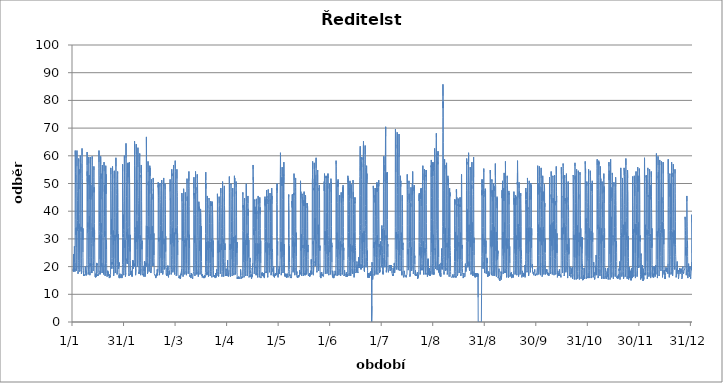
| Category | Series 0 |
|---|---|
| 2012-01-01 01:00:00 | 18.46 |
| 2012-01-01 02:00:00 | 18.72 |
| 2012-01-01 03:00:00 | 18.72 |
| 2012-01-01 04:00:00 | 18.72 |
| 2012-01-01 05:00:00 | 19.24 |
| 2012-01-01 06:00:00 | 18.2 |
| 2012-01-01 07:00:00 | 18.46 |
| 2012-01-01 08:00:00 | 24.44 |
| 2012-01-01 09:00:00 | 24.44 |
| 2012-01-01 10:00:00 | 23.66 |
| 2012-01-01 11:00:00 | 22.88 |
| 2012-01-01 12:00:00 | 22.1 |
| 2012-01-01 13:00:00 | 21.84 |
| 2012-01-01 14:00:00 | 21.58 |
| 2012-01-01 15:00:00 | 22.36 |
| 2012-01-01 16:00:00 | 21.84 |
| 2012-01-01 17:00:00 | 23.14 |
| 2012-01-01 18:00:00 | 23.66 |
| 2012-01-01 19:00:00 | 24.96 |
| 2012-01-01 20:00:00 | 26.52 |
| 2012-01-01 21:00:00 | 27.3 |
| 2012-01-01 22:00:00 | 27.04 |
| 2012-01-01 23:00:00 | 26 |
| 2012-01-02 | 25.74 |
| 2012-01-02 01:00:00 | 22.88 |
| 2012-01-02 02:00:00 | 18.72 |
| 2012-01-02 03:00:00 | 19.24 |
| 2012-01-02 04:00:00 | 18.2 |
| 2012-01-02 05:00:00 | 17.94 |
| 2012-01-02 06:00:00 | 21.32 |
| 2012-01-02 07:00:00 | 34.06 |
| 2012-01-02 08:00:00 | 60.32 |
| 2012-01-02 09:00:00 | 61.88 |
| 2012-01-02 10:00:00 | 60.32 |
| 2012-01-02 11:00:00 | 59.28 |
| 2012-01-02 12:00:00 | 54.08 |
| 2012-01-02 13:00:00 | 51.22 |
| 2012-01-02 14:00:00 | 53.04 |
| 2012-01-02 15:00:00 | 50.44 |
| 2012-01-02 16:00:00 | 44.72 |
| 2012-01-02 17:00:00 | 37.96 |
| 2012-01-02 18:00:00 | 36.92 |
| 2012-01-02 19:00:00 | 36.92 |
| 2012-01-02 20:00:00 | 31.46 |
| 2012-01-02 21:00:00 | 34.06 |
| 2012-01-02 22:00:00 | 27.04 |
| 2012-01-02 23:00:00 | 20.02 |
| 2012-01-03 | 18.46 |
| 2012-01-03 01:00:00 | 18.46 |
| 2012-01-03 02:00:00 | 18.46 |
| 2012-01-03 03:00:00 | 18.46 |
| 2012-01-03 04:00:00 | 18.46 |
| 2012-01-03 05:00:00 | 19.76 |
| 2012-01-03 06:00:00 | 22.62 |
| 2012-01-03 07:00:00 | 33.28 |
| 2012-01-03 08:00:00 | 58.5 |
| 2012-01-03 09:00:00 | 61.88 |
| 2012-01-03 10:00:00 | 56.16 |
| 2012-01-03 11:00:00 | 52 |
| 2012-01-03 12:00:00 | 49.92 |
| 2012-01-03 13:00:00 | 49.66 |
| 2012-01-03 14:00:00 | 47.06 |
| 2012-01-03 15:00:00 | 45.5 |
| 2012-01-03 16:00:00 | 43.94 |
| 2012-01-03 17:00:00 | 36.66 |
| 2012-01-03 18:00:00 | 33.02 |
| 2012-01-03 19:00:00 | 35.36 |
| 2012-01-03 20:00:00 | 35.36 |
| 2012-01-03 21:00:00 | 34.06 |
| 2012-01-03 22:00:00 | 24.96 |
| 2012-01-03 23:00:00 | 19.5 |
| 2012-01-04 | 17.42 |
| 2012-01-04 01:00:00 | 17.42 |
| 2012-01-04 02:00:00 | 17.68 |
| 2012-01-04 03:00:00 | 18.2 |
| 2012-01-04 04:00:00 | 18.98 |
| 2012-01-04 05:00:00 | 21.58 |
| 2012-01-04 06:00:00 | 22.1 |
| 2012-01-04 07:00:00 | 33.28 |
| 2012-01-04 08:00:00 | 55.12 |
| 2012-01-04 09:00:00 | 59.02 |
| 2012-01-04 10:00:00 | 59.02 |
| 2012-01-04 11:00:00 | 58.76 |
| 2012-01-04 12:00:00 | 57.98 |
| 2012-01-04 13:00:00 | 56.94 |
| 2012-01-04 14:00:00 | 53.3 |
| 2012-01-04 15:00:00 | 55.12 |
| 2012-01-04 16:00:00 | 47.84 |
| 2012-01-04 17:00:00 | 38.74 |
| 2012-01-04 18:00:00 | 35.88 |
| 2012-01-04 19:00:00 | 34.84 |
| 2012-01-04 20:00:00 | 34.06 |
| 2012-01-04 21:00:00 | 35.36 |
| 2012-01-04 22:00:00 | 24.96 |
| 2012-01-04 23:00:00 | 19.5 |
| 2012-01-05 | 18.2 |
| 2012-01-05 01:00:00 | 17.94 |
| 2012-01-05 02:00:00 | 18.2 |
| 2012-01-05 03:00:00 | 18.2 |
| 2012-01-05 04:00:00 | 18.2 |
| 2012-01-05 05:00:00 | 18.72 |
| 2012-01-05 06:00:00 | 21.06 |
| 2012-01-05 07:00:00 | 32.24 |
| 2012-01-05 08:00:00 | 55.9 |
| 2012-01-05 09:00:00 | 60.06 |
| 2012-01-05 10:00:00 | 57.72 |
| 2012-01-05 11:00:00 | 56.94 |
| 2012-01-05 12:00:00 | 53.82 |
| 2012-01-05 13:00:00 | 55.12 |
| 2012-01-05 14:00:00 | 57.2 |
| 2012-01-05 15:00:00 | 55.38 |
| 2012-01-05 16:00:00 | 42.64 |
| 2012-01-05 17:00:00 | 33.28 |
| 2012-01-05 18:00:00 | 34.32 |
| 2012-01-05 19:00:00 | 33.02 |
| 2012-01-05 20:00:00 | 34.06 |
| 2012-01-05 21:00:00 | 32.5 |
| 2012-01-05 22:00:00 | 22.88 |
| 2012-01-05 23:00:00 | 18.98 |
| 2012-01-06 | 17.42 |
| 2012-01-06 01:00:00 | 17.16 |
| 2012-01-06 02:00:00 | 17.42 |
| 2012-01-06 03:00:00 | 17.42 |
| 2012-01-06 04:00:00 | 17.16 |
| 2012-01-06 05:00:00 | 18.2 |
| 2012-01-06 06:00:00 | 19.5 |
| 2012-01-06 07:00:00 | 32.24 |
| 2012-01-06 08:00:00 | 55.38 |
| 2012-01-06 09:00:00 | 62.66 |
| 2012-01-06 10:00:00 | 60.32 |
| 2012-01-06 11:00:00 | 57.2 |
| 2012-01-06 12:00:00 | 53.82 |
| 2012-01-06 13:00:00 | 51.74 |
| 2012-01-06 14:00:00 | 52 |
| 2012-01-06 15:00:00 | 49.92 |
| 2012-01-06 16:00:00 | 40.82 |
| 2012-01-06 17:00:00 | 33.54 |
| 2012-01-06 18:00:00 | 31.98 |
| 2012-01-06 19:00:00 | 31.2 |
| 2012-01-06 20:00:00 | 29.64 |
| 2012-01-06 21:00:00 | 33.8 |
| 2012-01-06 22:00:00 | 25.22 |
| 2012-01-06 23:00:00 | 23.4 |
| 2012-01-07 | 20.54 |
| 2012-01-07 01:00:00 | 20.8 |
| 2012-01-07 02:00:00 | 20.54 |
| 2012-01-07 03:00:00 | 20.54 |
| 2012-01-07 04:00:00 | 20.28 |
| 2012-01-07 05:00:00 | 18.46 |
| 2012-01-07 06:00:00 | 16.64 |
| 2012-01-07 07:00:00 | 16.64 |
| 2012-01-07 08:00:00 | 16.9 |
| 2012-01-07 09:00:00 | 16.9 |
| 2012-01-07 10:00:00 | 16.64 |
| 2012-01-07 11:00:00 | 16.9 |
| 2012-01-07 12:00:00 | 16.9 |
| 2012-01-07 13:00:00 | 16.64 |
| 2012-01-07 14:00:00 | 16.9 |
| 2012-01-07 15:00:00 | 16.64 |
| 2012-01-07 16:00:00 | 17.16 |
| 2012-01-07 17:00:00 | 17.42 |
| 2012-01-07 18:00:00 | 17.16 |
| 2012-01-07 19:00:00 | 17.42 |
| 2012-01-07 20:00:00 | 17.42 |
| 2012-01-07 21:00:00 | 17.16 |
| 2012-01-07 22:00:00 | 17.16 |
| 2012-01-07 23:00:00 | 16.64 |
| 2012-01-08 | 16.9 |
| 2012-01-08 01:00:00 | 16.9 |
| 2012-01-08 02:00:00 | 16.9 |
| 2012-01-08 03:00:00 | 16.64 |
| 2012-01-08 04:00:00 | 16.9 |
| 2012-01-08 05:00:00 | 16.64 |
| 2012-01-08 06:00:00 | 17.16 |
| 2012-01-08 07:00:00 | 17.42 |
| 2012-01-08 08:00:00 | 20.02 |
| 2012-01-08 09:00:00 | 17.94 |
| 2012-01-08 10:00:00 | 18.2 |
| 2012-01-08 11:00:00 | 18.72 |
| 2012-01-08 12:00:00 | 17.68 |
| 2012-01-08 13:00:00 | 17.42 |
| 2012-01-08 14:00:00 | 17.94 |
| 2012-01-08 15:00:00 | 17.94 |
| 2012-01-08 16:00:00 | 17.94 |
| 2012-01-08 17:00:00 | 17.94 |
| 2012-01-08 18:00:00 | 18.46 |
| 2012-01-08 19:00:00 | 18.2 |
| 2012-01-08 20:00:00 | 16.9 |
| 2012-01-08 21:00:00 | 17.42 |
| 2012-01-08 22:00:00 | 17.42 |
| 2012-01-08 23:00:00 | 17.16 |
| 2012-01-09 | 16.9 |
| 2012-01-09 01:00:00 | 17.42 |
| 2012-01-09 02:00:00 | 17.16 |
| 2012-01-09 03:00:00 | 17.16 |
| 2012-01-09 04:00:00 | 17.42 |
| 2012-01-09 05:00:00 | 20.8 |
| 2012-01-09 06:00:00 | 20.54 |
| 2012-01-09 07:00:00 | 33.8 |
| 2012-01-09 08:00:00 | 56.42 |
| 2012-01-09 09:00:00 | 61.36 |
| 2012-01-09 10:00:00 | 56.68 |
| 2012-01-09 11:00:00 | 52.78 |
| 2012-01-09 12:00:00 | 54.34 |
| 2012-01-09 13:00:00 | 50.7 |
| 2012-01-09 14:00:00 | 52 |
| 2012-01-09 15:00:00 | 52.26 |
| 2012-01-09 16:00:00 | 43.42 |
| 2012-01-09 17:00:00 | 34.32 |
| 2012-01-09 18:00:00 | 35.88 |
| 2012-01-09 19:00:00 | 31.98 |
| 2012-01-09 20:00:00 | 30.16 |
| 2012-01-09 21:00:00 | 30.42 |
| 2012-01-09 22:00:00 | 22.62 |
| 2012-01-09 23:00:00 | 18.98 |
| 2012-01-10 | 17.16 |
| 2012-01-10 01:00:00 | 17.16 |
| 2012-01-10 02:00:00 | 16.9 |
| 2012-01-10 03:00:00 | 17.16 |
| 2012-01-10 04:00:00 | 16.9 |
| 2012-01-10 05:00:00 | 18.2 |
| 2012-01-10 06:00:00 | 20.8 |
| 2012-01-10 07:00:00 | 32.24 |
| 2012-01-10 08:00:00 | 54.86 |
| 2012-01-10 09:00:00 | 59.54 |
| 2012-01-10 10:00:00 | 57.2 |
| 2012-01-10 11:00:00 | 53.04 |
| 2012-01-10 12:00:00 | 50.7 |
| 2012-01-10 13:00:00 | 52.78 |
| 2012-01-10 14:00:00 | 49.66 |
| 2012-01-10 15:00:00 | 53.04 |
| 2012-01-10 16:00:00 | 44.2 |
| 2012-01-10 17:00:00 | 33.54 |
| 2012-01-10 18:00:00 | 38.22 |
| 2012-01-10 19:00:00 | 35.88 |
| 2012-01-10 20:00:00 | 34.58 |
| 2012-01-10 21:00:00 | 34.84 |
| 2012-01-10 22:00:00 | 23.4 |
| 2012-01-10 23:00:00 | 18.98 |
| 2012-01-11 | 16.9 |
| 2012-01-11 01:00:00 | 17.16 |
| 2012-01-11 02:00:00 | 16.9 |
| 2012-01-11 03:00:00 | 18.2 |
| 2012-01-11 04:00:00 | 21.06 |
| 2012-01-11 05:00:00 | 20.28 |
| 2012-01-11 06:00:00 | 21.32 |
| 2012-01-11 07:00:00 | 32.5 |
| 2012-01-11 08:00:00 | 55.64 |
| 2012-01-11 09:00:00 | 59.54 |
| 2012-01-11 10:00:00 | 58.24 |
| 2012-01-11 11:00:00 | 54.86 |
| 2012-01-11 12:00:00 | 48.88 |
| 2012-01-11 13:00:00 | 44.2 |
| 2012-01-11 14:00:00 | 44.98 |
| 2012-01-11 15:00:00 | 49.4 |
| 2012-01-11 16:00:00 | 44.98 |
| 2012-01-11 17:00:00 | 37.96 |
| 2012-01-11 18:00:00 | 36.4 |
| 2012-01-11 19:00:00 | 35.88 |
| 2012-01-11 20:00:00 | 33.02 |
| 2012-01-11 21:00:00 | 28.34 |
| 2012-01-11 22:00:00 | 23.4 |
| 2012-01-11 23:00:00 | 21.32 |
| 2012-01-12 | 17.94 |
| 2012-01-12 01:00:00 | 18.46 |
| 2012-01-12 02:00:00 | 18.2 |
| 2012-01-12 03:00:00 | 18.46 |
| 2012-01-12 04:00:00 | 17.68 |
| 2012-01-12 05:00:00 | 19.76 |
| 2012-01-12 06:00:00 | 21.06 |
| 2012-01-12 07:00:00 | 34.32 |
| 2012-01-12 08:00:00 | 56.42 |
| 2012-01-12 09:00:00 | 59.8 |
| 2012-01-12 10:00:00 | 58.76 |
| 2012-01-12 11:00:00 | 56.42 |
| 2012-01-12 12:00:00 | 46.54 |
| 2012-01-12 13:00:00 | 45.5 |
| 2012-01-12 14:00:00 | 47.58 |
| 2012-01-12 15:00:00 | 46.8 |
| 2012-01-12 16:00:00 | 39.52 |
| 2012-01-12 17:00:00 | 32.76 |
| 2012-01-12 18:00:00 | 30.68 |
| 2012-01-12 19:00:00 | 34.06 |
| 2012-01-12 20:00:00 | 33.8 |
| 2012-01-12 21:00:00 | 27.3 |
| 2012-01-12 22:00:00 | 22.1 |
| 2012-01-12 23:00:00 | 18.46 |
| 2012-01-13 | 18.98 |
| 2012-01-13 01:00:00 | 21.06 |
| 2012-01-13 02:00:00 | 20.54 |
| 2012-01-13 03:00:00 | 20.54 |
| 2012-01-13 04:00:00 | 20.54 |
| 2012-01-13 05:00:00 | 21.84 |
| 2012-01-13 06:00:00 | 22.62 |
| 2012-01-13 07:00:00 | 30.68 |
| 2012-01-13 08:00:00 | 52.26 |
| 2012-01-13 09:00:00 | 56.16 |
| 2012-01-13 10:00:00 | 54.86 |
| 2012-01-13 11:00:00 | 49.66 |
| 2012-01-13 12:00:00 | 46.8 |
| 2012-01-13 13:00:00 | 48.62 |
| 2012-01-13 14:00:00 | 46.8 |
| 2012-01-13 15:00:00 | 41.86 |
| 2012-01-13 16:00:00 | 35.62 |
| 2012-01-13 17:00:00 | 29.12 |
| 2012-01-13 18:00:00 | 33.28 |
| 2012-01-13 19:00:00 | 31.72 |
| 2012-01-13 20:00:00 | 29.64 |
| 2012-01-13 21:00:00 | 24.18 |
| 2012-01-13 22:00:00 | 21.32 |
| 2012-01-13 23:00:00 | 17.68 |
| 2012-01-14 | 16.9 |
| 2012-01-14 01:00:00 | 16.64 |
| 2012-01-14 02:00:00 | 16.38 |
| 2012-01-14 03:00:00 | 16.64 |
| 2012-01-14 04:00:00 | 16.38 |
| 2012-01-14 05:00:00 | 16.64 |
| 2012-01-14 06:00:00 | 16.9 |
| 2012-01-14 07:00:00 | 17.42 |
| 2012-01-14 08:00:00 | 17.16 |
| 2012-01-14 09:00:00 | 16.12 |
| 2012-01-14 10:00:00 | 16.38 |
| 2012-01-14 11:00:00 | 16.9 |
| 2012-01-14 12:00:00 | 17.16 |
| 2012-01-14 13:00:00 | 17.16 |
| 2012-01-14 14:00:00 | 17.16 |
| 2012-01-14 15:00:00 | 16.9 |
| 2012-01-14 16:00:00 | 16.64 |
| 2012-01-14 17:00:00 | 16.64 |
| 2012-01-14 18:00:00 | 16.9 |
| 2012-01-14 19:00:00 | 16.38 |
| 2012-01-14 20:00:00 | 16.64 |
| 2012-01-14 21:00:00 | 18.2 |
| 2012-01-14 22:00:00 | 21.06 |
| 2012-01-14 23:00:00 | 20.02 |
| 2012-01-15 | 21.32 |
| 2012-01-15 01:00:00 | 20.54 |
| 2012-01-15 02:00:00 | 21.06 |
| 2012-01-15 03:00:00 | 20.54 |
| 2012-01-15 04:00:00 | 21.06 |
| 2012-01-15 05:00:00 | 17.68 |
| 2012-01-15 06:00:00 | 16.64 |
| 2012-01-15 07:00:00 | 16.64 |
| 2012-01-15 08:00:00 | 16.9 |
| 2012-01-15 09:00:00 | 16.9 |
| 2012-01-15 10:00:00 | 16.9 |
| 2012-01-15 11:00:00 | 16.38 |
| 2012-01-15 12:00:00 | 16.64 |
| 2012-01-15 13:00:00 | 16.64 |
| 2012-01-15 14:00:00 | 16.38 |
| 2012-01-15 15:00:00 | 16.64 |
| 2012-01-15 16:00:00 | 16.64 |
| 2012-01-15 17:00:00 | 17.16 |
| 2012-01-15 18:00:00 | 16.9 |
| 2012-01-15 19:00:00 | 16.64 |
| 2012-01-15 20:00:00 | 16.9 |
| 2012-01-15 21:00:00 | 16.64 |
| 2012-01-15 22:00:00 | 16.64 |
| 2012-01-15 23:00:00 | 16.38 |
| 2012-01-16 | 16.38 |
| 2012-01-16 01:00:00 | 16.38 |
| 2012-01-16 02:00:00 | 16.38 |
| 2012-01-16 03:00:00 | 16.64 |
| 2012-01-16 04:00:00 | 17.16 |
| 2012-01-16 05:00:00 | 17.94 |
| 2012-01-16 06:00:00 | 20.02 |
| 2012-01-16 07:00:00 | 31.46 |
| 2012-01-16 08:00:00 | 55.38 |
| 2012-01-16 09:00:00 | 61.88 |
| 2012-01-16 10:00:00 | 57.72 |
| 2012-01-16 11:00:00 | 55.64 |
| 2012-01-16 12:00:00 | 52.78 |
| 2012-01-16 13:00:00 | 52 |
| 2012-01-16 14:00:00 | 49.4 |
| 2012-01-16 15:00:00 | 47.32 |
| 2012-01-16 16:00:00 | 40.3 |
| 2012-01-16 17:00:00 | 35.88 |
| 2012-01-16 18:00:00 | 34.32 |
| 2012-01-16 19:00:00 | 32.76 |
| 2012-01-16 20:00:00 | 30.16 |
| 2012-01-16 21:00:00 | 31.46 |
| 2012-01-16 22:00:00 | 22.62 |
| 2012-01-16 23:00:00 | 18.98 |
| 2012-01-17 | 17.16 |
| 2012-01-17 01:00:00 | 17.68 |
| 2012-01-17 02:00:00 | 17.42 |
| 2012-01-17 03:00:00 | 18.46 |
| 2012-01-17 04:00:00 | 17.42 |
| 2012-01-17 05:00:00 | 17.94 |
| 2012-01-17 06:00:00 | 19.5 |
| 2012-01-17 07:00:00 | 31.2 |
| 2012-01-17 08:00:00 | 53.82 |
| 2012-01-17 09:00:00 | 59.8 |
| 2012-01-17 10:00:00 | 56.94 |
| 2012-01-17 11:00:00 | 56.16 |
| 2012-01-17 12:00:00 | 53.82 |
| 2012-01-17 13:00:00 | 52.26 |
| 2012-01-17 14:00:00 | 51.74 |
| 2012-01-17 15:00:00 | 53.56 |
| 2012-01-17 16:00:00 | 44.2 |
| 2012-01-17 17:00:00 | 34.32 |
| 2012-01-17 18:00:00 | 35.62 |
| 2012-01-17 19:00:00 | 32.5 |
| 2012-01-17 20:00:00 | 29.9 |
| 2012-01-17 21:00:00 | 31.46 |
| 2012-01-17 22:00:00 | 22.1 |
| 2012-01-17 23:00:00 | 20.02 |
| 2012-01-18 | 21.32 |
| 2012-01-18 01:00:00 | 20.54 |
| 2012-01-18 02:00:00 | 20.28 |
| 2012-01-18 03:00:00 | 20.02 |
| 2012-01-18 04:00:00 | 19.76 |
| 2012-01-18 05:00:00 | 17.68 |
| 2012-01-18 06:00:00 | 20.54 |
| 2012-01-18 07:00:00 | 31.98 |
| 2012-01-18 08:00:00 | 54.6 |
| 2012-01-18 09:00:00 | 56.68 |
| 2012-01-18 10:00:00 | 53.82 |
| 2012-01-18 11:00:00 | 54.86 |
| 2012-01-18 12:00:00 | 53.04 |
| 2012-01-18 13:00:00 | 50.96 |
| 2012-01-18 14:00:00 | 45.24 |
| 2012-01-18 15:00:00 | 40.82 |
| 2012-01-18 16:00:00 | 38.74 |
| 2012-01-18 17:00:00 | 34.32 |
| 2012-01-18 18:00:00 | 33.54 |
| 2012-01-18 19:00:00 | 29.9 |
| 2012-01-18 20:00:00 | 29.12 |
| 2012-01-18 21:00:00 | 29.38 |
| 2012-01-18 22:00:00 | 23.14 |
| 2012-01-18 23:00:00 | 18.72 |
| 2012-01-19 | 17.68 |
| 2012-01-19 01:00:00 | 17.42 |
| 2012-01-19 02:00:00 | 17.42 |
| 2012-01-19 03:00:00 | 17.68 |
| 2012-01-19 04:00:00 | 17.16 |
| 2012-01-19 05:00:00 | 18.98 |
| 2012-01-19 06:00:00 | 20.28 |
| 2012-01-19 07:00:00 | 31.2 |
| 2012-01-19 08:00:00 | 54.86 |
| 2012-01-19 09:00:00 | 57.72 |
| 2012-01-19 10:00:00 | 54.34 |
| 2012-01-19 11:00:00 | 49.4 |
| 2012-01-19 12:00:00 | 48.62 |
| 2012-01-19 13:00:00 | 47.06 |
| 2012-01-19 14:00:00 | 48.1 |
| 2012-01-19 15:00:00 | 49.4 |
| 2012-01-19 16:00:00 | 38.22 |
| 2012-01-19 17:00:00 | 30.68 |
| 2012-01-19 18:00:00 | 30.42 |
| 2012-01-19 19:00:00 | 32.76 |
| 2012-01-19 20:00:00 | 30.94 |
| 2012-01-19 21:00:00 | 30.16 |
| 2012-01-19 22:00:00 | 22.62 |
| 2012-01-19 23:00:00 | 18.72 |
| 2012-01-20 | 16.64 |
| 2012-01-20 01:00:00 | 16.64 |
| 2012-01-20 02:00:00 | 20.28 |
| 2012-01-20 03:00:00 | 20.8 |
| 2012-01-20 04:00:00 | 20.02 |
| 2012-01-20 05:00:00 | 20.54 |
| 2012-01-20 06:00:00 | 22.36 |
| 2012-01-20 07:00:00 | 30.94 |
| 2012-01-20 08:00:00 | 53.3 |
| 2012-01-20 09:00:00 | 56.42 |
| 2012-01-20 10:00:00 | 51.48 |
| 2012-01-20 11:00:00 | 47.58 |
| 2012-01-20 12:00:00 | 46.28 |
| 2012-01-20 13:00:00 | 53.3 |
| 2012-01-20 14:00:00 | 48.88 |
| 2012-01-20 15:00:00 | 41.08 |
| 2012-01-20 16:00:00 | 28.34 |
| 2012-01-20 17:00:00 | 26.26 |
| 2012-01-20 18:00:00 | 27.04 |
| 2012-01-20 19:00:00 | 29.64 |
| 2012-01-20 20:00:00 | 29.12 |
| 2012-01-20 21:00:00 | 26.26 |
| 2012-01-20 22:00:00 | 21.06 |
| 2012-01-20 23:00:00 | 17.42 |
| 2012-01-21 | 16.9 |
| 2012-01-21 01:00:00 | 16.64 |
| 2012-01-21 02:00:00 | 16.64 |
| 2012-01-21 03:00:00 | 16.64 |
| 2012-01-21 04:00:00 | 16.38 |
| 2012-01-21 05:00:00 | 16.38 |
| 2012-01-21 06:00:00 | 16.9 |
| 2012-01-21 07:00:00 | 16.9 |
| 2012-01-21 08:00:00 | 17.42 |
| 2012-01-21 09:00:00 | 18.46 |
| 2012-01-21 10:00:00 | 18.72 |
| 2012-01-21 11:00:00 | 18.2 |
| 2012-01-21 12:00:00 | 18.46 |
| 2012-01-21 13:00:00 | 17.94 |
| 2012-01-21 14:00:00 | 18.46 |
| 2012-01-21 15:00:00 | 18.46 |
| 2012-01-21 16:00:00 | 18.46 |
| 2012-01-21 17:00:00 | 18.46 |
| 2012-01-21 18:00:00 | 16.9 |
| 2012-01-21 19:00:00 | 17.94 |
| 2012-01-21 20:00:00 | 17.68 |
| 2012-01-21 21:00:00 | 17.68 |
| 2012-01-21 22:00:00 | 16.64 |
| 2012-01-21 23:00:00 | 16.9 |
| 2012-01-22 | 16.64 |
| 2012-01-22 01:00:00 | 16.9 |
| 2012-01-22 02:00:00 | 16.9 |
| 2012-01-22 03:00:00 | 16.9 |
| 2012-01-22 04:00:00 | 16.9 |
| 2012-01-22 05:00:00 | 17.16 |
| 2012-01-22 06:00:00 | 16.9 |
| 2012-01-22 07:00:00 | 16.9 |
| 2012-01-22 08:00:00 | 16.9 |
| 2012-01-22 09:00:00 | 16.38 |
| 2012-01-22 10:00:00 | 16.12 |
| 2012-01-22 11:00:00 | 15.86 |
| 2012-01-22 12:00:00 | 16.12 |
| 2012-01-22 13:00:00 | 16.12 |
| 2012-01-22 14:00:00 | 16.12 |
| 2012-01-22 15:00:00 | 16.12 |
| 2012-01-22 16:00:00 | 16.64 |
| 2012-01-22 17:00:00 | 17.16 |
| 2012-01-22 18:00:00 | 17.16 |
| 2012-01-22 19:00:00 | 17.16 |
| 2012-01-22 20:00:00 | 16.9 |
| 2012-01-22 21:00:00 | 16.9 |
| 2012-01-22 22:00:00 | 17.16 |
| 2012-01-22 23:00:00 | 16.12 |
| 2012-01-23 | 16.38 |
| 2012-01-23 01:00:00 | 16.38 |
| 2012-01-23 02:00:00 | 16.64 |
| 2012-01-23 03:00:00 | 16.38 |
| 2012-01-23 04:00:00 | 16.64 |
| 2012-01-23 05:00:00 | 17.16 |
| 2012-01-23 06:00:00 | 20.54 |
| 2012-01-23 07:00:00 | 31.2 |
| 2012-01-23 08:00:00 | 54.08 |
| 2012-01-23 09:00:00 | 55.64 |
| 2012-01-23 10:00:00 | 53.3 |
| 2012-01-23 11:00:00 | 51.74 |
| 2012-01-23 12:00:00 | 47.58 |
| 2012-01-23 13:00:00 | 44.72 |
| 2012-01-23 14:00:00 | 44.98 |
| 2012-01-23 15:00:00 | 44.98 |
| 2012-01-23 16:00:00 | 36.92 |
| 2012-01-23 17:00:00 | 31.72 |
| 2012-01-23 18:00:00 | 37.18 |
| 2012-01-23 19:00:00 | 37.18 |
| 2012-01-23 20:00:00 | 34.06 |
| 2012-01-23 21:00:00 | 30.68 |
| 2012-01-23 22:00:00 | 22.88 |
| 2012-01-23 23:00:00 | 19.24 |
| 2012-01-24 | 20.28 |
| 2012-01-24 01:00:00 | 21.32 |
| 2012-01-24 02:00:00 | 20.8 |
| 2012-01-24 03:00:00 | 21.58 |
| 2012-01-24 04:00:00 | 21.06 |
| 2012-01-24 05:00:00 | 21.58 |
| 2012-01-24 06:00:00 | 22.88 |
| 2012-01-24 07:00:00 | 32.5 |
| 2012-01-24 08:00:00 | 53.56 |
| 2012-01-24 09:00:00 | 56.16 |
| 2012-01-24 10:00:00 | 54.86 |
| 2012-01-24 11:00:00 | 53.82 |
| 2012-01-24 12:00:00 | 53.3 |
| 2012-01-24 13:00:00 | 50.18 |
| 2012-01-24 14:00:00 | 49.14 |
| 2012-01-24 15:00:00 | 49.14 |
| 2012-01-24 16:00:00 | 41.6 |
| 2012-01-24 17:00:00 | 30.68 |
| 2012-01-24 18:00:00 | 31.46 |
| 2012-01-24 19:00:00 | 31.2 |
| 2012-01-24 20:00:00 | 33.02 |
| 2012-01-24 21:00:00 | 27.82 |
| 2012-01-24 22:00:00 | 23.14 |
| 2012-01-24 23:00:00 | 18.98 |
| 2012-01-25 | 17.16 |
| 2012-01-25 01:00:00 | 16.64 |
| 2012-01-25 02:00:00 | 16.64 |
| 2012-01-25 03:00:00 | 16.38 |
| 2012-01-25 04:00:00 | 16.9 |
| 2012-01-25 05:00:00 | 17.94 |
| 2012-01-25 06:00:00 | 21.06 |
| 2012-01-25 07:00:00 | 31.72 |
| 2012-01-25 08:00:00 | 53.3 |
| 2012-01-25 09:00:00 | 53.82 |
| 2012-01-25 10:00:00 | 54.6 |
| 2012-01-25 11:00:00 | 51.74 |
| 2012-01-25 12:00:00 | 49.92 |
| 2012-01-25 13:00:00 | 50.7 |
| 2012-01-25 14:00:00 | 49.4 |
| 2012-01-25 15:00:00 | 48.88 |
| 2012-01-25 16:00:00 | 37.7 |
| 2012-01-25 17:00:00 | 33.02 |
| 2012-01-25 18:00:00 | 31.72 |
| 2012-01-25 19:00:00 | 31.46 |
| 2012-01-25 20:00:00 | 29.38 |
| 2012-01-25 21:00:00 | 31.46 |
| 2012-01-25 22:00:00 | 22.88 |
| 2012-01-25 23:00:00 | 19.24 |
| 2012-01-26 | 17.68 |
| 2012-01-26 01:00:00 | 20.02 |
| 2012-01-26 02:00:00 | 21.32 |
| 2012-01-26 03:00:00 | 20.02 |
| 2012-01-26 04:00:00 | 19.76 |
| 2012-01-26 05:00:00 | 20.02 |
| 2012-01-26 06:00:00 | 22.62 |
| 2012-01-26 07:00:00 | 31.72 |
| 2012-01-26 08:00:00 | 54.34 |
| 2012-01-26 09:00:00 | 59.28 |
| 2012-01-26 10:00:00 | 56.16 |
| 2012-01-26 11:00:00 | 53.04 |
| 2012-01-26 12:00:00 | 51.22 |
| 2012-01-26 13:00:00 | 50.7 |
| 2012-01-26 14:00:00 | 48.1 |
| 2012-01-26 15:00:00 | 46.02 |
| 2012-01-26 16:00:00 | 39.52 |
| 2012-01-26 17:00:00 | 30.68 |
| 2012-01-26 18:00:00 | 32.76 |
| 2012-01-26 19:00:00 | 32.5 |
| 2012-01-26 20:00:00 | 33.28 |
| 2012-01-26 21:00:00 | 30.42 |
| 2012-01-26 22:00:00 | 22.1 |
| 2012-01-26 23:00:00 | 19.76 |
| 2012-01-27 | 17.68 |
| 2012-01-27 01:00:00 | 17.42 |
| 2012-01-27 02:00:00 | 17.16 |
| 2012-01-27 03:00:00 | 17.42 |
| 2012-01-27 04:00:00 | 17.42 |
| 2012-01-27 05:00:00 | 18.72 |
| 2012-01-27 06:00:00 | 20.8 |
| 2012-01-27 07:00:00 | 30.94 |
| 2012-01-27 08:00:00 | 51.48 |
| 2012-01-27 09:00:00 | 54.34 |
| 2012-01-27 10:00:00 | 53.56 |
| 2012-01-27 11:00:00 | 51.74 |
| 2012-01-27 12:00:00 | 48.62 |
| 2012-01-27 13:00:00 | 46.8 |
| 2012-01-27 14:00:00 | 41.34 |
| 2012-01-27 15:00:00 | 33.02 |
| 2012-01-27 16:00:00 | 29.38 |
| 2012-01-27 17:00:00 | 28.08 |
| 2012-01-27 18:00:00 | 31.72 |
| 2012-01-27 19:00:00 | 30.16 |
| 2012-01-27 20:00:00 | 29.64 |
| 2012-01-27 21:00:00 | 30.68 |
| 2012-01-27 22:00:00 | 21.58 |
| 2012-01-27 23:00:00 | 19.24 |
| 2012-01-28 | 19.24 |
| 2012-01-28 01:00:00 | 21.32 |
| 2012-01-28 02:00:00 | 20.28 |
| 2012-01-28 03:00:00 | 21.58 |
| 2012-01-28 04:00:00 | 20.28 |
| 2012-01-28 05:00:00 | 17.94 |
| 2012-01-28 06:00:00 | 16.12 |
| 2012-01-28 07:00:00 | 16.38 |
| 2012-01-28 08:00:00 | 16.9 |
| 2012-01-28 09:00:00 | 15.86 |
| 2012-01-28 10:00:00 | 16.12 |
| 2012-01-28 11:00:00 | 15.86 |
| 2012-01-28 12:00:00 | 15.86 |
| 2012-01-28 13:00:00 | 16.64 |
| 2012-01-28 14:00:00 | 15.86 |
| 2012-01-28 15:00:00 | 15.86 |
| 2012-01-28 16:00:00 | 16.12 |
| 2012-01-28 17:00:00 | 16.12 |
| 2012-01-28 18:00:00 | 16.38 |
| 2012-01-28 19:00:00 | 17.42 |
| 2012-01-28 20:00:00 | 16.64 |
| 2012-01-28 21:00:00 | 16.64 |
| 2012-01-28 22:00:00 | 16.64 |
| 2012-01-28 23:00:00 | 16.64 |
| 2012-01-29 | 16.64 |
| 2012-01-29 01:00:00 | 16.9 |
| 2012-01-29 02:00:00 | 16.38 |
| 2012-01-29 03:00:00 | 16.64 |
| 2012-01-29 04:00:00 | 16.9 |
| 2012-01-29 05:00:00 | 16.64 |
| 2012-01-29 06:00:00 | 16.64 |
| 2012-01-29 07:00:00 | 16.9 |
| 2012-01-29 08:00:00 | 16.64 |
| 2012-01-29 09:00:00 | 15.86 |
| 2012-01-29 10:00:00 | 15.86 |
| 2012-01-29 11:00:00 | 15.6 |
| 2012-01-29 12:00:00 | 15.6 |
| 2012-01-29 13:00:00 | 15.86 |
| 2012-01-29 14:00:00 | 15.86 |
| 2012-01-29 15:00:00 | 15.86 |
| 2012-01-29 16:00:00 | 15.86 |
| 2012-01-29 17:00:00 | 17.16 |
| 2012-01-29 18:00:00 | 16.9 |
| 2012-01-29 19:00:00 | 17.16 |
| 2012-01-29 20:00:00 | 16.64 |
| 2012-01-29 21:00:00 | 16.64 |
| 2012-01-29 22:00:00 | 16.64 |
| 2012-01-29 23:00:00 | 15.86 |
| 2012-01-30 | 15.6 |
| 2012-01-30 01:00:00 | 15.86 |
| 2012-01-30 02:00:00 | 16.12 |
| 2012-01-30 03:00:00 | 15.6 |
| 2012-01-30 04:00:00 | 16.9 |
| 2012-01-30 05:00:00 | 19.76 |
| 2012-01-30 06:00:00 | 20.8 |
| 2012-01-30 07:00:00 | 30.42 |
| 2012-01-30 08:00:00 | 56.94 |
| 2012-01-30 09:00:00 | 54.34 |
| 2012-01-30 10:00:00 | 51.48 |
| 2012-01-30 11:00:00 | 48.62 |
| 2012-01-30 12:00:00 | 47.32 |
| 2012-01-30 13:00:00 | 45.5 |
| 2012-01-30 14:00:00 | 43.42 |
| 2012-01-30 15:00:00 | 42.64 |
| 2012-01-30 16:00:00 | 37.18 |
| 2012-01-30 17:00:00 | 34.06 |
| 2012-01-30 18:00:00 | 38.74 |
| 2012-01-30 19:00:00 | 33.54 |
| 2012-01-30 20:00:00 | 31.98 |
| 2012-01-30 21:00:00 | 30.42 |
| 2012-01-30 22:00:00 | 21.58 |
| 2012-01-30 23:00:00 | 18.72 |
| 2012-01-31 | 16.9 |
| 2012-01-31 01:00:00 | 17.42 |
| 2012-01-31 02:00:00 | 17.16 |
| 2012-01-31 03:00:00 | 17.16 |
| 2012-01-31 04:00:00 | 17.16 |
| 2012-01-31 05:00:00 | 18.72 |
| 2012-01-31 06:00:00 | 19.24 |
| 2012-01-31 07:00:00 | 33.02 |
| 2012-01-31 08:00:00 | 56.68 |
| 2012-01-31 09:00:00 | 60.06 |
| 2012-01-31 10:00:00 | 57.2 |
| 2012-01-31 11:00:00 | 52.78 |
| 2012-01-31 12:00:00 | 49.92 |
| 2012-01-31 13:00:00 | 46.54 |
| 2012-01-31 14:00:00 | 43.94 |
| 2012-01-31 15:00:00 | 40.04 |
| 2012-01-31 16:00:00 | 33.28 |
| 2012-01-31 17:00:00 | 26.78 |
| 2012-01-31 18:00:00 | 29.12 |
| 2012-01-31 19:00:00 | 29.12 |
| 2012-01-31 20:00:00 | 29.64 |
| 2012-01-31 21:00:00 | 29.9 |
| 2012-01-31 22:00:00 | 22.36 |
| 2012-01-31 23:00:00 | 18.98 |
| 2012-02-01 | 16.38 |
| 2012-02-01 01:00:00 | 16.64 |
| 2012-02-01 02:00:00 | 16.64 |
| 2012-02-01 03:00:00 | 16.38 |
| 2012-02-01 04:00:00 | 16.64 |
| 2012-02-01 05:00:00 | 17.68 |
| 2012-02-01 06:00:00 | 24.96 |
| 2012-02-01 07:00:00 | 35.88 |
| 2012-02-01 08:00:00 | 64.48 |
| 2012-02-01 09:00:00 | 59.28 |
| 2012-02-01 10:00:00 | 57.46 |
| 2012-02-01 11:00:00 | 54.86 |
| 2012-02-01 12:00:00 | 54.08 |
| 2012-02-01 13:00:00 | 50.7 |
| 2012-02-01 14:00:00 | 49.14 |
| 2012-02-01 15:00:00 | 45.24 |
| 2012-02-01 16:00:00 | 36.4 |
| 2012-02-01 17:00:00 | 31.2 |
| 2012-02-01 18:00:00 | 32.5 |
| 2012-02-01 19:00:00 | 30.16 |
| 2012-02-01 20:00:00 | 29.9 |
| 2012-02-01 21:00:00 | 29.38 |
| 2012-02-01 22:00:00 | 22.1 |
| 2012-02-01 23:00:00 | 22.88 |
| 2012-02-02 | 22.1 |
| 2012-02-02 01:00:00 | 21.06 |
| 2012-02-02 02:00:00 | 22.36 |
| 2012-02-02 03:00:00 | 21.06 |
| 2012-02-02 04:00:00 | 22.1 |
| 2012-02-02 05:00:00 | 21.58 |
| 2012-02-02 06:00:00 | 21.06 |
| 2012-02-02 07:00:00 | 33.8 |
| 2012-02-02 08:00:00 | 57.2 |
| 2012-02-02 09:00:00 | 55.38 |
| 2012-02-02 10:00:00 | 54.08 |
| 2012-02-02 11:00:00 | 52.26 |
| 2012-02-02 12:00:00 | 57.46 |
| 2012-02-02 13:00:00 | 50.18 |
| 2012-02-02 14:00:00 | 44.72 |
| 2012-02-02 15:00:00 | 40.82 |
| 2012-02-02 16:00:00 | 34.06 |
| 2012-02-02 17:00:00 | 28.86 |
| 2012-02-02 18:00:00 | 31.46 |
| 2012-02-02 19:00:00 | 29.38 |
| 2012-02-02 20:00:00 | 29.64 |
| 2012-02-02 21:00:00 | 26.78 |
| 2012-02-02 22:00:00 | 22.1 |
| 2012-02-02 23:00:00 | 17.94 |
| 2012-02-03 | 17.16 |
| 2012-02-03 01:00:00 | 17.16 |
| 2012-02-03 02:00:00 | 16.64 |
| 2012-02-03 03:00:00 | 16.9 |
| 2012-02-03 04:00:00 | 17.42 |
| 2012-02-03 05:00:00 | 21.58 |
| 2012-02-03 06:00:00 | 25.74 |
| 2012-02-03 07:00:00 | 34.58 |
| 2012-02-03 08:00:00 | 57.72 |
| 2012-02-03 09:00:00 | 55.38 |
| 2012-02-03 10:00:00 | 53.04 |
| 2012-02-03 11:00:00 | 50.96 |
| 2012-02-03 12:00:00 | 48.62 |
| 2012-02-03 13:00:00 | 44.72 |
| 2012-02-03 14:00:00 | 40.56 |
| 2012-02-03 15:00:00 | 36.4 |
| 2012-02-03 16:00:00 | 30.42 |
| 2012-02-03 17:00:00 | 25.48 |
| 2012-02-03 18:00:00 | 30.94 |
| 2012-02-03 19:00:00 | 31.46 |
| 2012-02-03 20:00:00 | 29.12 |
| 2012-02-03 21:00:00 | 28.08 |
| 2012-02-03 22:00:00 | 22.1 |
| 2012-02-03 23:00:00 | 18.72 |
| 2012-02-04 | 17.16 |
| 2012-02-04 01:00:00 | 17.68 |
| 2012-02-04 02:00:00 | 17.16 |
| 2012-02-04 03:00:00 | 17.16 |
| 2012-02-04 04:00:00 | 17.16 |
| 2012-02-04 05:00:00 | 17.42 |
| 2012-02-04 06:00:00 | 17.42 |
| 2012-02-04 07:00:00 | 17.16 |
| 2012-02-04 08:00:00 | 17.16 |
| 2012-02-04 09:00:00 | 17.42 |
| 2012-02-04 10:00:00 | 17.42 |
| 2012-02-04 11:00:00 | 17.94 |
| 2012-02-04 12:00:00 | 18.46 |
| 2012-02-04 13:00:00 | 18.72 |
| 2012-02-04 14:00:00 | 17.68 |
| 2012-02-04 15:00:00 | 17.42 |
| 2012-02-04 16:00:00 | 17.42 |
| 2012-02-04 17:00:00 | 16.9 |
| 2012-02-04 18:00:00 | 16.9 |
| 2012-02-04 19:00:00 | 17.42 |
| 2012-02-04 20:00:00 | 16.64 |
| 2012-02-04 21:00:00 | 17.16 |
| 2012-02-04 22:00:00 | 16.38 |
| 2012-02-04 23:00:00 | 16.64 |
| 2012-02-05 | 16.64 |
| 2012-02-05 01:00:00 | 16.64 |
| 2012-02-05 02:00:00 | 16.64 |
| 2012-02-05 03:00:00 | 16.64 |
| 2012-02-05 04:00:00 | 16.64 |
| 2012-02-05 05:00:00 | 16.64 |
| 2012-02-05 06:00:00 | 21.84 |
| 2012-02-05 07:00:00 | 21.58 |
| 2012-02-05 08:00:00 | 22.36 |
| 2012-02-05 09:00:00 | 21.32 |
| 2012-02-05 10:00:00 | 20.54 |
| 2012-02-05 11:00:00 | 20.28 |
| 2012-02-05 12:00:00 | 20.28 |
| 2012-02-05 13:00:00 | 20.54 |
| 2012-02-05 14:00:00 | 20.02 |
| 2012-02-05 15:00:00 | 19.24 |
| 2012-02-05 16:00:00 | 20.02 |
| 2012-02-05 17:00:00 | 19.76 |
| 2012-02-05 18:00:00 | 22.1 |
| 2012-02-05 19:00:00 | 21.06 |
| 2012-02-05 20:00:00 | 21.58 |
| 2012-02-05 21:00:00 | 20.28 |
| 2012-02-05 22:00:00 | 21.06 |
| 2012-02-05 23:00:00 | 20.02 |
| 2012-02-06 | 20.02 |
| 2012-02-06 01:00:00 | 21.06 |
| 2012-02-06 02:00:00 | 20.02 |
| 2012-02-06 03:00:00 | 20.28 |
| 2012-02-06 04:00:00 | 20.54 |
| 2012-02-06 05:00:00 | 20.28 |
| 2012-02-06 06:00:00 | 21.58 |
| 2012-02-06 07:00:00 | 32.24 |
| 2012-02-06 08:00:00 | 56.42 |
| 2012-02-06 09:00:00 | 65.26 |
| 2012-02-06 10:00:00 | 62.66 |
| 2012-02-06 11:00:00 | 58.76 |
| 2012-02-06 12:00:00 | 56.68 |
| 2012-02-06 13:00:00 | 56.16 |
| 2012-02-06 14:00:00 | 55.64 |
| 2012-02-06 15:00:00 | 51.74 |
| 2012-02-06 16:00:00 | 42.64 |
| 2012-02-06 17:00:00 | 33.54 |
| 2012-02-06 18:00:00 | 34.06 |
| 2012-02-06 19:00:00 | 30.42 |
| 2012-02-06 20:00:00 | 28.6 |
| 2012-02-06 21:00:00 | 30.94 |
| 2012-02-06 22:00:00 | 23.14 |
| 2012-02-06 23:00:00 | 18.46 |
| 2012-02-07 | 16.9 |
| 2012-02-07 01:00:00 | 16.64 |
| 2012-02-07 02:00:00 | 16.9 |
| 2012-02-07 03:00:00 | 16.64 |
| 2012-02-07 04:00:00 | 17.16 |
| 2012-02-07 05:00:00 | 18.98 |
| 2012-02-07 06:00:00 | 25.74 |
| 2012-02-07 07:00:00 | 33.02 |
| 2012-02-07 08:00:00 | 60.06 |
| 2012-02-07 09:00:00 | 64.22 |
| 2012-02-07 10:00:00 | 60.58 |
| 2012-02-07 11:00:00 | 56.42 |
| 2012-02-07 12:00:00 | 47.58 |
| 2012-02-07 13:00:00 | 48.88 |
| 2012-02-07 14:00:00 | 47.58 |
| 2012-02-07 15:00:00 | 51.22 |
| 2012-02-07 16:00:00 | 38.74 |
| 2012-02-07 17:00:00 | 28.86 |
| 2012-02-07 18:00:00 | 36.4 |
| 2012-02-07 19:00:00 | 35.62 |
| 2012-02-07 20:00:00 | 33.28 |
| 2012-02-07 21:00:00 | 34.84 |
| 2012-02-07 22:00:00 | 26.26 |
| 2012-02-07 23:00:00 | 21.84 |
| 2012-02-08 | 20.54 |
| 2012-02-08 01:00:00 | 20.54 |
| 2012-02-08 02:00:00 | 20.02 |
| 2012-02-08 03:00:00 | 20.28 |
| 2012-02-08 04:00:00 | 20.02 |
| 2012-02-08 05:00:00 | 22.36 |
| 2012-02-08 06:00:00 | 22.1 |
| 2012-02-08 07:00:00 | 35.36 |
| 2012-02-08 08:00:00 | 56.94 |
| 2012-02-08 09:00:00 | 62.92 |
| 2012-02-08 10:00:00 | 55.9 |
| 2012-02-08 11:00:00 | 50.7 |
| 2012-02-08 12:00:00 | 45.76 |
| 2012-02-08 13:00:00 | 44.98 |
| 2012-02-08 14:00:00 | 43.94 |
| 2012-02-08 15:00:00 | 42.64 |
| 2012-02-08 16:00:00 | 37.96 |
| 2012-02-08 17:00:00 | 30.16 |
| 2012-02-08 18:00:00 | 31.72 |
| 2012-02-08 19:00:00 | 31.2 |
| 2012-02-08 20:00:00 | 28.86 |
| 2012-02-08 21:00:00 | 29.12 |
| 2012-02-08 22:00:00 | 22.1 |
| 2012-02-08 23:00:00 | 19.24 |
| 2012-02-09 | 17.42 |
| 2012-02-09 01:00:00 | 17.94 |
| 2012-02-09 02:00:00 | 17.42 |
| 2012-02-09 03:00:00 | 17.42 |
| 2012-02-09 04:00:00 | 17.42 |
| 2012-02-09 05:00:00 | 18.72 |
| 2012-02-09 06:00:00 | 20.54 |
| 2012-02-09 07:00:00 | 31.46 |
| 2012-02-09 08:00:00 | 54.08 |
| 2012-02-09 09:00:00 | 57.98 |
| 2012-02-09 10:00:00 | 60.84 |
| 2012-02-09 11:00:00 | 60.06 |
| 2012-02-09 12:00:00 | 52.52 |
| 2012-02-09 13:00:00 | 53.04 |
| 2012-02-09 14:00:00 | 52 |
| 2012-02-09 15:00:00 | 47.58 |
| 2012-02-09 16:00:00 | 36.66 |
| 2012-02-09 17:00:00 | 29.38 |
| 2012-02-09 18:00:00 | 31.2 |
| 2012-02-09 19:00:00 | 29.9 |
| 2012-02-09 20:00:00 | 27.56 |
| 2012-02-09 21:00:00 | 28.08 |
| 2012-02-09 22:00:00 | 21.58 |
| 2012-02-09 23:00:00 | 17.94 |
| 2012-02-10 | 16.9 |
| 2012-02-10 01:00:00 | 16.64 |
| 2012-02-10 02:00:00 | 16.64 |
| 2012-02-10 03:00:00 | 16.9 |
| 2012-02-10 04:00:00 | 17.16 |
| 2012-02-10 05:00:00 | 19.24 |
| 2012-02-10 06:00:00 | 26.26 |
| 2012-02-10 07:00:00 | 34.84 |
| 2012-02-10 08:00:00 | 56.68 |
| 2012-02-10 09:00:00 | 53.82 |
| 2012-02-10 10:00:00 | 54.08 |
| 2012-02-10 11:00:00 | 55.9 |
| 2012-02-10 12:00:00 | 51.74 |
| 2012-02-10 13:00:00 | 43.42 |
| 2012-02-10 14:00:00 | 40.3 |
| 2012-02-10 15:00:00 | 35.36 |
| 2012-02-10 16:00:00 | 29.38 |
| 2012-02-10 17:00:00 | 26.26 |
| 2012-02-10 18:00:00 | 28.6 |
| 2012-02-10 19:00:00 | 28.86 |
| 2012-02-10 20:00:00 | 29.38 |
| 2012-02-10 21:00:00 | 28.08 |
| 2012-02-10 22:00:00 | 22.36 |
| 2012-02-10 23:00:00 | 20.28 |
| 2012-02-11 | 17.42 |
| 2012-02-11 01:00:00 | 17.16 |
| 2012-02-11 02:00:00 | 17.42 |
| 2012-02-11 03:00:00 | 17.16 |
| 2012-02-11 04:00:00 | 17.68 |
| 2012-02-11 05:00:00 | 17.16 |
| 2012-02-11 06:00:00 | 17.42 |
| 2012-02-11 07:00:00 | 17.42 |
| 2012-02-11 08:00:00 | 16.9 |
| 2012-02-11 09:00:00 | 17.42 |
| 2012-02-11 10:00:00 | 17.16 |
| 2012-02-11 11:00:00 | 17.16 |
| 2012-02-11 12:00:00 | 16.9 |
| 2012-02-11 13:00:00 | 17.16 |
| 2012-02-11 14:00:00 | 16.9 |
| 2012-02-11 15:00:00 | 16.64 |
| 2012-02-11 16:00:00 | 17.16 |
| 2012-02-11 17:00:00 | 17.16 |
| 2012-02-11 18:00:00 | 17.16 |
| 2012-02-11 19:00:00 | 16.9 |
| 2012-02-11 20:00:00 | 17.16 |
| 2012-02-11 21:00:00 | 16.64 |
| 2012-02-11 22:00:00 | 16.38 |
| 2012-02-11 23:00:00 | 19.24 |
| 2012-02-12 | 20.28 |
| 2012-02-12 01:00:00 | 20.02 |
| 2012-02-12 02:00:00 | 18.46 |
| 2012-02-12 03:00:00 | 20.02 |
| 2012-02-12 04:00:00 | 20.54 |
| 2012-02-12 05:00:00 | 21.84 |
| 2012-02-12 06:00:00 | 20.8 |
| 2012-02-12 07:00:00 | 20.8 |
| 2012-02-12 08:00:00 | 20.54 |
| 2012-02-12 09:00:00 | 21.84 |
| 2012-02-12 10:00:00 | 20.8 |
| 2012-02-12 11:00:00 | 21.32 |
| 2012-02-12 12:00:00 | 20.02 |
| 2012-02-12 13:00:00 | 19.24 |
| 2012-02-12 14:00:00 | 17.94 |
| 2012-02-12 15:00:00 | 16.38 |
| 2012-02-12 16:00:00 | 16.38 |
| 2012-02-12 17:00:00 | 19.5 |
| 2012-02-12 18:00:00 | 20.54 |
| 2012-02-12 19:00:00 | 20.54 |
| 2012-02-12 20:00:00 | 19.5 |
| 2012-02-12 21:00:00 | 20.02 |
| 2012-02-12 22:00:00 | 20.28 |
| 2012-02-12 23:00:00 | 20.28 |
| 2012-02-13 | 20.02 |
| 2012-02-13 01:00:00 | 20.02 |
| 2012-02-13 02:00:00 | 21.32 |
| 2012-02-13 03:00:00 | 20.02 |
| 2012-02-13 04:00:00 | 21.32 |
| 2012-02-13 05:00:00 | 20.8 |
| 2012-02-13 06:00:00 | 21.06 |
| 2012-02-13 07:00:00 | 34.84 |
| 2012-02-13 08:00:00 | 64.74 |
| 2012-02-13 09:00:00 | 66.82 |
| 2012-02-13 10:00:00 | 62.92 |
| 2012-02-13 11:00:00 | 57.72 |
| 2012-02-13 12:00:00 | 54.6 |
| 2012-02-13 13:00:00 | 54.86 |
| 2012-02-13 14:00:00 | 47.58 |
| 2012-02-13 15:00:00 | 45.76 |
| 2012-02-13 16:00:00 | 41.6 |
| 2012-02-13 17:00:00 | 31.72 |
| 2012-02-13 18:00:00 | 34.58 |
| 2012-02-13 19:00:00 | 34.06 |
| 2012-02-13 20:00:00 | 30.68 |
| 2012-02-13 21:00:00 | 31.46 |
| 2012-02-13 22:00:00 | 23.4 |
| 2012-02-13 23:00:00 | 19.5 |
| 2012-02-14 | 17.42 |
| 2012-02-14 01:00:00 | 17.16 |
| 2012-02-14 02:00:00 | 17.42 |
| 2012-02-14 03:00:00 | 17.68 |
| 2012-02-14 04:00:00 | 17.42 |
| 2012-02-14 05:00:00 | 17.94 |
| 2012-02-14 06:00:00 | 20.8 |
| 2012-02-14 07:00:00 | 32.24 |
| 2012-02-14 08:00:00 | 57.98 |
| 2012-02-14 09:00:00 | 58.24 |
| 2012-02-14 10:00:00 | 54.08 |
| 2012-02-14 11:00:00 | 49.4 |
| 2012-02-14 12:00:00 | 49.92 |
| 2012-02-14 13:00:00 | 50.7 |
| 2012-02-14 14:00:00 | 47.58 |
| 2012-02-14 15:00:00 | 49.4 |
| 2012-02-14 16:00:00 | 38.22 |
| 2012-02-14 17:00:00 | 29.9 |
| 2012-02-14 18:00:00 | 34.32 |
| 2012-02-14 19:00:00 | 31.46 |
| 2012-02-14 20:00:00 | 30.16 |
| 2012-02-14 21:00:00 | 27.56 |
| 2012-02-14 22:00:00 | 22.88 |
| 2012-02-14 23:00:00 | 18.2 |
| 2012-02-15 | 19.76 |
| 2012-02-15 01:00:00 | 21.06 |
| 2012-02-15 02:00:00 | 19.76 |
| 2012-02-15 03:00:00 | 20.02 |
| 2012-02-15 04:00:00 | 19.76 |
| 2012-02-15 05:00:00 | 21.58 |
| 2012-02-15 06:00:00 | 21.06 |
| 2012-02-15 07:00:00 | 30.68 |
| 2012-02-15 08:00:00 | 53.82 |
| 2012-02-15 09:00:00 | 56.42 |
| 2012-02-15 10:00:00 | 52.78 |
| 2012-02-15 11:00:00 | 55.64 |
| 2012-02-15 12:00:00 | 46.28 |
| 2012-02-15 13:00:00 | 45.24 |
| 2012-02-15 14:00:00 | 45.5 |
| 2012-02-15 15:00:00 | 42.64 |
| 2012-02-15 16:00:00 | 37.18 |
| 2012-02-15 17:00:00 | 29.64 |
| 2012-02-15 18:00:00 | 30.68 |
| 2012-02-15 19:00:00 | 31.2 |
| 2012-02-15 20:00:00 | 31.72 |
| 2012-02-15 21:00:00 | 29.38 |
| 2012-02-15 22:00:00 | 22.62 |
| 2012-02-15 23:00:00 | 18.72 |
| 2012-02-16 | 17.68 |
| 2012-02-16 01:00:00 | 17.68 |
| 2012-02-16 02:00:00 | 17.42 |
| 2012-02-16 03:00:00 | 17.68 |
| 2012-02-16 04:00:00 | 17.68 |
| 2012-02-16 05:00:00 | 17.68 |
| 2012-02-16 06:00:00 | 19.76 |
| 2012-02-16 07:00:00 | 29.9 |
| 2012-02-16 08:00:00 | 50.18 |
| 2012-02-16 09:00:00 | 51.48 |
| 2012-02-16 10:00:00 | 49.14 |
| 2012-02-16 11:00:00 | 47.32 |
| 2012-02-16 12:00:00 | 44.2 |
| 2012-02-16 13:00:00 | 45.24 |
| 2012-02-16 14:00:00 | 46.28 |
| 2012-02-16 15:00:00 | 44.2 |
| 2012-02-16 16:00:00 | 35.1 |
| 2012-02-16 17:00:00 | 29.64 |
| 2012-02-16 18:00:00 | 33.8 |
| 2012-02-16 19:00:00 | 34.58 |
| 2012-02-16 20:00:00 | 32.5 |
| 2012-02-16 21:00:00 | 29.64 |
| 2012-02-16 22:00:00 | 21.84 |
| 2012-02-16 23:00:00 | 22.62 |
| 2012-02-17 | 21.32 |
| 2012-02-17 01:00:00 | 20.28 |
| 2012-02-17 02:00:00 | 20.8 |
| 2012-02-17 03:00:00 | 20.54 |
| 2012-02-17 04:00:00 | 20.8 |
| 2012-02-17 05:00:00 | 21.32 |
| 2012-02-17 06:00:00 | 20.28 |
| 2012-02-17 07:00:00 | 28.86 |
| 2012-02-17 08:00:00 | 50.7 |
| 2012-02-17 09:00:00 | 52 |
| 2012-02-17 10:00:00 | 50.44 |
| 2012-02-17 11:00:00 | 48.1 |
| 2012-02-17 12:00:00 | 47.32 |
| 2012-02-17 13:00:00 | 48.1 |
| 2012-02-17 14:00:00 | 44.46 |
| 2012-02-17 15:00:00 | 39.52 |
| 2012-02-17 16:00:00 | 30.68 |
| 2012-02-17 17:00:00 | 24.18 |
| 2012-02-17 18:00:00 | 31.46 |
| 2012-02-17 19:00:00 | 31.98 |
| 2012-02-17 20:00:00 | 31.2 |
| 2012-02-17 21:00:00 | 25.74 |
| 2012-02-17 22:00:00 | 22.88 |
| 2012-02-17 23:00:00 | 19.76 |
| 2012-02-18 | 17.42 |
| 2012-02-18 01:00:00 | 17.68 |
| 2012-02-18 02:00:00 | 17.16 |
| 2012-02-18 03:00:00 | 17.16 |
| 2012-02-18 04:00:00 | 17.42 |
| 2012-02-18 05:00:00 | 17.16 |
| 2012-02-18 06:00:00 | 17.68 |
| 2012-02-18 07:00:00 | 17.16 |
| 2012-02-18 08:00:00 | 16.9 |
| 2012-02-18 09:00:00 | 16.64 |
| 2012-02-18 10:00:00 | 16.64 |
| 2012-02-18 11:00:00 | 16.9 |
| 2012-02-18 12:00:00 | 16.64 |
| 2012-02-18 13:00:00 | 16.64 |
| 2012-02-18 14:00:00 | 16.64 |
| 2012-02-18 15:00:00 | 16.64 |
| 2012-02-18 16:00:00 | 16.9 |
| 2012-02-18 17:00:00 | 16.64 |
| 2012-02-18 18:00:00 | 16.38 |
| 2012-02-18 19:00:00 | 16.64 |
| 2012-02-18 20:00:00 | 16.64 |
| 2012-02-18 21:00:00 | 16.38 |
| 2012-02-18 22:00:00 | 16.64 |
| 2012-02-18 23:00:00 | 15.86 |
| 2012-02-19 | 16.38 |
| 2012-02-19 01:00:00 | 16.9 |
| 2012-02-19 02:00:00 | 16.38 |
| 2012-02-19 03:00:00 | 16.38 |
| 2012-02-19 04:00:00 | 16.64 |
| 2012-02-19 05:00:00 | 17.16 |
| 2012-02-19 06:00:00 | 16.64 |
| 2012-02-19 07:00:00 | 16.64 |
| 2012-02-19 08:00:00 | 17.16 |
| 2012-02-19 09:00:00 | 17.16 |
| 2012-02-19 10:00:00 | 16.9 |
| 2012-02-19 11:00:00 | 17.16 |
| 2012-02-19 12:00:00 | 17.42 |
| 2012-02-19 13:00:00 | 16.64 |
| 2012-02-19 14:00:00 | 17.42 |
| 2012-02-19 15:00:00 | 16.9 |
| 2012-02-19 16:00:00 | 16.9 |
| 2012-02-19 17:00:00 | 17.68 |
| 2012-02-19 18:00:00 | 18.98 |
| 2012-02-19 19:00:00 | 18.2 |
| 2012-02-19 20:00:00 | 17.42 |
| 2012-02-19 21:00:00 | 17.94 |
| 2012-02-19 22:00:00 | 17.42 |
| 2012-02-19 23:00:00 | 17.68 |
| 2012-02-20 | 17.16 |
| 2012-02-20 01:00:00 | 17.16 |
| 2012-02-20 02:00:00 | 17.42 |
| 2012-02-20 03:00:00 | 17.42 |
| 2012-02-20 04:00:00 | 17.16 |
| 2012-02-20 05:00:00 | 19.24 |
| 2012-02-20 06:00:00 | 19.5 |
| 2012-02-20 07:00:00 | 29.38 |
| 2012-02-20 08:00:00 | 50.44 |
| 2012-02-20 09:00:00 | 48.62 |
| 2012-02-20 10:00:00 | 49.4 |
| 2012-02-20 11:00:00 | 49.14 |
| 2012-02-20 12:00:00 | 45.76 |
| 2012-02-20 13:00:00 | 44.98 |
| 2012-02-20 14:00:00 | 45.24 |
| 2012-02-20 15:00:00 | 42.64 |
| 2012-02-20 16:00:00 | 33.54 |
| 2012-02-20 17:00:00 | 29.12 |
| 2012-02-20 18:00:00 | 29.9 |
| 2012-02-20 19:00:00 | 30.42 |
| 2012-02-20 20:00:00 | 29.9 |
| 2012-02-20 21:00:00 | 30.16 |
| 2012-02-20 22:00:00 | 22.62 |
| 2012-02-20 23:00:00 | 18.46 |
| 2012-02-21 | 16.9 |
| 2012-02-21 01:00:00 | 16.9 |
| 2012-02-21 02:00:00 | 16.9 |
| 2012-02-21 03:00:00 | 17.16 |
| 2012-02-21 04:00:00 | 17.68 |
| 2012-02-21 05:00:00 | 18.98 |
| 2012-02-21 06:00:00 | 23.66 |
| 2012-02-21 07:00:00 | 32.5 |
| 2012-02-21 08:00:00 | 50.18 |
| 2012-02-21 09:00:00 | 48.88 |
| 2012-02-21 10:00:00 | 47.58 |
| 2012-02-21 11:00:00 | 45.76 |
| 2012-02-21 12:00:00 | 44.2 |
| 2012-02-21 13:00:00 | 43.16 |
| 2012-02-21 14:00:00 | 43.42 |
| 2012-02-21 15:00:00 | 40.82 |
| 2012-02-21 16:00:00 | 34.84 |
| 2012-02-21 17:00:00 | 29.64 |
| 2012-02-21 18:00:00 | 30.68 |
| 2012-02-21 19:00:00 | 30.94 |
| 2012-02-21 20:00:00 | 29.9 |
| 2012-02-21 21:00:00 | 32.24 |
| 2012-02-21 22:00:00 | 23.14 |
| 2012-02-21 23:00:00 | 20.54 |
| 2012-02-22 | 18.2 |
| 2012-02-22 01:00:00 | 17.94 |
| 2012-02-22 02:00:00 | 17.68 |
| 2012-02-22 03:00:00 | 17.68 |
| 2012-02-22 04:00:00 | 17.94 |
| 2012-02-22 05:00:00 | 20.02 |
| 2012-02-22 06:00:00 | 20.02 |
| 2012-02-22 07:00:00 | 31.2 |
| 2012-02-22 08:00:00 | 51.22 |
| 2012-02-22 09:00:00 | 50.96 |
| 2012-02-22 10:00:00 | 49.92 |
| 2012-02-22 11:00:00 | 49.4 |
| 2012-02-22 12:00:00 | 47.32 |
| 2012-02-22 13:00:00 | 46.54 |
| 2012-02-22 14:00:00 | 43.68 |
| 2012-02-22 15:00:00 | 41.6 |
| 2012-02-22 16:00:00 | 35.88 |
| 2012-02-22 17:00:00 | 30.42 |
| 2012-02-22 18:00:00 | 32.76 |
| 2012-02-22 19:00:00 | 28.6 |
| 2012-02-22 20:00:00 | 30.94 |
| 2012-02-22 21:00:00 | 28.6 |
| 2012-02-22 22:00:00 | 22.1 |
| 2012-02-22 23:00:00 | 18.72 |
| 2012-02-23 | 17.16 |
| 2012-02-23 01:00:00 | 17.42 |
| 2012-02-23 02:00:00 | 17.16 |
| 2012-02-23 03:00:00 | 17.16 |
| 2012-02-23 04:00:00 | 17.42 |
| 2012-02-23 05:00:00 | 18.46 |
| 2012-02-23 06:00:00 | 21.32 |
| 2012-02-23 07:00:00 | 31.72 |
| 2012-02-23 08:00:00 | 50.44 |
| 2012-02-23 09:00:00 | 51.22 |
| 2012-02-23 10:00:00 | 50.96 |
| 2012-02-23 11:00:00 | 51.22 |
| 2012-02-23 12:00:00 | 49.14 |
| 2012-02-23 13:00:00 | 50.44 |
| 2012-02-23 14:00:00 | 52 |
| 2012-02-23 15:00:00 | 49.14 |
| 2012-02-23 16:00:00 | 37.7 |
| 2012-02-23 17:00:00 | 28.08 |
| 2012-02-23 18:00:00 | 28.34 |
| 2012-02-23 19:00:00 | 29.64 |
| 2012-02-23 20:00:00 | 29.12 |
| 2012-02-23 21:00:00 | 29.9 |
| 2012-02-23 22:00:00 | 22.88 |
| 2012-02-23 23:00:00 | 18.98 |
| 2012-02-24 | 20.54 |
| 2012-02-24 01:00:00 | 20.02 |
| 2012-02-24 02:00:00 | 20.02 |
| 2012-02-24 03:00:00 | 19.76 |
| 2012-02-24 04:00:00 | 19.76 |
| 2012-02-24 05:00:00 | 19.24 |
| 2012-02-24 06:00:00 | 20.02 |
| 2012-02-24 07:00:00 | 29.9 |
| 2012-02-24 08:00:00 | 49.4 |
| 2012-02-24 09:00:00 | 49.92 |
| 2012-02-24 10:00:00 | 49.92 |
| 2012-02-24 11:00:00 | 47.84 |
| 2012-02-24 12:00:00 | 45.76 |
| 2012-02-24 13:00:00 | 44.2 |
| 2012-02-24 14:00:00 | 41.86 |
| 2012-02-24 15:00:00 | 38.74 |
| 2012-02-24 16:00:00 | 29.12 |
| 2012-02-24 17:00:00 | 25.48 |
| 2012-02-24 18:00:00 | 30.94 |
| 2012-02-24 19:00:00 | 29.64 |
| 2012-02-24 20:00:00 | 28.08 |
| 2012-02-24 21:00:00 | 24.7 |
| 2012-02-24 22:00:00 | 21.84 |
| 2012-02-24 23:00:00 | 19.24 |
| 2012-02-25 | 17.16 |
| 2012-02-25 01:00:00 | 17.42 |
| 2012-02-25 02:00:00 | 17.42 |
| 2012-02-25 03:00:00 | 17.16 |
| 2012-02-25 04:00:00 | 17.16 |
| 2012-02-25 05:00:00 | 17.42 |
| 2012-02-25 06:00:00 | 17.42 |
| 2012-02-25 07:00:00 | 17.42 |
| 2012-02-25 08:00:00 | 17.16 |
| 2012-02-25 09:00:00 | 17.16 |
| 2012-02-25 10:00:00 | 16.64 |
| 2012-02-25 11:00:00 | 16.9 |
| 2012-02-25 12:00:00 | 17.42 |
| 2012-02-25 13:00:00 | 16.9 |
| 2012-02-25 14:00:00 | 17.68 |
| 2012-02-25 15:00:00 | 19.5 |
| 2012-02-25 16:00:00 | 17.94 |
| 2012-02-25 17:00:00 | 18.2 |
| 2012-02-25 18:00:00 | 18.2 |
| 2012-02-25 19:00:00 | 16.9 |
| 2012-02-25 20:00:00 | 20.28 |
| 2012-02-25 21:00:00 | 20.54 |
| 2012-02-25 22:00:00 | 19.76 |
| 2012-02-25 23:00:00 | 19.76 |
| 2012-02-26 | 20.02 |
| 2012-02-26 01:00:00 | 19.76 |
| 2012-02-26 02:00:00 | 19.76 |
| 2012-02-26 03:00:00 | 19.76 |
| 2012-02-26 04:00:00 | 20.28 |
| 2012-02-26 05:00:00 | 18.72 |
| 2012-02-26 06:00:00 | 16.64 |
| 2012-02-26 07:00:00 | 16.9 |
| 2012-02-26 08:00:00 | 16.9 |
| 2012-02-26 09:00:00 | 16.9 |
| 2012-02-26 10:00:00 | 16.12 |
| 2012-02-26 11:00:00 | 16.9 |
| 2012-02-26 12:00:00 | 16.64 |
| 2012-02-26 13:00:00 | 16.9 |
| 2012-02-26 14:00:00 | 16.9 |
| 2012-02-26 15:00:00 | 16.64 |
| 2012-02-26 16:00:00 | 16.64 |
| 2012-02-26 17:00:00 | 16.9 |
| 2012-02-26 18:00:00 | 17.94 |
| 2012-02-26 19:00:00 | 18.46 |
| 2012-02-26 20:00:00 | 18.72 |
| 2012-02-26 21:00:00 | 17.68 |
| 2012-02-26 22:00:00 | 17.42 |
| 2012-02-26 23:00:00 | 17.16 |
| 2012-02-27 | 17.42 |
| 2012-02-27 01:00:00 | 17.42 |
| 2012-02-27 02:00:00 | 17.68 |
| 2012-02-27 03:00:00 | 17.42 |
| 2012-02-27 04:00:00 | 17.42 |
| 2012-02-27 05:00:00 | 18.98 |
| 2012-02-27 06:00:00 | 19.76 |
| 2012-02-27 07:00:00 | 32.24 |
| 2012-02-27 08:00:00 | 48.36 |
| 2012-02-27 09:00:00 | 51.48 |
| 2012-02-27 10:00:00 | 47.06 |
| 2012-02-27 11:00:00 | 46.8 |
| 2012-02-27 12:00:00 | 44.72 |
| 2012-02-27 13:00:00 | 43.94 |
| 2012-02-27 14:00:00 | 44.72 |
| 2012-02-27 15:00:00 | 42.64 |
| 2012-02-27 16:00:00 | 34.84 |
| 2012-02-27 17:00:00 | 28.08 |
| 2012-02-27 18:00:00 | 31.72 |
| 2012-02-27 19:00:00 | 31.2 |
| 2012-02-27 20:00:00 | 30.42 |
| 2012-02-27 21:00:00 | 29.12 |
| 2012-02-27 22:00:00 | 22.36 |
| 2012-02-27 23:00:00 | 17.68 |
| 2012-02-28 | 17.16 |
| 2012-02-28 01:00:00 | 17.42 |
| 2012-02-28 02:00:00 | 17.16 |
| 2012-02-28 03:00:00 | 17.16 |
| 2012-02-28 04:00:00 | 17.94 |
| 2012-02-28 05:00:00 | 18.98 |
| 2012-02-28 06:00:00 | 23.92 |
| 2012-02-28 07:00:00 | 36.14 |
| 2012-02-28 08:00:00 | 55.12 |
| 2012-02-28 09:00:00 | 52.78 |
| 2012-02-28 10:00:00 | 53.56 |
| 2012-02-28 11:00:00 | 52.52 |
| 2012-02-28 12:00:00 | 52.52 |
| 2012-02-28 13:00:00 | 52.26 |
| 2012-02-28 14:00:00 | 50.96 |
| 2012-02-28 15:00:00 | 46.54 |
| 2012-02-28 16:00:00 | 36.66 |
| 2012-02-28 17:00:00 | 31.72 |
| 2012-02-28 18:00:00 | 33.8 |
| 2012-02-28 19:00:00 | 30.42 |
| 2012-02-28 20:00:00 | 32.5 |
| 2012-02-28 21:00:00 | 28.34 |
| 2012-02-28 22:00:00 | 22.62 |
| 2012-02-28 23:00:00 | 20.8 |
| 2012-02-29 | 17.94 |
| 2012-02-29 01:00:00 | 17.94 |
| 2012-02-29 02:00:00 | 17.94 |
| 2012-02-29 03:00:00 | 17.94 |
| 2012-02-29 04:00:00 | 17.94 |
| 2012-02-29 05:00:00 | 19.76 |
| 2012-02-29 06:00:00 | 20.02 |
| 2012-02-29 07:00:00 | 31.46 |
| 2012-02-29 08:00:00 | 54.34 |
| 2012-02-29 09:00:00 | 56.68 |
| 2012-02-29 10:00:00 | 55.64 |
| 2012-02-29 11:00:00 | 53.82 |
| 2012-02-29 12:00:00 | 50.18 |
| 2012-02-29 13:00:00 | 48.88 |
| 2012-02-29 14:00:00 | 46.02 |
| 2012-02-29 15:00:00 | 41.6 |
| 2012-02-29 16:00:00 | 31.98 |
| 2012-02-29 17:00:00 | 27.3 |
| 2012-02-29 18:00:00 | 30.42 |
| 2012-02-29 19:00:00 | 29.12 |
| 2012-02-29 20:00:00 | 32.24 |
| 2012-02-29 21:00:00 | 29.12 |
| 2012-02-29 22:00:00 | 20.8 |
| 2012-02-29 23:00:00 | 17.68 |
| 2012-03-01 | 17.16 |
| 2012-03-01 01:00:00 | 16.9 |
| 2012-03-01 02:00:00 | 16.9 |
| 2012-03-01 03:00:00 | 17.16 |
| 2012-03-01 04:00:00 | 17.68 |
| 2012-03-01 05:00:00 | 18.46 |
| 2012-03-01 06:00:00 | 21.32 |
| 2012-03-01 07:00:00 | 34.06 |
| 2012-03-01 08:00:00 | 53.82 |
| 2012-03-01 09:00:00 | 58.24 |
| 2012-03-01 10:00:00 | 55.64 |
| 2012-03-01 11:00:00 | 54.34 |
| 2012-03-01 12:00:00 | 51.22 |
| 2012-03-01 13:00:00 | 51.22 |
| 2012-03-01 14:00:00 | 51.48 |
| 2012-03-01 15:00:00 | 49.92 |
| 2012-03-01 16:00:00 | 40.3 |
| 2012-03-01 17:00:00 | 31.72 |
| 2012-03-01 18:00:00 | 33.8 |
| 2012-03-01 19:00:00 | 31.72 |
| 2012-03-01 20:00:00 | 31.72 |
| 2012-03-01 21:00:00 | 30.42 |
| 2012-03-01 22:00:00 | 22.1 |
| 2012-03-01 23:00:00 | 18.46 |
| 2012-03-02 | 16.64 |
| 2012-03-02 01:00:00 | 16.9 |
| 2012-03-02 02:00:00 | 16.64 |
| 2012-03-02 03:00:00 | 16.9 |
| 2012-03-02 04:00:00 | 16.9 |
| 2012-03-02 05:00:00 | 18.72 |
| 2012-03-02 06:00:00 | 21.58 |
| 2012-03-02 07:00:00 | 33.8 |
| 2012-03-02 08:00:00 | 49.66 |
| 2012-03-02 09:00:00 | 55.12 |
| 2012-03-02 10:00:00 | 51.74 |
| 2012-03-02 11:00:00 | 50.7 |
| 2012-03-02 12:00:00 | 47.58 |
| 2012-03-02 13:00:00 | 47.32 |
| 2012-03-02 14:00:00 | 46.8 |
| 2012-03-02 15:00:00 | 45.24 |
| 2012-03-02 16:00:00 | 34.84 |
| 2012-03-02 17:00:00 | 28.34 |
| 2012-03-02 18:00:00 | 31.98 |
| 2012-03-02 19:00:00 | 28.86 |
| 2012-03-02 20:00:00 | 29.38 |
| 2012-03-02 21:00:00 | 24.18 |
| 2012-03-02 22:00:00 | 20.28 |
| 2012-03-02 23:00:00 | 17.68 |
| 2012-03-03 | 16.9 |
| 2012-03-03 01:00:00 | 16.9 |
| 2012-03-03 02:00:00 | 16.9 |
| 2012-03-03 03:00:00 | 16.64 |
| 2012-03-03 04:00:00 | 16.9 |
| 2012-03-03 05:00:00 | 16.64 |
| 2012-03-03 06:00:00 | 17.16 |
| 2012-03-03 07:00:00 | 16.9 |
| 2012-03-03 08:00:00 | 16.9 |
| 2012-03-03 09:00:00 | 16.9 |
| 2012-03-03 10:00:00 | 17.16 |
| 2012-03-03 11:00:00 | 16.64 |
| 2012-03-03 12:00:00 | 16.38 |
| 2012-03-03 13:00:00 | 16.12 |
| 2012-03-03 14:00:00 | 15.86 |
| 2012-03-03 15:00:00 | 16.12 |
| 2012-03-03 16:00:00 | 16.12 |
| 2012-03-03 17:00:00 | 16.12 |
| 2012-03-03 18:00:00 | 16.12 |
| 2012-03-03 19:00:00 | 16.38 |
| 2012-03-03 20:00:00 | 16.64 |
| 2012-03-03 21:00:00 | 16.38 |
| 2012-03-03 22:00:00 | 16.38 |
| 2012-03-03 23:00:00 | 15.86 |
| 2012-03-04 | 16.38 |
| 2012-03-04 01:00:00 | 16.38 |
| 2012-03-04 02:00:00 | 16.12 |
| 2012-03-04 03:00:00 | 16.64 |
| 2012-03-04 04:00:00 | 16.38 |
| 2012-03-04 05:00:00 | 16.64 |
| 2012-03-04 06:00:00 | 16.64 |
| 2012-03-04 07:00:00 | 15.86 |
| 2012-03-04 08:00:00 | 16.9 |
| 2012-03-04 09:00:00 | 15.6 |
| 2012-03-04 10:00:00 | 15.86 |
| 2012-03-04 11:00:00 | 15.6 |
| 2012-03-04 12:00:00 | 15.86 |
| 2012-03-04 13:00:00 | 15.86 |
| 2012-03-04 14:00:00 | 16.12 |
| 2012-03-04 15:00:00 | 16.38 |
| 2012-03-04 16:00:00 | 15.86 |
| 2012-03-04 17:00:00 | 16.38 |
| 2012-03-04 18:00:00 | 16.38 |
| 2012-03-04 19:00:00 | 17.42 |
| 2012-03-04 20:00:00 | 16.9 |
| 2012-03-04 21:00:00 | 17.16 |
| 2012-03-04 22:00:00 | 16.64 |
| 2012-03-04 23:00:00 | 17.16 |
| 2012-03-05 | 17.16 |
| 2012-03-05 01:00:00 | 16.9 |
| 2012-03-05 02:00:00 | 16.9 |
| 2012-03-05 03:00:00 | 16.9 |
| 2012-03-05 04:00:00 | 16.64 |
| 2012-03-05 05:00:00 | 19.24 |
| 2012-03-05 06:00:00 | 18.98 |
| 2012-03-05 07:00:00 | 30.68 |
| 2012-03-05 08:00:00 | 46.54 |
| 2012-03-05 09:00:00 | 46.8 |
| 2012-03-05 10:00:00 | 46.28 |
| 2012-03-05 11:00:00 | 43.68 |
| 2012-03-05 12:00:00 | 43.68 |
| 2012-03-05 13:00:00 | 43.16 |
| 2012-03-05 14:00:00 | 41.08 |
| 2012-03-05 15:00:00 | 40.04 |
| 2012-03-05 16:00:00 | 33.02 |
| 2012-03-05 17:00:00 | 29.38 |
| 2012-03-05 18:00:00 | 32.24 |
| 2012-03-05 19:00:00 | 29.9 |
| 2012-03-05 20:00:00 | 33.02 |
| 2012-03-05 21:00:00 | 30.16 |
| 2012-03-05 22:00:00 | 22.36 |
| 2012-03-05 23:00:00 | 18.72 |
| 2012-03-06 | 16.38 |
| 2012-03-06 01:00:00 | 16.38 |
| 2012-03-06 02:00:00 | 16.38 |
| 2012-03-06 03:00:00 | 16.38 |
| 2012-03-06 04:00:00 | 16.38 |
| 2012-03-06 05:00:00 | 19.24 |
| 2012-03-06 06:00:00 | 21.32 |
| 2012-03-06 07:00:00 | 30.68 |
| 2012-03-06 08:00:00 | 48.1 |
| 2012-03-06 09:00:00 | 46.8 |
| 2012-03-06 10:00:00 | 47.06 |
| 2012-03-06 11:00:00 | 43.42 |
| 2012-03-06 12:00:00 | 43.16 |
| 2012-03-06 13:00:00 | 42.64 |
| 2012-03-06 14:00:00 | 39.52 |
| 2012-03-06 15:00:00 | 36.4 |
| 2012-03-06 16:00:00 | 31.2 |
| 2012-03-06 17:00:00 | 29.12 |
| 2012-03-06 18:00:00 | 29.64 |
| 2012-03-06 19:00:00 | 29.64 |
| 2012-03-06 20:00:00 | 28.34 |
| 2012-03-06 21:00:00 | 27.82 |
| 2012-03-06 22:00:00 | 22.36 |
| 2012-03-06 23:00:00 | 20.02 |
| 2012-03-07 | 18.2 |
| 2012-03-07 01:00:00 | 17.16 |
| 2012-03-07 02:00:00 | 17.16 |
| 2012-03-07 03:00:00 | 17.16 |
| 2012-03-07 04:00:00 | 17.16 |
| 2012-03-07 05:00:00 | 18.46 |
| 2012-03-07 06:00:00 | 19.24 |
| 2012-03-07 07:00:00 | 31.46 |
| 2012-03-07 08:00:00 | 46.8 |
| 2012-03-07 09:00:00 | 44.2 |
| 2012-03-07 10:00:00 | 42.12 |
| 2012-03-07 11:00:00 | 42.9 |
| 2012-03-07 12:00:00 | 42.12 |
| 2012-03-07 13:00:00 | 41.6 |
| 2012-03-07 14:00:00 | 40.04 |
| 2012-03-07 15:00:00 | 37.44 |
| 2012-03-07 16:00:00 | 31.98 |
| 2012-03-07 17:00:00 | 27.3 |
| 2012-03-07 18:00:00 | 30.16 |
| 2012-03-07 19:00:00 | 28.6 |
| 2012-03-07 20:00:00 | 29.12 |
| 2012-03-07 21:00:00 | 28.86 |
| 2012-03-07 22:00:00 | 21.06 |
| 2012-03-07 23:00:00 | 17.42 |
| 2012-03-08 | 16.9 |
| 2012-03-08 01:00:00 | 16.64 |
| 2012-03-08 02:00:00 | 16.9 |
| 2012-03-08 03:00:00 | 16.64 |
| 2012-03-08 04:00:00 | 17.16 |
| 2012-03-08 05:00:00 | 18.2 |
| 2012-03-08 06:00:00 | 20.28 |
| 2012-03-08 07:00:00 | 29.38 |
| 2012-03-08 08:00:00 | 51.74 |
| 2012-03-08 09:00:00 | 50.18 |
| 2012-03-08 10:00:00 | 44.2 |
| 2012-03-08 11:00:00 | 44.2 |
| 2012-03-08 12:00:00 | 43.68 |
| 2012-03-08 13:00:00 | 45.24 |
| 2012-03-08 14:00:00 | 43.68 |
| 2012-03-08 15:00:00 | 44.46 |
| 2012-03-08 16:00:00 | 38.74 |
| 2012-03-08 17:00:00 | 30.68 |
| 2012-03-08 18:00:00 | 31.98 |
| 2012-03-08 19:00:00 | 31.72 |
| 2012-03-08 20:00:00 | 33.02 |
| 2012-03-08 21:00:00 | 29.38 |
| 2012-03-08 22:00:00 | 22.62 |
| 2012-03-08 23:00:00 | 20.28 |
| 2012-03-09 | 18.72 |
| 2012-03-09 01:00:00 | 18.46 |
| 2012-03-09 02:00:00 | 17.42 |
| 2012-03-09 03:00:00 | 17.94 |
| 2012-03-09 04:00:00 | 17.68 |
| 2012-03-09 05:00:00 | 18.72 |
| 2012-03-09 06:00:00 | 20.02 |
| 2012-03-09 07:00:00 | 30.16 |
| 2012-03-09 08:00:00 | 48.1 |
| 2012-03-09 09:00:00 | 53.56 |
| 2012-03-09 10:00:00 | 53.82 |
| 2012-03-09 11:00:00 | 54.34 |
| 2012-03-09 12:00:00 | 50.96 |
| 2012-03-09 13:00:00 | 49.92 |
| 2012-03-09 14:00:00 | 48.88 |
| 2012-03-09 15:00:00 | 41.6 |
| 2012-03-09 16:00:00 | 29.9 |
| 2012-03-09 17:00:00 | 26.78 |
| 2012-03-09 18:00:00 | 31.46 |
| 2012-03-09 19:00:00 | 29.64 |
| 2012-03-09 20:00:00 | 29.12 |
| 2012-03-09 21:00:00 | 27.3 |
| 2012-03-09 22:00:00 | 20.28 |
| 2012-03-09 23:00:00 | 18.46 |
| 2012-03-10 | 16.38 |
| 2012-03-10 01:00:00 | 16.38 |
| 2012-03-10 02:00:00 | 16.12 |
| 2012-03-10 03:00:00 | 16.38 |
| 2012-03-10 04:00:00 | 16.12 |
| 2012-03-10 05:00:00 | 16.9 |
| 2012-03-10 06:00:00 | 16.64 |
| 2012-03-10 07:00:00 | 16.64 |
| 2012-03-10 08:00:00 | 16.38 |
| 2012-03-10 09:00:00 | 16.64 |
| 2012-03-10 10:00:00 | 16.64 |
| 2012-03-10 11:00:00 | 16.64 |
| 2012-03-10 12:00:00 | 16.64 |
| 2012-03-10 13:00:00 | 16.64 |
| 2012-03-10 14:00:00 | 16.64 |
| 2012-03-10 15:00:00 | 16.38 |
| 2012-03-10 16:00:00 | 16.64 |
| 2012-03-10 17:00:00 | 15.86 |
| 2012-03-10 18:00:00 | 16.64 |
| 2012-03-10 19:00:00 | 16.9 |
| 2012-03-10 20:00:00 | 17.16 |
| 2012-03-10 21:00:00 | 17.68 |
| 2012-03-10 22:00:00 | 16.64 |
| 2012-03-10 23:00:00 | 16.38 |
| 2012-03-11 | 16.64 |
| 2012-03-11 01:00:00 | 16.9 |
| 2012-03-11 02:00:00 | 16.64 |
| 2012-03-11 03:00:00 | 16.64 |
| 2012-03-11 04:00:00 | 16.64 |
| 2012-03-11 05:00:00 | 17.16 |
| 2012-03-11 06:00:00 | 16.64 |
| 2012-03-11 07:00:00 | 16.9 |
| 2012-03-11 08:00:00 | 16.38 |
| 2012-03-11 09:00:00 | 16.38 |
| 2012-03-11 10:00:00 | 16.12 |
| 2012-03-11 11:00:00 | 16.38 |
| 2012-03-11 12:00:00 | 16.38 |
| 2012-03-11 13:00:00 | 16.12 |
| 2012-03-11 14:00:00 | 15.86 |
| 2012-03-11 15:00:00 | 16.12 |
| 2012-03-11 16:00:00 | 15.6 |
| 2012-03-11 17:00:00 | 16.12 |
| 2012-03-11 18:00:00 | 15.86 |
| 2012-03-11 19:00:00 | 16.38 |
| 2012-03-11 20:00:00 | 16.38 |
| 2012-03-11 21:00:00 | 16.12 |
| 2012-03-11 22:00:00 | 16.12 |
| 2012-03-11 23:00:00 | 15.86 |
| 2012-03-12 | 16.12 |
| 2012-03-12 01:00:00 | 16.12 |
| 2012-03-12 02:00:00 | 16.12 |
| 2012-03-12 03:00:00 | 16.12 |
| 2012-03-12 04:00:00 | 16.12 |
| 2012-03-12 05:00:00 | 18.2 |
| 2012-03-12 06:00:00 | 20.54 |
| 2012-03-12 07:00:00 | 28.86 |
| 2012-03-12 08:00:00 | 48.1 |
| 2012-03-12 09:00:00 | 50.18 |
| 2012-03-12 10:00:00 | 52.26 |
| 2012-03-12 11:00:00 | 48.1 |
| 2012-03-12 12:00:00 | 45.76 |
| 2012-03-12 13:00:00 | 46.54 |
| 2012-03-12 14:00:00 | 46.54 |
| 2012-03-12 15:00:00 | 44.46 |
| 2012-03-12 16:00:00 | 38.74 |
| 2012-03-12 17:00:00 | 31.2 |
| 2012-03-12 18:00:00 | 30.16 |
| 2012-03-12 19:00:00 | 28.6 |
| 2012-03-12 20:00:00 | 31.2 |
| 2012-03-12 21:00:00 | 29.64 |
| 2012-03-12 22:00:00 | 21.58 |
| 2012-03-12 23:00:00 | 17.68 |
| 2012-03-13 | 16.64 |
| 2012-03-13 01:00:00 | 16.9 |
| 2012-03-13 02:00:00 | 16.9 |
| 2012-03-13 03:00:00 | 16.9 |
| 2012-03-13 04:00:00 | 16.9 |
| 2012-03-13 05:00:00 | 17.94 |
| 2012-03-13 06:00:00 | 20.8 |
| 2012-03-13 07:00:00 | 30.68 |
| 2012-03-13 08:00:00 | 50.7 |
| 2012-03-13 09:00:00 | 54.34 |
| 2012-03-13 10:00:00 | 49.4 |
| 2012-03-13 11:00:00 | 48.88 |
| 2012-03-13 12:00:00 | 47.58 |
| 2012-03-13 13:00:00 | 48.62 |
| 2012-03-13 14:00:00 | 48.62 |
| 2012-03-13 15:00:00 | 46.28 |
| 2012-03-13 16:00:00 | 38.74 |
| 2012-03-13 17:00:00 | 30.16 |
| 2012-03-13 18:00:00 | 29.64 |
| 2012-03-13 19:00:00 | 29.9 |
| 2012-03-13 20:00:00 | 29.64 |
| 2012-03-13 21:00:00 | 27.04 |
| 2012-03-13 22:00:00 | 22.1 |
| 2012-03-13 23:00:00 | 20.02 |
| 2012-03-14 | 17.42 |
| 2012-03-14 01:00:00 | 17.42 |
| 2012-03-14 02:00:00 | 17.68 |
| 2012-03-14 03:00:00 | 17.94 |
| 2012-03-14 04:00:00 | 17.16 |
| 2012-03-14 05:00:00 | 18.98 |
| 2012-03-14 06:00:00 | 20.02 |
| 2012-03-14 07:00:00 | 30.42 |
| 2012-03-14 08:00:00 | 51.22 |
| 2012-03-14 09:00:00 | 53.3 |
| 2012-03-14 10:00:00 | 52 |
| 2012-03-14 11:00:00 | 51.22 |
| 2012-03-14 12:00:00 | 50.96 |
| 2012-03-14 13:00:00 | 50.18 |
| 2012-03-14 14:00:00 | 49.66 |
| 2012-03-14 15:00:00 | 46.28 |
| 2012-03-14 16:00:00 | 37.7 |
| 2012-03-14 17:00:00 | 31.2 |
| 2012-03-14 18:00:00 | 31.46 |
| 2012-03-14 19:00:00 | 30.16 |
| 2012-03-14 20:00:00 | 28.08 |
| 2012-03-14 21:00:00 | 27.82 |
| 2012-03-14 22:00:00 | 21.32 |
| 2012-03-14 23:00:00 | 18.46 |
| 2012-03-15 | 16.38 |
| 2012-03-15 01:00:00 | 16.38 |
| 2012-03-15 02:00:00 | 16.64 |
| 2012-03-15 03:00:00 | 16.38 |
| 2012-03-15 04:00:00 | 16.12 |
| 2012-03-15 05:00:00 | 18.46 |
| 2012-03-15 06:00:00 | 21.06 |
| 2012-03-15 07:00:00 | 29.64 |
| 2012-03-15 08:00:00 | 43.42 |
| 2012-03-15 09:00:00 | 43.42 |
| 2012-03-15 10:00:00 | 40.82 |
| 2012-03-15 11:00:00 | 40.04 |
| 2012-03-15 12:00:00 | 40.04 |
| 2012-03-15 13:00:00 | 41.6 |
| 2012-03-15 14:00:00 | 40.3 |
| 2012-03-15 15:00:00 | 35.1 |
| 2012-03-15 16:00:00 | 29.9 |
| 2012-03-15 17:00:00 | 25.74 |
| 2012-03-15 18:00:00 | 27.82 |
| 2012-03-15 19:00:00 | 29.12 |
| 2012-03-15 20:00:00 | 28.6 |
| 2012-03-15 21:00:00 | 27.82 |
| 2012-03-15 22:00:00 | 21.58 |
| 2012-03-15 23:00:00 | 19.24 |
| 2012-03-16 | 17.16 |
| 2012-03-16 01:00:00 | 17.42 |
| 2012-03-16 02:00:00 | 17.16 |
| 2012-03-16 03:00:00 | 17.42 |
| 2012-03-16 04:00:00 | 17.94 |
| 2012-03-16 05:00:00 | 19.5 |
| 2012-03-16 06:00:00 | 19.76 |
| 2012-03-16 07:00:00 | 29.9 |
| 2012-03-16 08:00:00 | 40.82 |
| 2012-03-16 09:00:00 | 39.78 |
| 2012-03-16 10:00:00 | 39.52 |
| 2012-03-16 11:00:00 | 39.52 |
| 2012-03-16 12:00:00 | 39.26 |
| 2012-03-16 13:00:00 | 37.7 |
| 2012-03-16 14:00:00 | 35.88 |
| 2012-03-16 15:00:00 | 31.72 |
| 2012-03-16 16:00:00 | 26.26 |
| 2012-03-16 17:00:00 | 23.92 |
| 2012-03-16 18:00:00 | 28.08 |
| 2012-03-16 19:00:00 | 29.38 |
| 2012-03-16 20:00:00 | 34.58 |
| 2012-03-16 21:00:00 | 27.04 |
| 2012-03-16 22:00:00 | 21.84 |
| 2012-03-16 23:00:00 | 18.72 |
| 2012-03-17 | 16.64 |
| 2012-03-17 01:00:00 | 16.9 |
| 2012-03-17 02:00:00 | 16.64 |
| 2012-03-17 03:00:00 | 16.38 |
| 2012-03-17 04:00:00 | 16.64 |
| 2012-03-17 05:00:00 | 16.64 |
| 2012-03-17 06:00:00 | 16.38 |
| 2012-03-17 07:00:00 | 16.38 |
| 2012-03-17 08:00:00 | 17.16 |
| 2012-03-17 09:00:00 | 16.12 |
| 2012-03-17 10:00:00 | 16.38 |
| 2012-03-17 11:00:00 | 16.38 |
| 2012-03-17 12:00:00 | 16.38 |
| 2012-03-17 13:00:00 | 16.12 |
| 2012-03-17 14:00:00 | 16.38 |
| 2012-03-17 15:00:00 | 16.38 |
| 2012-03-17 16:00:00 | 15.86 |
| 2012-03-17 17:00:00 | 16.12 |
| 2012-03-17 18:00:00 | 16.12 |
| 2012-03-17 19:00:00 | 16.38 |
| 2012-03-17 20:00:00 | 16.64 |
| 2012-03-17 21:00:00 | 16.9 |
| 2012-03-17 22:00:00 | 16.9 |
| 2012-03-17 23:00:00 | 16.38 |
| 2012-03-18 | 16.64 |
| 2012-03-18 01:00:00 | 16.9 |
| 2012-03-18 02:00:00 | 16.9 |
| 2012-03-18 03:00:00 | 16.64 |
| 2012-03-18 04:00:00 | 16.9 |
| 2012-03-18 05:00:00 | 16.9 |
| 2012-03-18 06:00:00 | 16.9 |
| 2012-03-18 07:00:00 | 16.38 |
| 2012-03-18 08:00:00 | 15.86 |
| 2012-03-18 09:00:00 | 16.38 |
| 2012-03-18 10:00:00 | 15.86 |
| 2012-03-18 11:00:00 | 16.12 |
| 2012-03-18 12:00:00 | 15.86 |
| 2012-03-18 13:00:00 | 15.6 |
| 2012-03-18 14:00:00 | 16.12 |
| 2012-03-18 15:00:00 | 16.38 |
| 2012-03-18 16:00:00 | 16.64 |
| 2012-03-18 17:00:00 | 16.64 |
| 2012-03-18 18:00:00 | 16.12 |
| 2012-03-18 19:00:00 | 16.64 |
| 2012-03-18 20:00:00 | 16.9 |
| 2012-03-18 21:00:00 | 16.64 |
| 2012-03-18 22:00:00 | 16.64 |
| 2012-03-18 23:00:00 | 16.12 |
| 2012-03-19 | 16.12 |
| 2012-03-19 01:00:00 | 16.38 |
| 2012-03-19 02:00:00 | 16.64 |
| 2012-03-19 03:00:00 | 16.64 |
| 2012-03-19 04:00:00 | 16.38 |
| 2012-03-19 05:00:00 | 17.94 |
| 2012-03-19 06:00:00 | 20.28 |
| 2012-03-19 07:00:00 | 31.98 |
| 2012-03-19 08:00:00 | 52.52 |
| 2012-03-19 09:00:00 | 53.56 |
| 2012-03-19 10:00:00 | 54.08 |
| 2012-03-19 11:00:00 | 51.22 |
| 2012-03-19 12:00:00 | 49.66 |
| 2012-03-19 13:00:00 | 50.18 |
| 2012-03-19 14:00:00 | 48.1 |
| 2012-03-19 15:00:00 | 43.16 |
| 2012-03-19 16:00:00 | 37.18 |
| 2012-03-19 17:00:00 | 28.86 |
| 2012-03-19 18:00:00 | 28.34 |
| 2012-03-19 19:00:00 | 28.6 |
| 2012-03-19 20:00:00 | 28.86 |
| 2012-03-19 21:00:00 | 29.12 |
| 2012-03-19 22:00:00 | 21.84 |
| 2012-03-19 23:00:00 | 19.24 |
| 2012-03-20 | 16.9 |
| 2012-03-20 01:00:00 | 17.94 |
| 2012-03-20 02:00:00 | 17.16 |
| 2012-03-20 03:00:00 | 17.94 |
| 2012-03-20 04:00:00 | 17.16 |
| 2012-03-20 05:00:00 | 20.02 |
| 2012-03-20 06:00:00 | 21.06 |
| 2012-03-20 07:00:00 | 31.2 |
| 2012-03-20 08:00:00 | 45.5 |
| 2012-03-20 09:00:00 | 45.5 |
| 2012-03-20 10:00:00 | 45.5 |
| 2012-03-20 11:00:00 | 41.34 |
| 2012-03-20 12:00:00 | 42.12 |
| 2012-03-20 13:00:00 | 41.08 |
| 2012-03-20 14:00:00 | 37.96 |
| 2012-03-20 15:00:00 | 37.44 |
| 2012-03-20 16:00:00 | 31.72 |
| 2012-03-20 17:00:00 | 26 |
| 2012-03-20 18:00:00 | 27.82 |
| 2012-03-20 19:00:00 | 29.12 |
| 2012-03-20 20:00:00 | 29.38 |
| 2012-03-20 21:00:00 | 29.38 |
| 2012-03-20 22:00:00 | 22.1 |
| 2012-03-20 23:00:00 | 18.98 |
| 2012-03-21 | 16.38 |
| 2012-03-21 01:00:00 | 16.38 |
| 2012-03-21 02:00:00 | 16.64 |
| 2012-03-21 03:00:00 | 16.38 |
| 2012-03-21 04:00:00 | 16.38 |
| 2012-03-21 05:00:00 | 18.46 |
| 2012-03-21 06:00:00 | 22.1 |
| 2012-03-21 07:00:00 | 30.42 |
| 2012-03-21 08:00:00 | 44.72 |
| 2012-03-21 09:00:00 | 44.2 |
| 2012-03-21 10:00:00 | 41.6 |
| 2012-03-21 11:00:00 | 41.34 |
| 2012-03-21 12:00:00 | 40.56 |
| 2012-03-21 13:00:00 | 40.04 |
| 2012-03-21 14:00:00 | 39.26 |
| 2012-03-21 15:00:00 | 35.62 |
| 2012-03-21 16:00:00 | 30.68 |
| 2012-03-21 17:00:00 | 26.78 |
| 2012-03-21 18:00:00 | 27.56 |
| 2012-03-21 19:00:00 | 28.34 |
| 2012-03-21 20:00:00 | 28.86 |
| 2012-03-21 21:00:00 | 29.12 |
| 2012-03-21 22:00:00 | 21.32 |
| 2012-03-21 23:00:00 | 17.68 |
| 2012-03-22 | 16.64 |
| 2012-03-22 01:00:00 | 16.64 |
| 2012-03-22 02:00:00 | 16.64 |
| 2012-03-22 03:00:00 | 16.9 |
| 2012-03-22 04:00:00 | 17.42 |
| 2012-03-22 05:00:00 | 18.2 |
| 2012-03-22 06:00:00 | 21.06 |
| 2012-03-22 07:00:00 | 29.12 |
| 2012-03-22 08:00:00 | 42.38 |
| 2012-03-22 09:00:00 | 42.64 |
| 2012-03-22 10:00:00 | 43.68 |
| 2012-03-22 11:00:00 | 41.86 |
| 2012-03-22 12:00:00 | 43.16 |
| 2012-03-22 13:00:00 | 41.86 |
| 2012-03-22 14:00:00 | 38.74 |
| 2012-03-22 15:00:00 | 35.62 |
| 2012-03-22 16:00:00 | 28.6 |
| 2012-03-22 17:00:00 | 25.48 |
| 2012-03-22 18:00:00 | 26.78 |
| 2012-03-22 19:00:00 | 28.34 |
| 2012-03-22 20:00:00 | 29.9 |
| 2012-03-22 21:00:00 | 28.34 |
| 2012-03-22 22:00:00 | 21.32 |
| 2012-03-22 23:00:00 | 18.2 |
| 2012-03-23 | 16.12 |
| 2012-03-23 01:00:00 | 16.64 |
| 2012-03-23 02:00:00 | 16.64 |
| 2012-03-23 03:00:00 | 16.38 |
| 2012-03-23 04:00:00 | 16.64 |
| 2012-03-23 05:00:00 | 20.54 |
| 2012-03-23 06:00:00 | 22.36 |
| 2012-03-23 07:00:00 | 29.9 |
| 2012-03-23 08:00:00 | 42.12 |
| 2012-03-23 09:00:00 | 43.42 |
| 2012-03-23 10:00:00 | 40.82 |
| 2012-03-23 11:00:00 | 40.56 |
| 2012-03-23 12:00:00 | 39.26 |
| 2012-03-23 13:00:00 | 37.18 |
| 2012-03-23 14:00:00 | 35.62 |
| 2012-03-23 15:00:00 | 31.46 |
| 2012-03-23 16:00:00 | 25.74 |
| 2012-03-23 17:00:00 | 23.4 |
| 2012-03-23 18:00:00 | 26.52 |
| 2012-03-23 19:00:00 | 29.38 |
| 2012-03-23 20:00:00 | 27.82 |
| 2012-03-23 21:00:00 | 23.92 |
| 2012-03-23 22:00:00 | 21.32 |
| 2012-03-23 23:00:00 | 18.46 |
| 2012-03-24 | 16.9 |
| 2012-03-24 01:00:00 | 17.16 |
| 2012-03-24 02:00:00 | 16.9 |
| 2012-03-24 03:00:00 | 17.16 |
| 2012-03-24 04:00:00 | 17.16 |
| 2012-03-24 05:00:00 | 17.16 |
| 2012-03-24 06:00:00 | 16.64 |
| 2012-03-24 07:00:00 | 16.38 |
| 2012-03-24 08:00:00 | 16.9 |
| 2012-03-24 09:00:00 | 16.38 |
| 2012-03-24 10:00:00 | 16.9 |
| 2012-03-24 11:00:00 | 16.64 |
| 2012-03-24 12:00:00 | 16.38 |
| 2012-03-24 13:00:00 | 16.64 |
| 2012-03-24 14:00:00 | 16.64 |
| 2012-03-24 15:00:00 | 16.64 |
| 2012-03-24 16:00:00 | 16.64 |
| 2012-03-24 17:00:00 | 16.38 |
| 2012-03-24 18:00:00 | 16.64 |
| 2012-03-24 19:00:00 | 16.64 |
| 2012-03-24 20:00:00 | 16.12 |
| 2012-03-24 21:00:00 | 16.38 |
| 2012-03-24 22:00:00 | 16.12 |
| 2012-03-24 23:00:00 | 15.86 |
| 2012-03-25 | 16.12 |
| 2012-03-25 01:00:00 | 16.64 |
| 2012-03-25 03:00:00 | 16.38 |
| 2012-03-25 04:00:00 | 16.12 |
| 2012-03-25 05:00:00 | 16.64 |
| 2012-03-25 06:00:00 | 17.68 |
| 2012-03-25 07:00:00 | 17.68 |
| 2012-03-25 08:00:00 | 17.16 |
| 2012-03-25 09:00:00 | 16.9 |
| 2012-03-25 10:00:00 | 16.64 |
| 2012-03-25 11:00:00 | 16.38 |
| 2012-03-25 12:00:00 | 16.38 |
| 2012-03-25 13:00:00 | 16.38 |
| 2012-03-25 14:00:00 | 16.64 |
| 2012-03-25 15:00:00 | 16.12 |
| 2012-03-25 16:00:00 | 16.64 |
| 2012-03-25 17:00:00 | 16.38 |
| 2012-03-25 18:00:00 | 16.38 |
| 2012-03-25 19:00:00 | 16.64 |
| 2012-03-25 20:00:00 | 18.2 |
| 2012-03-25 21:00:00 | 18.98 |
| 2012-03-25 22:00:00 | 18.46 |
| 2012-03-25 23:00:00 | 17.68 |
| 2012-03-26 | 16.64 |
| 2012-03-26 01:00:00 | 16.64 |
| 2012-03-26 02:00:00 | 16.9 |
| 2012-03-26 03:00:00 | 16.9 |
| 2012-03-26 04:00:00 | 16.9 |
| 2012-03-26 05:00:00 | 18.2 |
| 2012-03-26 06:00:00 | 19.5 |
| 2012-03-26 07:00:00 | 29.38 |
| 2012-03-26 08:00:00 | 46.28 |
| 2012-03-26 09:00:00 | 44.2 |
| 2012-03-26 10:00:00 | 41.6 |
| 2012-03-26 11:00:00 | 39.78 |
| 2012-03-26 12:00:00 | 38.74 |
| 2012-03-26 13:00:00 | 37.44 |
| 2012-03-26 14:00:00 | 36.66 |
| 2012-03-26 15:00:00 | 35.36 |
| 2012-03-26 16:00:00 | 29.12 |
| 2012-03-26 17:00:00 | 26 |
| 2012-03-26 18:00:00 | 24.96 |
| 2012-03-26 19:00:00 | 26.78 |
| 2012-03-26 20:00:00 | 29.38 |
| 2012-03-26 21:00:00 | 27.82 |
| 2012-03-26 22:00:00 | 22.1 |
| 2012-03-26 23:00:00 | 18.2 |
| 2012-03-27 | 16.38 |
| 2012-03-27 01:00:00 | 16.64 |
| 2012-03-27 02:00:00 | 16.64 |
| 2012-03-27 03:00:00 | 16.9 |
| 2012-03-27 04:00:00 | 17.42 |
| 2012-03-27 05:00:00 | 18.46 |
| 2012-03-27 06:00:00 | 20.02 |
| 2012-03-27 07:00:00 | 30.68 |
| 2012-03-27 08:00:00 | 45.24 |
| 2012-03-27 09:00:00 | 45.24 |
| 2012-03-27 10:00:00 | 42.9 |
| 2012-03-27 11:00:00 | 42.12 |
| 2012-03-27 12:00:00 | 40.04 |
| 2012-03-27 13:00:00 | 41.6 |
| 2012-03-27 14:00:00 | 39.26 |
| 2012-03-27 15:00:00 | 36.4 |
| 2012-03-27 16:00:00 | 29.9 |
| 2012-03-27 17:00:00 | 25.74 |
| 2012-03-27 18:00:00 | 25.22 |
| 2012-03-27 19:00:00 | 27.56 |
| 2012-03-27 20:00:00 | 28.08 |
| 2012-03-27 21:00:00 | 27.56 |
| 2012-03-27 22:00:00 | 22.36 |
| 2012-03-27 23:00:00 | 20.54 |
| 2012-03-28 | 17.42 |
| 2012-03-28 01:00:00 | 17.42 |
| 2012-03-28 02:00:00 | 17.42 |
| 2012-03-28 03:00:00 | 17.68 |
| 2012-03-28 04:00:00 | 17.94 |
| 2012-03-28 05:00:00 | 19.5 |
| 2012-03-28 06:00:00 | 19.76 |
| 2012-03-28 07:00:00 | 28.86 |
| 2012-03-28 08:00:00 | 48.36 |
| 2012-03-28 09:00:00 | 46.54 |
| 2012-03-28 10:00:00 | 45.76 |
| 2012-03-28 11:00:00 | 43.68 |
| 2012-03-28 12:00:00 | 42.38 |
| 2012-03-28 13:00:00 | 41.34 |
| 2012-03-28 14:00:00 | 39.26 |
| 2012-03-28 15:00:00 | 39 |
| 2012-03-28 16:00:00 | 33.8 |
| 2012-03-28 17:00:00 | 27.3 |
| 2012-03-28 18:00:00 | 26 |
| 2012-03-28 19:00:00 | 26.52 |
| 2012-03-28 20:00:00 | 28.34 |
| 2012-03-28 21:00:00 | 27.3 |
| 2012-03-28 22:00:00 | 21.58 |
| 2012-03-28 23:00:00 | 18.2 |
| 2012-03-29 | 16.38 |
| 2012-03-29 01:00:00 | 16.9 |
| 2012-03-29 02:00:00 | 16.9 |
| 2012-03-29 03:00:00 | 16.9 |
| 2012-03-29 04:00:00 | 17.68 |
| 2012-03-29 05:00:00 | 18.2 |
| 2012-03-29 06:00:00 | 20.8 |
| 2012-03-29 07:00:00 | 31.2 |
| 2012-03-29 08:00:00 | 48.62 |
| 2012-03-29 09:00:00 | 50.7 |
| 2012-03-29 10:00:00 | 46.02 |
| 2012-03-29 11:00:00 | 46.02 |
| 2012-03-29 12:00:00 | 44.98 |
| 2012-03-29 13:00:00 | 44.46 |
| 2012-03-29 14:00:00 | 42.64 |
| 2012-03-29 15:00:00 | 40.82 |
| 2012-03-29 16:00:00 | 35.1 |
| 2012-03-29 17:00:00 | 29.12 |
| 2012-03-29 18:00:00 | 29.9 |
| 2012-03-29 19:00:00 | 28.86 |
| 2012-03-29 20:00:00 | 29.38 |
| 2012-03-29 21:00:00 | 28.08 |
| 2012-03-29 22:00:00 | 22.88 |
| 2012-03-29 23:00:00 | 18.72 |
| 2012-03-30 | 16.38 |
| 2012-03-30 01:00:00 | 16.64 |
| 2012-03-30 02:00:00 | 16.38 |
| 2012-03-30 03:00:00 | 16.38 |
| 2012-03-30 04:00:00 | 16.38 |
| 2012-03-30 05:00:00 | 16.64 |
| 2012-03-30 06:00:00 | 21.32 |
| 2012-03-30 07:00:00 | 29.12 |
| 2012-03-30 08:00:00 | 45.76 |
| 2012-03-30 09:00:00 | 48.1 |
| 2012-03-30 10:00:00 | 49.14 |
| 2012-03-30 11:00:00 | 43.42 |
| 2012-03-30 12:00:00 | 42.12 |
| 2012-03-30 13:00:00 | 42.12 |
| 2012-03-30 14:00:00 | 40.3 |
| 2012-03-30 15:00:00 | 34.58 |
| 2012-03-30 16:00:00 | 28.86 |
| 2012-03-30 17:00:00 | 26 |
| 2012-03-30 18:00:00 | 27.3 |
| 2012-03-30 19:00:00 | 28.34 |
| 2012-03-30 20:00:00 | 28.6 |
| 2012-03-30 21:00:00 | 26 |
| 2012-03-30 22:00:00 | 21.84 |
| 2012-03-30 23:00:00 | 18.46 |
| 2012-03-31 | 16.64 |
| 2012-03-31 01:00:00 | 16.64 |
| 2012-03-31 02:00:00 | 16.64 |
| 2012-03-31 03:00:00 | 16.9 |
| 2012-03-31 04:00:00 | 16.9 |
| 2012-03-31 05:00:00 | 16.9 |
| 2012-03-31 06:00:00 | 17.16 |
| 2012-03-31 07:00:00 | 17.94 |
| 2012-03-31 08:00:00 | 18.72 |
| 2012-03-31 09:00:00 | 18.98 |
| 2012-03-31 10:00:00 | 18.98 |
| 2012-03-31 11:00:00 | 19.24 |
| 2012-03-31 12:00:00 | 18.46 |
| 2012-03-31 13:00:00 | 18.2 |
| 2012-03-31 14:00:00 | 18.46 |
| 2012-03-31 15:00:00 | 18.2 |
| 2012-03-31 16:00:00 | 17.16 |
| 2012-03-31 17:00:00 | 16.9 |
| 2012-03-31 18:00:00 | 16.64 |
| 2012-03-31 19:00:00 | 16.9 |
| 2012-03-31 20:00:00 | 17.16 |
| 2012-03-31 21:00:00 | 16.9 |
| 2012-03-31 22:00:00 | 16.9 |
| 2012-03-31 23:00:00 | 16.9 |
| 2012-04-01 | 16.64 |
| 2012-04-01 01:00:00 | 16.64 |
| 2012-04-01 02:00:00 | 16.38 |
| 2012-04-01 03:00:00 | 16.38 |
| 2012-04-01 04:00:00 | 16.38 |
| 2012-04-01 05:00:00 | 16.38 |
| 2012-04-01 06:00:00 | 16.9 |
| 2012-04-01 07:00:00 | 20.54 |
| 2012-04-01 08:00:00 | 22.36 |
| 2012-04-01 09:00:00 | 20.54 |
| 2012-04-01 10:00:00 | 19.5 |
| 2012-04-01 11:00:00 | 19.24 |
| 2012-04-01 12:00:00 | 18.98 |
| 2012-04-01 13:00:00 | 18.72 |
| 2012-04-01 14:00:00 | 18.98 |
| 2012-04-01 15:00:00 | 18.2 |
| 2012-04-01 16:00:00 | 18.46 |
| 2012-04-01 17:00:00 | 17.42 |
| 2012-04-01 18:00:00 | 17.16 |
| 2012-04-01 19:00:00 | 16.38 |
| 2012-04-01 20:00:00 | 17.42 |
| 2012-04-01 21:00:00 | 16.9 |
| 2012-04-01 22:00:00 | 17.68 |
| 2012-04-01 23:00:00 | 16.64 |
| 2012-04-02 | 16.64 |
| 2012-04-02 01:00:00 | 16.64 |
| 2012-04-02 02:00:00 | 16.64 |
| 2012-04-02 03:00:00 | 16.9 |
| 2012-04-02 04:00:00 | 16.64 |
| 2012-04-02 05:00:00 | 18.72 |
| 2012-04-02 06:00:00 | 19.24 |
| 2012-04-02 07:00:00 | 32.24 |
| 2012-04-02 08:00:00 | 50.7 |
| 2012-04-02 09:00:00 | 52.52 |
| 2012-04-02 10:00:00 | 50.18 |
| 2012-04-02 11:00:00 | 46.8 |
| 2012-04-02 12:00:00 | 44.72 |
| 2012-04-02 13:00:00 | 43.68 |
| 2012-04-02 14:00:00 | 41.6 |
| 2012-04-02 15:00:00 | 40.04 |
| 2012-04-02 16:00:00 | 36.92 |
| 2012-04-02 17:00:00 | 30.42 |
| 2012-04-02 18:00:00 | 27.3 |
| 2012-04-02 19:00:00 | 26 |
| 2012-04-02 20:00:00 | 28.08 |
| 2012-04-02 21:00:00 | 27.3 |
| 2012-04-02 22:00:00 | 23.4 |
| 2012-04-02 23:00:00 | 18.98 |
| 2012-04-03 | 16.38 |
| 2012-04-03 01:00:00 | 16.38 |
| 2012-04-03 02:00:00 | 16.38 |
| 2012-04-03 03:00:00 | 16.38 |
| 2012-04-03 04:00:00 | 17.68 |
| 2012-04-03 05:00:00 | 17.94 |
| 2012-04-03 06:00:00 | 20.28 |
| 2012-04-03 07:00:00 | 31.98 |
| 2012-04-03 08:00:00 | 49.92 |
| 2012-04-03 09:00:00 | 49.4 |
| 2012-04-03 10:00:00 | 47.06 |
| 2012-04-03 11:00:00 | 44.2 |
| 2012-04-03 12:00:00 | 41.86 |
| 2012-04-03 13:00:00 | 40.56 |
| 2012-04-03 14:00:00 | 40.3 |
| 2012-04-03 15:00:00 | 36.4 |
| 2012-04-03 16:00:00 | 32.24 |
| 2012-04-03 17:00:00 | 28.08 |
| 2012-04-03 18:00:00 | 27.56 |
| 2012-04-03 19:00:00 | 26.52 |
| 2012-04-03 20:00:00 | 28.08 |
| 2012-04-03 21:00:00 | 30.16 |
| 2012-04-03 22:00:00 | 22.62 |
| 2012-04-03 23:00:00 | 19.5 |
| 2012-04-04 | 17.16 |
| 2012-04-04 01:00:00 | 16.64 |
| 2012-04-04 02:00:00 | 17.16 |
| 2012-04-04 03:00:00 | 17.42 |
| 2012-04-04 04:00:00 | 17.16 |
| 2012-04-04 05:00:00 | 17.68 |
| 2012-04-04 06:00:00 | 19.76 |
| 2012-04-04 07:00:00 | 31.72 |
| 2012-04-04 08:00:00 | 46.8 |
| 2012-04-04 09:00:00 | 48.36 |
| 2012-04-04 10:00:00 | 45.24 |
| 2012-04-04 11:00:00 | 42.9 |
| 2012-04-04 12:00:00 | 42.64 |
| 2012-04-04 13:00:00 | 36.66 |
| 2012-04-04 14:00:00 | 29.9 |
| 2012-04-04 15:00:00 | 29.38 |
| 2012-04-04 16:00:00 | 28.08 |
| 2012-04-04 17:00:00 | 26.78 |
| 2012-04-04 18:00:00 | 28.08 |
| 2012-04-04 19:00:00 | 27.3 |
| 2012-04-04 20:00:00 | 30.68 |
| 2012-04-04 21:00:00 | 25.48 |
| 2012-04-04 22:00:00 | 21.58 |
| 2012-04-04 23:00:00 | 18.46 |
| 2012-04-05 | 16.9 |
| 2012-04-05 01:00:00 | 16.64 |
| 2012-04-05 02:00:00 | 16.64 |
| 2012-04-05 03:00:00 | 16.64 |
| 2012-04-05 04:00:00 | 16.9 |
| 2012-04-05 05:00:00 | 17.68 |
| 2012-04-05 06:00:00 | 21.58 |
| 2012-04-05 07:00:00 | 31.2 |
| 2012-04-05 08:00:00 | 52 |
| 2012-04-05 09:00:00 | 52.78 |
| 2012-04-05 10:00:00 | 51.22 |
| 2012-04-05 11:00:00 | 50.7 |
| 2012-04-05 12:00:00 | 50.18 |
| 2012-04-05 13:00:00 | 52 |
| 2012-04-05 14:00:00 | 49.4 |
| 2012-04-05 15:00:00 | 44.98 |
| 2012-04-05 16:00:00 | 37.7 |
| 2012-04-05 17:00:00 | 30.16 |
| 2012-04-05 18:00:00 | 28.6 |
| 2012-04-05 19:00:00 | 30.42 |
| 2012-04-05 20:00:00 | 30.42 |
| 2012-04-05 21:00:00 | 31.2 |
| 2012-04-05 22:00:00 | 23.4 |
| 2012-04-05 23:00:00 | 18.46 |
| 2012-04-06 | 17.16 |
| 2012-04-06 01:00:00 | 17.16 |
| 2012-04-06 02:00:00 | 17.16 |
| 2012-04-06 03:00:00 | 17.16 |
| 2012-04-06 04:00:00 | 17.94 |
| 2012-04-06 05:00:00 | 18.98 |
| 2012-04-06 06:00:00 | 19.24 |
| 2012-04-06 07:00:00 | 27.3 |
| 2012-04-06 08:00:00 | 48.1 |
| 2012-04-06 09:00:00 | 50.7 |
| 2012-04-06 10:00:00 | 48.62 |
| 2012-04-06 11:00:00 | 48.36 |
| 2012-04-06 12:00:00 | 46.28 |
| 2012-04-06 13:00:00 | 47.06 |
| 2012-04-06 14:00:00 | 45.24 |
| 2012-04-06 15:00:00 | 37.96 |
| 2012-04-06 16:00:00 | 30.68 |
| 2012-04-06 17:00:00 | 24.96 |
| 2012-04-06 18:00:00 | 28.86 |
| 2012-04-06 19:00:00 | 26.78 |
| 2012-04-06 20:00:00 | 28.34 |
| 2012-04-06 21:00:00 | 28.86 |
| 2012-04-06 22:00:00 | 20.54 |
| 2012-04-06 23:00:00 | 17.94 |
| 2012-04-07 | 15.6 |
| 2012-04-07 01:00:00 | 15.86 |
| 2012-04-07 02:00:00 | 16.12 |
| 2012-04-07 03:00:00 | 15.86 |
| 2012-04-07 04:00:00 | 16.12 |
| 2012-04-07 05:00:00 | 16.38 |
| 2012-04-07 06:00:00 | 16.12 |
| 2012-04-07 07:00:00 | 15.86 |
| 2012-04-07 08:00:00 | 16.12 |
| 2012-04-07 09:00:00 | 15.86 |
| 2012-04-07 10:00:00 | 15.86 |
| 2012-04-07 11:00:00 | 15.6 |
| 2012-04-07 12:00:00 | 16.12 |
| 2012-04-07 13:00:00 | 16.12 |
| 2012-04-07 14:00:00 | 15.6 |
| 2012-04-07 15:00:00 | 15.86 |
| 2012-04-07 16:00:00 | 15.6 |
| 2012-04-07 17:00:00 | 15.86 |
| 2012-04-07 18:00:00 | 16.38 |
| 2012-04-07 19:00:00 | 16.64 |
| 2012-04-07 20:00:00 | 16.64 |
| 2012-04-07 21:00:00 | 16.64 |
| 2012-04-07 22:00:00 | 16.64 |
| 2012-04-07 23:00:00 | 16.38 |
| 2012-04-08 | 16.38 |
| 2012-04-08 01:00:00 | 16.38 |
| 2012-04-08 02:00:00 | 16.38 |
| 2012-04-08 03:00:00 | 16.12 |
| 2012-04-08 04:00:00 | 16.12 |
| 2012-04-08 05:00:00 | 16.38 |
| 2012-04-08 06:00:00 | 16.64 |
| 2012-04-08 07:00:00 | 16.64 |
| 2012-04-08 08:00:00 | 16.12 |
| 2012-04-08 09:00:00 | 16.12 |
| 2012-04-08 10:00:00 | 16.12 |
| 2012-04-08 11:00:00 | 15.6 |
| 2012-04-08 12:00:00 | 15.34 |
| 2012-04-08 13:00:00 | 15.6 |
| 2012-04-08 14:00:00 | 15.34 |
| 2012-04-08 15:00:00 | 15.6 |
| 2012-04-08 16:00:00 | 16.12 |
| 2012-04-08 17:00:00 | 15.86 |
| 2012-04-08 18:00:00 | 16.12 |
| 2012-04-08 19:00:00 | 16.12 |
| 2012-04-08 20:00:00 | 16.38 |
| 2012-04-08 21:00:00 | 15.86 |
| 2012-04-08 22:00:00 | 15.86 |
| 2012-04-08 23:00:00 | 16.9 |
| 2012-04-09 | 18.98 |
| 2012-04-09 01:00:00 | 19.24 |
| 2012-04-09 02:00:00 | 18.72 |
| 2012-04-09 03:00:00 | 19.24 |
| 2012-04-09 04:00:00 | 18.72 |
| 2012-04-09 05:00:00 | 16.9 |
| 2012-04-09 06:00:00 | 16.12 |
| 2012-04-09 07:00:00 | 15.6 |
| 2012-04-09 08:00:00 | 15.6 |
| 2012-04-09 09:00:00 | 15.6 |
| 2012-04-09 10:00:00 | 15.6 |
| 2012-04-09 11:00:00 | 15.6 |
| 2012-04-09 12:00:00 | 15.34 |
| 2012-04-09 13:00:00 | 15.34 |
| 2012-04-09 14:00:00 | 15.34 |
| 2012-04-09 15:00:00 | 15.6 |
| 2012-04-09 16:00:00 | 15.6 |
| 2012-04-09 17:00:00 | 15.86 |
| 2012-04-09 18:00:00 | 15.6 |
| 2012-04-09 19:00:00 | 15.86 |
| 2012-04-09 20:00:00 | 16.38 |
| 2012-04-09 21:00:00 | 16.64 |
| 2012-04-09 22:00:00 | 16.38 |
| 2012-04-09 23:00:00 | 16.12 |
| 2012-04-10 | 15.86 |
| 2012-04-10 01:00:00 | 15.86 |
| 2012-04-10 02:00:00 | 16.38 |
| 2012-04-10 03:00:00 | 16.12 |
| 2012-04-10 04:00:00 | 16.12 |
| 2012-04-10 05:00:00 | 16.9 |
| 2012-04-10 06:00:00 | 20.54 |
| 2012-04-10 07:00:00 | 33.02 |
| 2012-04-10 08:00:00 | 46.8 |
| 2012-04-10 09:00:00 | 46.02 |
| 2012-04-10 10:00:00 | 43.68 |
| 2012-04-10 11:00:00 | 43.16 |
| 2012-04-10 12:00:00 | 41.34 |
| 2012-04-10 13:00:00 | 42.12 |
| 2012-04-10 14:00:00 | 40.3 |
| 2012-04-10 15:00:00 | 37.96 |
| 2012-04-10 16:00:00 | 32.76 |
| 2012-04-10 17:00:00 | 26.78 |
| 2012-04-10 18:00:00 | 24.44 |
| 2012-04-10 19:00:00 | 24.7 |
| 2012-04-10 20:00:00 | 28.86 |
| 2012-04-10 21:00:00 | 29.12 |
| 2012-04-10 22:00:00 | 21.58 |
| 2012-04-10 23:00:00 | 18.2 |
| 2012-04-11 | 16.12 |
| 2012-04-11 01:00:00 | 16.38 |
| 2012-04-11 02:00:00 | 16.38 |
| 2012-04-11 03:00:00 | 16.64 |
| 2012-04-11 04:00:00 | 16.64 |
| 2012-04-11 05:00:00 | 19.24 |
| 2012-04-11 06:00:00 | 22.1 |
| 2012-04-11 07:00:00 | 30.68 |
| 2012-04-11 08:00:00 | 44.72 |
| 2012-04-11 09:00:00 | 44.2 |
| 2012-04-11 10:00:00 | 42.9 |
| 2012-04-11 11:00:00 | 43.16 |
| 2012-04-11 12:00:00 | 42.64 |
| 2012-04-11 13:00:00 | 41.6 |
| 2012-04-11 14:00:00 | 40.56 |
| 2012-04-11 15:00:00 | 38.48 |
| 2012-04-11 16:00:00 | 31.98 |
| 2012-04-11 17:00:00 | 27.56 |
| 2012-04-11 18:00:00 | 25.48 |
| 2012-04-11 19:00:00 | 25.22 |
| 2012-04-11 20:00:00 | 29.12 |
| 2012-04-11 21:00:00 | 29.64 |
| 2012-04-11 22:00:00 | 21.84 |
| 2012-04-11 23:00:00 | 18.46 |
| 2012-04-12 | 16.64 |
| 2012-04-12 01:00:00 | 16.64 |
| 2012-04-12 02:00:00 | 16.9 |
| 2012-04-12 03:00:00 | 17.16 |
| 2012-04-12 04:00:00 | 17.68 |
| 2012-04-12 05:00:00 | 18.46 |
| 2012-04-12 06:00:00 | 21.32 |
| 2012-04-12 07:00:00 | 32.5 |
| 2012-04-12 08:00:00 | 48.62 |
| 2012-04-12 09:00:00 | 49.92 |
| 2012-04-12 10:00:00 | 43.68 |
| 2012-04-12 11:00:00 | 43.42 |
| 2012-04-12 12:00:00 | 42.12 |
| 2012-04-12 13:00:00 | 41.6 |
| 2012-04-12 14:00:00 | 41.6 |
| 2012-04-12 15:00:00 | 42.64 |
| 2012-04-12 16:00:00 | 35.1 |
| 2012-04-12 17:00:00 | 27.82 |
| 2012-04-12 18:00:00 | 28.34 |
| 2012-04-12 19:00:00 | 27.82 |
| 2012-04-12 20:00:00 | 31.2 |
| 2012-04-12 21:00:00 | 31.98 |
| 2012-04-12 22:00:00 | 21.84 |
| 2012-04-12 23:00:00 | 19.24 |
| 2012-04-13 | 16.64 |
| 2012-04-13 01:00:00 | 17.16 |
| 2012-04-13 02:00:00 | 17.16 |
| 2012-04-13 03:00:00 | 17.16 |
| 2012-04-13 04:00:00 | 17.16 |
| 2012-04-13 05:00:00 | 18.98 |
| 2012-04-13 06:00:00 | 21.84 |
| 2012-04-13 07:00:00 | 31.98 |
| 2012-04-13 08:00:00 | 45.5 |
| 2012-04-13 09:00:00 | 42.9 |
| 2012-04-13 10:00:00 | 41.6 |
| 2012-04-13 11:00:00 | 38.48 |
| 2012-04-13 12:00:00 | 38.48 |
| 2012-04-13 13:00:00 | 40.82 |
| 2012-04-13 14:00:00 | 38.22 |
| 2012-04-13 15:00:00 | 31.2 |
| 2012-04-13 16:00:00 | 26 |
| 2012-04-13 17:00:00 | 23.66 |
| 2012-04-13 18:00:00 | 24.18 |
| 2012-04-13 19:00:00 | 24.7 |
| 2012-04-13 20:00:00 | 27.04 |
| 2012-04-13 21:00:00 | 29.64 |
| 2012-04-13 22:00:00 | 22.88 |
| 2012-04-13 23:00:00 | 18.46 |
| 2012-04-14 | 16.12 |
| 2012-04-14 01:00:00 | 16.12 |
| 2012-04-14 02:00:00 | 16.38 |
| 2012-04-14 03:00:00 | 16.12 |
| 2012-04-14 04:00:00 | 16.38 |
| 2012-04-14 05:00:00 | 16.38 |
| 2012-04-14 06:00:00 | 16.64 |
| 2012-04-14 07:00:00 | 17.16 |
| 2012-04-14 08:00:00 | 18.46 |
| 2012-04-14 09:00:00 | 21.58 |
| 2012-04-14 10:00:00 | 21.84 |
| 2012-04-14 11:00:00 | 21.84 |
| 2012-04-14 12:00:00 | 22.1 |
| 2012-04-14 13:00:00 | 22.62 |
| 2012-04-14 14:00:00 | 23.14 |
| 2012-04-14 15:00:00 | 21.58 |
| 2012-04-14 16:00:00 | 21.32 |
| 2012-04-14 17:00:00 | 21.06 |
| 2012-04-14 18:00:00 | 18.98 |
| 2012-04-14 19:00:00 | 17.94 |
| 2012-04-14 20:00:00 | 18.46 |
| 2012-04-14 21:00:00 | 18.46 |
| 2012-04-14 22:00:00 | 18.2 |
| 2012-04-14 23:00:00 | 18.2 |
| 2012-04-15 | 17.68 |
| 2012-04-15 01:00:00 | 16.38 |
| 2012-04-15 02:00:00 | 16.64 |
| 2012-04-15 03:00:00 | 16.38 |
| 2012-04-15 04:00:00 | 16.9 |
| 2012-04-15 05:00:00 | 16.38 |
| 2012-04-15 06:00:00 | 17.16 |
| 2012-04-15 07:00:00 | 17.16 |
| 2012-04-15 08:00:00 | 16.12 |
| 2012-04-15 09:00:00 | 15.86 |
| 2012-04-15 10:00:00 | 16.12 |
| 2012-04-15 11:00:00 | 15.6 |
| 2012-04-15 12:00:00 | 15.34 |
| 2012-04-15 13:00:00 | 15.86 |
| 2012-04-15 14:00:00 | 15.34 |
| 2012-04-15 15:00:00 | 15.6 |
| 2012-04-15 16:00:00 | 15.6 |
| 2012-04-15 17:00:00 | 15.86 |
| 2012-04-15 18:00:00 | 15.6 |
| 2012-04-15 19:00:00 | 16.9 |
| 2012-04-15 20:00:00 | 16.38 |
| 2012-04-15 21:00:00 | 16.12 |
| 2012-04-15 22:00:00 | 19.5 |
| 2012-04-15 23:00:00 | 18.98 |
| 2012-04-16 | 18.72 |
| 2012-04-16 01:00:00 | 18.72 |
| 2012-04-16 02:00:00 | 18.72 |
| 2012-04-16 03:00:00 | 18.98 |
| 2012-04-16 04:00:00 | 18.72 |
| 2012-04-16 05:00:00 | 18.98 |
| 2012-04-16 06:00:00 | 21.32 |
| 2012-04-16 07:00:00 | 31.72 |
| 2012-04-16 08:00:00 | 51.22 |
| 2012-04-16 09:00:00 | 56.68 |
| 2012-04-16 10:00:00 | 55.12 |
| 2012-04-16 11:00:00 | 52.26 |
| 2012-04-16 12:00:00 | 52 |
| 2012-04-16 13:00:00 | 51.22 |
| 2012-04-16 14:00:00 | 52.26 |
| 2012-04-16 15:00:00 | 50.44 |
| 2012-04-16 16:00:00 | 43.68 |
| 2012-04-16 17:00:00 | 34.06 |
| 2012-04-16 18:00:00 | 31.46 |
| 2012-04-16 19:00:00 | 33.28 |
| 2012-04-16 20:00:00 | 33.54 |
| 2012-04-16 21:00:00 | 31.2 |
| 2012-04-16 22:00:00 | 28.34 |
| 2012-04-16 23:00:00 | 21.06 |
| 2012-04-17 | 17.94 |
| 2012-04-17 01:00:00 | 17.42 |
| 2012-04-17 02:00:00 | 17.42 |
| 2012-04-17 03:00:00 | 17.68 |
| 2012-04-17 04:00:00 | 17.94 |
| 2012-04-17 05:00:00 | 18.46 |
| 2012-04-17 06:00:00 | 19.5 |
| 2012-04-17 07:00:00 | 29.9 |
| 2012-04-17 08:00:00 | 44.2 |
| 2012-04-17 09:00:00 | 43.68 |
| 2012-04-17 10:00:00 | 41.6 |
| 2012-04-17 11:00:00 | 40.04 |
| 2012-04-17 12:00:00 | 41.6 |
| 2012-04-17 13:00:00 | 39 |
| 2012-04-17 14:00:00 | 38.74 |
| 2012-04-17 15:00:00 | 40.3 |
| 2012-04-17 16:00:00 | 32.76 |
| 2012-04-17 17:00:00 | 26.26 |
| 2012-04-17 18:00:00 | 27.3 |
| 2012-04-17 19:00:00 | 27.82 |
| 2012-04-17 20:00:00 | 28.34 |
| 2012-04-17 21:00:00 | 28.6 |
| 2012-04-17 22:00:00 | 22.1 |
| 2012-04-17 23:00:00 | 20.8 |
| 2012-04-18 | 19.5 |
| 2012-04-18 01:00:00 | 19.24 |
| 2012-04-18 02:00:00 | 20.02 |
| 2012-04-18 03:00:00 | 20.02 |
| 2012-04-18 04:00:00 | 16.9 |
| 2012-04-18 05:00:00 | 17.94 |
| 2012-04-18 06:00:00 | 21.06 |
| 2012-04-18 07:00:00 | 31.72 |
| 2012-04-18 08:00:00 | 44.46 |
| 2012-04-18 09:00:00 | 43.68 |
| 2012-04-18 10:00:00 | 41.08 |
| 2012-04-18 11:00:00 | 40.3 |
| 2012-04-18 12:00:00 | 40.3 |
| 2012-04-18 13:00:00 | 39 |
| 2012-04-18 14:00:00 | 40.04 |
| 2012-04-18 15:00:00 | 37.18 |
| 2012-04-18 16:00:00 | 32.5 |
| 2012-04-18 17:00:00 | 26.52 |
| 2012-04-18 18:00:00 | 23.92 |
| 2012-04-18 19:00:00 | 24.44 |
| 2012-04-18 20:00:00 | 27.3 |
| 2012-04-18 21:00:00 | 28.34 |
| 2012-04-18 22:00:00 | 22.62 |
| 2012-04-18 23:00:00 | 17.94 |
| 2012-04-19 | 16.12 |
| 2012-04-19 01:00:00 | 16.38 |
| 2012-04-19 02:00:00 | 16.38 |
| 2012-04-19 03:00:00 | 16.38 |
| 2012-04-19 04:00:00 | 17.42 |
| 2012-04-19 05:00:00 | 17.68 |
| 2012-04-19 06:00:00 | 21.06 |
| 2012-04-19 07:00:00 | 28.34 |
| 2012-04-19 08:00:00 | 43.94 |
| 2012-04-19 09:00:00 | 45.5 |
| 2012-04-19 10:00:00 | 42.38 |
| 2012-04-19 11:00:00 | 41.08 |
| 2012-04-19 12:00:00 | 41.08 |
| 2012-04-19 13:00:00 | 40.04 |
| 2012-04-19 14:00:00 | 41.6 |
| 2012-04-19 15:00:00 | 39.78 |
| 2012-04-19 16:00:00 | 33.02 |
| 2012-04-19 17:00:00 | 28.34 |
| 2012-04-19 18:00:00 | 25.74 |
| 2012-04-19 19:00:00 | 24.7 |
| 2012-04-19 20:00:00 | 26.52 |
| 2012-04-19 21:00:00 | 28.34 |
| 2012-04-19 22:00:00 | 21.84 |
| 2012-04-19 23:00:00 | 18.2 |
| 2012-04-20 | 16.12 |
| 2012-04-20 01:00:00 | 16.38 |
| 2012-04-20 02:00:00 | 16.38 |
| 2012-04-20 03:00:00 | 16.64 |
| 2012-04-20 04:00:00 | 16.38 |
| 2012-04-20 05:00:00 | 18.98 |
| 2012-04-20 06:00:00 | 22.36 |
| 2012-04-20 07:00:00 | 31.2 |
| 2012-04-20 08:00:00 | 44.98 |
| 2012-04-20 09:00:00 | 42.9 |
| 2012-04-20 10:00:00 | 41.6 |
| 2012-04-20 11:00:00 | 40.82 |
| 2012-04-20 12:00:00 | 39.52 |
| 2012-04-20 13:00:00 | 41.34 |
| 2012-04-20 14:00:00 | 38.74 |
| 2012-04-20 15:00:00 | 33.8 |
| 2012-04-20 16:00:00 | 26.52 |
| 2012-04-20 17:00:00 | 23.92 |
| 2012-04-20 18:00:00 | 23.66 |
| 2012-04-20 19:00:00 | 23.66 |
| 2012-04-20 20:00:00 | 25.22 |
| 2012-04-20 21:00:00 | 29.38 |
| 2012-04-20 22:00:00 | 21.32 |
| 2012-04-20 23:00:00 | 16.9 |
| 2012-04-21 | 15.86 |
| 2012-04-21 01:00:00 | 16.12 |
| 2012-04-21 02:00:00 | 16.38 |
| 2012-04-21 03:00:00 | 16.12 |
| 2012-04-21 04:00:00 | 16.12 |
| 2012-04-21 05:00:00 | 16.38 |
| 2012-04-21 06:00:00 | 16.38 |
| 2012-04-21 07:00:00 | 16.64 |
| 2012-04-21 08:00:00 | 16.9 |
| 2012-04-21 09:00:00 | 16.64 |
| 2012-04-21 10:00:00 | 17.68 |
| 2012-04-21 11:00:00 | 17.42 |
| 2012-04-21 12:00:00 | 17.68 |
| 2012-04-21 13:00:00 | 16.9 |
| 2012-04-21 14:00:00 | 17.16 |
| 2012-04-21 15:00:00 | 17.42 |
| 2012-04-21 16:00:00 | 17.42 |
| 2012-04-21 17:00:00 | 17.16 |
| 2012-04-21 18:00:00 | 17.94 |
| 2012-04-21 19:00:00 | 17.68 |
| 2012-04-21 20:00:00 | 16.9 |
| 2012-04-21 21:00:00 | 17.16 |
| 2012-04-21 22:00:00 | 17.42 |
| 2012-04-21 23:00:00 | 16.64 |
| 2012-04-22 | 16.38 |
| 2012-04-22 01:00:00 | 16.38 |
| 2012-04-22 02:00:00 | 16.64 |
| 2012-04-22 03:00:00 | 16.64 |
| 2012-04-22 04:00:00 | 16.38 |
| 2012-04-22 05:00:00 | 16.38 |
| 2012-04-22 06:00:00 | 16.9 |
| 2012-04-22 07:00:00 | 16.64 |
| 2012-04-22 08:00:00 | 16.38 |
| 2012-04-22 09:00:00 | 16.64 |
| 2012-04-22 10:00:00 | 16.38 |
| 2012-04-22 11:00:00 | 16.64 |
| 2012-04-22 12:00:00 | 16.38 |
| 2012-04-22 13:00:00 | 16.38 |
| 2012-04-22 14:00:00 | 16.64 |
| 2012-04-22 15:00:00 | 17.16 |
| 2012-04-22 16:00:00 | 17.68 |
| 2012-04-22 17:00:00 | 17.42 |
| 2012-04-22 18:00:00 | 16.38 |
| 2012-04-22 19:00:00 | 16.64 |
| 2012-04-22 20:00:00 | 16.64 |
| 2012-04-22 21:00:00 | 16.64 |
| 2012-04-22 22:00:00 | 17.68 |
| 2012-04-22 23:00:00 | 16.38 |
| 2012-04-23 | 15.86 |
| 2012-04-23 01:00:00 | 16.12 |
| 2012-04-23 02:00:00 | 16.64 |
| 2012-04-23 03:00:00 | 16.12 |
| 2012-04-23 04:00:00 | 17.16 |
| 2012-04-23 05:00:00 | 17.42 |
| 2012-04-23 06:00:00 | 20.02 |
| 2012-04-23 07:00:00 | 28.6 |
| 2012-04-23 08:00:00 | 44.46 |
| 2012-04-23 09:00:00 | 44.46 |
| 2012-04-23 10:00:00 | 45.24 |
| 2012-04-23 11:00:00 | 43.94 |
| 2012-04-23 12:00:00 | 42.12 |
| 2012-04-23 13:00:00 | 44.2 |
| 2012-04-23 14:00:00 | 41.6 |
| 2012-04-23 15:00:00 | 39.78 |
| 2012-04-23 16:00:00 | 33.8 |
| 2012-04-23 17:00:00 | 29.12 |
| 2012-04-23 18:00:00 | 25.48 |
| 2012-04-23 19:00:00 | 26 |
| 2012-04-23 20:00:00 | 25.74 |
| 2012-04-23 21:00:00 | 28.86 |
| 2012-04-23 22:00:00 | 24.96 |
| 2012-04-23 23:00:00 | 20.02 |
| 2012-04-24 | 17.68 |
| 2012-04-24 01:00:00 | 17.68 |
| 2012-04-24 02:00:00 | 17.68 |
| 2012-04-24 03:00:00 | 18.2 |
| 2012-04-24 04:00:00 | 17.68 |
| 2012-04-24 05:00:00 | 18.2 |
| 2012-04-24 06:00:00 | 20.54 |
| 2012-04-24 07:00:00 | 30.68 |
| 2012-04-24 08:00:00 | 46.28 |
| 2012-04-24 09:00:00 | 47.58 |
| 2012-04-24 10:00:00 | 44.72 |
| 2012-04-24 11:00:00 | 45.5 |
| 2012-04-24 12:00:00 | 42.64 |
| 2012-04-24 13:00:00 | 44.46 |
| 2012-04-24 14:00:00 | 43.94 |
| 2012-04-24 15:00:00 | 39.78 |
| 2012-04-24 16:00:00 | 32.5 |
| 2012-04-24 17:00:00 | 25.74 |
| 2012-04-24 18:00:00 | 24.7 |
| 2012-04-24 19:00:00 | 26.26 |
| 2012-04-24 20:00:00 | 27.56 |
| 2012-04-24 21:00:00 | 28.6 |
| 2012-04-24 22:00:00 | 21.84 |
| 2012-04-24 23:00:00 | 17.68 |
| 2012-04-25 | 16.12 |
| 2012-04-25 01:00:00 | 16.12 |
| 2012-04-25 02:00:00 | 16.64 |
| 2012-04-25 03:00:00 | 16.64 |
| 2012-04-25 04:00:00 | 17.16 |
| 2012-04-25 05:00:00 | 17.94 |
| 2012-04-25 06:00:00 | 20.28 |
| 2012-04-25 07:00:00 | 29.9 |
| 2012-04-25 08:00:00 | 47.84 |
| 2012-04-25 09:00:00 | 47.06 |
| 2012-04-25 10:00:00 | 44.2 |
| 2012-04-25 11:00:00 | 43.94 |
| 2012-04-25 12:00:00 | 43.16 |
| 2012-04-25 13:00:00 | 42.38 |
| 2012-04-25 14:00:00 | 42.64 |
| 2012-04-25 15:00:00 | 40.04 |
| 2012-04-25 16:00:00 | 35.62 |
| 2012-04-25 17:00:00 | 29.9 |
| 2012-04-25 18:00:00 | 26.78 |
| 2012-04-25 19:00:00 | 27.04 |
| 2012-04-25 20:00:00 | 27.04 |
| 2012-04-25 21:00:00 | 28.34 |
| 2012-04-25 22:00:00 | 24.18 |
| 2012-04-25 23:00:00 | 20.54 |
| 2012-04-26 | 17.94 |
| 2012-04-26 01:00:00 | 17.68 |
| 2012-04-26 02:00:00 | 17.94 |
| 2012-04-26 03:00:00 | 17.68 |
| 2012-04-26 04:00:00 | 17.94 |
| 2012-04-26 05:00:00 | 18.46 |
| 2012-04-26 06:00:00 | 22.1 |
| 2012-04-26 07:00:00 | 32.5 |
| 2012-04-26 08:00:00 | 43.94 |
| 2012-04-26 09:00:00 | 46.54 |
| 2012-04-26 10:00:00 | 43.68 |
| 2012-04-26 11:00:00 | 42.12 |
| 2012-04-26 12:00:00 | 40.3 |
| 2012-04-26 13:00:00 | 44.2 |
| 2012-04-26 14:00:00 | 44.2 |
| 2012-04-26 15:00:00 | 42.64 |
| 2012-04-26 16:00:00 | 36.4 |
| 2012-04-26 17:00:00 | 29.9 |
| 2012-04-26 18:00:00 | 27.04 |
| 2012-04-26 19:00:00 | 25.74 |
| 2012-04-26 20:00:00 | 28.6 |
| 2012-04-26 21:00:00 | 31.46 |
| 2012-04-26 22:00:00 | 22.62 |
| 2012-04-26 23:00:00 | 20.02 |
| 2012-04-27 | 16.9 |
| 2012-04-27 01:00:00 | 16.9 |
| 2012-04-27 02:00:00 | 16.9 |
| 2012-04-27 03:00:00 | 17.16 |
| 2012-04-27 04:00:00 | 16.9 |
| 2012-04-27 05:00:00 | 18.46 |
| 2012-04-27 06:00:00 | 23.14 |
| 2012-04-27 07:00:00 | 30.68 |
| 2012-04-27 08:00:00 | 44.46 |
| 2012-04-27 09:00:00 | 48.36 |
| 2012-04-27 10:00:00 | 45.5 |
| 2012-04-27 11:00:00 | 44.2 |
| 2012-04-27 12:00:00 | 43.94 |
| 2012-04-27 13:00:00 | 45.5 |
| 2012-04-27 14:00:00 | 42.64 |
| 2012-04-27 15:00:00 | 39 |
| 2012-04-27 16:00:00 | 31.2 |
| 2012-04-27 17:00:00 | 26 |
| 2012-04-27 18:00:00 | 25.48 |
| 2012-04-27 19:00:00 | 26.26 |
| 2012-04-27 20:00:00 | 26.52 |
| 2012-04-27 21:00:00 | 25.22 |
| 2012-04-27 22:00:00 | 22.36 |
| 2012-04-27 23:00:00 | 19.76 |
| 2012-04-28 | 18.2 |
| 2012-04-28 01:00:00 | 17.94 |
| 2012-04-28 02:00:00 | 18.46 |
| 2012-04-28 03:00:00 | 18.72 |
| 2012-04-28 04:00:00 | 19.24 |
| 2012-04-28 05:00:00 | 18.72 |
| 2012-04-28 06:00:00 | 18.46 |
| 2012-04-28 07:00:00 | 17.68 |
| 2012-04-28 08:00:00 | 16.64 |
| 2012-04-28 09:00:00 | 17.94 |
| 2012-04-28 10:00:00 | 18.46 |
| 2012-04-28 11:00:00 | 19.5 |
| 2012-04-28 12:00:00 | 20.02 |
| 2012-04-28 13:00:00 | 19.76 |
| 2012-04-28 14:00:00 | 19.24 |
| 2012-04-28 15:00:00 | 19.5 |
| 2012-04-28 16:00:00 | 19.24 |
| 2012-04-28 17:00:00 | 18.2 |
| 2012-04-28 18:00:00 | 16.38 |
| 2012-04-28 19:00:00 | 16.38 |
| 2012-04-28 20:00:00 | 16.64 |
| 2012-04-28 21:00:00 | 16.9 |
| 2012-04-28 22:00:00 | 16.64 |
| 2012-04-28 23:00:00 | 16.64 |
| 2012-04-29 | 16.12 |
| 2012-04-29 01:00:00 | 16.38 |
| 2012-04-29 02:00:00 | 16.64 |
| 2012-04-29 03:00:00 | 16.38 |
| 2012-04-29 04:00:00 | 16.64 |
| 2012-04-29 05:00:00 | 16.9 |
| 2012-04-29 06:00:00 | 16.64 |
| 2012-04-29 07:00:00 | 16.38 |
| 2012-04-29 08:00:00 | 16.38 |
| 2012-04-29 09:00:00 | 17.42 |
| 2012-04-29 10:00:00 | 16.64 |
| 2012-04-29 11:00:00 | 16.64 |
| 2012-04-29 12:00:00 | 16.38 |
| 2012-04-29 13:00:00 | 16.64 |
| 2012-04-29 14:00:00 | 16.9 |
| 2012-04-29 15:00:00 | 16.9 |
| 2012-04-29 16:00:00 | 17.16 |
| 2012-04-29 17:00:00 | 16.9 |
| 2012-04-29 18:00:00 | 16.9 |
| 2012-04-29 19:00:00 | 16.9 |
| 2012-04-29 20:00:00 | 17.68 |
| 2012-04-29 21:00:00 | 17.42 |
| 2012-04-29 22:00:00 | 16.9 |
| 2012-04-29 23:00:00 | 16.9 |
| 2012-04-30 | 16.9 |
| 2012-04-30 01:00:00 | 16.9 |
| 2012-04-30 02:00:00 | 16.64 |
| 2012-04-30 03:00:00 | 16.64 |
| 2012-04-30 04:00:00 | 17.68 |
| 2012-04-30 05:00:00 | 17.94 |
| 2012-04-30 06:00:00 | 20.54 |
| 2012-04-30 07:00:00 | 27.82 |
| 2012-04-30 08:00:00 | 43.16 |
| 2012-04-30 09:00:00 | 47.06 |
| 2012-04-30 10:00:00 | 47.58 |
| 2012-04-30 11:00:00 | 48.36 |
| 2012-04-30 12:00:00 | 47.58 |
| 2012-04-30 13:00:00 | 49.92 |
| 2012-04-30 14:00:00 | 46.54 |
| 2012-04-30 15:00:00 | 42.38 |
| 2012-04-30 16:00:00 | 40.3 |
| 2012-04-30 17:00:00 | 30.94 |
| 2012-04-30 18:00:00 | 26.52 |
| 2012-04-30 19:00:00 | 26.26 |
| 2012-04-30 20:00:00 | 26.78 |
| 2012-04-30 21:00:00 | 29.12 |
| 2012-04-30 22:00:00 | 23.92 |
| 2012-04-30 23:00:00 | 18.46 |
| 2012-05-01 | 16.64 |
| 2012-05-01 01:00:00 | 16.38 |
| 2012-05-01 02:00:00 | 16.64 |
| 2012-05-01 03:00:00 | 16.12 |
| 2012-05-01 04:00:00 | 16.38 |
| 2012-05-01 05:00:00 | 16.38 |
| 2012-05-01 06:00:00 | 17.68 |
| 2012-05-01 07:00:00 | 17.94 |
| 2012-05-01 08:00:00 | 17.42 |
| 2012-05-01 09:00:00 | 17.16 |
| 2012-05-01 10:00:00 | 18.46 |
| 2012-05-01 11:00:00 | 18.2 |
| 2012-05-01 12:00:00 | 18.46 |
| 2012-05-01 13:00:00 | 18.72 |
| 2012-05-01 14:00:00 | 18.46 |
| 2012-05-01 15:00:00 | 18.98 |
| 2012-05-01 16:00:00 | 18.98 |
| 2012-05-01 17:00:00 | 19.24 |
| 2012-05-01 18:00:00 | 18.46 |
| 2012-05-01 19:00:00 | 19.24 |
| 2012-05-01 20:00:00 | 20.02 |
| 2012-05-01 21:00:00 | 18.98 |
| 2012-05-01 22:00:00 | 18.2 |
| 2012-05-01 23:00:00 | 18.2 |
| 2012-05-02 | 17.42 |
| 2012-05-02 01:00:00 | 17.94 |
| 2012-05-02 02:00:00 | 18.2 |
| 2012-05-02 03:00:00 | 17.94 |
| 2012-05-02 04:00:00 | 18.2 |
| 2012-05-02 05:00:00 | 20.54 |
| 2012-05-02 06:00:00 | 22.1 |
| 2012-05-02 07:00:00 | 31.98 |
| 2012-05-02 08:00:00 | 45.5 |
| 2012-05-02 09:00:00 | 49.14 |
| 2012-05-02 10:00:00 | 52 |
| 2012-05-02 11:00:00 | 54.34 |
| 2012-05-02 12:00:00 | 56.94 |
| 2012-05-02 13:00:00 | 61.1 |
| 2012-05-02 14:00:00 | 59.54 |
| 2012-05-02 15:00:00 | 53.3 |
| 2012-05-02 16:00:00 | 40.56 |
| 2012-05-02 17:00:00 | 33.8 |
| 2012-05-02 18:00:00 | 26.78 |
| 2012-05-02 19:00:00 | 25.48 |
| 2012-05-02 20:00:00 | 27.04 |
| 2012-05-02 21:00:00 | 28.86 |
| 2012-05-02 22:00:00 | 22.88 |
| 2012-05-02 23:00:00 | 18.2 |
| 2012-05-03 | 16.9 |
| 2012-05-03 01:00:00 | 16.64 |
| 2012-05-03 02:00:00 | 17.16 |
| 2012-05-03 03:00:00 | 16.64 |
| 2012-05-03 04:00:00 | 17.16 |
| 2012-05-03 05:00:00 | 18.2 |
| 2012-05-03 06:00:00 | 19.76 |
| 2012-05-03 07:00:00 | 30.42 |
| 2012-05-03 08:00:00 | 44.72 |
| 2012-05-03 09:00:00 | 49.92 |
| 2012-05-03 10:00:00 | 52.26 |
| 2012-05-03 11:00:00 | 49.14 |
| 2012-05-03 12:00:00 | 51.48 |
| 2012-05-03 13:00:00 | 55.9 |
| 2012-05-03 14:00:00 | 52.52 |
| 2012-05-03 15:00:00 | 49.92 |
| 2012-05-03 16:00:00 | 44.2 |
| 2012-05-03 17:00:00 | 30.68 |
| 2012-05-03 18:00:00 | 28.08 |
| 2012-05-03 19:00:00 | 25.74 |
| 2012-05-03 20:00:00 | 26.78 |
| 2012-05-03 21:00:00 | 28.34 |
| 2012-05-03 22:00:00 | 23.4 |
| 2012-05-03 23:00:00 | 20.02 |
| 2012-05-04 | 18.2 |
| 2012-05-04 01:00:00 | 17.68 |
| 2012-05-04 02:00:00 | 17.68 |
| 2012-05-04 03:00:00 | 17.94 |
| 2012-05-04 04:00:00 | 17.68 |
| 2012-05-04 05:00:00 | 20.54 |
| 2012-05-04 06:00:00 | 21.58 |
| 2012-05-04 07:00:00 | 32.5 |
| 2012-05-04 08:00:00 | 51.48 |
| 2012-05-04 09:00:00 | 53.3 |
| 2012-05-04 10:00:00 | 51.22 |
| 2012-05-04 11:00:00 | 50.18 |
| 2012-05-04 12:00:00 | 52.26 |
| 2012-05-04 13:00:00 | 57.72 |
| 2012-05-04 14:00:00 | 52.52 |
| 2012-05-04 15:00:00 | 47.06 |
| 2012-05-04 16:00:00 | 31.72 |
| 2012-05-04 17:00:00 | 24.18 |
| 2012-05-04 18:00:00 | 26.26 |
| 2012-05-04 19:00:00 | 28.08 |
| 2012-05-04 20:00:00 | 27.04 |
| 2012-05-04 21:00:00 | 24.96 |
| 2012-05-04 22:00:00 | 21.32 |
| 2012-05-04 23:00:00 | 17.16 |
| 2012-05-05 | 16.64 |
| 2012-05-05 01:00:00 | 16.9 |
| 2012-05-05 02:00:00 | 16.64 |
| 2012-05-05 03:00:00 | 16.38 |
| 2012-05-05 04:00:00 | 16.38 |
| 2012-05-05 05:00:00 | 16.9 |
| 2012-05-05 06:00:00 | 17.42 |
| 2012-05-05 07:00:00 | 16.38 |
| 2012-05-05 08:00:00 | 16.64 |
| 2012-05-05 09:00:00 | 16.38 |
| 2012-05-05 10:00:00 | 16.38 |
| 2012-05-05 11:00:00 | 16.64 |
| 2012-05-05 12:00:00 | 16.64 |
| 2012-05-05 13:00:00 | 16.64 |
| 2012-05-05 14:00:00 | 16.64 |
| 2012-05-05 15:00:00 | 16.64 |
| 2012-05-05 16:00:00 | 16.9 |
| 2012-05-05 17:00:00 | 16.9 |
| 2012-05-05 18:00:00 | 16.64 |
| 2012-05-05 19:00:00 | 16.9 |
| 2012-05-05 20:00:00 | 16.64 |
| 2012-05-05 21:00:00 | 17.42 |
| 2012-05-05 22:00:00 | 16.64 |
| 2012-05-05 23:00:00 | 16.38 |
| 2012-05-06 | 16.38 |
| 2012-05-06 01:00:00 | 16.12 |
| 2012-05-06 02:00:00 | 16.38 |
| 2012-05-06 03:00:00 | 16.9 |
| 2012-05-06 04:00:00 | 16.12 |
| 2012-05-06 05:00:00 | 17.16 |
| 2012-05-06 06:00:00 | 16.64 |
| 2012-05-06 07:00:00 | 16.12 |
| 2012-05-06 08:00:00 | 16.12 |
| 2012-05-06 09:00:00 | 16.38 |
| 2012-05-06 10:00:00 | 16.38 |
| 2012-05-06 11:00:00 | 16.38 |
| 2012-05-06 12:00:00 | 16.12 |
| 2012-05-06 13:00:00 | 16.64 |
| 2012-05-06 14:00:00 | 16.64 |
| 2012-05-06 15:00:00 | 16.38 |
| 2012-05-06 16:00:00 | 16.9 |
| 2012-05-06 17:00:00 | 16.9 |
| 2012-05-06 18:00:00 | 17.42 |
| 2012-05-06 19:00:00 | 16.64 |
| 2012-05-06 20:00:00 | 16.38 |
| 2012-05-06 21:00:00 | 16.9 |
| 2012-05-06 22:00:00 | 16.38 |
| 2012-05-06 23:00:00 | 16.38 |
| 2012-05-07 | 16.12 |
| 2012-05-07 01:00:00 | 16.64 |
| 2012-05-07 02:00:00 | 16.9 |
| 2012-05-07 03:00:00 | 16.9 |
| 2012-05-07 04:00:00 | 17.42 |
| 2012-05-07 05:00:00 | 18.2 |
| 2012-05-07 06:00:00 | 20.54 |
| 2012-05-07 07:00:00 | 30.42 |
| 2012-05-07 08:00:00 | 44.2 |
| 2012-05-07 09:00:00 | 44.72 |
| 2012-05-07 10:00:00 | 46.02 |
| 2012-05-07 11:00:00 | 45.24 |
| 2012-05-07 12:00:00 | 43.16 |
| 2012-05-07 13:00:00 | 42.12 |
| 2012-05-07 14:00:00 | 41.86 |
| 2012-05-07 15:00:00 | 39 |
| 2012-05-07 16:00:00 | 33.28 |
| 2012-05-07 17:00:00 | 28.34 |
| 2012-05-07 18:00:00 | 25.48 |
| 2012-05-07 19:00:00 | 25.22 |
| 2012-05-07 20:00:00 | 27.3 |
| 2012-05-07 21:00:00 | 27.04 |
| 2012-05-07 22:00:00 | 21.58 |
| 2012-05-07 23:00:00 | 18.98 |
| 2012-05-08 | 17.16 |
| 2012-05-08 01:00:00 | 16.64 |
| 2012-05-08 02:00:00 | 17.16 |
| 2012-05-08 03:00:00 | 16.9 |
| 2012-05-08 04:00:00 | 17.16 |
| 2012-05-08 05:00:00 | 17.16 |
| 2012-05-08 06:00:00 | 16.9 |
| 2012-05-08 07:00:00 | 16.38 |
| 2012-05-08 08:00:00 | 15.86 |
| 2012-05-08 09:00:00 | 15.86 |
| 2012-05-08 10:00:00 | 15.86 |
| 2012-05-08 11:00:00 | 15.86 |
| 2012-05-08 12:00:00 | 15.86 |
| 2012-05-08 13:00:00 | 15.86 |
| 2012-05-08 14:00:00 | 15.6 |
| 2012-05-08 15:00:00 | 16.12 |
| 2012-05-08 16:00:00 | 15.86 |
| 2012-05-08 17:00:00 | 16.12 |
| 2012-05-08 18:00:00 | 16.12 |
| 2012-05-08 19:00:00 | 16.38 |
| 2012-05-08 20:00:00 | 16.12 |
| 2012-05-08 21:00:00 | 16.12 |
| 2012-05-08 22:00:00 | 16.38 |
| 2012-05-08 23:00:00 | 16.38 |
| 2012-05-09 | 16.12 |
| 2012-05-09 01:00:00 | 15.86 |
| 2012-05-09 02:00:00 | 16.38 |
| 2012-05-09 03:00:00 | 16.38 |
| 2012-05-09 04:00:00 | 16.64 |
| 2012-05-09 05:00:00 | 18.46 |
| 2012-05-09 06:00:00 | 20.8 |
| 2012-05-09 07:00:00 | 30.94 |
| 2012-05-09 08:00:00 | 43.68 |
| 2012-05-09 09:00:00 | 42.38 |
| 2012-05-09 10:00:00 | 42.38 |
| 2012-05-09 11:00:00 | 41.34 |
| 2012-05-09 12:00:00 | 43.16 |
| 2012-05-09 13:00:00 | 46.02 |
| 2012-05-09 14:00:00 | 42.9 |
| 2012-05-09 15:00:00 | 46.02 |
| 2012-05-09 16:00:00 | 40.56 |
| 2012-05-09 17:00:00 | 31.2 |
| 2012-05-09 18:00:00 | 28.6 |
| 2012-05-09 19:00:00 | 27.3 |
| 2012-05-09 20:00:00 | 27.56 |
| 2012-05-09 21:00:00 | 29.38 |
| 2012-05-09 22:00:00 | 23.14 |
| 2012-05-09 23:00:00 | 20.28 |
| 2012-05-10 | 17.94 |
| 2012-05-10 01:00:00 | 18.72 |
| 2012-05-10 02:00:00 | 19.24 |
| 2012-05-10 03:00:00 | 19.76 |
| 2012-05-10 04:00:00 | 18.46 |
| 2012-05-10 05:00:00 | 18.98 |
| 2012-05-10 06:00:00 | 21.58 |
| 2012-05-10 07:00:00 | 30.94 |
| 2012-05-10 08:00:00 | 45.76 |
| 2012-05-10 09:00:00 | 46.54 |
| 2012-05-10 10:00:00 | 45.76 |
| 2012-05-10 11:00:00 | 46.54 |
| 2012-05-10 12:00:00 | 47.06 |
| 2012-05-10 13:00:00 | 53.56 |
| 2012-05-10 14:00:00 | 53.3 |
| 2012-05-10 15:00:00 | 51.22 |
| 2012-05-10 16:00:00 | 44.72 |
| 2012-05-10 17:00:00 | 34.32 |
| 2012-05-10 18:00:00 | 30.42 |
| 2012-05-10 19:00:00 | 27.56 |
| 2012-05-10 20:00:00 | 28.08 |
| 2012-05-10 21:00:00 | 28.6 |
| 2012-05-10 22:00:00 | 24.7 |
| 2012-05-10 23:00:00 | 18.72 |
| 2012-05-11 | 16.9 |
| 2012-05-11 01:00:00 | 16.9 |
| 2012-05-11 02:00:00 | 17.16 |
| 2012-05-11 03:00:00 | 16.64 |
| 2012-05-11 04:00:00 | 16.9 |
| 2012-05-11 05:00:00 | 19.5 |
| 2012-05-11 06:00:00 | 22.62 |
| 2012-05-11 07:00:00 | 30.42 |
| 2012-05-11 08:00:00 | 47.06 |
| 2012-05-11 09:00:00 | 47.58 |
| 2012-05-11 10:00:00 | 48.62 |
| 2012-05-11 11:00:00 | 52 |
| 2012-05-11 12:00:00 | 51.74 |
| 2012-05-11 13:00:00 | 51.48 |
| 2012-05-11 14:00:00 | 48.62 |
| 2012-05-11 15:00:00 | 44.2 |
| 2012-05-11 16:00:00 | 33.8 |
| 2012-05-11 17:00:00 | 30.16 |
| 2012-05-11 18:00:00 | 27.3 |
| 2012-05-11 19:00:00 | 28.86 |
| 2012-05-11 20:00:00 | 28.6 |
| 2012-05-11 21:00:00 | 32.24 |
| 2012-05-11 22:00:00 | 23.66 |
| 2012-05-11 23:00:00 | 19.5 |
| 2012-05-12 | 16.9 |
| 2012-05-12 01:00:00 | 17.68 |
| 2012-05-12 02:00:00 | 17.16 |
| 2012-05-12 03:00:00 | 17.16 |
| 2012-05-12 04:00:00 | 17.16 |
| 2012-05-12 05:00:00 | 18.2 |
| 2012-05-12 06:00:00 | 17.68 |
| 2012-05-12 07:00:00 | 16.9 |
| 2012-05-12 08:00:00 | 16.64 |
| 2012-05-12 09:00:00 | 16.9 |
| 2012-05-12 10:00:00 | 16.64 |
| 2012-05-12 11:00:00 | 16.12 |
| 2012-05-12 12:00:00 | 16.64 |
| 2012-05-12 13:00:00 | 16.38 |
| 2012-05-12 14:00:00 | 16.38 |
| 2012-05-12 15:00:00 | 16.12 |
| 2012-05-12 16:00:00 | 16.38 |
| 2012-05-12 17:00:00 | 16.12 |
| 2012-05-12 18:00:00 | 16.64 |
| 2012-05-12 19:00:00 | 16.12 |
| 2012-05-12 20:00:00 | 16.64 |
| 2012-05-12 21:00:00 | 16.64 |
| 2012-05-12 22:00:00 | 16.38 |
| 2012-05-12 23:00:00 | 16.38 |
| 2012-05-13 | 16.38 |
| 2012-05-13 01:00:00 | 16.38 |
| 2012-05-13 02:00:00 | 16.64 |
| 2012-05-13 03:00:00 | 16.38 |
| 2012-05-13 04:00:00 | 16.38 |
| 2012-05-13 05:00:00 | 16.9 |
| 2012-05-13 06:00:00 | 16.9 |
| 2012-05-13 07:00:00 | 16.12 |
| 2012-05-13 08:00:00 | 16.9 |
| 2012-05-13 09:00:00 | 16.38 |
| 2012-05-13 10:00:00 | 16.12 |
| 2012-05-13 11:00:00 | 16.64 |
| 2012-05-13 12:00:00 | 16.12 |
| 2012-05-13 13:00:00 | 16.12 |
| 2012-05-13 14:00:00 | 16.12 |
| 2012-05-13 15:00:00 | 16.38 |
| 2012-05-13 16:00:00 | 16.12 |
| 2012-05-13 17:00:00 | 16.38 |
| 2012-05-13 18:00:00 | 16.38 |
| 2012-05-13 19:00:00 | 17.16 |
| 2012-05-13 20:00:00 | 17.94 |
| 2012-05-13 21:00:00 | 18.72 |
| 2012-05-13 22:00:00 | 18.2 |
| 2012-05-13 23:00:00 | 18.2 |
| 2012-05-14 | 17.42 |
| 2012-05-14 01:00:00 | 17.94 |
| 2012-05-14 02:00:00 | 17.16 |
| 2012-05-14 03:00:00 | 17.42 |
| 2012-05-14 04:00:00 | 17.16 |
| 2012-05-14 05:00:00 | 17.94 |
| 2012-05-14 06:00:00 | 20.54 |
| 2012-05-14 07:00:00 | 30.68 |
| 2012-05-14 08:00:00 | 47.58 |
| 2012-05-14 09:00:00 | 50.96 |
| 2012-05-14 10:00:00 | 49.92 |
| 2012-05-14 11:00:00 | 45.5 |
| 2012-05-14 12:00:00 | 44.98 |
| 2012-05-14 13:00:00 | 47.06 |
| 2012-05-14 14:00:00 | 47.32 |
| 2012-05-14 15:00:00 | 44.46 |
| 2012-05-14 16:00:00 | 37.18 |
| 2012-05-14 17:00:00 | 29.9 |
| 2012-05-14 18:00:00 | 25.74 |
| 2012-05-14 19:00:00 | 26.78 |
| 2012-05-14 20:00:00 | 27.56 |
| 2012-05-14 21:00:00 | 31.72 |
| 2012-05-14 22:00:00 | 25.74 |
| 2012-05-14 23:00:00 | 18.46 |
| 2012-05-15 | 16.64 |
| 2012-05-15 01:00:00 | 16.38 |
| 2012-05-15 02:00:00 | 16.64 |
| 2012-05-15 03:00:00 | 16.38 |
| 2012-05-15 04:00:00 | 17.68 |
| 2012-05-15 05:00:00 | 17.94 |
| 2012-05-15 06:00:00 | 19.24 |
| 2012-05-15 07:00:00 | 30.42 |
| 2012-05-15 08:00:00 | 46.28 |
| 2012-05-15 09:00:00 | 45.76 |
| 2012-05-15 10:00:00 | 43.94 |
| 2012-05-15 11:00:00 | 43.94 |
| 2012-05-15 12:00:00 | 42.9 |
| 2012-05-15 13:00:00 | 44.98 |
| 2012-05-15 14:00:00 | 43.16 |
| 2012-05-15 15:00:00 | 41.86 |
| 2012-05-15 16:00:00 | 33.8 |
| 2012-05-15 17:00:00 | 28.08 |
| 2012-05-15 18:00:00 | 26.78 |
| 2012-05-15 19:00:00 | 27.3 |
| 2012-05-15 20:00:00 | 27.82 |
| 2012-05-15 21:00:00 | 27.3 |
| 2012-05-15 22:00:00 | 22.36 |
| 2012-05-15 23:00:00 | 18.98 |
| 2012-05-16 | 16.64 |
| 2012-05-16 01:00:00 | 16.64 |
| 2012-05-16 02:00:00 | 16.9 |
| 2012-05-16 03:00:00 | 17.16 |
| 2012-05-16 04:00:00 | 17.16 |
| 2012-05-16 05:00:00 | 20.02 |
| 2012-05-16 06:00:00 | 22.88 |
| 2012-05-16 07:00:00 | 31.2 |
| 2012-05-16 08:00:00 | 43.94 |
| 2012-05-16 09:00:00 | 44.2 |
| 2012-05-16 10:00:00 | 41.86 |
| 2012-05-16 11:00:00 | 46.54 |
| 2012-05-16 12:00:00 | 47.06 |
| 2012-05-16 13:00:00 | 46.02 |
| 2012-05-16 14:00:00 | 45.24 |
| 2012-05-16 15:00:00 | 44.98 |
| 2012-05-16 16:00:00 | 37.18 |
| 2012-05-16 17:00:00 | 30.68 |
| 2012-05-16 18:00:00 | 26.26 |
| 2012-05-16 19:00:00 | 26.52 |
| 2012-05-16 20:00:00 | 26.52 |
| 2012-05-16 21:00:00 | 26.52 |
| 2012-05-16 22:00:00 | 23.4 |
| 2012-05-16 23:00:00 | 18.46 |
| 2012-05-17 | 16.9 |
| 2012-05-17 01:00:00 | 17.16 |
| 2012-05-17 02:00:00 | 17.68 |
| 2012-05-17 03:00:00 | 16.9 |
| 2012-05-17 04:00:00 | 18.72 |
| 2012-05-17 05:00:00 | 18.98 |
| 2012-05-17 06:00:00 | 21.32 |
| 2012-05-17 07:00:00 | 30.68 |
| 2012-05-17 08:00:00 | 45.76 |
| 2012-05-17 09:00:00 | 44.46 |
| 2012-05-17 10:00:00 | 42.38 |
| 2012-05-17 11:00:00 | 42.12 |
| 2012-05-17 12:00:00 | 42.12 |
| 2012-05-17 13:00:00 | 42.9 |
| 2012-05-17 14:00:00 | 42.64 |
| 2012-05-17 15:00:00 | 41.08 |
| 2012-05-17 16:00:00 | 33.8 |
| 2012-05-17 17:00:00 | 27.82 |
| 2012-05-17 18:00:00 | 25.74 |
| 2012-05-17 19:00:00 | 26.26 |
| 2012-05-17 20:00:00 | 27.56 |
| 2012-05-17 21:00:00 | 29.64 |
| 2012-05-17 22:00:00 | 23.66 |
| 2012-05-17 23:00:00 | 20.02 |
| 2012-05-18 | 17.16 |
| 2012-05-18 01:00:00 | 16.9 |
| 2012-05-18 02:00:00 | 17.16 |
| 2012-05-18 03:00:00 | 16.9 |
| 2012-05-18 04:00:00 | 16.9 |
| 2012-05-18 05:00:00 | 19.24 |
| 2012-05-18 06:00:00 | 22.62 |
| 2012-05-18 07:00:00 | 29.38 |
| 2012-05-18 08:00:00 | 40.04 |
| 2012-05-18 09:00:00 | 42.9 |
| 2012-05-18 10:00:00 | 41.34 |
| 2012-05-18 11:00:00 | 41.6 |
| 2012-05-18 12:00:00 | 41.6 |
| 2012-05-18 13:00:00 | 41.86 |
| 2012-05-18 14:00:00 | 39.78 |
| 2012-05-18 15:00:00 | 36.4 |
| 2012-05-18 16:00:00 | 29.9 |
| 2012-05-18 17:00:00 | 25.22 |
| 2012-05-18 18:00:00 | 26.26 |
| 2012-05-18 19:00:00 | 26 |
| 2012-05-18 20:00:00 | 27.82 |
| 2012-05-18 21:00:00 | 27.3 |
| 2012-05-18 22:00:00 | 22.62 |
| 2012-05-18 23:00:00 | 17.68 |
| 2012-05-19 | 16.64 |
| 2012-05-19 01:00:00 | 16.38 |
| 2012-05-19 02:00:00 | 16.64 |
| 2012-05-19 03:00:00 | 16.64 |
| 2012-05-19 04:00:00 | 16.64 |
| 2012-05-19 05:00:00 | 16.9 |
| 2012-05-19 06:00:00 | 16.64 |
| 2012-05-19 07:00:00 | 16.9 |
| 2012-05-19 08:00:00 | 16.9 |
| 2012-05-19 09:00:00 | 17.16 |
| 2012-05-19 10:00:00 | 16.9 |
| 2012-05-19 11:00:00 | 17.16 |
| 2012-05-19 12:00:00 | 17.16 |
| 2012-05-19 13:00:00 | 17.16 |
| 2012-05-19 14:00:00 | 17.16 |
| 2012-05-19 15:00:00 | 17.42 |
| 2012-05-19 16:00:00 | 16.9 |
| 2012-05-19 17:00:00 | 17.42 |
| 2012-05-19 18:00:00 | 17.68 |
| 2012-05-19 19:00:00 | 16.38 |
| 2012-05-19 20:00:00 | 16.38 |
| 2012-05-19 21:00:00 | 16.64 |
| 2012-05-19 22:00:00 | 16.64 |
| 2012-05-19 23:00:00 | 16.38 |
| 2012-05-20 | 16.38 |
| 2012-05-20 01:00:00 | 16.12 |
| 2012-05-20 02:00:00 | 16.12 |
| 2012-05-20 03:00:00 | 16.38 |
| 2012-05-20 04:00:00 | 16.12 |
| 2012-05-20 05:00:00 | 16.64 |
| 2012-05-20 06:00:00 | 16.9 |
| 2012-05-20 07:00:00 | 16.9 |
| 2012-05-20 08:00:00 | 18.46 |
| 2012-05-20 09:00:00 | 18.2 |
| 2012-05-20 10:00:00 | 17.94 |
| 2012-05-20 11:00:00 | 17.94 |
| 2012-05-20 12:00:00 | 18.46 |
| 2012-05-20 13:00:00 | 18.72 |
| 2012-05-20 14:00:00 | 18.46 |
| 2012-05-20 15:00:00 | 18.98 |
| 2012-05-20 16:00:00 | 19.24 |
| 2012-05-20 17:00:00 | 22.62 |
| 2012-05-20 18:00:00 | 20.8 |
| 2012-05-20 19:00:00 | 19.5 |
| 2012-05-20 20:00:00 | 18.98 |
| 2012-05-20 21:00:00 | 18.2 |
| 2012-05-20 22:00:00 | 17.68 |
| 2012-05-20 23:00:00 | 18.2 |
| 2012-05-21 | 17.16 |
| 2012-05-21 01:00:00 | 17.16 |
| 2012-05-21 02:00:00 | 17.16 |
| 2012-05-21 03:00:00 | 17.16 |
| 2012-05-21 04:00:00 | 17.68 |
| 2012-05-21 05:00:00 | 20.8 |
| 2012-05-21 06:00:00 | 21.58 |
| 2012-05-21 07:00:00 | 30.68 |
| 2012-05-21 08:00:00 | 49.92 |
| 2012-05-21 09:00:00 | 51.48 |
| 2012-05-21 10:00:00 | 51.48 |
| 2012-05-21 11:00:00 | 52 |
| 2012-05-21 12:00:00 | 53.3 |
| 2012-05-21 13:00:00 | 57.98 |
| 2012-05-21 14:00:00 | 55.12 |
| 2012-05-21 15:00:00 | 48.36 |
| 2012-05-21 16:00:00 | 39.52 |
| 2012-05-21 17:00:00 | 34.32 |
| 2012-05-21 18:00:00 | 31.46 |
| 2012-05-21 19:00:00 | 28.08 |
| 2012-05-21 20:00:00 | 28.08 |
| 2012-05-21 21:00:00 | 29.12 |
| 2012-05-21 22:00:00 | 23.92 |
| 2012-05-21 23:00:00 | 19.5 |
| 2012-05-22 | 16.9 |
| 2012-05-22 01:00:00 | 16.9 |
| 2012-05-22 02:00:00 | 17.16 |
| 2012-05-22 03:00:00 | 16.9 |
| 2012-05-22 04:00:00 | 16.9 |
| 2012-05-22 05:00:00 | 20.8 |
| 2012-05-22 06:00:00 | 22.1 |
| 2012-05-22 07:00:00 | 31.72 |
| 2012-05-22 08:00:00 | 48.36 |
| 2012-05-22 09:00:00 | 47.58 |
| 2012-05-22 10:00:00 | 51.74 |
| 2012-05-22 11:00:00 | 55.12 |
| 2012-05-22 12:00:00 | 57.46 |
| 2012-05-22 13:00:00 | 57.46 |
| 2012-05-22 14:00:00 | 57.46 |
| 2012-05-22 15:00:00 | 55.12 |
| 2012-05-22 16:00:00 | 49.66 |
| 2012-05-22 17:00:00 | 40.04 |
| 2012-05-22 18:00:00 | 33.54 |
| 2012-05-22 19:00:00 | 33.54 |
| 2012-05-22 20:00:00 | 29.9 |
| 2012-05-22 21:00:00 | 37.44 |
| 2012-05-22 22:00:00 | 29.38 |
| 2012-05-22 23:00:00 | 24.44 |
| 2012-05-23 | 21.32 |
| 2012-05-23 01:00:00 | 21.84 |
| 2012-05-23 02:00:00 | 20.28 |
| 2012-05-23 03:00:00 | 20.8 |
| 2012-05-23 04:00:00 | 20.54 |
| 2012-05-23 05:00:00 | 21.32 |
| 2012-05-23 06:00:00 | 23.4 |
| 2012-05-23 07:00:00 | 33.54 |
| 2012-05-23 08:00:00 | 50.44 |
| 2012-05-23 09:00:00 | 49.4 |
| 2012-05-23 10:00:00 | 53.04 |
| 2012-05-23 11:00:00 | 53.3 |
| 2012-05-23 12:00:00 | 54.6 |
| 2012-05-23 13:00:00 | 58.76 |
| 2012-05-23 14:00:00 | 59.28 |
| 2012-05-23 15:00:00 | 55.64 |
| 2012-05-23 16:00:00 | 47.32 |
| 2012-05-23 17:00:00 | 38.22 |
| 2012-05-23 18:00:00 | 29.64 |
| 2012-05-23 19:00:00 | 29.64 |
| 2012-05-23 20:00:00 | 29.64 |
| 2012-05-23 21:00:00 | 27.82 |
| 2012-05-23 22:00:00 | 23.66 |
| 2012-05-23 23:00:00 | 20.28 |
| 2012-05-24 | 18.72 |
| 2012-05-24 01:00:00 | 17.94 |
| 2012-05-24 02:00:00 | 18.2 |
| 2012-05-24 03:00:00 | 18.46 |
| 2012-05-24 04:00:00 | 18.46 |
| 2012-05-24 05:00:00 | 20.02 |
| 2012-05-24 06:00:00 | 21.32 |
| 2012-05-24 07:00:00 | 30.16 |
| 2012-05-24 08:00:00 | 49.4 |
| 2012-05-24 09:00:00 | 53.3 |
| 2012-05-24 10:00:00 | 50.96 |
| 2012-05-24 11:00:00 | 53.04 |
| 2012-05-24 12:00:00 | 54.86 |
| 2012-05-24 13:00:00 | 54.34 |
| 2012-05-24 14:00:00 | 52.78 |
| 2012-05-24 15:00:00 | 50.96 |
| 2012-05-24 16:00:00 | 41.08 |
| 2012-05-24 17:00:00 | 31.72 |
| 2012-05-24 18:00:00 | 31.72 |
| 2012-05-24 19:00:00 | 32.24 |
| 2012-05-24 20:00:00 | 32.76 |
| 2012-05-24 21:00:00 | 35.1 |
| 2012-05-24 22:00:00 | 26.52 |
| 2012-05-24 23:00:00 | 22.36 |
| 2012-05-25 | 20.02 |
| 2012-05-25 01:00:00 | 19.76 |
| 2012-05-25 02:00:00 | 18.46 |
| 2012-05-25 03:00:00 | 18.46 |
| 2012-05-25 04:00:00 | 18.2 |
| 2012-05-25 05:00:00 | 21.06 |
| 2012-05-25 06:00:00 | 22.36 |
| 2012-05-25 07:00:00 | 29.38 |
| 2012-05-25 08:00:00 | 46.8 |
| 2012-05-25 09:00:00 | 48.36 |
| 2012-05-25 10:00:00 | 47.84 |
| 2012-05-25 11:00:00 | 47.32 |
| 2012-05-25 12:00:00 | 49.4 |
| 2012-05-25 13:00:00 | 49.66 |
| 2012-05-25 14:00:00 | 47.06 |
| 2012-05-25 15:00:00 | 41.08 |
| 2012-05-25 16:00:00 | 34.32 |
| 2012-05-25 17:00:00 | 28.08 |
| 2012-05-25 18:00:00 | 25.74 |
| 2012-05-25 19:00:00 | 27.56 |
| 2012-05-25 20:00:00 | 26.78 |
| 2012-05-25 21:00:00 | 26.78 |
| 2012-05-25 22:00:00 | 21.32 |
| 2012-05-25 23:00:00 | 17.16 |
| 2012-05-26 | 16.38 |
| 2012-05-26 01:00:00 | 16.64 |
| 2012-05-26 02:00:00 | 16.12 |
| 2012-05-26 03:00:00 | 16.38 |
| 2012-05-26 04:00:00 | 16.12 |
| 2012-05-26 05:00:00 | 16.38 |
| 2012-05-26 06:00:00 | 16.38 |
| 2012-05-26 07:00:00 | 16.38 |
| 2012-05-26 08:00:00 | 16.9 |
| 2012-05-26 09:00:00 | 15.86 |
| 2012-05-26 10:00:00 | 17.42 |
| 2012-05-26 11:00:00 | 16.9 |
| 2012-05-26 12:00:00 | 17.42 |
| 2012-05-26 13:00:00 | 17.16 |
| 2012-05-26 14:00:00 | 17.94 |
| 2012-05-26 15:00:00 | 17.68 |
| 2012-05-26 16:00:00 | 17.42 |
| 2012-05-26 17:00:00 | 17.68 |
| 2012-05-26 18:00:00 | 16.9 |
| 2012-05-26 19:00:00 | 17.42 |
| 2012-05-26 20:00:00 | 17.42 |
| 2012-05-26 21:00:00 | 17.68 |
| 2012-05-26 22:00:00 | 17.94 |
| 2012-05-26 23:00:00 | 17.16 |
| 2012-05-27 | 17.42 |
| 2012-05-27 01:00:00 | 17.16 |
| 2012-05-27 02:00:00 | 17.42 |
| 2012-05-27 03:00:00 | 17.16 |
| 2012-05-27 04:00:00 | 17.16 |
| 2012-05-27 05:00:00 | 17.16 |
| 2012-05-27 06:00:00 | 16.64 |
| 2012-05-27 07:00:00 | 17.16 |
| 2012-05-27 08:00:00 | 16.64 |
| 2012-05-27 09:00:00 | 16.38 |
| 2012-05-27 10:00:00 | 16.38 |
| 2012-05-27 11:00:00 | 16.64 |
| 2012-05-27 12:00:00 | 16.64 |
| 2012-05-27 13:00:00 | 16.64 |
| 2012-05-27 14:00:00 | 16.64 |
| 2012-05-27 15:00:00 | 16.38 |
| 2012-05-27 16:00:00 | 16.9 |
| 2012-05-27 17:00:00 | 16.38 |
| 2012-05-27 18:00:00 | 16.64 |
| 2012-05-27 19:00:00 | 16.38 |
| 2012-05-27 20:00:00 | 16.64 |
| 2012-05-27 21:00:00 | 16.38 |
| 2012-05-27 22:00:00 | 16.64 |
| 2012-05-27 23:00:00 | 16.38 |
| 2012-05-28 | 16.38 |
| 2012-05-28 01:00:00 | 16.38 |
| 2012-05-28 02:00:00 | 16.64 |
| 2012-05-28 03:00:00 | 16.38 |
| 2012-05-28 04:00:00 | 16.64 |
| 2012-05-28 05:00:00 | 19.76 |
| 2012-05-28 06:00:00 | 22.62 |
| 2012-05-28 07:00:00 | 31.72 |
| 2012-05-28 08:00:00 | 48.36 |
| 2012-05-28 09:00:00 | 50.7 |
| 2012-05-28 10:00:00 | 47.32 |
| 2012-05-28 11:00:00 | 49.4 |
| 2012-05-28 12:00:00 | 51.74 |
| 2012-05-28 13:00:00 | 53.56 |
| 2012-05-28 14:00:00 | 52 |
| 2012-05-28 15:00:00 | 47.58 |
| 2012-05-28 16:00:00 | 39.52 |
| 2012-05-28 17:00:00 | 31.2 |
| 2012-05-28 18:00:00 | 27.82 |
| 2012-05-28 19:00:00 | 28.08 |
| 2012-05-28 20:00:00 | 27.56 |
| 2012-05-28 21:00:00 | 32.76 |
| 2012-05-28 22:00:00 | 25.48 |
| 2012-05-28 23:00:00 | 19.24 |
| 2012-05-29 | 17.94 |
| 2012-05-29 01:00:00 | 17.42 |
| 2012-05-29 02:00:00 | 17.68 |
| 2012-05-29 03:00:00 | 17.94 |
| 2012-05-29 04:00:00 | 18.46 |
| 2012-05-29 05:00:00 | 19.5 |
| 2012-05-29 06:00:00 | 21.58 |
| 2012-05-29 07:00:00 | 30.42 |
| 2012-05-29 08:00:00 | 46.8 |
| 2012-05-29 09:00:00 | 49.66 |
| 2012-05-29 10:00:00 | 52 |
| 2012-05-29 11:00:00 | 52.78 |
| 2012-05-29 12:00:00 | 52 |
| 2012-05-29 13:00:00 | 52.52 |
| 2012-05-29 14:00:00 | 51.74 |
| 2012-05-29 15:00:00 | 50.18 |
| 2012-05-29 16:00:00 | 39.52 |
| 2012-05-29 17:00:00 | 31.98 |
| 2012-05-29 18:00:00 | 30.16 |
| 2012-05-29 19:00:00 | 31.2 |
| 2012-05-29 20:00:00 | 29.9 |
| 2012-05-29 21:00:00 | 32.24 |
| 2012-05-29 22:00:00 | 24.44 |
| 2012-05-29 23:00:00 | 18.98 |
| 2012-05-30 | 17.42 |
| 2012-05-30 01:00:00 | 17.16 |
| 2012-05-30 02:00:00 | 17.16 |
| 2012-05-30 03:00:00 | 17.42 |
| 2012-05-30 04:00:00 | 17.42 |
| 2012-05-30 05:00:00 | 19.24 |
| 2012-05-30 06:00:00 | 23.14 |
| 2012-05-30 07:00:00 | 33.28 |
| 2012-05-30 08:00:00 | 49.4 |
| 2012-05-30 09:00:00 | 49.14 |
| 2012-05-30 10:00:00 | 49.66 |
| 2012-05-30 11:00:00 | 50.44 |
| 2012-05-30 12:00:00 | 52.52 |
| 2012-05-30 13:00:00 | 52 |
| 2012-05-30 14:00:00 | 53.56 |
| 2012-05-30 15:00:00 | 48.1 |
| 2012-05-30 16:00:00 | 39.26 |
| 2012-05-30 17:00:00 | 34.32 |
| 2012-05-30 18:00:00 | 31.2 |
| 2012-05-30 19:00:00 | 29.38 |
| 2012-05-30 20:00:00 | 28.08 |
| 2012-05-30 21:00:00 | 28.34 |
| 2012-05-30 22:00:00 | 23.66 |
| 2012-05-30 23:00:00 | 19.76 |
| 2012-05-31 | 17.42 |
| 2012-05-31 01:00:00 | 16.9 |
| 2012-05-31 02:00:00 | 17.16 |
| 2012-05-31 03:00:00 | 17.42 |
| 2012-05-31 04:00:00 | 17.94 |
| 2012-05-31 05:00:00 | 18.98 |
| 2012-05-31 06:00:00 | 21.84 |
| 2012-05-31 07:00:00 | 28.34 |
| 2012-05-31 08:00:00 | 45.5 |
| 2012-05-31 09:00:00 | 48.62 |
| 2012-05-31 10:00:00 | 48.88 |
| 2012-05-31 11:00:00 | 49.14 |
| 2012-05-31 12:00:00 | 49.92 |
| 2012-05-31 13:00:00 | 48.88 |
| 2012-05-31 14:00:00 | 47.32 |
| 2012-05-31 15:00:00 | 43.42 |
| 2012-05-31 16:00:00 | 34.58 |
| 2012-05-31 17:00:00 | 27.56 |
| 2012-05-31 18:00:00 | 25.22 |
| 2012-05-31 19:00:00 | 26 |
| 2012-05-31 20:00:00 | 26.52 |
| 2012-05-31 21:00:00 | 30.16 |
| 2012-05-31 22:00:00 | 26.26 |
| 2012-05-31 23:00:00 | 19.5 |
| 2012-06-01 | 17.16 |
| 2012-06-01 01:00:00 | 17.42 |
| 2012-06-01 02:00:00 | 17.16 |
| 2012-06-01 03:00:00 | 17.42 |
| 2012-06-01 04:00:00 | 17.16 |
| 2012-06-01 05:00:00 | 18.46 |
| 2012-06-01 06:00:00 | 21.84 |
| 2012-06-01 07:00:00 | 33.8 |
| 2012-06-01 08:00:00 | 51.74 |
| 2012-06-01 09:00:00 | 52 |
| 2012-06-01 10:00:00 | 49.92 |
| 2012-06-01 11:00:00 | 50.18 |
| 2012-06-01 12:00:00 | 49.4 |
| 2012-06-01 13:00:00 | 47.06 |
| 2012-06-01 14:00:00 | 50.44 |
| 2012-06-01 15:00:00 | 42.9 |
| 2012-06-01 16:00:00 | 34.58 |
| 2012-06-01 17:00:00 | 28.08 |
| 2012-06-01 18:00:00 | 27.04 |
| 2012-06-01 19:00:00 | 28.6 |
| 2012-06-01 20:00:00 | 27.04 |
| 2012-06-01 21:00:00 | 27.56 |
| 2012-06-01 22:00:00 | 21.58 |
| 2012-06-01 23:00:00 | 18.98 |
| 2012-06-02 | 17.16 |
| 2012-06-02 01:00:00 | 17.16 |
| 2012-06-02 02:00:00 | 17.16 |
| 2012-06-02 03:00:00 | 17.16 |
| 2012-06-02 04:00:00 | 17.16 |
| 2012-06-02 05:00:00 | 16.64 |
| 2012-06-02 06:00:00 | 16.64 |
| 2012-06-02 07:00:00 | 16.12 |
| 2012-06-02 08:00:00 | 18.46 |
| 2012-06-02 09:00:00 | 18.46 |
| 2012-06-02 10:00:00 | 18.46 |
| 2012-06-02 11:00:00 | 18.2 |
| 2012-06-02 12:00:00 | 18.46 |
| 2012-06-02 13:00:00 | 18.72 |
| 2012-06-02 14:00:00 | 18.46 |
| 2012-06-02 15:00:00 | 16.38 |
| 2012-06-02 16:00:00 | 16.12 |
| 2012-06-02 17:00:00 | 16.38 |
| 2012-06-02 18:00:00 | 15.86 |
| 2012-06-02 19:00:00 | 15.86 |
| 2012-06-02 20:00:00 | 15.86 |
| 2012-06-02 21:00:00 | 16.12 |
| 2012-06-02 22:00:00 | 16.12 |
| 2012-06-02 23:00:00 | 16.38 |
| 2012-06-03 | 15.86 |
| 2012-06-03 01:00:00 | 16.12 |
| 2012-06-03 02:00:00 | 16.12 |
| 2012-06-03 03:00:00 | 16.12 |
| 2012-06-03 04:00:00 | 16.12 |
| 2012-06-03 05:00:00 | 15.86 |
| 2012-06-03 06:00:00 | 15.86 |
| 2012-06-03 07:00:00 | 15.86 |
| 2012-06-03 08:00:00 | 17.16 |
| 2012-06-03 09:00:00 | 17.42 |
| 2012-06-03 10:00:00 | 16.9 |
| 2012-06-03 11:00:00 | 16.64 |
| 2012-06-03 12:00:00 | 16.64 |
| 2012-06-03 13:00:00 | 17.16 |
| 2012-06-03 14:00:00 | 17.16 |
| 2012-06-03 15:00:00 | 17.16 |
| 2012-06-03 16:00:00 | 17.42 |
| 2012-06-03 17:00:00 | 17.94 |
| 2012-06-03 18:00:00 | 18.2 |
| 2012-06-03 19:00:00 | 18.46 |
| 2012-06-03 20:00:00 | 18.46 |
| 2012-06-03 21:00:00 | 18.46 |
| 2012-06-03 22:00:00 | 18.2 |
| 2012-06-03 23:00:00 | 18.2 |
| 2012-06-04 | 17.42 |
| 2012-06-04 01:00:00 | 17.16 |
| 2012-06-04 02:00:00 | 17.16 |
| 2012-06-04 03:00:00 | 16.9 |
| 2012-06-04 04:00:00 | 16.9 |
| 2012-06-04 05:00:00 | 18.2 |
| 2012-06-04 06:00:00 | 21.06 |
| 2012-06-04 07:00:00 | 31.46 |
| 2012-06-04 08:00:00 | 50.7 |
| 2012-06-04 09:00:00 | 58.24 |
| 2012-06-04 10:00:00 | 56.94 |
| 2012-06-04 11:00:00 | 56.16 |
| 2012-06-04 12:00:00 | 53.56 |
| 2012-06-04 13:00:00 | 50.18 |
| 2012-06-04 14:00:00 | 50.18 |
| 2012-06-04 15:00:00 | 45.5 |
| 2012-06-04 16:00:00 | 40.82 |
| 2012-06-04 17:00:00 | 30.94 |
| 2012-06-04 18:00:00 | 27.04 |
| 2012-06-04 19:00:00 | 26.52 |
| 2012-06-04 20:00:00 | 27.56 |
| 2012-06-04 21:00:00 | 32.24 |
| 2012-06-04 22:00:00 | 23.4 |
| 2012-06-04 23:00:00 | 17.94 |
| 2012-06-05 | 16.64 |
| 2012-06-05 01:00:00 | 16.9 |
| 2012-06-05 02:00:00 | 16.9 |
| 2012-06-05 03:00:00 | 16.64 |
| 2012-06-05 04:00:00 | 17.68 |
| 2012-06-05 05:00:00 | 18.72 |
| 2012-06-05 06:00:00 | 20.54 |
| 2012-06-05 07:00:00 | 30.94 |
| 2012-06-05 08:00:00 | 43.16 |
| 2012-06-05 09:00:00 | 50.7 |
| 2012-06-05 10:00:00 | 48.88 |
| 2012-06-05 11:00:00 | 48.88 |
| 2012-06-05 12:00:00 | 50.7 |
| 2012-06-05 13:00:00 | 51.48 |
| 2012-06-05 14:00:00 | 50.18 |
| 2012-06-05 15:00:00 | 45.5 |
| 2012-06-05 16:00:00 | 38.22 |
| 2012-06-05 17:00:00 | 30.16 |
| 2012-06-05 18:00:00 | 26.26 |
| 2012-06-05 19:00:00 | 28.86 |
| 2012-06-05 20:00:00 | 29.38 |
| 2012-06-05 21:00:00 | 28.08 |
| 2012-06-05 22:00:00 | 22.62 |
| 2012-06-05 23:00:00 | 19.5 |
| 2012-06-06 | 17.68 |
| 2012-06-06 01:00:00 | 16.9 |
| 2012-06-06 02:00:00 | 16.9 |
| 2012-06-06 03:00:00 | 16.9 |
| 2012-06-06 04:00:00 | 16.64 |
| 2012-06-06 05:00:00 | 19.24 |
| 2012-06-06 06:00:00 | 20.28 |
| 2012-06-06 07:00:00 | 29.12 |
| 2012-06-06 08:00:00 | 45.76 |
| 2012-06-06 09:00:00 | 44.98 |
| 2012-06-06 10:00:00 | 43.68 |
| 2012-06-06 11:00:00 | 44.72 |
| 2012-06-06 12:00:00 | 45.76 |
| 2012-06-06 13:00:00 | 44.98 |
| 2012-06-06 14:00:00 | 44.46 |
| 2012-06-06 15:00:00 | 41.6 |
| 2012-06-06 16:00:00 | 33.54 |
| 2012-06-06 17:00:00 | 28.86 |
| 2012-06-06 18:00:00 | 24.96 |
| 2012-06-06 19:00:00 | 24.44 |
| 2012-06-06 20:00:00 | 25.48 |
| 2012-06-06 21:00:00 | 29.12 |
| 2012-06-06 22:00:00 | 23.14 |
| 2012-06-06 23:00:00 | 17.94 |
| 2012-06-07 | 17.16 |
| 2012-06-07 01:00:00 | 16.64 |
| 2012-06-07 02:00:00 | 16.9 |
| 2012-06-07 03:00:00 | 16.64 |
| 2012-06-07 04:00:00 | 16.64 |
| 2012-06-07 05:00:00 | 17.68 |
| 2012-06-07 06:00:00 | 20.28 |
| 2012-06-07 07:00:00 | 28.08 |
| 2012-06-07 08:00:00 | 44.46 |
| 2012-06-07 09:00:00 | 46.8 |
| 2012-06-07 10:00:00 | 47.06 |
| 2012-06-07 11:00:00 | 44.2 |
| 2012-06-07 12:00:00 | 43.16 |
| 2012-06-07 13:00:00 | 43.68 |
| 2012-06-07 14:00:00 | 44.46 |
| 2012-06-07 15:00:00 | 43.94 |
| 2012-06-07 16:00:00 | 39 |
| 2012-06-07 17:00:00 | 31.2 |
| 2012-06-07 18:00:00 | 27.04 |
| 2012-06-07 19:00:00 | 27.82 |
| 2012-06-07 20:00:00 | 27.3 |
| 2012-06-07 21:00:00 | 28.08 |
| 2012-06-07 22:00:00 | 25.74 |
| 2012-06-07 23:00:00 | 21.06 |
| 2012-06-08 | 17.68 |
| 2012-06-08 01:00:00 | 17.68 |
| 2012-06-08 02:00:00 | 17.16 |
| 2012-06-08 03:00:00 | 17.68 |
| 2012-06-08 04:00:00 | 17.42 |
| 2012-06-08 05:00:00 | 20.28 |
| 2012-06-08 06:00:00 | 21.58 |
| 2012-06-08 07:00:00 | 30.94 |
| 2012-06-08 08:00:00 | 48.62 |
| 2012-06-08 09:00:00 | 48.36 |
| 2012-06-08 10:00:00 | 44.72 |
| 2012-06-08 11:00:00 | 45.5 |
| 2012-06-08 12:00:00 | 49.4 |
| 2012-06-08 13:00:00 | 49.4 |
| 2012-06-08 14:00:00 | 43.42 |
| 2012-06-08 15:00:00 | 42.12 |
| 2012-06-08 16:00:00 | 34.06 |
| 2012-06-08 17:00:00 | 29.12 |
| 2012-06-08 18:00:00 | 28.6 |
| 2012-06-08 19:00:00 | 26.26 |
| 2012-06-08 20:00:00 | 25.74 |
| 2012-06-08 21:00:00 | 26.78 |
| 2012-06-08 22:00:00 | 22.36 |
| 2012-06-08 23:00:00 | 18.72 |
| 2012-06-09 | 16.64 |
| 2012-06-09 01:00:00 | 16.38 |
| 2012-06-09 02:00:00 | 16.9 |
| 2012-06-09 03:00:00 | 16.38 |
| 2012-06-09 04:00:00 | 16.64 |
| 2012-06-09 05:00:00 | 16.9 |
| 2012-06-09 06:00:00 | 16.38 |
| 2012-06-09 07:00:00 | 16.9 |
| 2012-06-09 08:00:00 | 17.16 |
| 2012-06-09 09:00:00 | 18.72 |
| 2012-06-09 10:00:00 | 17.94 |
| 2012-06-09 11:00:00 | 16.9 |
| 2012-06-09 12:00:00 | 17.16 |
| 2012-06-09 13:00:00 | 16.9 |
| 2012-06-09 14:00:00 | 17.42 |
| 2012-06-09 15:00:00 | 16.9 |
| 2012-06-09 16:00:00 | 17.16 |
| 2012-06-09 17:00:00 | 17.16 |
| 2012-06-09 18:00:00 | 16.9 |
| 2012-06-09 19:00:00 | 17.16 |
| 2012-06-09 20:00:00 | 16.9 |
| 2012-06-09 21:00:00 | 17.16 |
| 2012-06-09 22:00:00 | 17.16 |
| 2012-06-09 23:00:00 | 17.16 |
| 2012-06-10 | 16.9 |
| 2012-06-10 01:00:00 | 16.64 |
| 2012-06-10 02:00:00 | 16.38 |
| 2012-06-10 03:00:00 | 16.38 |
| 2012-06-10 04:00:00 | 16.38 |
| 2012-06-10 05:00:00 | 16.64 |
| 2012-06-10 06:00:00 | 16.64 |
| 2012-06-10 07:00:00 | 16.64 |
| 2012-06-10 08:00:00 | 16.9 |
| 2012-06-10 09:00:00 | 16.9 |
| 2012-06-10 10:00:00 | 17.94 |
| 2012-06-10 11:00:00 | 17.94 |
| 2012-06-10 12:00:00 | 17.42 |
| 2012-06-10 13:00:00 | 16.9 |
| 2012-06-10 14:00:00 | 16.64 |
| 2012-06-10 15:00:00 | 16.38 |
| 2012-06-10 16:00:00 | 16.38 |
| 2012-06-10 17:00:00 | 16.64 |
| 2012-06-10 18:00:00 | 16.38 |
| 2012-06-10 19:00:00 | 16.64 |
| 2012-06-10 20:00:00 | 16.9 |
| 2012-06-10 21:00:00 | 16.64 |
| 2012-06-10 22:00:00 | 16.38 |
| 2012-06-10 23:00:00 | 16.64 |
| 2012-06-11 | 16.38 |
| 2012-06-11 01:00:00 | 16.38 |
| 2012-06-11 02:00:00 | 16.38 |
| 2012-06-11 03:00:00 | 16.38 |
| 2012-06-11 04:00:00 | 16.38 |
| 2012-06-11 05:00:00 | 17.42 |
| 2012-06-11 06:00:00 | 22.62 |
| 2012-06-11 07:00:00 | 32.5 |
| 2012-06-11 08:00:00 | 52.78 |
| 2012-06-11 09:00:00 | 52 |
| 2012-06-11 10:00:00 | 50.44 |
| 2012-06-11 11:00:00 | 50.7 |
| 2012-06-11 12:00:00 | 50.7 |
| 2012-06-11 13:00:00 | 51.22 |
| 2012-06-11 14:00:00 | 52 |
| 2012-06-11 15:00:00 | 45.76 |
| 2012-06-11 16:00:00 | 38.74 |
| 2012-06-11 17:00:00 | 32.24 |
| 2012-06-11 18:00:00 | 27.04 |
| 2012-06-11 19:00:00 | 27.04 |
| 2012-06-11 20:00:00 | 26.78 |
| 2012-06-11 21:00:00 | 30.94 |
| 2012-06-11 22:00:00 | 23.4 |
| 2012-06-11 23:00:00 | 17.94 |
| 2012-06-12 | 16.64 |
| 2012-06-12 01:00:00 | 16.9 |
| 2012-06-12 02:00:00 | 16.64 |
| 2012-06-12 03:00:00 | 16.9 |
| 2012-06-12 04:00:00 | 17.68 |
| 2012-06-12 05:00:00 | 18.72 |
| 2012-06-12 06:00:00 | 21.84 |
| 2012-06-12 07:00:00 | 30.68 |
| 2012-06-12 08:00:00 | 43.42 |
| 2012-06-12 09:00:00 | 47.58 |
| 2012-06-12 10:00:00 | 48.36 |
| 2012-06-12 11:00:00 | 47.06 |
| 2012-06-12 12:00:00 | 44.72 |
| 2012-06-12 13:00:00 | 50.44 |
| 2012-06-12 14:00:00 | 50.96 |
| 2012-06-12 15:00:00 | 47.58 |
| 2012-06-12 16:00:00 | 37.44 |
| 2012-06-12 17:00:00 | 30.68 |
| 2012-06-12 18:00:00 | 26 |
| 2012-06-12 19:00:00 | 25.74 |
| 2012-06-12 20:00:00 | 25.74 |
| 2012-06-12 21:00:00 | 28.08 |
| 2012-06-12 22:00:00 | 22.1 |
| 2012-06-12 23:00:00 | 18.98 |
| 2012-06-13 | 16.64 |
| 2012-06-13 01:00:00 | 16.64 |
| 2012-06-13 02:00:00 | 16.64 |
| 2012-06-13 03:00:00 | 16.64 |
| 2012-06-13 04:00:00 | 16.38 |
| 2012-06-13 05:00:00 | 19.24 |
| 2012-06-13 06:00:00 | 22.62 |
| 2012-06-13 07:00:00 | 30.68 |
| 2012-06-13 08:00:00 | 47.32 |
| 2012-06-13 09:00:00 | 49.66 |
| 2012-06-13 10:00:00 | 48.1 |
| 2012-06-13 11:00:00 | 48.62 |
| 2012-06-13 12:00:00 | 48.36 |
| 2012-06-13 13:00:00 | 46.28 |
| 2012-06-13 14:00:00 | 44.2 |
| 2012-06-13 15:00:00 | 42.38 |
| 2012-06-13 16:00:00 | 32.76 |
| 2012-06-13 17:00:00 | 27.3 |
| 2012-06-13 18:00:00 | 25.48 |
| 2012-06-13 19:00:00 | 26 |
| 2012-06-13 20:00:00 | 26 |
| 2012-06-13 21:00:00 | 27.56 |
| 2012-06-13 22:00:00 | 22.36 |
| 2012-06-13 23:00:00 | 19.24 |
| 2012-06-14 | 17.68 |
| 2012-06-14 01:00:00 | 17.68 |
| 2012-06-14 02:00:00 | 17.42 |
| 2012-06-14 03:00:00 | 18.2 |
| 2012-06-14 04:00:00 | 17.42 |
| 2012-06-14 05:00:00 | 18.98 |
| 2012-06-14 06:00:00 | 21.06 |
| 2012-06-14 07:00:00 | 30.68 |
| 2012-06-14 08:00:00 | 47.58 |
| 2012-06-14 09:00:00 | 51.22 |
| 2012-06-14 10:00:00 | 50.18 |
| 2012-06-14 11:00:00 | 48.36 |
| 2012-06-14 12:00:00 | 46.28 |
| 2012-06-14 13:00:00 | 44.46 |
| 2012-06-14 14:00:00 | 46.8 |
| 2012-06-14 15:00:00 | 45.76 |
| 2012-06-14 16:00:00 | 38.74 |
| 2012-06-14 17:00:00 | 30.94 |
| 2012-06-14 18:00:00 | 24.96 |
| 2012-06-14 19:00:00 | 26.52 |
| 2012-06-14 20:00:00 | 28.86 |
| 2012-06-14 21:00:00 | 31.98 |
| 2012-06-14 22:00:00 | 21.58 |
| 2012-06-14 23:00:00 | 18.46 |
| 2012-06-15 | 16.12 |
| 2012-06-15 01:00:00 | 16.12 |
| 2012-06-15 02:00:00 | 16.12 |
| 2012-06-15 03:00:00 | 16.38 |
| 2012-06-15 04:00:00 | 16.12 |
| 2012-06-15 05:00:00 | 19.24 |
| 2012-06-15 06:00:00 | 21.84 |
| 2012-06-15 07:00:00 | 28.86 |
| 2012-06-15 08:00:00 | 42.38 |
| 2012-06-15 09:00:00 | 43.42 |
| 2012-06-15 10:00:00 | 43.42 |
| 2012-06-15 11:00:00 | 42.9 |
| 2012-06-15 12:00:00 | 44.98 |
| 2012-06-15 13:00:00 | 44.98 |
| 2012-06-15 14:00:00 | 43.94 |
| 2012-06-15 15:00:00 | 39.26 |
| 2012-06-15 16:00:00 | 32.76 |
| 2012-06-15 17:00:00 | 28.34 |
| 2012-06-15 18:00:00 | 27.56 |
| 2012-06-15 19:00:00 | 26.78 |
| 2012-06-15 20:00:00 | 27.04 |
| 2012-06-15 21:00:00 | 25.74 |
| 2012-06-15 22:00:00 | 22.36 |
| 2012-06-15 23:00:00 | 19.24 |
| 2012-06-16 | 17.68 |
| 2012-06-16 01:00:00 | 17.68 |
| 2012-06-16 02:00:00 | 17.68 |
| 2012-06-16 03:00:00 | 17.68 |
| 2012-06-16 04:00:00 | 17.68 |
| 2012-06-16 05:00:00 | 17.68 |
| 2012-06-16 06:00:00 | 17.42 |
| 2012-06-16 07:00:00 | 17.42 |
| 2012-06-16 08:00:00 | 17.68 |
| 2012-06-16 09:00:00 | 17.68 |
| 2012-06-16 10:00:00 | 17.68 |
| 2012-06-16 11:00:00 | 18.2 |
| 2012-06-16 12:00:00 | 18.98 |
| 2012-06-16 13:00:00 | 19.76 |
| 2012-06-16 14:00:00 | 18.2 |
| 2012-06-16 15:00:00 | 20.8 |
| 2012-06-16 16:00:00 | 21.84 |
| 2012-06-16 17:00:00 | 21.84 |
| 2012-06-16 18:00:00 | 21.32 |
| 2012-06-16 19:00:00 | 21.32 |
| 2012-06-16 20:00:00 | 19.24 |
| 2012-06-16 21:00:00 | 18.98 |
| 2012-06-16 22:00:00 | 18.72 |
| 2012-06-16 23:00:00 | 18.46 |
| 2012-06-17 | 18.46 |
| 2012-06-17 01:00:00 | 18.2 |
| 2012-06-17 02:00:00 | 17.94 |
| 2012-06-17 03:00:00 | 17.94 |
| 2012-06-17 04:00:00 | 17.94 |
| 2012-06-17 05:00:00 | 18.2 |
| 2012-06-17 06:00:00 | 17.68 |
| 2012-06-17 07:00:00 | 18.2 |
| 2012-06-17 08:00:00 | 20.28 |
| 2012-06-17 09:00:00 | 19.5 |
| 2012-06-17 10:00:00 | 20.02 |
| 2012-06-17 11:00:00 | 20.28 |
| 2012-06-17 12:00:00 | 21.06 |
| 2012-06-17 13:00:00 | 20.28 |
| 2012-06-17 14:00:00 | 21.32 |
| 2012-06-17 15:00:00 | 22.62 |
| 2012-06-17 16:00:00 | 23.4 |
| 2012-06-17 17:00:00 | 21.58 |
| 2012-06-17 18:00:00 | 22.62 |
| 2012-06-17 19:00:00 | 20.54 |
| 2012-06-17 20:00:00 | 22.36 |
| 2012-06-17 21:00:00 | 21.06 |
| 2012-06-17 22:00:00 | 21.32 |
| 2012-06-17 23:00:00 | 20.8 |
| 2012-06-18 | 19.76 |
| 2012-06-18 01:00:00 | 20.28 |
| 2012-06-18 02:00:00 | 19.5 |
| 2012-06-18 03:00:00 | 19.76 |
| 2012-06-18 04:00:00 | 19.24 |
| 2012-06-18 05:00:00 | 22.1 |
| 2012-06-18 06:00:00 | 21.84 |
| 2012-06-18 07:00:00 | 31.2 |
| 2012-06-18 08:00:00 | 51.22 |
| 2012-06-18 09:00:00 | 51.22 |
| 2012-06-18 10:00:00 | 52.52 |
| 2012-06-18 11:00:00 | 55.64 |
| 2012-06-18 12:00:00 | 56.42 |
| 2012-06-18 13:00:00 | 61.88 |
| 2012-06-18 14:00:00 | 62.14 |
| 2012-06-18 15:00:00 | 63.44 |
| 2012-06-18 16:00:00 | 54.6 |
| 2012-06-18 17:00:00 | 45.76 |
| 2012-06-18 18:00:00 | 35.1 |
| 2012-06-18 19:00:00 | 33.02 |
| 2012-06-18 20:00:00 | 32.5 |
| 2012-06-18 21:00:00 | 30.68 |
| 2012-06-18 22:00:00 | 26.26 |
| 2012-06-18 23:00:00 | 20.8 |
| 2012-06-19 | 19.24 |
| 2012-06-19 01:00:00 | 20.8 |
| 2012-06-19 02:00:00 | 18.98 |
| 2012-06-19 03:00:00 | 18.98 |
| 2012-06-19 04:00:00 | 20.54 |
| 2012-06-19 05:00:00 | 21.06 |
| 2012-06-19 06:00:00 | 22.1 |
| 2012-06-19 07:00:00 | 31.72 |
| 2012-06-19 08:00:00 | 51.48 |
| 2012-06-19 09:00:00 | 57.72 |
| 2012-06-19 10:00:00 | 57.72 |
| 2012-06-19 11:00:00 | 55.9 |
| 2012-06-19 12:00:00 | 57.2 |
| 2012-06-19 13:00:00 | 59.54 |
| 2012-06-19 14:00:00 | 58.76 |
| 2012-06-19 15:00:00 | 54.08 |
| 2012-06-19 16:00:00 | 45.24 |
| 2012-06-19 17:00:00 | 35.62 |
| 2012-06-19 18:00:00 | 34.06 |
| 2012-06-19 19:00:00 | 30.16 |
| 2012-06-19 20:00:00 | 28.34 |
| 2012-06-19 21:00:00 | 31.98 |
| 2012-06-19 22:00:00 | 25.48 |
| 2012-06-19 23:00:00 | 22.88 |
| 2012-06-20 | 19.5 |
| 2012-06-20 01:00:00 | 19.5 |
| 2012-06-20 02:00:00 | 19.5 |
| 2012-06-20 03:00:00 | 19.24 |
| 2012-06-20 04:00:00 | 19.24 |
| 2012-06-20 05:00:00 | 20.54 |
| 2012-06-20 06:00:00 | 22.1 |
| 2012-06-20 07:00:00 | 32.76 |
| 2012-06-20 08:00:00 | 53.82 |
| 2012-06-20 09:00:00 | 55.9 |
| 2012-06-20 10:00:00 | 59.28 |
| 2012-06-20 11:00:00 | 58.5 |
| 2012-06-20 12:00:00 | 63.96 |
| 2012-06-20 13:00:00 | 65.26 |
| 2012-06-20 14:00:00 | 63.7 |
| 2012-06-20 15:00:00 | 62.14 |
| 2012-06-20 16:00:00 | 49.66 |
| 2012-06-20 17:00:00 | 41.6 |
| 2012-06-20 18:00:00 | 34.58 |
| 2012-06-20 19:00:00 | 32.24 |
| 2012-06-20 20:00:00 | 28.86 |
| 2012-06-20 21:00:00 | 32.76 |
| 2012-06-20 22:00:00 | 24.44 |
| 2012-06-20 23:00:00 | 21.06 |
| 2012-06-21 | 19.5 |
| 2012-06-21 01:00:00 | 18.46 |
| 2012-06-21 02:00:00 | 19.76 |
| 2012-06-21 03:00:00 | 18.2 |
| 2012-06-21 04:00:00 | 20.02 |
| 2012-06-21 05:00:00 | 20.8 |
| 2012-06-21 06:00:00 | 23.4 |
| 2012-06-21 07:00:00 | 34.06 |
| 2012-06-21 08:00:00 | 56.68 |
| 2012-06-21 09:00:00 | 57.2 |
| 2012-06-21 10:00:00 | 58.76 |
| 2012-06-21 11:00:00 | 59.8 |
| 2012-06-21 12:00:00 | 63.18 |
| 2012-06-21 13:00:00 | 63.7 |
| 2012-06-21 14:00:00 | 60.58 |
| 2012-06-21 15:00:00 | 60.58 |
| 2012-06-21 16:00:00 | 55.64 |
| 2012-06-21 17:00:00 | 42.12 |
| 2012-06-21 18:00:00 | 36.66 |
| 2012-06-21 19:00:00 | 34.58 |
| 2012-06-21 20:00:00 | 31.98 |
| 2012-06-21 21:00:00 | 32.24 |
| 2012-06-21 22:00:00 | 26.52 |
| 2012-06-21 23:00:00 | 24.44 |
| 2012-06-22 | 20.54 |
| 2012-06-22 01:00:00 | 19.76 |
| 2012-06-22 02:00:00 | 19.76 |
| 2012-06-22 03:00:00 | 20.02 |
| 2012-06-22 04:00:00 | 20.02 |
| 2012-06-22 05:00:00 | 23.14 |
| 2012-06-22 06:00:00 | 26 |
| 2012-06-22 07:00:00 | 35.1 |
| 2012-06-22 08:00:00 | 53.3 |
| 2012-06-22 09:00:00 | 56.42 |
| 2012-06-22 10:00:00 | 52.52 |
| 2012-06-22 11:00:00 | 52.78 |
| 2012-06-22 12:00:00 | 50.18 |
| 2012-06-22 13:00:00 | 53.56 |
| 2012-06-22 14:00:00 | 51.48 |
| 2012-06-22 15:00:00 | 44.46 |
| 2012-06-22 16:00:00 | 31.46 |
| 2012-06-22 17:00:00 | 26.78 |
| 2012-06-22 18:00:00 | 24.44 |
| 2012-06-22 19:00:00 | 25.74 |
| 2012-06-22 20:00:00 | 23.92 |
| 2012-06-22 21:00:00 | 25.48 |
| 2012-06-22 22:00:00 | 21.84 |
| 2012-06-22 23:00:00 | 18.72 |
| 2012-06-23 | 16.64 |
| 2012-06-23 01:00:00 | 17.68 |
| 2012-06-23 02:00:00 | 16.12 |
| 2012-06-23 03:00:00 | 16.64 |
| 2012-06-23 04:00:00 | 16.9 |
| 2012-06-23 05:00:00 | 16.64 |
| 2012-06-23 06:00:00 | 16.12 |
| 2012-06-23 07:00:00 | 17.16 |
| 2012-06-23 08:00:00 | 16.38 |
| 2012-06-23 09:00:00 | 16.38 |
| 2012-06-23 10:00:00 | 16.38 |
| 2012-06-23 11:00:00 | 16.9 |
| 2012-06-23 12:00:00 | 16.64 |
| 2012-06-23 13:00:00 | 17.68 |
| 2012-06-23 14:00:00 | 16.9 |
| 2012-06-23 15:00:00 | 16.64 |
| 2012-06-23 16:00:00 | 17.16 |
| 2012-06-23 17:00:00 | 16.9 |
| 2012-06-23 18:00:00 | 16.12 |
| 2012-06-23 19:00:00 | 17.42 |
| 2012-06-23 20:00:00 | 16.12 |
| 2012-06-23 21:00:00 | 16.64 |
| 2012-06-23 22:00:00 | 17.16 |
| 2012-06-23 23:00:00 | 16.12 |
| 2012-06-24 | 16.12 |
| 2012-06-24 01:00:00 | 15.86 |
| 2012-06-24 02:00:00 | 16.12 |
| 2012-06-24 03:00:00 | 15.86 |
| 2012-06-24 04:00:00 | 15.86 |
| 2012-06-24 05:00:00 | 15.86 |
| 2012-06-24 06:00:00 | 16.12 |
| 2012-06-24 07:00:00 | 16.38 |
| 2012-06-24 08:00:00 | 15.86 |
| 2012-06-24 09:00:00 | 17.16 |
| 2012-06-24 10:00:00 | 16.9 |
| 2012-06-24 11:00:00 | 17.68 |
| 2012-06-24 12:00:00 | 16.64 |
| 2012-06-24 13:00:00 | 16.64 |
| 2012-06-24 14:00:00 | 17.94 |
| 2012-06-24 15:00:00 | 17.94 |
| 2012-06-24 16:00:00 | 17.16 |
| 2012-06-24 17:00:00 | 18.2 |
| 2012-06-24 18:00:00 | 17.68 |
| 2012-06-24 19:00:00 | 16.64 |
| 2012-06-24 20:00:00 | 16.9 |
| 2012-06-24 21:00:00 | 16.9 |
| 2012-06-24 22:00:00 | 16.9 |
| 2012-06-24 23:00:00 | 16.64 |
| 2012-06-25 | 17.42 |
| 2012-06-25 01:00:00 | 16.9 |
| 2012-06-25 02:00:00 | 16.64 |
| 2012-06-25 03:00:00 | 16.9 |
| 2012-06-25 04:00:00 | 17.68 |
| 2012-06-25 05:00:00 | 17.94 |
| 2012-06-25 06:00:00 | 18.2 |
| 2012-06-25 07:00:00 | 19.5 |
| 2012-06-25 08:00:00 | 10.66 |
| 2012-06-25 09:00:00 | 0 |
| 2012-06-25 10:00:00 | 0 |
| 2012-06-25 11:00:00 | 0 |
| 2012-06-25 12:00:00 | 0 |
| 2012-06-25 13:00:00 | 5.72 |
| 2012-06-25 14:00:00 | 21.58 |
| 2012-06-25 15:00:00 | 20.28 |
| 2012-06-25 16:00:00 | 19.24 |
| 2012-06-25 17:00:00 | 18.98 |
| 2012-06-25 18:00:00 | 18.72 |
| 2012-06-25 19:00:00 | 17.42 |
| 2012-06-25 20:00:00 | 17.42 |
| 2012-06-25 21:00:00 | 16.64 |
| 2012-06-25 22:00:00 | 15.86 |
| 2012-06-25 23:00:00 | 15.34 |
| 2012-06-26 | 15.34 |
| 2012-06-26 01:00:00 | 15.34 |
| 2012-06-26 02:00:00 | 15.34 |
| 2012-06-26 03:00:00 | 15.08 |
| 2012-06-26 04:00:00 | 15.34 |
| 2012-06-26 05:00:00 | 17.42 |
| 2012-06-26 06:00:00 | 21.84 |
| 2012-06-26 07:00:00 | 31.98 |
| 2012-06-26 08:00:00 | 49.14 |
| 2012-06-26 09:00:00 | 48.1 |
| 2012-06-26 10:00:00 | 47.06 |
| 2012-06-26 11:00:00 | 45.5 |
| 2012-06-26 12:00:00 | 44.98 |
| 2012-06-26 13:00:00 | 45.76 |
| 2012-06-26 14:00:00 | 48.36 |
| 2012-06-26 15:00:00 | 44.98 |
| 2012-06-26 16:00:00 | 37.96 |
| 2012-06-26 17:00:00 | 30.94 |
| 2012-06-26 18:00:00 | 26.78 |
| 2012-06-26 19:00:00 | 27.82 |
| 2012-06-26 20:00:00 | 26.78 |
| 2012-06-26 21:00:00 | 28.86 |
| 2012-06-26 22:00:00 | 23.66 |
| 2012-06-26 23:00:00 | 18.98 |
| 2012-06-27 | 16.9 |
| 2012-06-27 01:00:00 | 17.42 |
| 2012-06-27 02:00:00 | 16.9 |
| 2012-06-27 03:00:00 | 17.16 |
| 2012-06-27 04:00:00 | 16.64 |
| 2012-06-27 05:00:00 | 18.46 |
| 2012-06-27 06:00:00 | 20.54 |
| 2012-06-27 07:00:00 | 30.68 |
| 2012-06-27 08:00:00 | 44.46 |
| 2012-06-27 09:00:00 | 45.76 |
| 2012-06-27 10:00:00 | 43.16 |
| 2012-06-27 11:00:00 | 43.94 |
| 2012-06-27 12:00:00 | 48.36 |
| 2012-06-27 13:00:00 | 45.5 |
| 2012-06-27 14:00:00 | 43.42 |
| 2012-06-27 15:00:00 | 44.46 |
| 2012-06-27 16:00:00 | 39 |
| 2012-06-27 17:00:00 | 37.96 |
| 2012-06-27 18:00:00 | 30.94 |
| 2012-06-27 19:00:00 | 28.08 |
| 2012-06-27 20:00:00 | 28.6 |
| 2012-06-27 21:00:00 | 29.38 |
| 2012-06-27 22:00:00 | 23.4 |
| 2012-06-27 23:00:00 | 19.24 |
| 2012-06-28 | 17.16 |
| 2012-06-28 01:00:00 | 17.42 |
| 2012-06-28 02:00:00 | 17.16 |
| 2012-06-28 03:00:00 | 17.42 |
| 2012-06-28 04:00:00 | 17.16 |
| 2012-06-28 05:00:00 | 19.5 |
| 2012-06-28 06:00:00 | 24.44 |
| 2012-06-28 07:00:00 | 31.72 |
| 2012-06-28 08:00:00 | 47.58 |
| 2012-06-28 09:00:00 | 50.18 |
| 2012-06-28 10:00:00 | 48.88 |
| 2012-06-28 11:00:00 | 49.4 |
| 2012-06-28 12:00:00 | 50.44 |
| 2012-06-28 13:00:00 | 47.06 |
| 2012-06-28 14:00:00 | 48.36 |
| 2012-06-28 15:00:00 | 46.8 |
| 2012-06-28 16:00:00 | 36.92 |
| 2012-06-28 17:00:00 | 29.9 |
| 2012-06-28 18:00:00 | 29.12 |
| 2012-06-28 19:00:00 | 31.2 |
| 2012-06-28 20:00:00 | 28.6 |
| 2012-06-28 21:00:00 | 27.04 |
| 2012-06-28 22:00:00 | 23.14 |
| 2012-06-28 23:00:00 | 19.24 |
| 2012-06-29 | 18.2 |
| 2012-06-29 01:00:00 | 17.16 |
| 2012-06-29 02:00:00 | 17.68 |
| 2012-06-29 03:00:00 | 17.42 |
| 2012-06-29 04:00:00 | 17.94 |
| 2012-06-29 05:00:00 | 18.72 |
| 2012-06-29 06:00:00 | 22.88 |
| 2012-06-29 07:00:00 | 30.68 |
| 2012-06-29 08:00:00 | 47.06 |
| 2012-06-29 09:00:00 | 48.62 |
| 2012-06-29 10:00:00 | 50.7 |
| 2012-06-29 11:00:00 | 48.88 |
| 2012-06-29 12:00:00 | 49.66 |
| 2012-06-29 13:00:00 | 51.22 |
| 2012-06-29 14:00:00 | 49.14 |
| 2012-06-29 15:00:00 | 42.9 |
| 2012-06-29 16:00:00 | 38.22 |
| 2012-06-29 17:00:00 | 37.96 |
| 2012-06-29 18:00:00 | 32.5 |
| 2012-06-29 19:00:00 | 27.56 |
| 2012-06-29 20:00:00 | 27.04 |
| 2012-06-29 21:00:00 | 28.08 |
| 2012-06-29 22:00:00 | 27.56 |
| 2012-06-29 23:00:00 | 23.14 |
| 2012-06-30 | 18.98 |
| 2012-06-30 01:00:00 | 17.68 |
| 2012-06-30 02:00:00 | 17.94 |
| 2012-06-30 03:00:00 | 17.68 |
| 2012-06-30 04:00:00 | 17.68 |
| 2012-06-30 05:00:00 | 18.72 |
| 2012-06-30 06:00:00 | 18.2 |
| 2012-06-30 07:00:00 | 20.02 |
| 2012-06-30 08:00:00 | 24.7 |
| 2012-06-30 09:00:00 | 25.74 |
| 2012-06-30 10:00:00 | 25.22 |
| 2012-06-30 11:00:00 | 26.26 |
| 2012-06-30 12:00:00 | 25.74 |
| 2012-06-30 13:00:00 | 24.18 |
| 2012-06-30 14:00:00 | 26.52 |
| 2012-06-30 15:00:00 | 26.26 |
| 2012-06-30 16:00:00 | 28.34 |
| 2012-06-30 17:00:00 | 29.12 |
| 2012-06-30 18:00:00 | 26 |
| 2012-06-30 19:00:00 | 27.56 |
| 2012-06-30 20:00:00 | 25.74 |
| 2012-06-30 21:00:00 | 23.14 |
| 2012-06-30 22:00:00 | 22.1 |
| 2012-06-30 23:00:00 | 21.32 |
| 2012-07-01 | 21.58 |
| 2012-07-01 01:00:00 | 20.8 |
| 2012-07-01 02:00:00 | 20.54 |
| 2012-07-01 03:00:00 | 19.76 |
| 2012-07-01 04:00:00 | 20.02 |
| 2012-07-01 05:00:00 | 19.76 |
| 2012-07-01 06:00:00 | 20.54 |
| 2012-07-01 07:00:00 | 28.86 |
| 2012-07-01 08:00:00 | 32.76 |
| 2012-07-01 09:00:00 | 34.32 |
| 2012-07-01 10:00:00 | 34.84 |
| 2012-07-01 11:00:00 | 31.46 |
| 2012-07-01 12:00:00 | 29.64 |
| 2012-07-01 13:00:00 | 32.24 |
| 2012-07-01 14:00:00 | 33.54 |
| 2012-07-01 15:00:00 | 29.12 |
| 2012-07-01 16:00:00 | 28.08 |
| 2012-07-01 17:00:00 | 27.56 |
| 2012-07-01 18:00:00 | 24.96 |
| 2012-07-01 19:00:00 | 20.8 |
| 2012-07-01 20:00:00 | 18.98 |
| 2012-07-01 21:00:00 | 18.46 |
| 2012-07-01 22:00:00 | 17.42 |
| 2012-07-01 23:00:00 | 18.2 |
| 2012-07-02 | 17.94 |
| 2012-07-02 01:00:00 | 18.2 |
| 2012-07-02 02:00:00 | 17.68 |
| 2012-07-02 03:00:00 | 17.16 |
| 2012-07-02 04:00:00 | 17.42 |
| 2012-07-02 05:00:00 | 23.14 |
| 2012-07-02 06:00:00 | 24.44 |
| 2012-07-02 07:00:00 | 34.06 |
| 2012-07-02 08:00:00 | 49.66 |
| 2012-07-02 09:00:00 | 53.82 |
| 2012-07-02 10:00:00 | 53.82 |
| 2012-07-02 11:00:00 | 52.52 |
| 2012-07-02 12:00:00 | 50.7 |
| 2012-07-02 13:00:00 | 59.8 |
| 2012-07-02 14:00:00 | 59.54 |
| 2012-07-02 15:00:00 | 57.2 |
| 2012-07-02 16:00:00 | 47.06 |
| 2012-07-02 17:00:00 | 36.4 |
| 2012-07-02 18:00:00 | 34.06 |
| 2012-07-02 19:00:00 | 31.46 |
| 2012-07-02 20:00:00 | 30.16 |
| 2012-07-02 21:00:00 | 33.02 |
| 2012-07-02 22:00:00 | 27.56 |
| 2012-07-02 23:00:00 | 24.44 |
| 2012-07-03 | 20.8 |
| 2012-07-03 01:00:00 | 21.06 |
| 2012-07-03 02:00:00 | 21.06 |
| 2012-07-03 03:00:00 | 20.28 |
| 2012-07-03 04:00:00 | 19.76 |
| 2012-07-03 05:00:00 | 22.36 |
| 2012-07-03 06:00:00 | 23.92 |
| 2012-07-03 07:00:00 | 33.54 |
| 2012-07-03 08:00:00 | 56.68 |
| 2012-07-03 09:00:00 | 54.6 |
| 2012-07-03 10:00:00 | 56.94 |
| 2012-07-03 11:00:00 | 59.54 |
| 2012-07-03 12:00:00 | 61.88 |
| 2012-07-03 13:00:00 | 67.86 |
| 2012-07-03 14:00:00 | 67.08 |
| 2012-07-03 15:00:00 | 70.46 |
| 2012-07-03 16:00:00 | 49.92 |
| 2012-07-03 17:00:00 | 39 |
| 2012-07-03 18:00:00 | 34.32 |
| 2012-07-03 19:00:00 | 30.42 |
| 2012-07-03 20:00:00 | 31.2 |
| 2012-07-03 21:00:00 | 29.38 |
| 2012-07-03 22:00:00 | 27.04 |
| 2012-07-03 23:00:00 | 23.14 |
| 2012-07-04 | 18.98 |
| 2012-07-04 01:00:00 | 17.94 |
| 2012-07-04 02:00:00 | 18.72 |
| 2012-07-04 03:00:00 | 18.2 |
| 2012-07-04 04:00:00 | 18.46 |
| 2012-07-04 05:00:00 | 21.84 |
| 2012-07-04 06:00:00 | 25.74 |
| 2012-07-04 07:00:00 | 33.54 |
| 2012-07-04 08:00:00 | 50.7 |
| 2012-07-04 09:00:00 | 53.82 |
| 2012-07-04 10:00:00 | 53.56 |
| 2012-07-04 11:00:00 | 51.22 |
| 2012-07-04 12:00:00 | 54.08 |
| 2012-07-04 13:00:00 | 50.18 |
| 2012-07-04 14:00:00 | 50.7 |
| 2012-07-04 15:00:00 | 50.18 |
| 2012-07-04 16:00:00 | 36.92 |
| 2012-07-04 17:00:00 | 30.68 |
| 2012-07-04 18:00:00 | 29.38 |
| 2012-07-04 19:00:00 | 27.82 |
| 2012-07-04 20:00:00 | 27.3 |
| 2012-07-04 21:00:00 | 28.08 |
| 2012-07-04 22:00:00 | 23.4 |
| 2012-07-04 23:00:00 | 20.54 |
| 2012-07-05 | 18.72 |
| 2012-07-05 01:00:00 | 18.72 |
| 2012-07-05 02:00:00 | 18.72 |
| 2012-07-05 03:00:00 | 18.72 |
| 2012-07-05 04:00:00 | 18.46 |
| 2012-07-05 05:00:00 | 18.46 |
| 2012-07-05 06:00:00 | 17.94 |
| 2012-07-05 07:00:00 | 17.94 |
| 2012-07-05 08:00:00 | 17.68 |
| 2012-07-05 09:00:00 | 18.2 |
| 2012-07-05 10:00:00 | 18.72 |
| 2012-07-05 11:00:00 | 18.72 |
| 2012-07-05 12:00:00 | 18.72 |
| 2012-07-05 13:00:00 | 18.98 |
| 2012-07-05 14:00:00 | 19.5 |
| 2012-07-05 15:00:00 | 20.02 |
| 2012-07-05 16:00:00 | 20.02 |
| 2012-07-05 17:00:00 | 19.76 |
| 2012-07-05 18:00:00 | 19.76 |
| 2012-07-05 19:00:00 | 20.54 |
| 2012-07-05 20:00:00 | 20.02 |
| 2012-07-05 21:00:00 | 20.28 |
| 2012-07-05 22:00:00 | 20.28 |
| 2012-07-05 23:00:00 | 20.28 |
| 2012-07-06 | 19.76 |
| 2012-07-06 01:00:00 | 19.5 |
| 2012-07-06 02:00:00 | 19.5 |
| 2012-07-06 03:00:00 | 18.98 |
| 2012-07-06 04:00:00 | 19.24 |
| 2012-07-06 05:00:00 | 19.24 |
| 2012-07-06 06:00:00 | 18.72 |
| 2012-07-06 07:00:00 | 18.72 |
| 2012-07-06 08:00:00 | 18.46 |
| 2012-07-06 09:00:00 | 18.72 |
| 2012-07-06 10:00:00 | 19.24 |
| 2012-07-06 11:00:00 | 19.24 |
| 2012-07-06 12:00:00 | 19.5 |
| 2012-07-06 13:00:00 | 19.5 |
| 2012-07-06 14:00:00 | 19.76 |
| 2012-07-06 15:00:00 | 20.54 |
| 2012-07-06 16:00:00 | 20.28 |
| 2012-07-06 17:00:00 | 20.02 |
| 2012-07-06 18:00:00 | 20.54 |
| 2012-07-06 19:00:00 | 19.5 |
| 2012-07-06 20:00:00 | 19.24 |
| 2012-07-06 21:00:00 | 20.02 |
| 2012-07-06 22:00:00 | 19.76 |
| 2012-07-06 23:00:00 | 19.5 |
| 2012-07-07 | 18.98 |
| 2012-07-07 01:00:00 | 18.98 |
| 2012-07-07 02:00:00 | 18.72 |
| 2012-07-07 03:00:00 | 18.72 |
| 2012-07-07 04:00:00 | 18.72 |
| 2012-07-07 05:00:00 | 18.72 |
| 2012-07-07 06:00:00 | 19.24 |
| 2012-07-07 07:00:00 | 19.5 |
| 2012-07-07 08:00:00 | 19.5 |
| 2012-07-07 09:00:00 | 19.76 |
| 2012-07-07 10:00:00 | 17.68 |
| 2012-07-07 11:00:00 | 17.68 |
| 2012-07-07 12:00:00 | 17.42 |
| 2012-07-07 13:00:00 | 17.68 |
| 2012-07-07 14:00:00 | 17.94 |
| 2012-07-07 15:00:00 | 17.94 |
| 2012-07-07 16:00:00 | 17.42 |
| 2012-07-07 17:00:00 | 17.94 |
| 2012-07-07 18:00:00 | 16.64 |
| 2012-07-07 19:00:00 | 16.9 |
| 2012-07-07 20:00:00 | 16.9 |
| 2012-07-07 21:00:00 | 17.16 |
| 2012-07-07 22:00:00 | 17.16 |
| 2012-07-07 23:00:00 | 17.16 |
| 2012-07-08 | 16.9 |
| 2012-07-08 01:00:00 | 16.9 |
| 2012-07-08 02:00:00 | 16.64 |
| 2012-07-08 03:00:00 | 16.64 |
| 2012-07-08 04:00:00 | 16.64 |
| 2012-07-08 05:00:00 | 16.9 |
| 2012-07-08 06:00:00 | 17.42 |
| 2012-07-08 07:00:00 | 19.24 |
| 2012-07-08 08:00:00 | 19.5 |
| 2012-07-08 09:00:00 | 18.46 |
| 2012-07-08 10:00:00 | 18.2 |
| 2012-07-08 11:00:00 | 18.46 |
| 2012-07-08 12:00:00 | 18.46 |
| 2012-07-08 13:00:00 | 18.72 |
| 2012-07-08 14:00:00 | 18.72 |
| 2012-07-08 15:00:00 | 18.72 |
| 2012-07-08 16:00:00 | 20.28 |
| 2012-07-08 17:00:00 | 21.06 |
| 2012-07-08 18:00:00 | 20.54 |
| 2012-07-08 19:00:00 | 21.32 |
| 2012-07-08 20:00:00 | 20.8 |
| 2012-07-08 21:00:00 | 18.46 |
| 2012-07-08 22:00:00 | 17.68 |
| 2012-07-08 23:00:00 | 17.94 |
| 2012-07-09 | 17.68 |
| 2012-07-09 01:00:00 | 17.68 |
| 2012-07-09 02:00:00 | 17.68 |
| 2012-07-09 03:00:00 | 17.68 |
| 2012-07-09 04:00:00 | 17.68 |
| 2012-07-09 05:00:00 | 20.02 |
| 2012-07-09 06:00:00 | 22.62 |
| 2012-07-09 07:00:00 | 34.06 |
| 2012-07-09 08:00:00 | 58.76 |
| 2012-07-09 09:00:00 | 67.34 |
| 2012-07-09 10:00:00 | 69.68 |
| 2012-07-09 11:00:00 | 67.86 |
| 2012-07-09 12:00:00 | 63.7 |
| 2012-07-09 13:00:00 | 67.08 |
| 2012-07-09 14:00:00 | 68.64 |
| 2012-07-09 15:00:00 | 68.64 |
| 2012-07-09 16:00:00 | 54.08 |
| 2012-07-09 17:00:00 | 41.6 |
| 2012-07-09 18:00:00 | 31.46 |
| 2012-07-09 19:00:00 | 30.16 |
| 2012-07-09 20:00:00 | 31.46 |
| 2012-07-09 21:00:00 | 32.5 |
| 2012-07-09 22:00:00 | 26.26 |
| 2012-07-09 23:00:00 | 25.22 |
| 2012-07-10 | 21.58 |
| 2012-07-10 01:00:00 | 19.76 |
| 2012-07-10 02:00:00 | 18.98 |
| 2012-07-10 03:00:00 | 19.24 |
| 2012-07-10 04:00:00 | 18.72 |
| 2012-07-10 05:00:00 | 19.76 |
| 2012-07-10 06:00:00 | 21.58 |
| 2012-07-10 07:00:00 | 34.58 |
| 2012-07-10 08:00:00 | 53.82 |
| 2012-07-10 09:00:00 | 58.5 |
| 2012-07-10 10:00:00 | 61.1 |
| 2012-07-10 11:00:00 | 61.62 |
| 2012-07-10 12:00:00 | 63.96 |
| 2012-07-10 13:00:00 | 62.66 |
| 2012-07-10 14:00:00 | 68.38 |
| 2012-07-10 15:00:00 | 63.96 |
| 2012-07-10 16:00:00 | 48.62 |
| 2012-07-10 17:00:00 | 46.02 |
| 2012-07-10 18:00:00 | 32.5 |
| 2012-07-10 19:00:00 | 30.16 |
| 2012-07-10 20:00:00 | 31.2 |
| 2012-07-10 21:00:00 | 31.72 |
| 2012-07-10 22:00:00 | 26 |
| 2012-07-10 23:00:00 | 24.18 |
| 2012-07-11 | 21.58 |
| 2012-07-11 01:00:00 | 21.32 |
| 2012-07-11 02:00:00 | 19.24 |
| 2012-07-11 03:00:00 | 18.72 |
| 2012-07-11 04:00:00 | 18.72 |
| 2012-07-11 05:00:00 | 23.4 |
| 2012-07-11 06:00:00 | 24.96 |
| 2012-07-11 07:00:00 | 33.02 |
| 2012-07-11 08:00:00 | 52.78 |
| 2012-07-11 09:00:00 | 60.58 |
| 2012-07-11 10:00:00 | 60.84 |
| 2012-07-11 11:00:00 | 61.1 |
| 2012-07-11 12:00:00 | 64.22 |
| 2012-07-11 13:00:00 | 67.86 |
| 2012-07-11 14:00:00 | 67.86 |
| 2012-07-11 15:00:00 | 59.54 |
| 2012-07-11 16:00:00 | 37.96 |
| 2012-07-11 17:00:00 | 30.68 |
| 2012-07-11 18:00:00 | 30.68 |
| 2012-07-11 19:00:00 | 28.6 |
| 2012-07-11 20:00:00 | 28.86 |
| 2012-07-11 21:00:00 | 29.12 |
| 2012-07-11 22:00:00 | 24.18 |
| 2012-07-11 23:00:00 | 20.54 |
| 2012-07-12 | 19.5 |
| 2012-07-12 01:00:00 | 19.5 |
| 2012-07-12 02:00:00 | 18.46 |
| 2012-07-12 03:00:00 | 18.46 |
| 2012-07-12 04:00:00 | 19.24 |
| 2012-07-12 05:00:00 | 20.02 |
| 2012-07-12 06:00:00 | 23.66 |
| 2012-07-12 07:00:00 | 31.2 |
| 2012-07-12 08:00:00 | 50.96 |
| 2012-07-12 09:00:00 | 52.78 |
| 2012-07-12 10:00:00 | 50.96 |
| 2012-07-12 11:00:00 | 49.66 |
| 2012-07-12 12:00:00 | 48.88 |
| 2012-07-12 13:00:00 | 50.96 |
| 2012-07-12 14:00:00 | 50.44 |
| 2012-07-12 15:00:00 | 50.7 |
| 2012-07-12 16:00:00 | 40.82 |
| 2012-07-12 17:00:00 | 35.36 |
| 2012-07-12 18:00:00 | 30.68 |
| 2012-07-12 19:00:00 | 29.38 |
| 2012-07-12 20:00:00 | 30.16 |
| 2012-07-12 21:00:00 | 32.24 |
| 2012-07-12 22:00:00 | 26.26 |
| 2012-07-12 23:00:00 | 22.1 |
| 2012-07-13 | 18.72 |
| 2012-07-13 01:00:00 | 17.94 |
| 2012-07-13 02:00:00 | 17.42 |
| 2012-07-13 03:00:00 | 18.2 |
| 2012-07-13 04:00:00 | 16.9 |
| 2012-07-13 05:00:00 | 18.2 |
| 2012-07-13 06:00:00 | 22.88 |
| 2012-07-13 07:00:00 | 28.08 |
| 2012-07-13 08:00:00 | 41.6 |
| 2012-07-13 09:00:00 | 43.94 |
| 2012-07-13 10:00:00 | 45.76 |
| 2012-07-13 11:00:00 | 43.68 |
| 2012-07-13 12:00:00 | 43.68 |
| 2012-07-13 13:00:00 | 43.68 |
| 2012-07-13 14:00:00 | 41.08 |
| 2012-07-13 15:00:00 | 34.84 |
| 2012-07-13 16:00:00 | 30.16 |
| 2012-07-13 17:00:00 | 26.78 |
| 2012-07-13 18:00:00 | 26 |
| 2012-07-13 19:00:00 | 26.78 |
| 2012-07-13 20:00:00 | 28.6 |
| 2012-07-13 21:00:00 | 27.82 |
| 2012-07-13 22:00:00 | 22.88 |
| 2012-07-13 23:00:00 | 17.94 |
| 2012-07-14 | 16.64 |
| 2012-07-14 01:00:00 | 16.9 |
| 2012-07-14 02:00:00 | 16.38 |
| 2012-07-14 03:00:00 | 16.38 |
| 2012-07-14 04:00:00 | 16.38 |
| 2012-07-14 05:00:00 | 16.64 |
| 2012-07-14 06:00:00 | 16.64 |
| 2012-07-14 07:00:00 | 16.12 |
| 2012-07-14 08:00:00 | 16.12 |
| 2012-07-14 09:00:00 | 16.38 |
| 2012-07-14 10:00:00 | 16.12 |
| 2012-07-14 11:00:00 | 16.9 |
| 2012-07-14 12:00:00 | 16.9 |
| 2012-07-14 13:00:00 | 16.9 |
| 2012-07-14 14:00:00 | 17.68 |
| 2012-07-14 15:00:00 | 18.46 |
| 2012-07-14 16:00:00 | 18.2 |
| 2012-07-14 17:00:00 | 17.68 |
| 2012-07-14 18:00:00 | 17.42 |
| 2012-07-14 19:00:00 | 17.94 |
| 2012-07-14 20:00:00 | 17.68 |
| 2012-07-14 21:00:00 | 17.42 |
| 2012-07-14 22:00:00 | 17.16 |
| 2012-07-14 23:00:00 | 16.9 |
| 2012-07-15 | 16.9 |
| 2012-07-15 01:00:00 | 16.9 |
| 2012-07-15 02:00:00 | 16.9 |
| 2012-07-15 03:00:00 | 17.16 |
| 2012-07-15 04:00:00 | 16.9 |
| 2012-07-15 05:00:00 | 17.16 |
| 2012-07-15 06:00:00 | 16.38 |
| 2012-07-15 07:00:00 | 16.38 |
| 2012-07-15 08:00:00 | 16.38 |
| 2012-07-15 09:00:00 | 16.38 |
| 2012-07-15 10:00:00 | 16.38 |
| 2012-07-15 11:00:00 | 16.38 |
| 2012-07-15 12:00:00 | 16.38 |
| 2012-07-15 13:00:00 | 16.64 |
| 2012-07-15 14:00:00 | 16.38 |
| 2012-07-15 15:00:00 | 16.64 |
| 2012-07-15 16:00:00 | 16.64 |
| 2012-07-15 17:00:00 | 16.9 |
| 2012-07-15 18:00:00 | 16.12 |
| 2012-07-15 19:00:00 | 16.64 |
| 2012-07-15 20:00:00 | 16.64 |
| 2012-07-15 21:00:00 | 16.9 |
| 2012-07-15 22:00:00 | 16.38 |
| 2012-07-15 23:00:00 | 16.38 |
| 2012-07-16 | 16.38 |
| 2012-07-16 01:00:00 | 16.38 |
| 2012-07-16 02:00:00 | 16.38 |
| 2012-07-16 03:00:00 | 16.38 |
| 2012-07-16 04:00:00 | 17.16 |
| 2012-07-16 05:00:00 | 17.68 |
| 2012-07-16 06:00:00 | 19.24 |
| 2012-07-16 07:00:00 | 27.82 |
| 2012-07-16 08:00:00 | 48.36 |
| 2012-07-16 09:00:00 | 53.3 |
| 2012-07-16 10:00:00 | 50.18 |
| 2012-07-16 11:00:00 | 47.84 |
| 2012-07-16 12:00:00 | 45.76 |
| 2012-07-16 13:00:00 | 43.68 |
| 2012-07-16 14:00:00 | 43.16 |
| 2012-07-16 15:00:00 | 42.38 |
| 2012-07-16 16:00:00 | 34.84 |
| 2012-07-16 17:00:00 | 28.6 |
| 2012-07-16 18:00:00 | 25.74 |
| 2012-07-16 19:00:00 | 25.48 |
| 2012-07-16 20:00:00 | 24.44 |
| 2012-07-16 21:00:00 | 26.26 |
| 2012-07-16 22:00:00 | 19.5 |
| 2012-07-16 23:00:00 | 18.72 |
| 2012-07-17 | 18.72 |
| 2012-07-17 01:00:00 | 18.98 |
| 2012-07-17 02:00:00 | 18.72 |
| 2012-07-17 03:00:00 | 18.46 |
| 2012-07-17 04:00:00 | 18.46 |
| 2012-07-17 05:00:00 | 20.02 |
| 2012-07-17 06:00:00 | 21.06 |
| 2012-07-17 07:00:00 | 28.6 |
| 2012-07-17 08:00:00 | 47.84 |
| 2012-07-17 09:00:00 | 50.96 |
| 2012-07-17 10:00:00 | 50.7 |
| 2012-07-17 11:00:00 | 49.92 |
| 2012-07-17 12:00:00 | 46.28 |
| 2012-07-17 13:00:00 | 44.2 |
| 2012-07-17 14:00:00 | 46.28 |
| 2012-07-17 15:00:00 | 42.9 |
| 2012-07-17 16:00:00 | 35.36 |
| 2012-07-17 17:00:00 | 29.12 |
| 2012-07-17 18:00:00 | 27.04 |
| 2012-07-17 19:00:00 | 26.78 |
| 2012-07-17 20:00:00 | 26.52 |
| 2012-07-17 21:00:00 | 26 |
| 2012-07-17 22:00:00 | 20.02 |
| 2012-07-17 23:00:00 | 16.38 |
| 2012-07-18 | 16.64 |
| 2012-07-18 01:00:00 | 16.64 |
| 2012-07-18 02:00:00 | 16.64 |
| 2012-07-18 03:00:00 | 16.64 |
| 2012-07-18 04:00:00 | 17.42 |
| 2012-07-18 05:00:00 | 17.94 |
| 2012-07-18 06:00:00 | 20.54 |
| 2012-07-18 07:00:00 | 27.04 |
| 2012-07-18 08:00:00 | 41.6 |
| 2012-07-18 09:00:00 | 42.9 |
| 2012-07-18 10:00:00 | 41.6 |
| 2012-07-18 11:00:00 | 42.64 |
| 2012-07-18 12:00:00 | 43.68 |
| 2012-07-18 13:00:00 | 44.2 |
| 2012-07-18 14:00:00 | 48.62 |
| 2012-07-18 15:00:00 | 43.68 |
| 2012-07-18 16:00:00 | 36.14 |
| 2012-07-18 17:00:00 | 29.12 |
| 2012-07-18 18:00:00 | 26 |
| 2012-07-18 19:00:00 | 25.74 |
| 2012-07-18 20:00:00 | 26 |
| 2012-07-18 21:00:00 | 27.04 |
| 2012-07-18 22:00:00 | 23.66 |
| 2012-07-18 23:00:00 | 18.98 |
| 2012-07-19 | 18.46 |
| 2012-07-19 01:00:00 | 18.72 |
| 2012-07-19 02:00:00 | 18.46 |
| 2012-07-19 03:00:00 | 18.46 |
| 2012-07-19 04:00:00 | 18.46 |
| 2012-07-19 05:00:00 | 20.28 |
| 2012-07-19 06:00:00 | 21.06 |
| 2012-07-19 07:00:00 | 30.16 |
| 2012-07-19 08:00:00 | 46.54 |
| 2012-07-19 09:00:00 | 49.92 |
| 2012-07-19 10:00:00 | 46.02 |
| 2012-07-19 11:00:00 | 46.8 |
| 2012-07-19 12:00:00 | 48.62 |
| 2012-07-19 13:00:00 | 52.26 |
| 2012-07-19 14:00:00 | 54.34 |
| 2012-07-19 15:00:00 | 50.18 |
| 2012-07-19 16:00:00 | 35.36 |
| 2012-07-19 17:00:00 | 29.12 |
| 2012-07-19 18:00:00 | 26.78 |
| 2012-07-19 19:00:00 | 26.52 |
| 2012-07-19 20:00:00 | 26.78 |
| 2012-07-19 21:00:00 | 23.92 |
| 2012-07-19 22:00:00 | 18.98 |
| 2012-07-19 23:00:00 | 17.42 |
| 2012-07-20 | 17.16 |
| 2012-07-20 01:00:00 | 17.68 |
| 2012-07-20 02:00:00 | 17.42 |
| 2012-07-20 03:00:00 | 17.42 |
| 2012-07-20 04:00:00 | 18.46 |
| 2012-07-20 05:00:00 | 18.72 |
| 2012-07-20 06:00:00 | 20.8 |
| 2012-07-20 07:00:00 | 29.38 |
| 2012-07-20 08:00:00 | 44.46 |
| 2012-07-20 09:00:00 | 48.62 |
| 2012-07-20 10:00:00 | 47.84 |
| 2012-07-20 11:00:00 | 47.32 |
| 2012-07-20 12:00:00 | 49.4 |
| 2012-07-20 13:00:00 | 49.66 |
| 2012-07-20 14:00:00 | 46.28 |
| 2012-07-20 15:00:00 | 39.52 |
| 2012-07-20 16:00:00 | 29.38 |
| 2012-07-20 17:00:00 | 24.96 |
| 2012-07-20 18:00:00 | 23.14 |
| 2012-07-20 19:00:00 | 23.92 |
| 2012-07-20 20:00:00 | 23.92 |
| 2012-07-20 21:00:00 | 20.8 |
| 2012-07-20 22:00:00 | 18.46 |
| 2012-07-20 23:00:00 | 17.42 |
| 2012-07-21 | 16.9 |
| 2012-07-21 01:00:00 | 17.16 |
| 2012-07-21 02:00:00 | 16.9 |
| 2012-07-21 03:00:00 | 16.9 |
| 2012-07-21 04:00:00 | 17.16 |
| 2012-07-21 05:00:00 | 18.2 |
| 2012-07-21 06:00:00 | 18.72 |
| 2012-07-21 07:00:00 | 16.9 |
| 2012-07-21 08:00:00 | 16.9 |
| 2012-07-21 09:00:00 | 17.42 |
| 2012-07-21 10:00:00 | 16.64 |
| 2012-07-21 11:00:00 | 16.9 |
| 2012-07-21 12:00:00 | 16.9 |
| 2012-07-21 13:00:00 | 16.9 |
| 2012-07-21 14:00:00 | 16.9 |
| 2012-07-21 15:00:00 | 16.9 |
| 2012-07-21 16:00:00 | 16.64 |
| 2012-07-21 17:00:00 | 16.9 |
| 2012-07-21 18:00:00 | 16.38 |
| 2012-07-21 19:00:00 | 16.64 |
| 2012-07-21 20:00:00 | 16.38 |
| 2012-07-21 21:00:00 | 16.9 |
| 2012-07-21 22:00:00 | 16.9 |
| 2012-07-21 23:00:00 | 17.16 |
| 2012-07-22 | 16.64 |
| 2012-07-22 01:00:00 | 16.64 |
| 2012-07-22 02:00:00 | 16.38 |
| 2012-07-22 03:00:00 | 16.64 |
| 2012-07-22 04:00:00 | 16.38 |
| 2012-07-22 05:00:00 | 16.38 |
| 2012-07-22 06:00:00 | 16.9 |
| 2012-07-22 07:00:00 | 17.16 |
| 2012-07-22 08:00:00 | 17.94 |
| 2012-07-22 09:00:00 | 17.16 |
| 2012-07-22 10:00:00 | 16.64 |
| 2012-07-22 11:00:00 | 16.9 |
| 2012-07-22 12:00:00 | 16.38 |
| 2012-07-22 13:00:00 | 15.6 |
| 2012-07-22 14:00:00 | 16.38 |
| 2012-07-22 15:00:00 | 15.86 |
| 2012-07-22 16:00:00 | 16.9 |
| 2012-07-22 17:00:00 | 16.64 |
| 2012-07-22 18:00:00 | 16.9 |
| 2012-07-22 19:00:00 | 16.64 |
| 2012-07-22 20:00:00 | 16.9 |
| 2012-07-22 21:00:00 | 17.16 |
| 2012-07-22 22:00:00 | 16.64 |
| 2012-07-22 23:00:00 | 16.9 |
| 2012-07-23 | 16.38 |
| 2012-07-23 01:00:00 | 16.64 |
| 2012-07-23 02:00:00 | 16.9 |
| 2012-07-23 03:00:00 | 16.64 |
| 2012-07-23 04:00:00 | 16.64 |
| 2012-07-23 05:00:00 | 18.98 |
| 2012-07-23 06:00:00 | 20.02 |
| 2012-07-23 07:00:00 | 28.6 |
| 2012-07-23 08:00:00 | 43.68 |
| 2012-07-23 09:00:00 | 44.46 |
| 2012-07-23 10:00:00 | 46.02 |
| 2012-07-23 11:00:00 | 43.68 |
| 2012-07-23 12:00:00 | 46.54 |
| 2012-07-23 13:00:00 | 46.28 |
| 2012-07-23 14:00:00 | 45.76 |
| 2012-07-23 15:00:00 | 45.76 |
| 2012-07-23 16:00:00 | 36.4 |
| 2012-07-23 17:00:00 | 28.6 |
| 2012-07-23 18:00:00 | 24.18 |
| 2012-07-23 19:00:00 | 24.18 |
| 2012-07-23 20:00:00 | 24.44 |
| 2012-07-23 21:00:00 | 27.04 |
| 2012-07-23 22:00:00 | 23.66 |
| 2012-07-23 23:00:00 | 18.2 |
| 2012-07-24 | 17.16 |
| 2012-07-24 01:00:00 | 17.16 |
| 2012-07-24 02:00:00 | 16.9 |
| 2012-07-24 03:00:00 | 17.16 |
| 2012-07-24 04:00:00 | 18.2 |
| 2012-07-24 05:00:00 | 18.46 |
| 2012-07-24 06:00:00 | 20.02 |
| 2012-07-24 07:00:00 | 28.34 |
| 2012-07-24 08:00:00 | 44.2 |
| 2012-07-24 09:00:00 | 48.1 |
| 2012-07-24 10:00:00 | 44.46 |
| 2012-07-24 11:00:00 | 45.76 |
| 2012-07-24 12:00:00 | 46.54 |
| 2012-07-24 13:00:00 | 47.58 |
| 2012-07-24 14:00:00 | 48.36 |
| 2012-07-24 15:00:00 | 48.62 |
| 2012-07-24 16:00:00 | 41.86 |
| 2012-07-24 17:00:00 | 32.5 |
| 2012-07-24 18:00:00 | 30.42 |
| 2012-07-24 19:00:00 | 27.3 |
| 2012-07-24 20:00:00 | 24.7 |
| 2012-07-24 21:00:00 | 25.74 |
| 2012-07-24 22:00:00 | 22.88 |
| 2012-07-24 23:00:00 | 21.06 |
| 2012-07-25 | 18.72 |
| 2012-07-25 01:00:00 | 19.24 |
| 2012-07-25 02:00:00 | 18.72 |
| 2012-07-25 03:00:00 | 18.98 |
| 2012-07-25 04:00:00 | 18.98 |
| 2012-07-25 05:00:00 | 20.8 |
| 2012-07-25 06:00:00 | 22.1 |
| 2012-07-25 07:00:00 | 29.9 |
| 2012-07-25 08:00:00 | 48.88 |
| 2012-07-25 09:00:00 | 50.18 |
| 2012-07-25 10:00:00 | 49.92 |
| 2012-07-25 11:00:00 | 51.22 |
| 2012-07-25 12:00:00 | 53.04 |
| 2012-07-25 13:00:00 | 54.08 |
| 2012-07-25 14:00:00 | 56.42 |
| 2012-07-25 15:00:00 | 51.22 |
| 2012-07-25 16:00:00 | 41.6 |
| 2012-07-25 17:00:00 | 34.06 |
| 2012-07-25 18:00:00 | 29.38 |
| 2012-07-25 19:00:00 | 27.3 |
| 2012-07-25 20:00:00 | 25.22 |
| 2012-07-25 21:00:00 | 29.12 |
| 2012-07-25 22:00:00 | 23.4 |
| 2012-07-25 23:00:00 | 18.98 |
| 2012-07-26 | 17.68 |
| 2012-07-26 01:00:00 | 17.16 |
| 2012-07-26 02:00:00 | 17.16 |
| 2012-07-26 03:00:00 | 17.16 |
| 2012-07-26 04:00:00 | 17.16 |
| 2012-07-26 05:00:00 | 17.42 |
| 2012-07-26 06:00:00 | 25.48 |
| 2012-07-26 07:00:00 | 33.54 |
| 2012-07-26 08:00:00 | 46.8 |
| 2012-07-26 09:00:00 | 47.84 |
| 2012-07-26 10:00:00 | 49.4 |
| 2012-07-26 11:00:00 | 53.56 |
| 2012-07-26 12:00:00 | 51.22 |
| 2012-07-26 13:00:00 | 55.12 |
| 2012-07-26 14:00:00 | 52.78 |
| 2012-07-26 15:00:00 | 46.28 |
| 2012-07-26 16:00:00 | 36.14 |
| 2012-07-26 17:00:00 | 25.74 |
| 2012-07-26 18:00:00 | 26.52 |
| 2012-07-26 19:00:00 | 24.96 |
| 2012-07-26 20:00:00 | 26.52 |
| 2012-07-26 21:00:00 | 23.92 |
| 2012-07-26 22:00:00 | 21.32 |
| 2012-07-26 23:00:00 | 17.16 |
| 2012-07-27 | 17.16 |
| 2012-07-27 01:00:00 | 17.16 |
| 2012-07-27 02:00:00 | 16.9 |
| 2012-07-27 03:00:00 | 17.16 |
| 2012-07-27 04:00:00 | 17.94 |
| 2012-07-27 05:00:00 | 18.2 |
| 2012-07-27 06:00:00 | 20.54 |
| 2012-07-27 07:00:00 | 28.34 |
| 2012-07-27 08:00:00 | 47.32 |
| 2012-07-27 09:00:00 | 47.32 |
| 2012-07-27 10:00:00 | 47.84 |
| 2012-07-27 11:00:00 | 53.04 |
| 2012-07-27 12:00:00 | 52.52 |
| 2012-07-27 13:00:00 | 54.86 |
| 2012-07-27 14:00:00 | 50.96 |
| 2012-07-27 15:00:00 | 42.38 |
| 2012-07-27 16:00:00 | 35.62 |
| 2012-07-27 17:00:00 | 29.12 |
| 2012-07-27 18:00:00 | 30.16 |
| 2012-07-27 19:00:00 | 26.26 |
| 2012-07-27 20:00:00 | 25.22 |
| 2012-07-27 21:00:00 | 25.22 |
| 2012-07-27 22:00:00 | 22.1 |
| 2012-07-27 23:00:00 | 18.2 |
| 2012-07-28 | 17.94 |
| 2012-07-28 01:00:00 | 17.16 |
| 2012-07-28 02:00:00 | 16.9 |
| 2012-07-28 03:00:00 | 16.9 |
| 2012-07-28 04:00:00 | 17.68 |
| 2012-07-28 05:00:00 | 17.16 |
| 2012-07-28 06:00:00 | 16.9 |
| 2012-07-28 07:00:00 | 16.38 |
| 2012-07-28 08:00:00 | 16.9 |
| 2012-07-28 09:00:00 | 18.46 |
| 2012-07-28 10:00:00 | 17.16 |
| 2012-07-28 11:00:00 | 17.16 |
| 2012-07-28 12:00:00 | 19.5 |
| 2012-07-28 13:00:00 | 18.72 |
| 2012-07-28 14:00:00 | 18.98 |
| 2012-07-28 15:00:00 | 22.36 |
| 2012-07-28 16:00:00 | 22.88 |
| 2012-07-28 17:00:00 | 19.5 |
| 2012-07-28 18:00:00 | 22.62 |
| 2012-07-28 19:00:00 | 21.84 |
| 2012-07-28 20:00:00 | 17.94 |
| 2012-07-28 21:00:00 | 17.94 |
| 2012-07-28 22:00:00 | 17.68 |
| 2012-07-28 23:00:00 | 17.68 |
| 2012-07-29 | 18.98 |
| 2012-07-29 01:00:00 | 17.68 |
| 2012-07-29 02:00:00 | 18.46 |
| 2012-07-29 03:00:00 | 17.68 |
| 2012-07-29 04:00:00 | 17.16 |
| 2012-07-29 05:00:00 | 17.42 |
| 2012-07-29 06:00:00 | 18.2 |
| 2012-07-29 07:00:00 | 16.9 |
| 2012-07-29 08:00:00 | 17.16 |
| 2012-07-29 09:00:00 | 17.16 |
| 2012-07-29 10:00:00 | 19.5 |
| 2012-07-29 11:00:00 | 18.46 |
| 2012-07-29 12:00:00 | 17.16 |
| 2012-07-29 13:00:00 | 17.94 |
| 2012-07-29 14:00:00 | 16.64 |
| 2012-07-29 15:00:00 | 17.94 |
| 2012-07-29 16:00:00 | 16.64 |
| 2012-07-29 17:00:00 | 17.42 |
| 2012-07-29 18:00:00 | 17.68 |
| 2012-07-29 19:00:00 | 16.64 |
| 2012-07-29 20:00:00 | 17.68 |
| 2012-07-29 21:00:00 | 17.42 |
| 2012-07-29 22:00:00 | 17.16 |
| 2012-07-29 23:00:00 | 16.64 |
| 2012-07-30 | 17.68 |
| 2012-07-30 01:00:00 | 16.9 |
| 2012-07-30 02:00:00 | 16.64 |
| 2012-07-30 03:00:00 | 16.64 |
| 2012-07-30 04:00:00 | 16.64 |
| 2012-07-30 05:00:00 | 18.46 |
| 2012-07-30 06:00:00 | 23.92 |
| 2012-07-30 07:00:00 | 32.76 |
| 2012-07-30 08:00:00 | 53.82 |
| 2012-07-30 09:00:00 | 53.56 |
| 2012-07-30 10:00:00 | 53.56 |
| 2012-07-30 11:00:00 | 56.42 |
| 2012-07-30 12:00:00 | 55.9 |
| 2012-07-30 13:00:00 | 56.68 |
| 2012-07-30 14:00:00 | 58.5 |
| 2012-07-30 15:00:00 | 52.26 |
| 2012-07-30 16:00:00 | 44.98 |
| 2012-07-30 17:00:00 | 36.92 |
| 2012-07-30 18:00:00 | 30.94 |
| 2012-07-30 19:00:00 | 28.6 |
| 2012-07-30 20:00:00 | 30.68 |
| 2012-07-30 21:00:00 | 34.84 |
| 2012-07-30 22:00:00 | 25.22 |
| 2012-07-30 23:00:00 | 18.2 |
| 2012-07-31 | 17.94 |
| 2012-07-31 01:00:00 | 17.16 |
| 2012-07-31 02:00:00 | 17.16 |
| 2012-07-31 03:00:00 | 16.9 |
| 2012-07-31 04:00:00 | 17.16 |
| 2012-07-31 05:00:00 | 17.16 |
| 2012-07-31 06:00:00 | 21.06 |
| 2012-07-31 07:00:00 | 30.42 |
| 2012-07-31 08:00:00 | 48.1 |
| 2012-07-31 09:00:00 | 54.08 |
| 2012-07-31 10:00:00 | 52.78 |
| 2012-07-31 11:00:00 | 57.2 |
| 2012-07-31 12:00:00 | 54.6 |
| 2012-07-31 13:00:00 | 57.72 |
| 2012-07-31 14:00:00 | 54.08 |
| 2012-07-31 15:00:00 | 52.52 |
| 2012-07-31 16:00:00 | 47.32 |
| 2012-07-31 17:00:00 | 36.66 |
| 2012-07-31 18:00:00 | 30.94 |
| 2012-07-31 19:00:00 | 30.94 |
| 2012-07-31 20:00:00 | 29.38 |
| 2012-07-31 21:00:00 | 31.46 |
| 2012-07-31 22:00:00 | 25.74 |
| 2012-07-31 23:00:00 | 20.28 |
| 2012-08-01 | 17.16 |
| 2012-08-01 01:00:00 | 17.16 |
| 2012-08-01 02:00:00 | 17.94 |
| 2012-08-01 03:00:00 | 17.16 |
| 2012-08-01 04:00:00 | 17.16 |
| 2012-08-01 05:00:00 | 19.24 |
| 2012-08-01 06:00:00 | 22.62 |
| 2012-08-01 07:00:00 | 33.54 |
| 2012-08-01 08:00:00 | 50.18 |
| 2012-08-01 09:00:00 | 54.6 |
| 2012-08-01 10:00:00 | 55.9 |
| 2012-08-01 11:00:00 | 58.24 |
| 2012-08-01 12:00:00 | 60.84 |
| 2012-08-01 13:00:00 | 62.66 |
| 2012-08-01 14:00:00 | 59.28 |
| 2012-08-01 15:00:00 | 57.98 |
| 2012-08-01 16:00:00 | 49.92 |
| 2012-08-01 17:00:00 | 40.56 |
| 2012-08-01 18:00:00 | 35.1 |
| 2012-08-01 19:00:00 | 28.34 |
| 2012-08-01 20:00:00 | 26 |
| 2012-08-01 21:00:00 | 26.52 |
| 2012-08-01 22:00:00 | 24.18 |
| 2012-08-01 23:00:00 | 21.58 |
| 2012-08-02 | 20.02 |
| 2012-08-02 01:00:00 | 19.24 |
| 2012-08-02 02:00:00 | 19.76 |
| 2012-08-02 03:00:00 | 19.24 |
| 2012-08-02 04:00:00 | 18.98 |
| 2012-08-02 05:00:00 | 21.84 |
| 2012-08-02 06:00:00 | 21.84 |
| 2012-08-02 07:00:00 | 32.5 |
| 2012-08-02 08:00:00 | 53.82 |
| 2012-08-02 09:00:00 | 59.28 |
| 2012-08-02 10:00:00 | 61.62 |
| 2012-08-02 11:00:00 | 65.52 |
| 2012-08-02 12:00:00 | 66.04 |
| 2012-08-02 13:00:00 | 68.12 |
| 2012-08-02 14:00:00 | 66.56 |
| 2012-08-02 15:00:00 | 61.36 |
| 2012-08-02 16:00:00 | 50.96 |
| 2012-08-02 17:00:00 | 40.82 |
| 2012-08-02 18:00:00 | 36.14 |
| 2012-08-02 19:00:00 | 33.02 |
| 2012-08-02 20:00:00 | 31.98 |
| 2012-08-02 21:00:00 | 31.2 |
| 2012-08-02 22:00:00 | 27.56 |
| 2012-08-02 23:00:00 | 22.1 |
| 2012-08-03 | 18.72 |
| 2012-08-03 01:00:00 | 18.72 |
| 2012-08-03 02:00:00 | 18.98 |
| 2012-08-03 03:00:00 | 18.46 |
| 2012-08-03 04:00:00 | 18.98 |
| 2012-08-03 05:00:00 | 18.72 |
| 2012-08-03 06:00:00 | 24.44 |
| 2012-08-03 07:00:00 | 33.54 |
| 2012-08-03 08:00:00 | 57.98 |
| 2012-08-03 09:00:00 | 56.94 |
| 2012-08-03 10:00:00 | 59.54 |
| 2012-08-03 11:00:00 | 60.84 |
| 2012-08-03 12:00:00 | 60.06 |
| 2012-08-03 13:00:00 | 61.62 |
| 2012-08-03 14:00:00 | 61.1 |
| 2012-08-03 15:00:00 | 57.98 |
| 2012-08-03 16:00:00 | 44.46 |
| 2012-08-03 17:00:00 | 29.38 |
| 2012-08-03 18:00:00 | 28.6 |
| 2012-08-03 19:00:00 | 27.56 |
| 2012-08-03 20:00:00 | 28.86 |
| 2012-08-03 21:00:00 | 29.64 |
| 2012-08-03 22:00:00 | 23.4 |
| 2012-08-03 23:00:00 | 20.8 |
| 2012-08-04 | 17.94 |
| 2012-08-04 01:00:00 | 18.98 |
| 2012-08-04 02:00:00 | 17.94 |
| 2012-08-04 03:00:00 | 17.94 |
| 2012-08-04 04:00:00 | 17.94 |
| 2012-08-04 05:00:00 | 17.94 |
| 2012-08-04 06:00:00 | 20.8 |
| 2012-08-04 07:00:00 | 19.76 |
| 2012-08-04 08:00:00 | 19.5 |
| 2012-08-04 09:00:00 | 17.42 |
| 2012-08-04 10:00:00 | 17.42 |
| 2012-08-04 11:00:00 | 16.9 |
| 2012-08-04 12:00:00 | 18.98 |
| 2012-08-04 13:00:00 | 16.9 |
| 2012-08-04 14:00:00 | 18.72 |
| 2012-08-04 15:00:00 | 18.46 |
| 2012-08-04 16:00:00 | 20.02 |
| 2012-08-04 17:00:00 | 19.76 |
| 2012-08-04 18:00:00 | 20.28 |
| 2012-08-04 19:00:00 | 17.94 |
| 2012-08-04 20:00:00 | 17.16 |
| 2012-08-04 21:00:00 | 17.42 |
| 2012-08-04 22:00:00 | 18.2 |
| 2012-08-04 23:00:00 | 16.38 |
| 2012-08-05 | 16.9 |
| 2012-08-05 01:00:00 | 17.16 |
| 2012-08-05 02:00:00 | 17.16 |
| 2012-08-05 03:00:00 | 17.68 |
| 2012-08-05 04:00:00 | 16.38 |
| 2012-08-05 05:00:00 | 17.16 |
| 2012-08-05 06:00:00 | 17.16 |
| 2012-08-05 07:00:00 | 18.72 |
| 2012-08-05 08:00:00 | 21.32 |
| 2012-08-05 09:00:00 | 20.54 |
| 2012-08-05 10:00:00 | 19.76 |
| 2012-08-05 11:00:00 | 21.06 |
| 2012-08-05 12:00:00 | 21.84 |
| 2012-08-05 13:00:00 | 21.84 |
| 2012-08-05 14:00:00 | 23.92 |
| 2012-08-05 15:00:00 | 24.96 |
| 2012-08-05 16:00:00 | 26.52 |
| 2012-08-05 17:00:00 | 26 |
| 2012-08-05 18:00:00 | 25.48 |
| 2012-08-05 19:00:00 | 22.36 |
| 2012-08-05 20:00:00 | 21.58 |
| 2012-08-05 21:00:00 | 21.32 |
| 2012-08-05 22:00:00 | 20.28 |
| 2012-08-05 23:00:00 | 20.8 |
| 2012-08-06 | 18.98 |
| 2012-08-06 01:00:00 | 20.02 |
| 2012-08-06 02:00:00 | 19.24 |
| 2012-08-06 03:00:00 | 19.24 |
| 2012-08-06 04:00:00 | 20.02 |
| 2012-08-06 05:00:00 | 21.32 |
| 2012-08-06 06:00:00 | 23.4 |
| 2012-08-06 07:00:00 | 34.58 |
| 2012-08-06 08:00:00 | 57.72 |
| 2012-08-06 09:00:00 | 68.38 |
| 2012-08-06 10:00:00 | 73.84 |
| 2012-08-06 11:00:00 | 85.8 |
| 2012-08-06 12:00:00 | 81.64 |
| 2012-08-06 13:00:00 | 77.22 |
| 2012-08-06 14:00:00 | 79.56 |
| 2012-08-06 15:00:00 | 77.22 |
| 2012-08-06 16:00:00 | 64.74 |
| 2012-08-06 17:00:00 | 47.32 |
| 2012-08-06 18:00:00 | 36.14 |
| 2012-08-06 19:00:00 | 33.28 |
| 2012-08-06 20:00:00 | 34.32 |
| 2012-08-06 21:00:00 | 31.72 |
| 2012-08-06 22:00:00 | 22.62 |
| 2012-08-06 23:00:00 | 20.54 |
| 2012-08-07 | 17.68 |
| 2012-08-07 01:00:00 | 17.68 |
| 2012-08-07 02:00:00 | 17.16 |
| 2012-08-07 03:00:00 | 17.42 |
| 2012-08-07 04:00:00 | 18.2 |
| 2012-08-07 05:00:00 | 19.5 |
| 2012-08-07 06:00:00 | 23.66 |
| 2012-08-07 07:00:00 | 31.46 |
| 2012-08-07 08:00:00 | 53.82 |
| 2012-08-07 09:00:00 | 57.2 |
| 2012-08-07 10:00:00 | 58.76 |
| 2012-08-07 11:00:00 | 55.38 |
| 2012-08-07 12:00:00 | 55.38 |
| 2012-08-07 13:00:00 | 56.68 |
| 2012-08-07 14:00:00 | 56.42 |
| 2012-08-07 15:00:00 | 56.16 |
| 2012-08-07 16:00:00 | 44.46 |
| 2012-08-07 17:00:00 | 34.84 |
| 2012-08-07 18:00:00 | 29.9 |
| 2012-08-07 19:00:00 | 28.86 |
| 2012-08-07 20:00:00 | 28.6 |
| 2012-08-07 21:00:00 | 33.8 |
| 2012-08-07 22:00:00 | 26.52 |
| 2012-08-07 23:00:00 | 20.02 |
| 2012-08-08 | 18.98 |
| 2012-08-08 01:00:00 | 18.46 |
| 2012-08-08 02:00:00 | 19.5 |
| 2012-08-08 03:00:00 | 18.72 |
| 2012-08-08 04:00:00 | 18.46 |
| 2012-08-08 05:00:00 | 21.32 |
| 2012-08-08 06:00:00 | 23.4 |
| 2012-08-08 07:00:00 | 31.46 |
| 2012-08-08 08:00:00 | 49.14 |
| 2012-08-08 09:00:00 | 53.56 |
| 2012-08-08 10:00:00 | 56.42 |
| 2012-08-08 11:00:00 | 54.86 |
| 2012-08-08 12:00:00 | 53.3 |
| 2012-08-08 13:00:00 | 56.94 |
| 2012-08-08 14:00:00 | 57.46 |
| 2012-08-08 15:00:00 | 52.78 |
| 2012-08-08 16:00:00 | 42.9 |
| 2012-08-08 17:00:00 | 33.54 |
| 2012-08-08 18:00:00 | 28.6 |
| 2012-08-08 19:00:00 | 27.04 |
| 2012-08-08 20:00:00 | 27.56 |
| 2012-08-08 21:00:00 | 28.6 |
| 2012-08-08 22:00:00 | 22.36 |
| 2012-08-08 23:00:00 | 18.2 |
| 2012-08-09 | 17.16 |
| 2012-08-09 01:00:00 | 17.16 |
| 2012-08-09 02:00:00 | 16.9 |
| 2012-08-09 03:00:00 | 17.16 |
| 2012-08-09 04:00:00 | 17.94 |
| 2012-08-09 05:00:00 | 19.5 |
| 2012-08-09 06:00:00 | 22.88 |
| 2012-08-09 07:00:00 | 31.72 |
| 2012-08-09 08:00:00 | 45.76 |
| 2012-08-09 09:00:00 | 52.78 |
| 2012-08-09 10:00:00 | 50.96 |
| 2012-08-09 11:00:00 | 49.4 |
| 2012-08-09 12:00:00 | 51.22 |
| 2012-08-09 13:00:00 | 51.74 |
| 2012-08-09 14:00:00 | 50.96 |
| 2012-08-09 15:00:00 | 48.36 |
| 2012-08-09 16:00:00 | 39 |
| 2012-08-09 17:00:00 | 28.34 |
| 2012-08-09 18:00:00 | 26.78 |
| 2012-08-09 19:00:00 | 27.04 |
| 2012-08-09 20:00:00 | 29.64 |
| 2012-08-09 21:00:00 | 33.8 |
| 2012-08-09 22:00:00 | 22.88 |
| 2012-08-09 23:00:00 | 17.94 |
| 2012-08-10 | 16.9 |
| 2012-08-10 01:00:00 | 16.64 |
| 2012-08-10 02:00:00 | 16.64 |
| 2012-08-10 03:00:00 | 16.38 |
| 2012-08-10 04:00:00 | 16.9 |
| 2012-08-10 05:00:00 | 18.2 |
| 2012-08-10 06:00:00 | 24.96 |
| 2012-08-10 07:00:00 | 30.94 |
| 2012-08-10 08:00:00 | 45.76 |
| 2012-08-10 09:00:00 | 48.36 |
| 2012-08-10 10:00:00 | 45.5 |
| 2012-08-10 11:00:00 | 46.28 |
| 2012-08-10 12:00:00 | 45.5 |
| 2012-08-10 13:00:00 | 46.8 |
| 2012-08-10 14:00:00 | 44.98 |
| 2012-08-10 15:00:00 | 40.04 |
| 2012-08-10 16:00:00 | 31.98 |
| 2012-08-10 17:00:00 | 27.56 |
| 2012-08-10 18:00:00 | 27.04 |
| 2012-08-10 19:00:00 | 25.74 |
| 2012-08-10 20:00:00 | 24.96 |
| 2012-08-10 21:00:00 | 23.92 |
| 2012-08-10 22:00:00 | 21.32 |
| 2012-08-10 23:00:00 | 18.2 |
| 2012-08-11 | 17.16 |
| 2012-08-11 01:00:00 | 16.64 |
| 2012-08-11 02:00:00 | 16.64 |
| 2012-08-11 03:00:00 | 16.64 |
| 2012-08-11 04:00:00 | 16.64 |
| 2012-08-11 05:00:00 | 16.9 |
| 2012-08-11 06:00:00 | 16.64 |
| 2012-08-11 07:00:00 | 16.9 |
| 2012-08-11 08:00:00 | 16.38 |
| 2012-08-11 09:00:00 | 16.12 |
| 2012-08-11 10:00:00 | 16.12 |
| 2012-08-11 11:00:00 | 15.86 |
| 2012-08-11 12:00:00 | 16.38 |
| 2012-08-11 13:00:00 | 16.12 |
| 2012-08-11 14:00:00 | 16.12 |
| 2012-08-11 15:00:00 | 15.86 |
| 2012-08-11 16:00:00 | 15.86 |
| 2012-08-11 17:00:00 | 15.86 |
| 2012-08-11 18:00:00 | 16.12 |
| 2012-08-11 19:00:00 | 15.86 |
| 2012-08-11 20:00:00 | 16.12 |
| 2012-08-11 21:00:00 | 16.38 |
| 2012-08-11 22:00:00 | 16.38 |
| 2012-08-11 23:00:00 | 16.12 |
| 2012-08-12 | 16.12 |
| 2012-08-12 01:00:00 | 16.38 |
| 2012-08-12 02:00:00 | 16.12 |
| 2012-08-12 03:00:00 | 16.12 |
| 2012-08-12 04:00:00 | 16.38 |
| 2012-08-12 05:00:00 | 16.38 |
| 2012-08-12 06:00:00 | 17.16 |
| 2012-08-12 07:00:00 | 17.42 |
| 2012-08-12 08:00:00 | 16.64 |
| 2012-08-12 09:00:00 | 16.9 |
| 2012-08-12 10:00:00 | 16.64 |
| 2012-08-12 11:00:00 | 16.9 |
| 2012-08-12 12:00:00 | 16.9 |
| 2012-08-12 13:00:00 | 16.12 |
| 2012-08-12 14:00:00 | 16.12 |
| 2012-08-12 15:00:00 | 15.86 |
| 2012-08-12 16:00:00 | 16.12 |
| 2012-08-12 17:00:00 | 15.86 |
| 2012-08-12 18:00:00 | 16.12 |
| 2012-08-12 19:00:00 | 15.86 |
| 2012-08-12 20:00:00 | 16.12 |
| 2012-08-12 21:00:00 | 16.64 |
| 2012-08-12 22:00:00 | 16.12 |
| 2012-08-12 23:00:00 | 16.38 |
| 2012-08-13 | 16.12 |
| 2012-08-13 01:00:00 | 16.12 |
| 2012-08-13 02:00:00 | 16.38 |
| 2012-08-13 03:00:00 | 16.12 |
| 2012-08-13 04:00:00 | 17.42 |
| 2012-08-13 05:00:00 | 19.5 |
| 2012-08-13 06:00:00 | 21.84 |
| 2012-08-13 07:00:00 | 26.52 |
| 2012-08-13 08:00:00 | 42.64 |
| 2012-08-13 09:00:00 | 44.2 |
| 2012-08-13 10:00:00 | 44.46 |
| 2012-08-13 11:00:00 | 42.38 |
| 2012-08-13 12:00:00 | 44.2 |
| 2012-08-13 13:00:00 | 42.9 |
| 2012-08-13 14:00:00 | 42.9 |
| 2012-08-13 15:00:00 | 39.78 |
| 2012-08-13 16:00:00 | 34.84 |
| 2012-08-13 17:00:00 | 29.64 |
| 2012-08-13 18:00:00 | 27.82 |
| 2012-08-13 19:00:00 | 26.26 |
| 2012-08-13 20:00:00 | 27.04 |
| 2012-08-13 21:00:00 | 32.5 |
| 2012-08-13 22:00:00 | 21.84 |
| 2012-08-13 23:00:00 | 18.2 |
| 2012-08-14 | 16.64 |
| 2012-08-14 01:00:00 | 16.12 |
| 2012-08-14 02:00:00 | 16.64 |
| 2012-08-14 03:00:00 | 16.12 |
| 2012-08-14 04:00:00 | 16.38 |
| 2012-08-14 05:00:00 | 16.64 |
| 2012-08-14 06:00:00 | 21.84 |
| 2012-08-14 07:00:00 | 28.86 |
| 2012-08-14 08:00:00 | 44.46 |
| 2012-08-14 09:00:00 | 47.84 |
| 2012-08-14 10:00:00 | 46.8 |
| 2012-08-14 11:00:00 | 47.84 |
| 2012-08-14 12:00:00 | 46.28 |
| 2012-08-14 13:00:00 | 44.72 |
| 2012-08-14 14:00:00 | 44.2 |
| 2012-08-14 15:00:00 | 44.98 |
| 2012-08-14 16:00:00 | 37.96 |
| 2012-08-14 17:00:00 | 27.82 |
| 2012-08-14 18:00:00 | 25.74 |
| 2012-08-14 19:00:00 | 26.52 |
| 2012-08-14 20:00:00 | 28.6 |
| 2012-08-14 21:00:00 | 31.2 |
| 2012-08-14 22:00:00 | 21.58 |
| 2012-08-14 23:00:00 | 17.42 |
| 2012-08-15 | 16.64 |
| 2012-08-15 01:00:00 | 16.38 |
| 2012-08-15 02:00:00 | 16.64 |
| 2012-08-15 03:00:00 | 16.38 |
| 2012-08-15 04:00:00 | 17.42 |
| 2012-08-15 05:00:00 | 18.46 |
| 2012-08-15 06:00:00 | 21.58 |
| 2012-08-15 07:00:00 | 26.52 |
| 2012-08-15 08:00:00 | 40.56 |
| 2012-08-15 09:00:00 | 41.6 |
| 2012-08-15 10:00:00 | 42.64 |
| 2012-08-15 11:00:00 | 41.86 |
| 2012-08-15 12:00:00 | 44.46 |
| 2012-08-15 13:00:00 | 43.16 |
| 2012-08-15 14:00:00 | 44.46 |
| 2012-08-15 15:00:00 | 44.2 |
| 2012-08-15 16:00:00 | 43.68 |
| 2012-08-15 17:00:00 | 34.06 |
| 2012-08-15 18:00:00 | 29.64 |
| 2012-08-15 19:00:00 | 27.82 |
| 2012-08-15 20:00:00 | 27.3 |
| 2012-08-15 21:00:00 | 28.86 |
| 2012-08-15 22:00:00 | 22.62 |
| 2012-08-15 23:00:00 | 19.24 |
| 2012-08-16 | 17.68 |
| 2012-08-16 01:00:00 | 17.94 |
| 2012-08-16 02:00:00 | 17.42 |
| 2012-08-16 03:00:00 | 17.94 |
| 2012-08-16 04:00:00 | 17.42 |
| 2012-08-16 05:00:00 | 19.5 |
| 2012-08-16 06:00:00 | 20.54 |
| 2012-08-16 07:00:00 | 28.08 |
| 2012-08-16 08:00:00 | 39.26 |
| 2012-08-16 09:00:00 | 42.38 |
| 2012-08-16 10:00:00 | 41.6 |
| 2012-08-16 11:00:00 | 42.12 |
| 2012-08-16 12:00:00 | 41.6 |
| 2012-08-16 13:00:00 | 44.98 |
| 2012-08-16 14:00:00 | 45.24 |
| 2012-08-16 15:00:00 | 43.42 |
| 2012-08-16 16:00:00 | 36.4 |
| 2012-08-16 17:00:00 | 25.74 |
| 2012-08-16 18:00:00 | 24.18 |
| 2012-08-16 19:00:00 | 25.22 |
| 2012-08-16 20:00:00 | 26.26 |
| 2012-08-16 21:00:00 | 32.24 |
| 2012-08-16 22:00:00 | 22.62 |
| 2012-08-16 23:00:00 | 18.2 |
| 2012-08-17 | 16.64 |
| 2012-08-17 01:00:00 | 16.64 |
| 2012-08-17 02:00:00 | 16.64 |
| 2012-08-17 03:00:00 | 16.64 |
| 2012-08-17 04:00:00 | 17.42 |
| 2012-08-17 05:00:00 | 18.2 |
| 2012-08-17 06:00:00 | 21.84 |
| 2012-08-17 07:00:00 | 28.08 |
| 2012-08-17 08:00:00 | 45.5 |
| 2012-08-17 09:00:00 | 52.26 |
| 2012-08-17 10:00:00 | 53.3 |
| 2012-08-17 11:00:00 | 52.52 |
| 2012-08-17 12:00:00 | 50.44 |
| 2012-08-17 13:00:00 | 47.84 |
| 2012-08-17 14:00:00 | 47.58 |
| 2012-08-17 15:00:00 | 37.96 |
| 2012-08-17 16:00:00 | 30.94 |
| 2012-08-17 17:00:00 | 26.52 |
| 2012-08-17 18:00:00 | 26.26 |
| 2012-08-17 19:00:00 | 26.52 |
| 2012-08-17 20:00:00 | 27.82 |
| 2012-08-17 21:00:00 | 26.78 |
| 2012-08-17 22:00:00 | 22.1 |
| 2012-08-17 23:00:00 | 19.24 |
| 2012-08-18 | 17.94 |
| 2012-08-18 01:00:00 | 17.68 |
| 2012-08-18 02:00:00 | 17.68 |
| 2012-08-18 03:00:00 | 17.16 |
| 2012-08-18 04:00:00 | 17.42 |
| 2012-08-18 05:00:00 | 17.42 |
| 2012-08-18 06:00:00 | 17.42 |
| 2012-08-18 07:00:00 | 16.38 |
| 2012-08-18 08:00:00 | 16.38 |
| 2012-08-18 09:00:00 | 16.38 |
| 2012-08-18 10:00:00 | 15.86 |
| 2012-08-18 11:00:00 | 16.12 |
| 2012-08-18 12:00:00 | 16.12 |
| 2012-08-18 13:00:00 | 16.12 |
| 2012-08-18 14:00:00 | 15.86 |
| 2012-08-18 15:00:00 | 16.12 |
| 2012-08-18 16:00:00 | 16.12 |
| 2012-08-18 17:00:00 | 16.12 |
| 2012-08-18 18:00:00 | 16.12 |
| 2012-08-18 19:00:00 | 16.9 |
| 2012-08-18 20:00:00 | 17.68 |
| 2012-08-18 21:00:00 | 16.9 |
| 2012-08-18 22:00:00 | 16.38 |
| 2012-08-18 23:00:00 | 16.64 |
| 2012-08-19 | 16.38 |
| 2012-08-19 01:00:00 | 16.64 |
| 2012-08-19 02:00:00 | 16.38 |
| 2012-08-19 03:00:00 | 16.64 |
| 2012-08-19 04:00:00 | 16.38 |
| 2012-08-19 05:00:00 | 16.64 |
| 2012-08-19 06:00:00 | 16.38 |
| 2012-08-19 07:00:00 | 16.38 |
| 2012-08-19 08:00:00 | 16.38 |
| 2012-08-19 09:00:00 | 16.12 |
| 2012-08-19 10:00:00 | 16.12 |
| 2012-08-19 11:00:00 | 16.12 |
| 2012-08-19 12:00:00 | 16.12 |
| 2012-08-19 13:00:00 | 16.38 |
| 2012-08-19 14:00:00 | 16.12 |
| 2012-08-19 15:00:00 | 16.38 |
| 2012-08-19 16:00:00 | 20.54 |
| 2012-08-19 17:00:00 | 21.06 |
| 2012-08-19 18:00:00 | 19.5 |
| 2012-08-19 19:00:00 | 19.5 |
| 2012-08-19 20:00:00 | 20.54 |
| 2012-08-19 21:00:00 | 20.28 |
| 2012-08-19 22:00:00 | 18.72 |
| 2012-08-19 23:00:00 | 18.46 |
| 2012-08-20 | 18.2 |
| 2012-08-20 01:00:00 | 17.94 |
| 2012-08-20 02:00:00 | 18.2 |
| 2012-08-20 03:00:00 | 17.94 |
| 2012-08-20 04:00:00 | 17.94 |
| 2012-08-20 05:00:00 | 20.28 |
| 2012-08-20 06:00:00 | 20.8 |
| 2012-08-20 07:00:00 | 29.12 |
| 2012-08-20 08:00:00 | 47.58 |
| 2012-08-20 09:00:00 | 51.22 |
| 2012-08-20 10:00:00 | 54.86 |
| 2012-08-20 11:00:00 | 59.02 |
| 2012-08-20 12:00:00 | 59.02 |
| 2012-08-20 13:00:00 | 57.2 |
| 2012-08-20 14:00:00 | 57.72 |
| 2012-08-20 15:00:00 | 56.68 |
| 2012-08-20 16:00:00 | 48.1 |
| 2012-08-20 17:00:00 | 41.34 |
| 2012-08-20 18:00:00 | 36.66 |
| 2012-08-20 19:00:00 | 32.5 |
| 2012-08-20 20:00:00 | 33.8 |
| 2012-08-20 21:00:00 | 40.56 |
| 2012-08-20 22:00:00 | 28.6 |
| 2012-08-20 23:00:00 | 24.18 |
| 2012-08-21 | 20.8 |
| 2012-08-21 01:00:00 | 21.58 |
| 2012-08-21 02:00:00 | 20.28 |
| 2012-08-21 03:00:00 | 21.84 |
| 2012-08-21 04:00:00 | 19.76 |
| 2012-08-21 05:00:00 | 24.44 |
| 2012-08-21 06:00:00 | 28.6 |
| 2012-08-21 07:00:00 | 33.8 |
| 2012-08-21 08:00:00 | 47.32 |
| 2012-08-21 09:00:00 | 48.62 |
| 2012-08-21 10:00:00 | 49.92 |
| 2012-08-21 11:00:00 | 52 |
| 2012-08-21 12:00:00 | 53.56 |
| 2012-08-21 13:00:00 | 57.46 |
| 2012-08-21 14:00:00 | 61.1 |
| 2012-08-21 15:00:00 | 57.98 |
| 2012-08-21 16:00:00 | 45.5 |
| 2012-08-21 17:00:00 | 34.06 |
| 2012-08-21 18:00:00 | 29.12 |
| 2012-08-21 19:00:00 | 30.68 |
| 2012-08-21 20:00:00 | 34.32 |
| 2012-08-21 21:00:00 | 35.1 |
| 2012-08-21 22:00:00 | 23.92 |
| 2012-08-21 23:00:00 | 22.1 |
| 2012-08-22 | 20.02 |
| 2012-08-22 01:00:00 | 18.98 |
| 2012-08-22 02:00:00 | 18.98 |
| 2012-08-22 03:00:00 | 19.5 |
| 2012-08-22 04:00:00 | 18.46 |
| 2012-08-22 05:00:00 | 21.58 |
| 2012-08-22 06:00:00 | 21.58 |
| 2012-08-22 07:00:00 | 30.94 |
| 2012-08-22 08:00:00 | 46.02 |
| 2012-08-22 09:00:00 | 47.58 |
| 2012-08-22 10:00:00 | 51.22 |
| 2012-08-22 11:00:00 | 50.96 |
| 2012-08-22 12:00:00 | 52.78 |
| 2012-08-22 13:00:00 | 55.9 |
| 2012-08-22 14:00:00 | 54.86 |
| 2012-08-22 15:00:00 | 54.86 |
| 2012-08-22 16:00:00 | 41.6 |
| 2012-08-22 17:00:00 | 32.76 |
| 2012-08-22 18:00:00 | 27.82 |
| 2012-08-22 19:00:00 | 27.04 |
| 2012-08-22 20:00:00 | 30.16 |
| 2012-08-22 21:00:00 | 27.82 |
| 2012-08-22 22:00:00 | 22.1 |
| 2012-08-22 23:00:00 | 18.72 |
| 2012-08-23 | 17.16 |
| 2012-08-23 01:00:00 | 17.16 |
| 2012-08-23 02:00:00 | 17.16 |
| 2012-08-23 03:00:00 | 17.16 |
| 2012-08-23 04:00:00 | 17.94 |
| 2012-08-23 05:00:00 | 18.46 |
| 2012-08-23 06:00:00 | 22.36 |
| 2012-08-23 07:00:00 | 31.46 |
| 2012-08-23 08:00:00 | 48.36 |
| 2012-08-23 09:00:00 | 49.4 |
| 2012-08-23 10:00:00 | 48.1 |
| 2012-08-23 11:00:00 | 48.88 |
| 2012-08-23 12:00:00 | 53.3 |
| 2012-08-23 13:00:00 | 57.72 |
| 2012-08-23 14:00:00 | 50.96 |
| 2012-08-23 15:00:00 | 46.02 |
| 2012-08-23 16:00:00 | 40.56 |
| 2012-08-23 17:00:00 | 34.58 |
| 2012-08-23 18:00:00 | 31.72 |
| 2012-08-23 19:00:00 | 28.6 |
| 2012-08-23 20:00:00 | 28.6 |
| 2012-08-23 21:00:00 | 35.88 |
| 2012-08-23 22:00:00 | 25.48 |
| 2012-08-23 23:00:00 | 20.54 |
| 2012-08-24 | 17.16 |
| 2012-08-24 01:00:00 | 16.9 |
| 2012-08-24 02:00:00 | 18.2 |
| 2012-08-24 03:00:00 | 16.64 |
| 2012-08-24 04:00:00 | 17.42 |
| 2012-08-24 05:00:00 | 21.32 |
| 2012-08-24 06:00:00 | 25.48 |
| 2012-08-24 07:00:00 | 30.16 |
| 2012-08-24 08:00:00 | 41.6 |
| 2012-08-24 09:00:00 | 45.24 |
| 2012-08-24 10:00:00 | 46.02 |
| 2012-08-24 11:00:00 | 47.06 |
| 2012-08-24 12:00:00 | 49.4 |
| 2012-08-24 13:00:00 | 59.54 |
| 2012-08-24 14:00:00 | 52.26 |
| 2012-08-24 15:00:00 | 44.2 |
| 2012-08-24 16:00:00 | 33.02 |
| 2012-08-24 17:00:00 | 29.64 |
| 2012-08-24 18:00:00 | 28.6 |
| 2012-08-24 19:00:00 | 29.12 |
| 2012-08-24 20:00:00 | 30.42 |
| 2012-08-24 21:00:00 | 24.18 |
| 2012-08-24 22:00:00 | 22.36 |
| 2012-08-24 23:00:00 | 20.28 |
| 2012-08-25 | 17.16 |
| 2012-08-25 01:00:00 | 17.42 |
| 2012-08-25 02:00:00 | 16.64 |
| 2012-08-25 03:00:00 | 17.16 |
| 2012-08-25 04:00:00 | 17.42 |
| 2012-08-25 05:00:00 | 17.16 |
| 2012-08-25 06:00:00 | 17.68 |
| 2012-08-25 07:00:00 | 17.16 |
| 2012-08-25 08:00:00 | 17.68 |
| 2012-08-25 09:00:00 | 16.38 |
| 2012-08-25 10:00:00 | 16.64 |
| 2012-08-25 11:00:00 | 16.9 |
| 2012-08-25 12:00:00 | 16.12 |
| 2012-08-25 13:00:00 | 16.64 |
| 2012-08-25 14:00:00 | 16.9 |
| 2012-08-25 15:00:00 | 17.68 |
| 2012-08-25 16:00:00 | 16.9 |
| 2012-08-25 17:00:00 | 17.16 |
| 2012-08-25 18:00:00 | 16.64 |
| 2012-08-25 19:00:00 | 17.16 |
| 2012-08-25 20:00:00 | 17.42 |
| 2012-08-25 21:00:00 | 16.64 |
| 2012-08-25 22:00:00 | 17.16 |
| 2012-08-25 23:00:00 | 16.64 |
| 2012-08-26 | 17.16 |
| 2012-08-26 01:00:00 | 16.38 |
| 2012-08-26 02:00:00 | 16.64 |
| 2012-08-26 03:00:00 | 16.9 |
| 2012-08-26 04:00:00 | 16.64 |
| 2012-08-26 05:00:00 | 16.9 |
| 2012-08-26 06:00:00 | 17.42 |
| 2012-08-26 07:00:00 | 17.42 |
| 2012-08-26 08:00:00 | 17.42 |
| 2012-08-26 09:00:00 | 16.9 |
| 2012-08-26 10:00:00 | 16.64 |
| 2012-08-26 11:00:00 | 16.9 |
| 2012-08-26 12:00:00 | 16.64 |
| 2012-08-26 13:00:00 | 16.64 |
| 2012-08-26 14:00:00 | 17.68 |
| 2012-08-26 15:00:00 | 16.64 |
| 2012-08-26 16:00:00 | 17.16 |
| 2012-08-26 17:00:00 | 16.38 |
| 2012-08-26 18:00:00 | 16.64 |
| 2012-08-26 19:00:00 | 16.9 |
| 2012-08-26 20:00:00 | 16.9 |
| 2012-08-26 21:00:00 | 16.9 |
| 2012-08-26 22:00:00 | 16.9 |
| 2012-08-26 23:00:00 | 16.64 |
| 2012-08-27 | 16.64 |
| 2012-08-27 01:00:00 | 16.38 |
| 2012-08-27 02:00:00 | 16.64 |
| 2012-08-27 03:00:00 | 16.64 |
| 2012-08-27 04:00:00 | 17.42 |
| 2012-08-27 05:00:00 | 8.84 |
| 2012-08-27 06:00:00 | 0 |
| 2012-08-27 07:00:00 | 0 |
| 2012-08-27 08:00:00 | 0 |
| 2012-08-27 09:00:00 | 0 |
| 2012-08-27 10:00:00 | 0 |
| 2012-08-27 11:00:00 | 0 |
| 2012-08-27 12:00:00 | 0 |
| 2012-08-27 13:00:00 | 0 |
| 2012-08-27 14:00:00 | 0 |
| 2012-08-27 15:00:00 | 0 |
| 2012-08-27 16:00:00 | 0 |
| 2012-08-27 17:00:00 | 0 |
| 2012-08-27 18:00:00 | 0 |
| 2012-08-27 19:00:00 | 0 |
| 2012-08-27 20:00:00 | 0 |
| 2012-08-27 21:00:00 | 0 |
| 2012-08-27 22:00:00 | 0 |
| 2012-08-27 23:00:00 | 0 |
| 2012-08-28 | 0 |
| 2012-08-28 01:00:00 | 0 |
| 2012-08-28 02:00:00 | 0 |
| 2012-08-28 03:00:00 | 0 |
| 2012-08-28 04:00:00 | 0 |
| 2012-08-28 05:00:00 | 0 |
| 2012-08-28 06:00:00 | 0 |
| 2012-08-28 07:00:00 | 0 |
| 2012-08-28 08:00:00 | 0 |
| 2012-08-28 09:00:00 | 0 |
| 2012-08-28 10:00:00 | 0 |
| 2012-08-28 11:00:00 | 0 |
| 2012-08-28 12:00:00 | 0 |
| 2012-08-28 13:00:00 | 0 |
| 2012-08-28 14:00:00 | 0 |
| 2012-08-28 15:00:00 | 0 |
| 2012-08-28 16:00:00 | 0 |
| 2012-08-28 17:00:00 | 0 |
| 2012-08-28 18:00:00 | 0 |
| 2012-08-28 19:00:00 | 0 |
| 2012-08-28 20:00:00 | 0 |
| 2012-08-28 21:00:00 | 0 |
| 2012-08-28 22:00:00 | 0 |
| 2012-08-28 23:00:00 | 0 |
| 2012-08-29 | 0 |
| 2012-08-29 01:00:00 | 0 |
| 2012-08-29 02:00:00 | 0 |
| 2012-08-29 03:00:00 | 0 |
| 2012-08-29 04:00:00 | 0 |
| 2012-08-29 05:00:00 | 0 |
| 2012-08-29 06:00:00 | 0 |
| 2012-08-29 07:00:00 | 0 |
| 2012-08-29 08:00:00 | 0 |
| 2012-08-29 09:00:00 | 23.66 |
| 2012-08-29 10:00:00 | 46.54 |
| 2012-08-29 11:00:00 | 47.58 |
| 2012-08-29 12:00:00 | 45.76 |
| 2012-08-29 13:00:00 | 51.48 |
| 2012-08-29 14:00:00 | 48.62 |
| 2012-08-29 15:00:00 | 48.1 |
| 2012-08-29 16:00:00 | 41.08 |
| 2012-08-29 17:00:00 | 34.06 |
| 2012-08-29 18:00:00 | 29.38 |
| 2012-08-29 19:00:00 | 29.64 |
| 2012-08-29 20:00:00 | 30.16 |
| 2012-08-29 21:00:00 | 31.72 |
| 2012-08-29 22:00:00 | 24.96 |
| 2012-08-29 23:00:00 | 21.58 |
| 2012-08-30 | 20.28 |
| 2012-08-30 01:00:00 | 20.02 |
| 2012-08-30 02:00:00 | 19.76 |
| 2012-08-30 03:00:00 | 19.24 |
| 2012-08-30 04:00:00 | 19.5 |
| 2012-08-30 05:00:00 | 21.84 |
| 2012-08-30 06:00:00 | 22.62 |
| 2012-08-30 07:00:00 | 34.06 |
| 2012-08-30 08:00:00 | 44.72 |
| 2012-08-30 09:00:00 | 46.02 |
| 2012-08-30 10:00:00 | 46.02 |
| 2012-08-30 11:00:00 | 49.66 |
| 2012-08-30 12:00:00 | 49.66 |
| 2012-08-30 13:00:00 | 55.38 |
| 2012-08-30 14:00:00 | 54.08 |
| 2012-08-30 15:00:00 | 53.04 |
| 2012-08-30 16:00:00 | 36.92 |
| 2012-08-30 17:00:00 | 32.5 |
| 2012-08-30 18:00:00 | 27.82 |
| 2012-08-30 19:00:00 | 28.6 |
| 2012-08-30 20:00:00 | 29.9 |
| 2012-08-30 21:00:00 | 27.04 |
| 2012-08-30 22:00:00 | 23.14 |
| 2012-08-30 23:00:00 | 19.24 |
| 2012-08-31 | 17.68 |
| 2012-08-31 01:00:00 | 18.2 |
| 2012-08-31 02:00:00 | 17.68 |
| 2012-08-31 03:00:00 | 17.68 |
| 2012-08-31 04:00:00 | 17.94 |
| 2012-08-31 05:00:00 | 17.68 |
| 2012-08-31 06:00:00 | 24.7 |
| 2012-08-31 07:00:00 | 32.76 |
| 2012-08-31 08:00:00 | 46.54 |
| 2012-08-31 09:00:00 | 47.32 |
| 2012-08-31 10:00:00 | 45.24 |
| 2012-08-31 11:00:00 | 48.1 |
| 2012-08-31 12:00:00 | 48.36 |
| 2012-08-31 13:00:00 | 46.8 |
| 2012-08-31 14:00:00 | 47.58 |
| 2012-08-31 15:00:00 | 40.3 |
| 2012-08-31 16:00:00 | 26.78 |
| 2012-08-31 17:00:00 | 24.7 |
| 2012-08-31 18:00:00 | 26.78 |
| 2012-08-31 19:00:00 | 28.34 |
| 2012-08-31 20:00:00 | 29.38 |
| 2012-08-31 21:00:00 | 26.78 |
| 2012-08-31 22:00:00 | 22.36 |
| 2012-08-31 23:00:00 | 19.24 |
| 2012-09-01 | 17.42 |
| 2012-09-01 01:00:00 | 17.68 |
| 2012-09-01 02:00:00 | 17.42 |
| 2012-09-01 03:00:00 | 17.68 |
| 2012-09-01 04:00:00 | 17.42 |
| 2012-09-01 05:00:00 | 17.68 |
| 2012-09-01 06:00:00 | 17.68 |
| 2012-09-01 07:00:00 | 20.54 |
| 2012-09-01 08:00:00 | 22.62 |
| 2012-09-01 09:00:00 | 21.84 |
| 2012-09-01 10:00:00 | 23.14 |
| 2012-09-01 11:00:00 | 21.32 |
| 2012-09-01 12:00:00 | 21.84 |
| 2012-09-01 13:00:00 | 21.06 |
| 2012-09-01 14:00:00 | 20.54 |
| 2012-09-01 15:00:00 | 20.28 |
| 2012-09-01 16:00:00 | 19.5 |
| 2012-09-01 17:00:00 | 16.9 |
| 2012-09-01 18:00:00 | 16.38 |
| 2012-09-01 19:00:00 | 16.38 |
| 2012-09-01 20:00:00 | 16.12 |
| 2012-09-01 21:00:00 | 16.38 |
| 2012-09-01 22:00:00 | 16.12 |
| 2012-09-01 23:00:00 | 16.9 |
| 2012-09-02 | 16.38 |
| 2012-09-02 01:00:00 | 16.12 |
| 2012-09-02 02:00:00 | 16.12 |
| 2012-09-02 03:00:00 | 16.38 |
| 2012-09-02 04:00:00 | 16.12 |
| 2012-09-02 05:00:00 | 16.64 |
| 2012-09-02 06:00:00 | 16.64 |
| 2012-09-02 07:00:00 | 17.42 |
| 2012-09-02 08:00:00 | 16.64 |
| 2012-09-02 09:00:00 | 18.2 |
| 2012-09-02 10:00:00 | 16.9 |
| 2012-09-02 11:00:00 | 16.9 |
| 2012-09-02 12:00:00 | 16.64 |
| 2012-09-02 13:00:00 | 17.42 |
| 2012-09-02 14:00:00 | 17.68 |
| 2012-09-02 15:00:00 | 17.42 |
| 2012-09-02 16:00:00 | 16.64 |
| 2012-09-02 17:00:00 | 16.9 |
| 2012-09-02 18:00:00 | 17.68 |
| 2012-09-02 19:00:00 | 17.16 |
| 2012-09-02 20:00:00 | 17.42 |
| 2012-09-02 21:00:00 | 17.68 |
| 2012-09-02 22:00:00 | 17.68 |
| 2012-09-02 23:00:00 | 16.9 |
| 2012-09-03 | 16.9 |
| 2012-09-03 01:00:00 | 16.9 |
| 2012-09-03 02:00:00 | 17.94 |
| 2012-09-03 03:00:00 | 18.72 |
| 2012-09-03 04:00:00 | 18.72 |
| 2012-09-03 05:00:00 | 20.8 |
| 2012-09-03 06:00:00 | 21.06 |
| 2012-09-03 07:00:00 | 35.1 |
| 2012-09-03 08:00:00 | 54.34 |
| 2012-09-03 09:00:00 | 54.86 |
| 2012-09-03 10:00:00 | 53.56 |
| 2012-09-03 11:00:00 | 50.44 |
| 2012-09-03 12:00:00 | 47.06 |
| 2012-09-03 13:00:00 | 47.84 |
| 2012-09-03 14:00:00 | 46.28 |
| 2012-09-03 15:00:00 | 43.68 |
| 2012-09-03 16:00:00 | 37.7 |
| 2012-09-03 17:00:00 | 29.64 |
| 2012-09-03 18:00:00 | 27.3 |
| 2012-09-03 19:00:00 | 28.86 |
| 2012-09-03 20:00:00 | 31.98 |
| 2012-09-03 21:00:00 | 33.02 |
| 2012-09-03 22:00:00 | 26.52 |
| 2012-09-03 23:00:00 | 20.28 |
| 2012-09-04 | 17.42 |
| 2012-09-04 01:00:00 | 17.16 |
| 2012-09-04 02:00:00 | 17.16 |
| 2012-09-04 03:00:00 | 17.16 |
| 2012-09-04 04:00:00 | 16.9 |
| 2012-09-04 05:00:00 | 17.68 |
| 2012-09-04 06:00:00 | 23.14 |
| 2012-09-04 07:00:00 | 35.62 |
| 2012-09-04 08:00:00 | 51.48 |
| 2012-09-04 09:00:00 | 50.7 |
| 2012-09-04 10:00:00 | 47.58 |
| 2012-09-04 11:00:00 | 46.54 |
| 2012-09-04 12:00:00 | 47.58 |
| 2012-09-04 13:00:00 | 45.24 |
| 2012-09-04 14:00:00 | 47.32 |
| 2012-09-04 15:00:00 | 43.42 |
| 2012-09-04 16:00:00 | 35.62 |
| 2012-09-04 17:00:00 | 28.86 |
| 2012-09-04 18:00:00 | 27.3 |
| 2012-09-04 19:00:00 | 28.08 |
| 2012-09-04 20:00:00 | 31.98 |
| 2012-09-04 21:00:00 | 27.82 |
| 2012-09-04 22:00:00 | 21.84 |
| 2012-09-04 23:00:00 | 18.72 |
| 2012-09-05 | 16.64 |
| 2012-09-05 01:00:00 | 16.38 |
| 2012-09-05 02:00:00 | 16.38 |
| 2012-09-05 03:00:00 | 16.64 |
| 2012-09-05 04:00:00 | 16.9 |
| 2012-09-05 05:00:00 | 18.72 |
| 2012-09-05 06:00:00 | 22.36 |
| 2012-09-05 07:00:00 | 32.5 |
| 2012-09-05 08:00:00 | 49.92 |
| 2012-09-05 09:00:00 | 48.1 |
| 2012-09-05 10:00:00 | 47.58 |
| 2012-09-05 11:00:00 | 48.62 |
| 2012-09-05 12:00:00 | 47.32 |
| 2012-09-05 13:00:00 | 48.1 |
| 2012-09-05 14:00:00 | 49.14 |
| 2012-09-05 15:00:00 | 44.98 |
| 2012-09-05 16:00:00 | 41.86 |
| 2012-09-05 17:00:00 | 33.8 |
| 2012-09-05 18:00:00 | 28.6 |
| 2012-09-05 19:00:00 | 28.34 |
| 2012-09-05 20:00:00 | 30.16 |
| 2012-09-05 21:00:00 | 34.32 |
| 2012-09-05 22:00:00 | 23.14 |
| 2012-09-05 23:00:00 | 19.24 |
| 2012-09-06 | 16.64 |
| 2012-09-06 01:00:00 | 16.38 |
| 2012-09-06 02:00:00 | 16.64 |
| 2012-09-06 03:00:00 | 16.64 |
| 2012-09-06 04:00:00 | 16.64 |
| 2012-09-06 05:00:00 | 20.54 |
| 2012-09-06 06:00:00 | 24.18 |
| 2012-09-06 07:00:00 | 34.06 |
| 2012-09-06 08:00:00 | 54.6 |
| 2012-09-06 09:00:00 | 57.2 |
| 2012-09-06 10:00:00 | 53.04 |
| 2012-09-06 11:00:00 | 52.26 |
| 2012-09-06 12:00:00 | 49.66 |
| 2012-09-06 13:00:00 | 49.4 |
| 2012-09-06 14:00:00 | 48.88 |
| 2012-09-06 15:00:00 | 43.42 |
| 2012-09-06 16:00:00 | 35.88 |
| 2012-09-06 17:00:00 | 27.82 |
| 2012-09-06 18:00:00 | 25.74 |
| 2012-09-06 19:00:00 | 27.56 |
| 2012-09-06 20:00:00 | 28.34 |
| 2012-09-06 21:00:00 | 32.5 |
| 2012-09-06 22:00:00 | 22.1 |
| 2012-09-06 23:00:00 | 18.72 |
| 2012-09-07 | 16.38 |
| 2012-09-07 01:00:00 | 16.38 |
| 2012-09-07 02:00:00 | 16.38 |
| 2012-09-07 03:00:00 | 16.64 |
| 2012-09-07 04:00:00 | 17.16 |
| 2012-09-07 05:00:00 | 17.68 |
| 2012-09-07 06:00:00 | 21.06 |
| 2012-09-07 07:00:00 | 32.24 |
| 2012-09-07 08:00:00 | 44.72 |
| 2012-09-07 09:00:00 | 45.24 |
| 2012-09-07 10:00:00 | 42.12 |
| 2012-09-07 11:00:00 | 41.08 |
| 2012-09-07 12:00:00 | 41.34 |
| 2012-09-07 13:00:00 | 44.72 |
| 2012-09-07 14:00:00 | 43.16 |
| 2012-09-07 15:00:00 | 29.38 |
| 2012-09-07 16:00:00 | 22.62 |
| 2012-09-07 17:00:00 | 23.66 |
| 2012-09-07 18:00:00 | 25.48 |
| 2012-09-07 19:00:00 | 24.7 |
| 2012-09-07 20:00:00 | 25.74 |
| 2012-09-07 21:00:00 | 23.66 |
| 2012-09-07 22:00:00 | 20.54 |
| 2012-09-07 23:00:00 | 18.72 |
| 2012-09-08 | 15.86 |
| 2012-09-08 01:00:00 | 15.86 |
| 2012-09-08 02:00:00 | 15.6 |
| 2012-09-08 03:00:00 | 15.6 |
| 2012-09-08 04:00:00 | 15.86 |
| 2012-09-08 05:00:00 | 15.86 |
| 2012-09-08 06:00:00 | 16.12 |
| 2012-09-08 07:00:00 | 15.6 |
| 2012-09-08 08:00:00 | 16.64 |
| 2012-09-08 09:00:00 | 17.16 |
| 2012-09-08 10:00:00 | 18.2 |
| 2012-09-08 11:00:00 | 18.72 |
| 2012-09-08 12:00:00 | 18.98 |
| 2012-09-08 13:00:00 | 19.24 |
| 2012-09-08 14:00:00 | 17.94 |
| 2012-09-08 15:00:00 | 15.86 |
| 2012-09-08 16:00:00 | 15.34 |
| 2012-09-08 17:00:00 | 15.6 |
| 2012-09-08 18:00:00 | 15.86 |
| 2012-09-08 19:00:00 | 15.6 |
| 2012-09-08 20:00:00 | 16.12 |
| 2012-09-08 21:00:00 | 15.6 |
| 2012-09-08 22:00:00 | 15.34 |
| 2012-09-08 23:00:00 | 15.34 |
| 2012-09-09 | 14.82 |
| 2012-09-09 01:00:00 | 14.56 |
| 2012-09-09 02:00:00 | 14.82 |
| 2012-09-09 03:00:00 | 14.56 |
| 2012-09-09 04:00:00 | 14.56 |
| 2012-09-09 05:00:00 | 14.56 |
| 2012-09-09 06:00:00 | 14.82 |
| 2012-09-09 07:00:00 | 14.56 |
| 2012-09-09 08:00:00 | 15.34 |
| 2012-09-09 09:00:00 | 15.86 |
| 2012-09-09 10:00:00 | 16.12 |
| 2012-09-09 11:00:00 | 16.64 |
| 2012-09-09 12:00:00 | 15.86 |
| 2012-09-09 13:00:00 | 16.12 |
| 2012-09-09 14:00:00 | 16.12 |
| 2012-09-09 15:00:00 | 16.12 |
| 2012-09-09 16:00:00 | 16.38 |
| 2012-09-09 17:00:00 | 18.2 |
| 2012-09-09 18:00:00 | 18.46 |
| 2012-09-09 19:00:00 | 17.68 |
| 2012-09-09 20:00:00 | 16.64 |
| 2012-09-09 21:00:00 | 15.86 |
| 2012-09-09 22:00:00 | 15.6 |
| 2012-09-09 23:00:00 | 15.34 |
| 2012-09-10 | 15.34 |
| 2012-09-10 01:00:00 | 15.34 |
| 2012-09-10 02:00:00 | 15.34 |
| 2012-09-10 03:00:00 | 15.08 |
| 2012-09-10 04:00:00 | 15.34 |
| 2012-09-10 05:00:00 | 18.2 |
| 2012-09-10 06:00:00 | 19.76 |
| 2012-09-10 07:00:00 | 31.2 |
| 2012-09-10 08:00:00 | 47.58 |
| 2012-09-10 09:00:00 | 47.58 |
| 2012-09-10 10:00:00 | 44.72 |
| 2012-09-10 11:00:00 | 44.46 |
| 2012-09-10 12:00:00 | 46.54 |
| 2012-09-10 13:00:00 | 46.54 |
| 2012-09-10 14:00:00 | 49.14 |
| 2012-09-10 15:00:00 | 50.96 |
| 2012-09-10 16:00:00 | 39 |
| 2012-09-10 17:00:00 | 31.2 |
| 2012-09-10 18:00:00 | 27.56 |
| 2012-09-10 19:00:00 | 26.52 |
| 2012-09-10 20:00:00 | 30.16 |
| 2012-09-10 21:00:00 | 32.5 |
| 2012-09-10 22:00:00 | 23.92 |
| 2012-09-10 23:00:00 | 20.28 |
| 2012-09-11 | 17.42 |
| 2012-09-11 01:00:00 | 17.68 |
| 2012-09-11 02:00:00 | 17.16 |
| 2012-09-11 03:00:00 | 17.68 |
| 2012-09-11 04:00:00 | 17.94 |
| 2012-09-11 05:00:00 | 19.5 |
| 2012-09-11 06:00:00 | 22.62 |
| 2012-09-11 07:00:00 | 30.16 |
| 2012-09-11 08:00:00 | 46.28 |
| 2012-09-11 09:00:00 | 48.36 |
| 2012-09-11 10:00:00 | 45.5 |
| 2012-09-11 11:00:00 | 43.68 |
| 2012-09-11 12:00:00 | 46.28 |
| 2012-09-11 13:00:00 | 52.78 |
| 2012-09-11 14:00:00 | 53.82 |
| 2012-09-11 15:00:00 | 50.18 |
| 2012-09-11 16:00:00 | 40.04 |
| 2012-09-11 17:00:00 | 34.84 |
| 2012-09-11 18:00:00 | 31.72 |
| 2012-09-11 19:00:00 | 33.54 |
| 2012-09-11 20:00:00 | 34.58 |
| 2012-09-11 21:00:00 | 35.88 |
| 2012-09-11 22:00:00 | 24.96 |
| 2012-09-11 23:00:00 | 20.8 |
| 2012-09-12 | 17.68 |
| 2012-09-12 01:00:00 | 18.2 |
| 2012-09-12 02:00:00 | 17.68 |
| 2012-09-12 03:00:00 | 17.94 |
| 2012-09-12 04:00:00 | 17.94 |
| 2012-09-12 05:00:00 | 19.24 |
| 2012-09-12 06:00:00 | 20.54 |
| 2012-09-12 07:00:00 | 33.28 |
| 2012-09-12 08:00:00 | 57.98 |
| 2012-09-12 09:00:00 | 54.86 |
| 2012-09-12 10:00:00 | 52.78 |
| 2012-09-12 11:00:00 | 50.18 |
| 2012-09-12 12:00:00 | 50.18 |
| 2012-09-12 13:00:00 | 49.4 |
| 2012-09-12 14:00:00 | 49.14 |
| 2012-09-12 15:00:00 | 48.1 |
| 2012-09-12 16:00:00 | 39.26 |
| 2012-09-12 17:00:00 | 30.68 |
| 2012-09-12 18:00:00 | 27.56 |
| 2012-09-12 19:00:00 | 29.38 |
| 2012-09-12 20:00:00 | 30.16 |
| 2012-09-12 21:00:00 | 30.16 |
| 2012-09-12 22:00:00 | 22.1 |
| 2012-09-12 23:00:00 | 18.98 |
| 2012-09-13 | 16.12 |
| 2012-09-13 01:00:00 | 15.86 |
| 2012-09-13 02:00:00 | 16.12 |
| 2012-09-13 03:00:00 | 16.38 |
| 2012-09-13 04:00:00 | 17.16 |
| 2012-09-13 05:00:00 | 18.72 |
| 2012-09-13 06:00:00 | 21.84 |
| 2012-09-13 07:00:00 | 30.68 |
| 2012-09-13 08:00:00 | 50.18 |
| 2012-09-13 09:00:00 | 52.78 |
| 2012-09-13 10:00:00 | 51.74 |
| 2012-09-13 11:00:00 | 49.14 |
| 2012-09-13 12:00:00 | 48.36 |
| 2012-09-13 13:00:00 | 49.14 |
| 2012-09-13 14:00:00 | 47.32 |
| 2012-09-13 15:00:00 | 44.72 |
| 2012-09-13 16:00:00 | 35.1 |
| 2012-09-13 17:00:00 | 26.52 |
| 2012-09-13 18:00:00 | 26.52 |
| 2012-09-13 19:00:00 | 28.08 |
| 2012-09-13 20:00:00 | 29.9 |
| 2012-09-13 21:00:00 | 29.12 |
| 2012-09-13 22:00:00 | 22.36 |
| 2012-09-13 23:00:00 | 20.54 |
| 2012-09-14 | 17.16 |
| 2012-09-14 01:00:00 | 16.12 |
| 2012-09-14 02:00:00 | 16.12 |
| 2012-09-14 03:00:00 | 16.64 |
| 2012-09-14 04:00:00 | 16.12 |
| 2012-09-14 05:00:00 | 18.98 |
| 2012-09-14 06:00:00 | 19.76 |
| 2012-09-14 07:00:00 | 30.42 |
| 2012-09-14 08:00:00 | 45.5 |
| 2012-09-14 09:00:00 | 47.32 |
| 2012-09-14 10:00:00 | 46.02 |
| 2012-09-14 11:00:00 | 46.54 |
| 2012-09-14 12:00:00 | 42.38 |
| 2012-09-14 13:00:00 | 40.3 |
| 2012-09-14 14:00:00 | 39 |
| 2012-09-14 15:00:00 | 35.62 |
| 2012-09-14 16:00:00 | 28.86 |
| 2012-09-14 17:00:00 | 23.92 |
| 2012-09-14 18:00:00 | 23.92 |
| 2012-09-14 19:00:00 | 24.44 |
| 2012-09-14 20:00:00 | 27.3 |
| 2012-09-14 21:00:00 | 27.04 |
| 2012-09-14 22:00:00 | 21.32 |
| 2012-09-14 23:00:00 | 18.72 |
| 2012-09-15 | 16.38 |
| 2012-09-15 01:00:00 | 16.64 |
| 2012-09-15 02:00:00 | 16.38 |
| 2012-09-15 03:00:00 | 16.64 |
| 2012-09-15 04:00:00 | 16.38 |
| 2012-09-15 05:00:00 | 16.9 |
| 2012-09-15 06:00:00 | 16.9 |
| 2012-09-15 07:00:00 | 16.9 |
| 2012-09-15 08:00:00 | 16.9 |
| 2012-09-15 09:00:00 | 17.42 |
| 2012-09-15 10:00:00 | 16.9 |
| 2012-09-15 11:00:00 | 17.42 |
| 2012-09-15 12:00:00 | 17.42 |
| 2012-09-15 13:00:00 | 17.16 |
| 2012-09-15 14:00:00 | 17.16 |
| 2012-09-15 15:00:00 | 17.42 |
| 2012-09-15 16:00:00 | 16.9 |
| 2012-09-15 17:00:00 | 17.42 |
| 2012-09-15 18:00:00 | 17.42 |
| 2012-09-15 19:00:00 | 17.94 |
| 2012-09-15 20:00:00 | 17.94 |
| 2012-09-15 21:00:00 | 16.38 |
| 2012-09-15 22:00:00 | 16.12 |
| 2012-09-15 23:00:00 | 15.86 |
| 2012-09-16 | 16.12 |
| 2012-09-16 01:00:00 | 16.12 |
| 2012-09-16 02:00:00 | 16.12 |
| 2012-09-16 03:00:00 | 16.38 |
| 2012-09-16 04:00:00 | 16.38 |
| 2012-09-16 05:00:00 | 16.38 |
| 2012-09-16 06:00:00 | 16.38 |
| 2012-09-16 07:00:00 | 16.38 |
| 2012-09-16 08:00:00 | 16.38 |
| 2012-09-16 09:00:00 | 17.16 |
| 2012-09-16 10:00:00 | 16.64 |
| 2012-09-16 11:00:00 | 16.9 |
| 2012-09-16 12:00:00 | 16.64 |
| 2012-09-16 13:00:00 | 16.9 |
| 2012-09-16 14:00:00 | 16.64 |
| 2012-09-16 15:00:00 | 16.12 |
| 2012-09-16 16:00:00 | 16.38 |
| 2012-09-16 17:00:00 | 16.9 |
| 2012-09-16 18:00:00 | 16.64 |
| 2012-09-16 19:00:00 | 16.64 |
| 2012-09-16 20:00:00 | 17.16 |
| 2012-09-16 21:00:00 | 17.16 |
| 2012-09-16 22:00:00 | 16.64 |
| 2012-09-16 23:00:00 | 16.12 |
| 2012-09-17 | 16.12 |
| 2012-09-17 01:00:00 | 16.12 |
| 2012-09-17 02:00:00 | 16.12 |
| 2012-09-17 03:00:00 | 16.12 |
| 2012-09-17 04:00:00 | 17.16 |
| 2012-09-17 05:00:00 | 18.46 |
| 2012-09-17 06:00:00 | 22.1 |
| 2012-09-17 07:00:00 | 31.2 |
| 2012-09-17 08:00:00 | 47.06 |
| 2012-09-17 09:00:00 | 47.06 |
| 2012-09-17 10:00:00 | 43.42 |
| 2012-09-17 11:00:00 | 42.38 |
| 2012-09-17 12:00:00 | 42.64 |
| 2012-09-17 13:00:00 | 44.72 |
| 2012-09-17 14:00:00 | 43.94 |
| 2012-09-17 15:00:00 | 44.72 |
| 2012-09-17 16:00:00 | 38.22 |
| 2012-09-17 17:00:00 | 30.42 |
| 2012-09-17 18:00:00 | 26.52 |
| 2012-09-17 19:00:00 | 27.82 |
| 2012-09-17 20:00:00 | 31.2 |
| 2012-09-17 21:00:00 | 31.98 |
| 2012-09-17 22:00:00 | 24.7 |
| 2012-09-17 23:00:00 | 21.06 |
| 2012-09-18 | 17.94 |
| 2012-09-18 01:00:00 | 17.16 |
| 2012-09-18 02:00:00 | 16.9 |
| 2012-09-18 03:00:00 | 17.16 |
| 2012-09-18 04:00:00 | 17.16 |
| 2012-09-18 05:00:00 | 18.72 |
| 2012-09-18 06:00:00 | 22.1 |
| 2012-09-18 07:00:00 | 30.16 |
| 2012-09-18 08:00:00 | 45.76 |
| 2012-09-18 09:00:00 | 45.24 |
| 2012-09-18 10:00:00 | 42.12 |
| 2012-09-18 11:00:00 | 41.86 |
| 2012-09-18 12:00:00 | 42.38 |
| 2012-09-18 13:00:00 | 45.24 |
| 2012-09-18 14:00:00 | 44.2 |
| 2012-09-18 15:00:00 | 42.12 |
| 2012-09-18 16:00:00 | 34.06 |
| 2012-09-18 17:00:00 | 26.26 |
| 2012-09-18 18:00:00 | 25.74 |
| 2012-09-18 19:00:00 | 27.82 |
| 2012-09-18 20:00:00 | 31.2 |
| 2012-09-18 21:00:00 | 26.26 |
| 2012-09-18 22:00:00 | 23.92 |
| 2012-09-18 23:00:00 | 20.02 |
| 2012-09-19 | 16.9 |
| 2012-09-19 01:00:00 | 16.9 |
| 2012-09-19 02:00:00 | 16.64 |
| 2012-09-19 03:00:00 | 17.16 |
| 2012-09-19 04:00:00 | 17.42 |
| 2012-09-19 05:00:00 | 18.72 |
| 2012-09-19 06:00:00 | 20.8 |
| 2012-09-19 07:00:00 | 31.72 |
| 2012-09-19 08:00:00 | 50.44 |
| 2012-09-19 09:00:00 | 49.66 |
| 2012-09-19 10:00:00 | 53.82 |
| 2012-09-19 11:00:00 | 58.24 |
| 2012-09-19 12:00:00 | 57.72 |
| 2012-09-19 13:00:00 | 54.86 |
| 2012-09-19 14:00:00 | 54.34 |
| 2012-09-19 15:00:00 | 52.78 |
| 2012-09-19 16:00:00 | 42.12 |
| 2012-09-19 17:00:00 | 32.5 |
| 2012-09-19 18:00:00 | 29.64 |
| 2012-09-19 19:00:00 | 30.68 |
| 2012-09-19 20:00:00 | 35.36 |
| 2012-09-19 21:00:00 | 26.26 |
| 2012-09-19 22:00:00 | 23.14 |
| 2012-09-19 23:00:00 | 20.28 |
| 2012-09-20 | 16.9 |
| 2012-09-20 01:00:00 | 16.64 |
| 2012-09-20 02:00:00 | 16.38 |
| 2012-09-20 03:00:00 | 16.38 |
| 2012-09-20 04:00:00 | 16.64 |
| 2012-09-20 05:00:00 | 17.42 |
| 2012-09-20 06:00:00 | 22.36 |
| 2012-09-20 07:00:00 | 32.5 |
| 2012-09-20 08:00:00 | 49.66 |
| 2012-09-20 09:00:00 | 50.44 |
| 2012-09-20 10:00:00 | 48.36 |
| 2012-09-20 11:00:00 | 47.32 |
| 2012-09-20 12:00:00 | 44.98 |
| 2012-09-20 13:00:00 | 47.06 |
| 2012-09-20 14:00:00 | 44.2 |
| 2012-09-20 15:00:00 | 40.04 |
| 2012-09-20 16:00:00 | 34.58 |
| 2012-09-20 17:00:00 | 29.12 |
| 2012-09-20 18:00:00 | 27.04 |
| 2012-09-20 19:00:00 | 29.12 |
| 2012-09-20 20:00:00 | 32.5 |
| 2012-09-20 21:00:00 | 25.48 |
| 2012-09-20 22:00:00 | 22.62 |
| 2012-09-20 23:00:00 | 19.76 |
| 2012-09-21 | 17.16 |
| 2012-09-21 01:00:00 | 16.9 |
| 2012-09-21 02:00:00 | 16.9 |
| 2012-09-21 03:00:00 | 17.42 |
| 2012-09-21 04:00:00 | 16.9 |
| 2012-09-21 05:00:00 | 20.28 |
| 2012-09-21 06:00:00 | 21.06 |
| 2012-09-21 07:00:00 | 31.72 |
| 2012-09-21 08:00:00 | 46.54 |
| 2012-09-21 09:00:00 | 45.5 |
| 2012-09-21 10:00:00 | 42.9 |
| 2012-09-21 11:00:00 | 41.08 |
| 2012-09-21 12:00:00 | 41.08 |
| 2012-09-21 13:00:00 | 40.04 |
| 2012-09-21 14:00:00 | 39 |
| 2012-09-21 15:00:00 | 34.58 |
| 2012-09-21 16:00:00 | 27.04 |
| 2012-09-21 17:00:00 | 24.7 |
| 2012-09-21 18:00:00 | 24.44 |
| 2012-09-21 19:00:00 | 25.74 |
| 2012-09-21 20:00:00 | 23.66 |
| 2012-09-21 21:00:00 | 22.62 |
| 2012-09-21 22:00:00 | 20.8 |
| 2012-09-21 23:00:00 | 17.16 |
| 2012-09-22 | 16.12 |
| 2012-09-22 01:00:00 | 16.38 |
| 2012-09-22 02:00:00 | 16.12 |
| 2012-09-22 03:00:00 | 16.38 |
| 2012-09-22 04:00:00 | 16.38 |
| 2012-09-22 05:00:00 | 16.9 |
| 2012-09-22 06:00:00 | 17.16 |
| 2012-09-22 07:00:00 | 17.68 |
| 2012-09-22 08:00:00 | 18.46 |
| 2012-09-22 09:00:00 | 18.72 |
| 2012-09-22 10:00:00 | 18.72 |
| 2012-09-22 11:00:00 | 18.46 |
| 2012-09-22 12:00:00 | 17.94 |
| 2012-09-22 13:00:00 | 17.94 |
| 2012-09-22 14:00:00 | 17.94 |
| 2012-09-22 15:00:00 | 17.16 |
| 2012-09-22 16:00:00 | 17.42 |
| 2012-09-22 17:00:00 | 16.64 |
| 2012-09-22 18:00:00 | 17.16 |
| 2012-09-22 19:00:00 | 16.9 |
| 2012-09-22 20:00:00 | 17.16 |
| 2012-09-22 21:00:00 | 17.68 |
| 2012-09-22 22:00:00 | 16.9 |
| 2012-09-22 23:00:00 | 16.64 |
| 2012-09-23 | 16.38 |
| 2012-09-23 01:00:00 | 16.38 |
| 2012-09-23 02:00:00 | 16.64 |
| 2012-09-23 03:00:00 | 16.64 |
| 2012-09-23 04:00:00 | 16.9 |
| 2012-09-23 05:00:00 | 17.16 |
| 2012-09-23 06:00:00 | 17.16 |
| 2012-09-23 07:00:00 | 17.42 |
| 2012-09-23 08:00:00 | 16.64 |
| 2012-09-23 09:00:00 | 17.16 |
| 2012-09-23 10:00:00 | 16.9 |
| 2012-09-23 11:00:00 | 17.16 |
| 2012-09-23 12:00:00 | 16.9 |
| 2012-09-23 13:00:00 | 16.64 |
| 2012-09-23 14:00:00 | 16.64 |
| 2012-09-23 15:00:00 | 16.38 |
| 2012-09-23 16:00:00 | 16.64 |
| 2012-09-23 17:00:00 | 16.64 |
| 2012-09-23 18:00:00 | 17.42 |
| 2012-09-23 19:00:00 | 20.54 |
| 2012-09-23 20:00:00 | 20.02 |
| 2012-09-23 21:00:00 | 16.9 |
| 2012-09-23 22:00:00 | 16.12 |
| 2012-09-23 23:00:00 | 15.86 |
| 2012-09-24 | 16.12 |
| 2012-09-24 01:00:00 | 15.86 |
| 2012-09-24 02:00:00 | 16.12 |
| 2012-09-24 03:00:00 | 16.12 |
| 2012-09-24 04:00:00 | 16.38 |
| 2012-09-24 05:00:00 | 18.72 |
| 2012-09-24 06:00:00 | 22.1 |
| 2012-09-24 07:00:00 | 29.64 |
| 2012-09-24 08:00:00 | 47.84 |
| 2012-09-24 09:00:00 | 48.36 |
| 2012-09-24 10:00:00 | 46.28 |
| 2012-09-24 11:00:00 | 44.46 |
| 2012-09-24 12:00:00 | 46.8 |
| 2012-09-24 13:00:00 | 46.02 |
| 2012-09-24 14:00:00 | 42.64 |
| 2012-09-24 15:00:00 | 43.94 |
| 2012-09-24 16:00:00 | 39.78 |
| 2012-09-24 17:00:00 | 32.5 |
| 2012-09-24 18:00:00 | 27.82 |
| 2012-09-24 19:00:00 | 32.76 |
| 2012-09-24 20:00:00 | 31.46 |
| 2012-09-24 21:00:00 | 33.8 |
| 2012-09-24 22:00:00 | 24.7 |
| 2012-09-24 23:00:00 | 21.06 |
| 2012-09-25 | 18.46 |
| 2012-09-25 01:00:00 | 17.94 |
| 2012-09-25 02:00:00 | 18.2 |
| 2012-09-25 03:00:00 | 17.94 |
| 2012-09-25 04:00:00 | 18.46 |
| 2012-09-25 05:00:00 | 19.5 |
| 2012-09-25 06:00:00 | 21.58 |
| 2012-09-25 07:00:00 | 33.02 |
| 2012-09-25 08:00:00 | 52 |
| 2012-09-25 09:00:00 | 52 |
| 2012-09-25 10:00:00 | 49.4 |
| 2012-09-25 11:00:00 | 45.5 |
| 2012-09-25 12:00:00 | 43.16 |
| 2012-09-25 13:00:00 | 40.82 |
| 2012-09-25 14:00:00 | 40.56 |
| 2012-09-25 15:00:00 | 41.34 |
| 2012-09-25 16:00:00 | 34.32 |
| 2012-09-25 17:00:00 | 28.34 |
| 2012-09-25 18:00:00 | 28.08 |
| 2012-09-25 19:00:00 | 30.68 |
| 2012-09-25 20:00:00 | 31.72 |
| 2012-09-25 21:00:00 | 34.06 |
| 2012-09-25 22:00:00 | 24.44 |
| 2012-09-25 23:00:00 | 20.54 |
| 2012-09-26 | 16.64 |
| 2012-09-26 01:00:00 | 16.64 |
| 2012-09-26 02:00:00 | 16.38 |
| 2012-09-26 03:00:00 | 16.38 |
| 2012-09-26 04:00:00 | 16.64 |
| 2012-09-26 05:00:00 | 17.94 |
| 2012-09-26 06:00:00 | 22.36 |
| 2012-09-26 07:00:00 | 33.54 |
| 2012-09-26 08:00:00 | 48.62 |
| 2012-09-26 09:00:00 | 50.96 |
| 2012-09-26 10:00:00 | 50.18 |
| 2012-09-26 11:00:00 | 46.8 |
| 2012-09-26 12:00:00 | 44.2 |
| 2012-09-26 13:00:00 | 44.72 |
| 2012-09-26 14:00:00 | 45.5 |
| 2012-09-26 15:00:00 | 44.98 |
| 2012-09-26 16:00:00 | 38.74 |
| 2012-09-26 17:00:00 | 34.84 |
| 2012-09-26 18:00:00 | 29.12 |
| 2012-09-26 19:00:00 | 32.76 |
| 2012-09-26 20:00:00 | 33.02 |
| 2012-09-26 21:00:00 | 34.06 |
| 2012-09-26 22:00:00 | 25.22 |
| 2012-09-26 23:00:00 | 21.06 |
| 2012-09-27 | 18.98 |
| 2012-09-27 01:00:00 | 18.98 |
| 2012-09-27 02:00:00 | 17.94 |
| 2012-09-27 03:00:00 | 17.68 |
| 2012-09-27 04:00:00 | 17.94 |
| 2012-09-27 05:00:00 | 21.32 |
| 2012-09-27 06:00:00 | 22.88 |
| 2012-09-27 07:00:00 | 33.54 |
| 2012-09-27 08:00:00 | 50.18 |
| 2012-09-27 09:00:00 | 48.62 |
| 2012-09-27 10:00:00 | 48.1 |
| 2012-09-27 11:00:00 | 47.06 |
| 2012-09-27 12:00:00 | 44.2 |
| 2012-09-27 13:00:00 | 47.58 |
| 2012-09-27 14:00:00 | 49.4 |
| 2012-09-27 15:00:00 | 46.54 |
| 2012-09-27 16:00:00 | 34.06 |
| 2012-09-27 17:00:00 | 26.78 |
| 2012-09-27 18:00:00 | 27.3 |
| 2012-09-27 19:00:00 | 32.24 |
| 2012-09-27 20:00:00 | 33.8 |
| 2012-09-27 21:00:00 | 31.2 |
| 2012-09-27 22:00:00 | 27.04 |
| 2012-09-27 23:00:00 | 22.88 |
| 2012-09-28 | 19.76 |
| 2012-09-28 01:00:00 | 19.76 |
| 2012-09-28 02:00:00 | 19.5 |
| 2012-09-28 03:00:00 | 19.5 |
| 2012-09-28 04:00:00 | 20.02 |
| 2012-09-28 05:00:00 | 19.76 |
| 2012-09-28 06:00:00 | 20.8 |
| 2012-09-28 07:00:00 | 18.98 |
| 2012-09-28 08:00:00 | 17.94 |
| 2012-09-28 09:00:00 | 17.94 |
| 2012-09-28 10:00:00 | 17.68 |
| 2012-09-28 11:00:00 | 17.94 |
| 2012-09-28 12:00:00 | 18.2 |
| 2012-09-28 13:00:00 | 17.94 |
| 2012-09-28 14:00:00 | 17.68 |
| 2012-09-28 15:00:00 | 17.42 |
| 2012-09-28 16:00:00 | 17.42 |
| 2012-09-28 17:00:00 | 17.42 |
| 2012-09-28 18:00:00 | 17.42 |
| 2012-09-28 19:00:00 | 17.68 |
| 2012-09-28 20:00:00 | 17.94 |
| 2012-09-28 21:00:00 | 17.94 |
| 2012-09-28 22:00:00 | 17.42 |
| 2012-09-28 23:00:00 | 17.16 |
| 2012-09-29 | 17.42 |
| 2012-09-29 01:00:00 | 16.9 |
| 2012-09-29 02:00:00 | 16.9 |
| 2012-09-29 03:00:00 | 16.9 |
| 2012-09-29 04:00:00 | 16.9 |
| 2012-09-29 05:00:00 | 17.68 |
| 2012-09-29 06:00:00 | 17.68 |
| 2012-09-29 07:00:00 | 17.94 |
| 2012-09-29 08:00:00 | 17.68 |
| 2012-09-29 09:00:00 | 17.94 |
| 2012-09-29 10:00:00 | 18.46 |
| 2012-09-29 11:00:00 | 18.2 |
| 2012-09-29 12:00:00 | 18.46 |
| 2012-09-29 13:00:00 | 18.72 |
| 2012-09-29 14:00:00 | 18.46 |
| 2012-09-29 15:00:00 | 18.98 |
| 2012-09-29 16:00:00 | 17.94 |
| 2012-09-29 17:00:00 | 18.2 |
| 2012-09-29 18:00:00 | 17.94 |
| 2012-09-29 19:00:00 | 18.2 |
| 2012-09-29 20:00:00 | 17.68 |
| 2012-09-29 21:00:00 | 17.42 |
| 2012-09-29 22:00:00 | 17.42 |
| 2012-09-29 23:00:00 | 16.64 |
| 2012-09-30 | 16.38 |
| 2012-09-30 01:00:00 | 16.64 |
| 2012-09-30 02:00:00 | 16.38 |
| 2012-09-30 03:00:00 | 16.64 |
| 2012-09-30 04:00:00 | 16.64 |
| 2012-09-30 05:00:00 | 17.16 |
| 2012-09-30 06:00:00 | 17.42 |
| 2012-09-30 07:00:00 | 17.16 |
| 2012-09-30 08:00:00 | 17.42 |
| 2012-09-30 09:00:00 | 17.42 |
| 2012-09-30 10:00:00 | 17.16 |
| 2012-09-30 11:00:00 | 16.9 |
| 2012-09-30 12:00:00 | 16.9 |
| 2012-09-30 13:00:00 | 17.16 |
| 2012-09-30 14:00:00 | 17.16 |
| 2012-09-30 15:00:00 | 17.42 |
| 2012-09-30 16:00:00 | 16.9 |
| 2012-09-30 17:00:00 | 16.9 |
| 2012-09-30 18:00:00 | 16.9 |
| 2012-09-30 19:00:00 | 17.42 |
| 2012-09-30 20:00:00 | 17.42 |
| 2012-09-30 21:00:00 | 17.68 |
| 2012-09-30 22:00:00 | 17.42 |
| 2012-09-30 23:00:00 | 16.9 |
| 2012-10-01 | 16.9 |
| 2012-10-01 01:00:00 | 16.9 |
| 2012-10-01 02:00:00 | 16.64 |
| 2012-10-01 03:00:00 | 17.16 |
| 2012-10-01 04:00:00 | 17.16 |
| 2012-10-01 05:00:00 | 19.5 |
| 2012-10-01 06:00:00 | 20.02 |
| 2012-10-01 07:00:00 | 32.24 |
| 2012-10-01 08:00:00 | 55.12 |
| 2012-10-01 09:00:00 | 56.42 |
| 2012-10-01 10:00:00 | 56.42 |
| 2012-10-01 11:00:00 | 50.7 |
| 2012-10-01 12:00:00 | 46.02 |
| 2012-10-01 13:00:00 | 49.66 |
| 2012-10-01 14:00:00 | 50.18 |
| 2012-10-01 15:00:00 | 47.58 |
| 2012-10-01 16:00:00 | 36.4 |
| 2012-10-01 17:00:00 | 31.72 |
| 2012-10-01 18:00:00 | 31.2 |
| 2012-10-01 19:00:00 | 31.46 |
| 2012-10-01 20:00:00 | 35.1 |
| 2012-10-01 21:00:00 | 34.58 |
| 2012-10-01 22:00:00 | 23.92 |
| 2012-10-01 23:00:00 | 20.28 |
| 2012-10-02 | 17.16 |
| 2012-10-02 01:00:00 | 17.16 |
| 2012-10-02 02:00:00 | 17.16 |
| 2012-10-02 03:00:00 | 17.16 |
| 2012-10-02 04:00:00 | 17.42 |
| 2012-10-02 05:00:00 | 20.02 |
| 2012-10-02 06:00:00 | 23.92 |
| 2012-10-02 07:00:00 | 36.4 |
| 2012-10-02 08:00:00 | 54.34 |
| 2012-10-02 09:00:00 | 56.16 |
| 2012-10-02 10:00:00 | 53.04 |
| 2012-10-02 11:00:00 | 52.52 |
| 2012-10-02 12:00:00 | 50.96 |
| 2012-10-02 13:00:00 | 51.22 |
| 2012-10-02 14:00:00 | 46.8 |
| 2012-10-02 15:00:00 | 48.88 |
| 2012-10-02 16:00:00 | 40.82 |
| 2012-10-02 17:00:00 | 31.98 |
| 2012-10-02 18:00:00 | 29.12 |
| 2012-10-02 19:00:00 | 34.06 |
| 2012-10-02 20:00:00 | 33.8 |
| 2012-10-02 21:00:00 | 33.02 |
| 2012-10-02 22:00:00 | 24.7 |
| 2012-10-02 23:00:00 | 19.24 |
| 2012-10-03 | 17.42 |
| 2012-10-03 01:00:00 | 17.16 |
| 2012-10-03 02:00:00 | 17.16 |
| 2012-10-03 03:00:00 | 16.9 |
| 2012-10-03 04:00:00 | 17.16 |
| 2012-10-03 05:00:00 | 21.32 |
| 2012-10-03 06:00:00 | 21.58 |
| 2012-10-03 07:00:00 | 36.66 |
| 2012-10-03 08:00:00 | 54.08 |
| 2012-10-03 09:00:00 | 54.86 |
| 2012-10-03 10:00:00 | 55.64 |
| 2012-10-03 11:00:00 | 52 |
| 2012-10-03 12:00:00 | 51.22 |
| 2012-10-03 13:00:00 | 48.88 |
| 2012-10-03 14:00:00 | 47.32 |
| 2012-10-03 15:00:00 | 43.42 |
| 2012-10-03 16:00:00 | 37.7 |
| 2012-10-03 17:00:00 | 30.42 |
| 2012-10-03 18:00:00 | 27.82 |
| 2012-10-03 19:00:00 | 31.98 |
| 2012-10-03 20:00:00 | 33.28 |
| 2012-10-03 21:00:00 | 27.56 |
| 2012-10-03 22:00:00 | 22.62 |
| 2012-10-03 23:00:00 | 20.28 |
| 2012-10-04 | 16.38 |
| 2012-10-04 01:00:00 | 16.64 |
| 2012-10-04 02:00:00 | 16.38 |
| 2012-10-04 03:00:00 | 16.64 |
| 2012-10-04 04:00:00 | 16.9 |
| 2012-10-04 05:00:00 | 19.24 |
| 2012-10-04 06:00:00 | 23.92 |
| 2012-10-04 07:00:00 | 34.32 |
| 2012-10-04 08:00:00 | 52.78 |
| 2012-10-04 09:00:00 | 49.66 |
| 2012-10-04 10:00:00 | 46.02 |
| 2012-10-04 11:00:00 | 44.72 |
| 2012-10-04 12:00:00 | 43.94 |
| 2012-10-04 13:00:00 | 47.06 |
| 2012-10-04 14:00:00 | 43.42 |
| 2012-10-04 15:00:00 | 40.3 |
| 2012-10-04 16:00:00 | 34.32 |
| 2012-10-04 17:00:00 | 29.12 |
| 2012-10-04 18:00:00 | 29.38 |
| 2012-10-04 19:00:00 | 31.98 |
| 2012-10-04 20:00:00 | 34.32 |
| 2012-10-04 21:00:00 | 33.28 |
| 2012-10-04 22:00:00 | 25.22 |
| 2012-10-04 23:00:00 | 19.5 |
| 2012-10-05 | 17.94 |
| 2012-10-05 01:00:00 | 17.16 |
| 2012-10-05 02:00:00 | 17.16 |
| 2012-10-05 03:00:00 | 17.16 |
| 2012-10-05 04:00:00 | 17.42 |
| 2012-10-05 05:00:00 | 20.54 |
| 2012-10-05 06:00:00 | 22.36 |
| 2012-10-05 07:00:00 | 33.8 |
| 2012-10-05 08:00:00 | 48.88 |
| 2012-10-05 09:00:00 | 49.66 |
| 2012-10-05 10:00:00 | 47.58 |
| 2012-10-05 11:00:00 | 44.46 |
| 2012-10-05 12:00:00 | 41.6 |
| 2012-10-05 13:00:00 | 42.9 |
| 2012-10-05 14:00:00 | 40.3 |
| 2012-10-05 15:00:00 | 38.22 |
| 2012-10-05 16:00:00 | 29.9 |
| 2012-10-05 17:00:00 | 25.22 |
| 2012-10-05 18:00:00 | 26.26 |
| 2012-10-05 19:00:00 | 30.16 |
| 2012-10-05 20:00:00 | 26 |
| 2012-10-05 21:00:00 | 24.7 |
| 2012-10-05 22:00:00 | 22.1 |
| 2012-10-05 23:00:00 | 18.46 |
| 2012-10-06 | 17.16 |
| 2012-10-06 01:00:00 | 16.9 |
| 2012-10-06 02:00:00 | 16.9 |
| 2012-10-06 03:00:00 | 16.9 |
| 2012-10-06 04:00:00 | 17.42 |
| 2012-10-06 05:00:00 | 17.42 |
| 2012-10-06 06:00:00 | 17.94 |
| 2012-10-06 07:00:00 | 18.98 |
| 2012-10-06 08:00:00 | 18.46 |
| 2012-10-06 09:00:00 | 17.94 |
| 2012-10-06 10:00:00 | 18.2 |
| 2012-10-06 11:00:00 | 17.94 |
| 2012-10-06 12:00:00 | 18.72 |
| 2012-10-06 13:00:00 | 18.46 |
| 2012-10-06 14:00:00 | 18.72 |
| 2012-10-06 15:00:00 | 18.72 |
| 2012-10-06 16:00:00 | 18.2 |
| 2012-10-06 17:00:00 | 17.94 |
| 2012-10-06 18:00:00 | 18.98 |
| 2012-10-06 19:00:00 | 18.98 |
| 2012-10-06 20:00:00 | 18.98 |
| 2012-10-06 21:00:00 | 18.2 |
| 2012-10-06 22:00:00 | 17.94 |
| 2012-10-06 23:00:00 | 17.42 |
| 2012-10-07 | 17.68 |
| 2012-10-07 01:00:00 | 17.42 |
| 2012-10-07 02:00:00 | 17.16 |
| 2012-10-07 03:00:00 | 17.42 |
| 2012-10-07 04:00:00 | 17.16 |
| 2012-10-07 05:00:00 | 17.68 |
| 2012-10-07 06:00:00 | 17.94 |
| 2012-10-07 07:00:00 | 17.42 |
| 2012-10-07 08:00:00 | 17.68 |
| 2012-10-07 09:00:00 | 17.68 |
| 2012-10-07 10:00:00 | 16.9 |
| 2012-10-07 11:00:00 | 17.68 |
| 2012-10-07 12:00:00 | 17.16 |
| 2012-10-07 13:00:00 | 17.42 |
| 2012-10-07 14:00:00 | 17.16 |
| 2012-10-07 15:00:00 | 17.16 |
| 2012-10-07 16:00:00 | 17.16 |
| 2012-10-07 17:00:00 | 17.68 |
| 2012-10-07 18:00:00 | 17.42 |
| 2012-10-07 19:00:00 | 17.68 |
| 2012-10-07 20:00:00 | 17.42 |
| 2012-10-07 21:00:00 | 17.68 |
| 2012-10-07 22:00:00 | 17.16 |
| 2012-10-07 23:00:00 | 16.64 |
| 2012-10-08 | 16.9 |
| 2012-10-08 01:00:00 | 16.38 |
| 2012-10-08 02:00:00 | 16.9 |
| 2012-10-08 03:00:00 | 16.9 |
| 2012-10-08 04:00:00 | 17.68 |
| 2012-10-08 05:00:00 | 18.46 |
| 2012-10-08 06:00:00 | 22.36 |
| 2012-10-08 07:00:00 | 31.46 |
| 2012-10-08 08:00:00 | 50.7 |
| 2012-10-08 09:00:00 | 52.26 |
| 2012-10-08 10:00:00 | 48.62 |
| 2012-10-08 11:00:00 | 45.76 |
| 2012-10-08 12:00:00 | 45.24 |
| 2012-10-08 13:00:00 | 46.02 |
| 2012-10-08 14:00:00 | 44.46 |
| 2012-10-08 15:00:00 | 42.9 |
| 2012-10-08 16:00:00 | 39.78 |
| 2012-10-08 17:00:00 | 31.46 |
| 2012-10-08 18:00:00 | 29.38 |
| 2012-10-08 19:00:00 | 32.24 |
| 2012-10-08 20:00:00 | 35.1 |
| 2012-10-08 21:00:00 | 32.24 |
| 2012-10-08 22:00:00 | 23.66 |
| 2012-10-08 23:00:00 | 18.98 |
| 2012-10-09 | 17.42 |
| 2012-10-09 01:00:00 | 17.68 |
| 2012-10-09 02:00:00 | 17.42 |
| 2012-10-09 03:00:00 | 17.68 |
| 2012-10-09 04:00:00 | 17.94 |
| 2012-10-09 05:00:00 | 21.32 |
| 2012-10-09 06:00:00 | 23.14 |
| 2012-10-09 07:00:00 | 34.84 |
| 2012-10-09 08:00:00 | 54.34 |
| 2012-10-09 09:00:00 | 52.52 |
| 2012-10-09 10:00:00 | 47.06 |
| 2012-10-09 11:00:00 | 46.28 |
| 2012-10-09 12:00:00 | 44.2 |
| 2012-10-09 13:00:00 | 44.72 |
| 2012-10-09 14:00:00 | 42.9 |
| 2012-10-09 15:00:00 | 40.82 |
| 2012-10-09 16:00:00 | 35.88 |
| 2012-10-09 17:00:00 | 28.6 |
| 2012-10-09 18:00:00 | 27.56 |
| 2012-10-09 19:00:00 | 33.54 |
| 2012-10-09 20:00:00 | 33.28 |
| 2012-10-09 21:00:00 | 35.88 |
| 2012-10-09 22:00:00 | 25.48 |
| 2012-10-09 23:00:00 | 19.76 |
| 2012-10-10 | 17.16 |
| 2012-10-10 01:00:00 | 17.16 |
| 2012-10-10 02:00:00 | 17.16 |
| 2012-10-10 03:00:00 | 17.16 |
| 2012-10-10 04:00:00 | 18.72 |
| 2012-10-10 05:00:00 | 19.24 |
| 2012-10-10 06:00:00 | 23.66 |
| 2012-10-10 07:00:00 | 33.28 |
| 2012-10-10 08:00:00 | 52.78 |
| 2012-10-10 09:00:00 | 52.26 |
| 2012-10-10 10:00:00 | 48.1 |
| 2012-10-10 11:00:00 | 46.28 |
| 2012-10-10 12:00:00 | 42.9 |
| 2012-10-10 13:00:00 | 44.72 |
| 2012-10-10 14:00:00 | 44.98 |
| 2012-10-10 15:00:00 | 43.16 |
| 2012-10-10 16:00:00 | 36.66 |
| 2012-10-10 17:00:00 | 30.42 |
| 2012-10-10 18:00:00 | 30.16 |
| 2012-10-10 19:00:00 | 36.14 |
| 2012-10-10 20:00:00 | 34.06 |
| 2012-10-10 21:00:00 | 35.88 |
| 2012-10-10 22:00:00 | 26 |
| 2012-10-10 23:00:00 | 20.02 |
| 2012-10-11 | 16.9 |
| 2012-10-11 01:00:00 | 16.9 |
| 2012-10-11 02:00:00 | 16.9 |
| 2012-10-11 03:00:00 | 16.9 |
| 2012-10-11 04:00:00 | 16.9 |
| 2012-10-11 05:00:00 | 18.72 |
| 2012-10-11 06:00:00 | 22.88 |
| 2012-10-11 07:00:00 | 34.32 |
| 2012-10-11 08:00:00 | 53.04 |
| 2012-10-11 09:00:00 | 53.04 |
| 2012-10-11 10:00:00 | 52.26 |
| 2012-10-11 11:00:00 | 49.92 |
| 2012-10-11 12:00:00 | 44.72 |
| 2012-10-11 13:00:00 | 42.12 |
| 2012-10-11 14:00:00 | 43.68 |
| 2012-10-11 15:00:00 | 42.38 |
| 2012-10-11 16:00:00 | 35.1 |
| 2012-10-11 17:00:00 | 29.12 |
| 2012-10-11 18:00:00 | 27.56 |
| 2012-10-11 19:00:00 | 30.68 |
| 2012-10-11 20:00:00 | 33.54 |
| 2012-10-11 21:00:00 | 29.12 |
| 2012-10-11 22:00:00 | 22.62 |
| 2012-10-11 23:00:00 | 19.24 |
| 2012-10-12 | 17.16 |
| 2012-10-12 01:00:00 | 17.16 |
| 2012-10-12 02:00:00 | 17.16 |
| 2012-10-12 03:00:00 | 17.68 |
| 2012-10-12 04:00:00 | 18.46 |
| 2012-10-12 05:00:00 | 19.76 |
| 2012-10-12 06:00:00 | 24.18 |
| 2012-10-12 07:00:00 | 35.62 |
| 2012-10-12 08:00:00 | 56.16 |
| 2012-10-12 09:00:00 | 53.3 |
| 2012-10-12 10:00:00 | 48.88 |
| 2012-10-12 11:00:00 | 47.06 |
| 2012-10-12 12:00:00 | 44.98 |
| 2012-10-12 13:00:00 | 45.5 |
| 2012-10-12 14:00:00 | 43.16 |
| 2012-10-12 15:00:00 | 35.62 |
| 2012-10-12 16:00:00 | 26.78 |
| 2012-10-12 17:00:00 | 24.96 |
| 2012-10-12 18:00:00 | 28.08 |
| 2012-10-12 19:00:00 | 31.98 |
| 2012-10-12 20:00:00 | 29.38 |
| 2012-10-12 21:00:00 | 23.92 |
| 2012-10-12 22:00:00 | 21.32 |
| 2012-10-12 23:00:00 | 19.24 |
| 2012-10-13 | 16.12 |
| 2012-10-13 01:00:00 | 16.12 |
| 2012-10-13 02:00:00 | 16.12 |
| 2012-10-13 03:00:00 | 16.38 |
| 2012-10-13 04:00:00 | 16.38 |
| 2012-10-13 05:00:00 | 17.16 |
| 2012-10-13 06:00:00 | 16.9 |
| 2012-10-13 07:00:00 | 18.46 |
| 2012-10-13 08:00:00 | 18.46 |
| 2012-10-13 09:00:00 | 17.16 |
| 2012-10-13 10:00:00 | 16.64 |
| 2012-10-13 11:00:00 | 16.64 |
| 2012-10-13 12:00:00 | 16.9 |
| 2012-10-13 13:00:00 | 17.16 |
| 2012-10-13 14:00:00 | 17.16 |
| 2012-10-13 15:00:00 | 17.42 |
| 2012-10-13 16:00:00 | 16.9 |
| 2012-10-13 17:00:00 | 16.9 |
| 2012-10-13 18:00:00 | 17.16 |
| 2012-10-13 19:00:00 | 17.68 |
| 2012-10-13 20:00:00 | 17.68 |
| 2012-10-13 21:00:00 | 17.42 |
| 2012-10-13 22:00:00 | 17.16 |
| 2012-10-13 23:00:00 | 16.64 |
| 2012-10-14 | 16.64 |
| 2012-10-14 01:00:00 | 16.64 |
| 2012-10-14 02:00:00 | 16.64 |
| 2012-10-14 03:00:00 | 16.9 |
| 2012-10-14 04:00:00 | 17.68 |
| 2012-10-14 05:00:00 | 18.98 |
| 2012-10-14 06:00:00 | 18.46 |
| 2012-10-14 07:00:00 | 17.68 |
| 2012-10-14 08:00:00 | 17.16 |
| 2012-10-14 09:00:00 | 16.64 |
| 2012-10-14 10:00:00 | 16.9 |
| 2012-10-14 11:00:00 | 16.38 |
| 2012-10-14 12:00:00 | 16.9 |
| 2012-10-14 13:00:00 | 16.9 |
| 2012-10-14 14:00:00 | 16.9 |
| 2012-10-14 15:00:00 | 17.16 |
| 2012-10-14 16:00:00 | 16.9 |
| 2012-10-14 17:00:00 | 16.9 |
| 2012-10-14 18:00:00 | 17.42 |
| 2012-10-14 19:00:00 | 17.16 |
| 2012-10-14 20:00:00 | 17.42 |
| 2012-10-14 21:00:00 | 17.16 |
| 2012-10-14 22:00:00 | 16.64 |
| 2012-10-14 23:00:00 | 16.38 |
| 2012-10-15 | 16.38 |
| 2012-10-15 01:00:00 | 16.38 |
| 2012-10-15 02:00:00 | 16.12 |
| 2012-10-15 03:00:00 | 16.9 |
| 2012-10-15 04:00:00 | 16.9 |
| 2012-10-15 05:00:00 | 19.24 |
| 2012-10-15 06:00:00 | 22.36 |
| 2012-10-15 07:00:00 | 34.06 |
| 2012-10-15 08:00:00 | 55.9 |
| 2012-10-15 09:00:00 | 53.3 |
| 2012-10-15 10:00:00 | 49.4 |
| 2012-10-15 11:00:00 | 47.84 |
| 2012-10-15 12:00:00 | 45.76 |
| 2012-10-15 13:00:00 | 44.98 |
| 2012-10-15 14:00:00 | 45.5 |
| 2012-10-15 15:00:00 | 45.76 |
| 2012-10-15 16:00:00 | 37.44 |
| 2012-10-15 17:00:00 | 29.64 |
| 2012-10-15 18:00:00 | 29.9 |
| 2012-10-15 19:00:00 | 34.06 |
| 2012-10-15 20:00:00 | 33.28 |
| 2012-10-15 21:00:00 | 31.2 |
| 2012-10-15 22:00:00 | 25.22 |
| 2012-10-15 23:00:00 | 22.1 |
| 2012-10-16 | 19.5 |
| 2012-10-16 01:00:00 | 17.68 |
| 2012-10-16 02:00:00 | 17.94 |
| 2012-10-16 03:00:00 | 17.42 |
| 2012-10-16 04:00:00 | 18.2 |
| 2012-10-16 05:00:00 | 20.28 |
| 2012-10-16 06:00:00 | 21.58 |
| 2012-10-16 07:00:00 | 32.24 |
| 2012-10-16 08:00:00 | 54.34 |
| 2012-10-16 09:00:00 | 57.2 |
| 2012-10-16 10:00:00 | 56.42 |
| 2012-10-16 11:00:00 | 55.38 |
| 2012-10-16 12:00:00 | 54.6 |
| 2012-10-16 13:00:00 | 51.74 |
| 2012-10-16 14:00:00 | 52.78 |
| 2012-10-16 15:00:00 | 50.18 |
| 2012-10-16 16:00:00 | 41.86 |
| 2012-10-16 17:00:00 | 31.72 |
| 2012-10-16 18:00:00 | 31.46 |
| 2012-10-16 19:00:00 | 35.62 |
| 2012-10-16 20:00:00 | 34.84 |
| 2012-10-16 21:00:00 | 35.1 |
| 2012-10-16 22:00:00 | 24.18 |
| 2012-10-16 23:00:00 | 19.76 |
| 2012-10-17 | 16.64 |
| 2012-10-17 01:00:00 | 16.64 |
| 2012-10-17 02:00:00 | 16.64 |
| 2012-10-17 03:00:00 | 16.64 |
| 2012-10-17 04:00:00 | 17.16 |
| 2012-10-17 05:00:00 | 20.02 |
| 2012-10-17 06:00:00 | 23.92 |
| 2012-10-17 07:00:00 | 33.54 |
| 2012-10-17 08:00:00 | 53.04 |
| 2012-10-17 09:00:00 | 52 |
| 2012-10-17 10:00:00 | 48.88 |
| 2012-10-17 11:00:00 | 44.46 |
| 2012-10-17 12:00:00 | 43.68 |
| 2012-10-17 13:00:00 | 43.94 |
| 2012-10-17 14:00:00 | 44.72 |
| 2012-10-17 15:00:00 | 42.64 |
| 2012-10-17 16:00:00 | 35.1 |
| 2012-10-17 17:00:00 | 30.16 |
| 2012-10-17 18:00:00 | 29.64 |
| 2012-10-17 19:00:00 | 34.06 |
| 2012-10-17 20:00:00 | 30.42 |
| 2012-10-17 21:00:00 | 28.86 |
| 2012-10-17 22:00:00 | 24.7 |
| 2012-10-17 23:00:00 | 19.5 |
| 2012-10-18 | 17.94 |
| 2012-10-18 01:00:00 | 17.94 |
| 2012-10-18 02:00:00 | 17.94 |
| 2012-10-18 03:00:00 | 17.94 |
| 2012-10-18 04:00:00 | 18.2 |
| 2012-10-18 05:00:00 | 20.28 |
| 2012-10-18 06:00:00 | 22.1 |
| 2012-10-18 07:00:00 | 34.84 |
| 2012-10-18 08:00:00 | 53.56 |
| 2012-10-18 09:00:00 | 53.04 |
| 2012-10-18 10:00:00 | 47.84 |
| 2012-10-18 11:00:00 | 46.54 |
| 2012-10-18 12:00:00 | 43.16 |
| 2012-10-18 13:00:00 | 44.98 |
| 2012-10-18 14:00:00 | 40.56 |
| 2012-10-18 15:00:00 | 39.78 |
| 2012-10-18 16:00:00 | 32.24 |
| 2012-10-18 17:00:00 | 26 |
| 2012-10-18 18:00:00 | 26.78 |
| 2012-10-18 19:00:00 | 28.08 |
| 2012-10-18 20:00:00 | 27.82 |
| 2012-10-18 21:00:00 | 25.22 |
| 2012-10-18 22:00:00 | 21.84 |
| 2012-10-18 23:00:00 | 18.72 |
| 2012-10-19 | 16.9 |
| 2012-10-19 01:00:00 | 15.86 |
| 2012-10-19 02:00:00 | 15.86 |
| 2012-10-19 03:00:00 | 16.38 |
| 2012-10-19 04:00:00 | 17.94 |
| 2012-10-19 05:00:00 | 18.2 |
| 2012-10-19 06:00:00 | 21.58 |
| 2012-10-19 07:00:00 | 32.76 |
| 2012-10-19 08:00:00 | 49.92 |
| 2012-10-19 09:00:00 | 50.7 |
| 2012-10-19 10:00:00 | 43.94 |
| 2012-10-19 11:00:00 | 41.6 |
| 2012-10-19 12:00:00 | 40.56 |
| 2012-10-19 13:00:00 | 42.12 |
| 2012-10-19 14:00:00 | 40.82 |
| 2012-10-19 15:00:00 | 37.7 |
| 2012-10-19 16:00:00 | 29.12 |
| 2012-10-19 17:00:00 | 24.44 |
| 2012-10-19 18:00:00 | 27.04 |
| 2012-10-19 19:00:00 | 30.16 |
| 2012-10-19 20:00:00 | 29.9 |
| 2012-10-19 21:00:00 | 24.7 |
| 2012-10-19 22:00:00 | 22.88 |
| 2012-10-19 23:00:00 | 19.5 |
| 2012-10-20 | 17.94 |
| 2012-10-20 01:00:00 | 17.68 |
| 2012-10-20 02:00:00 | 16.64 |
| 2012-10-20 03:00:00 | 16.9 |
| 2012-10-20 04:00:00 | 17.16 |
| 2012-10-20 05:00:00 | 17.42 |
| 2012-10-20 06:00:00 | 18.2 |
| 2012-10-20 07:00:00 | 18.2 |
| 2012-10-20 08:00:00 | 19.24 |
| 2012-10-20 09:00:00 | 20.02 |
| 2012-10-20 10:00:00 | 19.76 |
| 2012-10-20 11:00:00 | 19.76 |
| 2012-10-20 12:00:00 | 20.28 |
| 2012-10-20 13:00:00 | 20.02 |
| 2012-10-20 14:00:00 | 19.76 |
| 2012-10-20 15:00:00 | 18.98 |
| 2012-10-20 16:00:00 | 17.68 |
| 2012-10-20 17:00:00 | 17.42 |
| 2012-10-20 18:00:00 | 17.42 |
| 2012-10-20 19:00:00 | 17.42 |
| 2012-10-20 20:00:00 | 17.16 |
| 2012-10-20 21:00:00 | 17.42 |
| 2012-10-20 22:00:00 | 16.64 |
| 2012-10-20 23:00:00 | 16.38 |
| 2012-10-21 | 16.12 |
| 2012-10-21 01:00:00 | 17.16 |
| 2012-10-21 02:00:00 | 16.9 |
| 2012-10-21 03:00:00 | 17.16 |
| 2012-10-21 04:00:00 | 16.9 |
| 2012-10-21 05:00:00 | 18.2 |
| 2012-10-21 06:00:00 | 18.72 |
| 2012-10-21 07:00:00 | 19.24 |
| 2012-10-21 08:00:00 | 17.42 |
| 2012-10-21 09:00:00 | 17.42 |
| 2012-10-21 10:00:00 | 17.94 |
| 2012-10-21 11:00:00 | 18.46 |
| 2012-10-21 12:00:00 | 17.94 |
| 2012-10-21 13:00:00 | 18.72 |
| 2012-10-21 14:00:00 | 17.94 |
| 2012-10-21 15:00:00 | 18.2 |
| 2012-10-21 16:00:00 | 18.2 |
| 2012-10-21 17:00:00 | 17.94 |
| 2012-10-21 18:00:00 | 18.2 |
| 2012-10-21 19:00:00 | 19.76 |
| 2012-10-21 20:00:00 | 18.46 |
| 2012-10-21 21:00:00 | 16.9 |
| 2012-10-21 22:00:00 | 16.38 |
| 2012-10-21 23:00:00 | 15.6 |
| 2012-10-22 | 15.34 |
| 2012-10-22 01:00:00 | 15.34 |
| 2012-10-22 02:00:00 | 15.6 |
| 2012-10-22 03:00:00 | 15.6 |
| 2012-10-22 04:00:00 | 15.86 |
| 2012-10-22 05:00:00 | 17.16 |
| 2012-10-22 06:00:00 | 22.1 |
| 2012-10-22 07:00:00 | 33.02 |
| 2012-10-22 08:00:00 | 53.04 |
| 2012-10-22 09:00:00 | 52.52 |
| 2012-10-22 10:00:00 | 48.88 |
| 2012-10-22 11:00:00 | 46.02 |
| 2012-10-22 12:00:00 | 44.46 |
| 2012-10-22 13:00:00 | 44.2 |
| 2012-10-22 14:00:00 | 43.68 |
| 2012-10-22 15:00:00 | 40.3 |
| 2012-10-22 16:00:00 | 34.84 |
| 2012-10-22 17:00:00 | 29.64 |
| 2012-10-22 18:00:00 | 29.9 |
| 2012-10-22 19:00:00 | 30.16 |
| 2012-10-22 20:00:00 | 31.46 |
| 2012-10-22 21:00:00 | 31.46 |
| 2012-10-22 22:00:00 | 23.4 |
| 2012-10-22 23:00:00 | 17.94 |
| 2012-10-23 | 15.34 |
| 2012-10-23 01:00:00 | 15.86 |
| 2012-10-23 02:00:00 | 16.12 |
| 2012-10-23 03:00:00 | 16.64 |
| 2012-10-23 04:00:00 | 17.68 |
| 2012-10-23 05:00:00 | 18.72 |
| 2012-10-23 06:00:00 | 21.84 |
| 2012-10-23 07:00:00 | 33.8 |
| 2012-10-23 08:00:00 | 56.16 |
| 2012-10-23 09:00:00 | 57.46 |
| 2012-10-23 10:00:00 | 56.16 |
| 2012-10-23 11:00:00 | 55.12 |
| 2012-10-23 12:00:00 | 51.48 |
| 2012-10-23 13:00:00 | 52.78 |
| 2012-10-23 14:00:00 | 52.52 |
| 2012-10-23 15:00:00 | 49.92 |
| 2012-10-23 16:00:00 | 42.9 |
| 2012-10-23 17:00:00 | 31.72 |
| 2012-10-23 18:00:00 | 31.46 |
| 2012-10-23 19:00:00 | 29.64 |
| 2012-10-23 20:00:00 | 29.9 |
| 2012-10-23 21:00:00 | 31.98 |
| 2012-10-23 22:00:00 | 23.14 |
| 2012-10-23 23:00:00 | 18.98 |
| 2012-10-24 | 15.86 |
| 2012-10-24 01:00:00 | 15.6 |
| 2012-10-24 02:00:00 | 15.34 |
| 2012-10-24 03:00:00 | 15.86 |
| 2012-10-24 04:00:00 | 15.86 |
| 2012-10-24 05:00:00 | 17.68 |
| 2012-10-24 06:00:00 | 22.36 |
| 2012-10-24 07:00:00 | 32.5 |
| 2012-10-24 08:00:00 | 55.12 |
| 2012-10-24 09:00:00 | 53.82 |
| 2012-10-24 10:00:00 | 49.92 |
| 2012-10-24 11:00:00 | 47.06 |
| 2012-10-24 12:00:00 | 45.76 |
| 2012-10-24 13:00:00 | 46.02 |
| 2012-10-24 14:00:00 | 45.76 |
| 2012-10-24 15:00:00 | 40.82 |
| 2012-10-24 16:00:00 | 35.36 |
| 2012-10-24 17:00:00 | 31.98 |
| 2012-10-24 18:00:00 | 27.3 |
| 2012-10-24 19:00:00 | 30.42 |
| 2012-10-24 20:00:00 | 34.84 |
| 2012-10-24 21:00:00 | 35.1 |
| 2012-10-24 22:00:00 | 23.92 |
| 2012-10-24 23:00:00 | 18.2 |
| 2012-10-25 | 15.6 |
| 2012-10-25 01:00:00 | 15.34 |
| 2012-10-25 02:00:00 | 15.6 |
| 2012-10-25 03:00:00 | 15.6 |
| 2012-10-25 04:00:00 | 17.16 |
| 2012-10-25 05:00:00 | 18.2 |
| 2012-10-25 06:00:00 | 20.8 |
| 2012-10-25 07:00:00 | 31.46 |
| 2012-10-25 08:00:00 | 53.3 |
| 2012-10-25 09:00:00 | 54.6 |
| 2012-10-25 10:00:00 | 51.22 |
| 2012-10-25 11:00:00 | 49.66 |
| 2012-10-25 12:00:00 | 44.98 |
| 2012-10-25 13:00:00 | 44.98 |
| 2012-10-25 14:00:00 | 46.02 |
| 2012-10-25 15:00:00 | 44.2 |
| 2012-10-25 16:00:00 | 36.4 |
| 2012-10-25 17:00:00 | 28.86 |
| 2012-10-25 18:00:00 | 29.64 |
| 2012-10-25 19:00:00 | 30.16 |
| 2012-10-25 20:00:00 | 31.46 |
| 2012-10-25 21:00:00 | 32.24 |
| 2012-10-25 22:00:00 | 23.66 |
| 2012-10-25 23:00:00 | 18.2 |
| 2012-10-26 | 15.34 |
| 2012-10-26 01:00:00 | 15.6 |
| 2012-10-26 02:00:00 | 15.34 |
| 2012-10-26 03:00:00 | 15.6 |
| 2012-10-26 04:00:00 | 15.86 |
| 2012-10-26 05:00:00 | 17.68 |
| 2012-10-26 06:00:00 | 22.1 |
| 2012-10-26 07:00:00 | 31.46 |
| 2012-10-26 08:00:00 | 54.08 |
| 2012-10-26 09:00:00 | 53.04 |
| 2012-10-26 10:00:00 | 48.36 |
| 2012-10-26 11:00:00 | 47.32 |
| 2012-10-26 12:00:00 | 41.08 |
| 2012-10-26 13:00:00 | 40.56 |
| 2012-10-26 14:00:00 | 38.48 |
| 2012-10-26 15:00:00 | 32.76 |
| 2012-10-26 16:00:00 | 28.6 |
| 2012-10-26 17:00:00 | 27.3 |
| 2012-10-26 18:00:00 | 30.42 |
| 2012-10-26 19:00:00 | 33.8 |
| 2012-10-26 20:00:00 | 29.64 |
| 2012-10-26 21:00:00 | 28.34 |
| 2012-10-26 22:00:00 | 23.4 |
| 2012-10-26 23:00:00 | 18.98 |
| 2012-10-27 | 15.6 |
| 2012-10-27 01:00:00 | 16.12 |
| 2012-10-27 02:00:00 | 15.86 |
| 2012-10-27 03:00:00 | 16.12 |
| 2012-10-27 04:00:00 | 16.38 |
| 2012-10-27 05:00:00 | 16.38 |
| 2012-10-27 06:00:00 | 16.38 |
| 2012-10-27 07:00:00 | 16.64 |
| 2012-10-27 08:00:00 | 18.98 |
| 2012-10-27 09:00:00 | 27.3 |
| 2012-10-27 10:00:00 | 30.42 |
| 2012-10-27 11:00:00 | 27.82 |
| 2012-10-27 12:00:00 | 26.52 |
| 2012-10-27 13:00:00 | 30.68 |
| 2012-10-27 14:00:00 | 24.7 |
| 2012-10-27 15:00:00 | 22.88 |
| 2012-10-27 16:00:00 | 22.1 |
| 2012-10-27 17:00:00 | 20.02 |
| 2012-10-27 18:00:00 | 20.8 |
| 2012-10-27 19:00:00 | 19.5 |
| 2012-10-27 20:00:00 | 19.76 |
| 2012-10-27 21:00:00 | 19.76 |
| 2012-10-27 22:00:00 | 18.46 |
| 2012-10-27 23:00:00 | 15.08 |
| 2012-10-28 | 15.34 |
| 2012-10-28 01:00:00 | 15.34 |
| 2012-10-28 02:00:00 | 15.6 |
| 2012-10-28 02:00:00 | 15.6 |
| 2012-10-28 03:00:00 | 15.86 |
| 2012-10-28 04:00:00 | 15.86 |
| 2012-10-28 05:00:00 | 16.38 |
| 2012-10-28 06:00:00 | 16.38 |
| 2012-10-28 07:00:00 | 16.12 |
| 2012-10-28 08:00:00 | 15.86 |
| 2012-10-28 09:00:00 | 15.34 |
| 2012-10-28 10:00:00 | 15.34 |
| 2012-10-28 11:00:00 | 15.86 |
| 2012-10-28 12:00:00 | 15.86 |
| 2012-10-28 13:00:00 | 16.9 |
| 2012-10-28 14:00:00 | 16.9 |
| 2012-10-28 15:00:00 | 17.16 |
| 2012-10-28 16:00:00 | 16.9 |
| 2012-10-28 17:00:00 | 15.86 |
| 2012-10-28 18:00:00 | 19.5 |
| 2012-10-28 19:00:00 | 18.98 |
| 2012-10-28 20:00:00 | 16.9 |
| 2012-10-28 21:00:00 | 16.12 |
| 2012-10-28 22:00:00 | 16.12 |
| 2012-10-28 23:00:00 | 15.6 |
| 2012-10-29 | 15.86 |
| 2012-10-29 01:00:00 | 16.12 |
| 2012-10-29 02:00:00 | 16.12 |
| 2012-10-29 03:00:00 | 16.12 |
| 2012-10-29 04:00:00 | 16.38 |
| 2012-10-29 05:00:00 | 17.42 |
| 2012-10-29 06:00:00 | 19.24 |
| 2012-10-29 07:00:00 | 33.02 |
| 2012-10-29 08:00:00 | 55.38 |
| 2012-10-29 09:00:00 | 57.98 |
| 2012-10-29 10:00:00 | 56.94 |
| 2012-10-29 11:00:00 | 55.38 |
| 2012-10-29 12:00:00 | 55.38 |
| 2012-10-29 13:00:00 | 54.6 |
| 2012-10-29 14:00:00 | 55.38 |
| 2012-10-29 15:00:00 | 53.56 |
| 2012-10-29 16:00:00 | 43.42 |
| 2012-10-29 17:00:00 | 37.44 |
| 2012-10-29 18:00:00 | 31.98 |
| 2012-10-29 19:00:00 | 33.02 |
| 2012-10-29 20:00:00 | 33.8 |
| 2012-10-29 21:00:00 | 37.44 |
| 2012-10-29 22:00:00 | 23.92 |
| 2012-10-29 23:00:00 | 17.68 |
| 2012-10-30 | 15.6 |
| 2012-10-30 01:00:00 | 16.12 |
| 2012-10-30 02:00:00 | 16.12 |
| 2012-10-30 03:00:00 | 16.12 |
| 2012-10-30 04:00:00 | 16.12 |
| 2012-10-30 05:00:00 | 16.9 |
| 2012-10-30 06:00:00 | 21.58 |
| 2012-10-30 07:00:00 | 32.24 |
| 2012-10-30 08:00:00 | 50.7 |
| 2012-10-30 09:00:00 | 49.14 |
| 2012-10-30 10:00:00 | 47.58 |
| 2012-10-30 11:00:00 | 46.8 |
| 2012-10-30 12:00:00 | 44.72 |
| 2012-10-30 13:00:00 | 43.16 |
| 2012-10-30 14:00:00 | 41.86 |
| 2012-10-30 15:00:00 | 41.34 |
| 2012-10-30 16:00:00 | 35.88 |
| 2012-10-30 17:00:00 | 30.16 |
| 2012-10-30 18:00:00 | 28.08 |
| 2012-10-30 19:00:00 | 29.9 |
| 2012-10-30 20:00:00 | 29.9 |
| 2012-10-30 21:00:00 | 30.16 |
| 2012-10-30 22:00:00 | 22.1 |
| 2012-10-30 23:00:00 | 17.68 |
| 2012-10-31 | 15.86 |
| 2012-10-31 01:00:00 | 15.86 |
| 2012-10-31 02:00:00 | 16.38 |
| 2012-10-31 03:00:00 | 15.86 |
| 2012-10-31 04:00:00 | 17.68 |
| 2012-10-31 05:00:00 | 18.72 |
| 2012-10-31 06:00:00 | 22.88 |
| 2012-10-31 07:00:00 | 34.32 |
| 2012-10-31 08:00:00 | 54.34 |
| 2012-10-31 09:00:00 | 55.12 |
| 2012-10-31 10:00:00 | 50.7 |
| 2012-10-31 11:00:00 | 48.62 |
| 2012-10-31 12:00:00 | 42.38 |
| 2012-10-31 13:00:00 | 41.86 |
| 2012-10-31 14:00:00 | 40.04 |
| 2012-10-31 15:00:00 | 37.18 |
| 2012-10-31 16:00:00 | 33.54 |
| 2012-10-31 17:00:00 | 30.42 |
| 2012-10-31 18:00:00 | 31.72 |
| 2012-10-31 19:00:00 | 33.8 |
| 2012-10-31 20:00:00 | 31.98 |
| 2012-10-31 21:00:00 | 33.28 |
| 2012-10-31 22:00:00 | 24.18 |
| 2012-10-31 23:00:00 | 18.46 |
| 2012-11-01 | 15.86 |
| 2012-11-01 01:00:00 | 15.86 |
| 2012-11-01 02:00:00 | 16.12 |
| 2012-11-01 03:00:00 | 16.38 |
| 2012-11-01 04:00:00 | 16.12 |
| 2012-11-01 05:00:00 | 18.72 |
| 2012-11-01 06:00:00 | 21.58 |
| 2012-11-01 07:00:00 | 32.5 |
| 2012-11-01 08:00:00 | 53.04 |
| 2012-11-01 09:00:00 | 54.6 |
| 2012-11-01 10:00:00 | 54.6 |
| 2012-11-01 11:00:00 | 54.6 |
| 2012-11-01 12:00:00 | 52.52 |
| 2012-11-01 13:00:00 | 51.22 |
| 2012-11-01 14:00:00 | 50.44 |
| 2012-11-01 15:00:00 | 47.06 |
| 2012-11-01 16:00:00 | 40.3 |
| 2012-11-01 17:00:00 | 33.8 |
| 2012-11-01 18:00:00 | 29.64 |
| 2012-11-01 19:00:00 | 30.94 |
| 2012-11-01 20:00:00 | 31.98 |
| 2012-11-01 21:00:00 | 32.76 |
| 2012-11-01 22:00:00 | 23.14 |
| 2012-11-01 23:00:00 | 18.98 |
| 2012-11-02 | 15.86 |
| 2012-11-02 01:00:00 | 15.86 |
| 2012-11-02 02:00:00 | 16.12 |
| 2012-11-02 03:00:00 | 16.64 |
| 2012-11-02 04:00:00 | 17.16 |
| 2012-11-02 05:00:00 | 17.42 |
| 2012-11-02 06:00:00 | 20.28 |
| 2012-11-02 07:00:00 | 32.24 |
| 2012-11-02 08:00:00 | 46.02 |
| 2012-11-02 09:00:00 | 50.18 |
| 2012-11-02 10:00:00 | 48.62 |
| 2012-11-02 11:00:00 | 47.32 |
| 2012-11-02 12:00:00 | 48.62 |
| 2012-11-02 13:00:00 | 50.96 |
| 2012-11-02 14:00:00 | 50.18 |
| 2012-11-02 15:00:00 | 46.28 |
| 2012-11-02 16:00:00 | 30.94 |
| 2012-11-02 17:00:00 | 29.38 |
| 2012-11-02 18:00:00 | 30.42 |
| 2012-11-02 19:00:00 | 32.24 |
| 2012-11-02 20:00:00 | 28.86 |
| 2012-11-02 21:00:00 | 27.82 |
| 2012-11-02 22:00:00 | 21.06 |
| 2012-11-02 23:00:00 | 20.28 |
| 2012-11-03 | 16.64 |
| 2012-11-03 01:00:00 | 16.12 |
| 2012-11-03 02:00:00 | 16.12 |
| 2012-11-03 03:00:00 | 16.12 |
| 2012-11-03 04:00:00 | 16.38 |
| 2012-11-03 05:00:00 | 16.64 |
| 2012-11-03 06:00:00 | 16.9 |
| 2012-11-03 07:00:00 | 17.16 |
| 2012-11-03 08:00:00 | 16.64 |
| 2012-11-03 09:00:00 | 21.58 |
| 2012-11-03 10:00:00 | 19.5 |
| 2012-11-03 11:00:00 | 16.64 |
| 2012-11-03 12:00:00 | 16.64 |
| 2012-11-03 13:00:00 | 17.94 |
| 2012-11-03 14:00:00 | 16.9 |
| 2012-11-03 15:00:00 | 16.64 |
| 2012-11-03 16:00:00 | 16.9 |
| 2012-11-03 17:00:00 | 16.9 |
| 2012-11-03 18:00:00 | 16.38 |
| 2012-11-03 19:00:00 | 16.38 |
| 2012-11-03 20:00:00 | 16.12 |
| 2012-11-03 21:00:00 | 16.38 |
| 2012-11-03 22:00:00 | 15.34 |
| 2012-11-03 23:00:00 | 15.34 |
| 2012-11-04 | 15.34 |
| 2012-11-04 01:00:00 | 15.34 |
| 2012-11-04 02:00:00 | 15.6 |
| 2012-11-04 03:00:00 | 15.86 |
| 2012-11-04 04:00:00 | 15.6 |
| 2012-11-04 05:00:00 | 16.12 |
| 2012-11-04 06:00:00 | 16.12 |
| 2012-11-04 07:00:00 | 16.38 |
| 2012-11-04 08:00:00 | 16.38 |
| 2012-11-04 09:00:00 | 17.68 |
| 2012-11-04 10:00:00 | 17.94 |
| 2012-11-04 11:00:00 | 17.94 |
| 2012-11-04 12:00:00 | 17.94 |
| 2012-11-04 13:00:00 | 20.28 |
| 2012-11-04 14:00:00 | 19.24 |
| 2012-11-04 15:00:00 | 17.16 |
| 2012-11-04 16:00:00 | 17.16 |
| 2012-11-04 17:00:00 | 18.2 |
| 2012-11-04 18:00:00 | 20.28 |
| 2012-11-04 19:00:00 | 20.28 |
| 2012-11-04 20:00:00 | 24.18 |
| 2012-11-04 21:00:00 | 21.58 |
| 2012-11-04 22:00:00 | 18.46 |
| 2012-11-04 23:00:00 | 18.46 |
| 2012-11-05 | 18.72 |
| 2012-11-05 01:00:00 | 18.46 |
| 2012-11-05 02:00:00 | 18.72 |
| 2012-11-05 03:00:00 | 18.72 |
| 2012-11-05 04:00:00 | 16.9 |
| 2012-11-05 05:00:00 | 16.9 |
| 2012-11-05 06:00:00 | 19.5 |
| 2012-11-05 07:00:00 | 30.42 |
| 2012-11-05 08:00:00 | 55.38 |
| 2012-11-05 09:00:00 | 58.24 |
| 2012-11-05 10:00:00 | 58.24 |
| 2012-11-05 11:00:00 | 58.76 |
| 2012-11-05 12:00:00 | 56.68 |
| 2012-11-05 13:00:00 | 50.96 |
| 2012-11-05 14:00:00 | 47.84 |
| 2012-11-05 15:00:00 | 47.58 |
| 2012-11-05 16:00:00 | 40.56 |
| 2012-11-05 17:00:00 | 35.36 |
| 2012-11-05 18:00:00 | 33.54 |
| 2012-11-05 19:00:00 | 35.1 |
| 2012-11-05 20:00:00 | 35.36 |
| 2012-11-05 21:00:00 | 33.8 |
| 2012-11-05 22:00:00 | 22.36 |
| 2012-11-05 23:00:00 | 17.42 |
| 2012-11-06 | 15.86 |
| 2012-11-06 01:00:00 | 15.86 |
| 2012-11-06 02:00:00 | 16.12 |
| 2012-11-06 03:00:00 | 16.64 |
| 2012-11-06 04:00:00 | 17.68 |
| 2012-11-06 05:00:00 | 19.24 |
| 2012-11-06 06:00:00 | 22.62 |
| 2012-11-06 07:00:00 | 33.8 |
| 2012-11-06 08:00:00 | 52.26 |
| 2012-11-06 09:00:00 | 58.24 |
| 2012-11-06 10:00:00 | 56.94 |
| 2012-11-06 11:00:00 | 57.72 |
| 2012-11-06 12:00:00 | 53.04 |
| 2012-11-06 13:00:00 | 48.1 |
| 2012-11-06 14:00:00 | 47.84 |
| 2012-11-06 15:00:00 | 45.76 |
| 2012-11-06 16:00:00 | 43.16 |
| 2012-11-06 17:00:00 | 38.22 |
| 2012-11-06 18:00:00 | 31.72 |
| 2012-11-06 19:00:00 | 34.06 |
| 2012-11-06 20:00:00 | 33.02 |
| 2012-11-06 21:00:00 | 33.02 |
| 2012-11-06 22:00:00 | 23.66 |
| 2012-11-06 23:00:00 | 19.24 |
| 2012-11-07 | 17.16 |
| 2012-11-07 01:00:00 | 17.42 |
| 2012-11-07 02:00:00 | 16.64 |
| 2012-11-07 03:00:00 | 16.9 |
| 2012-11-07 04:00:00 | 16.64 |
| 2012-11-07 05:00:00 | 18.98 |
| 2012-11-07 06:00:00 | 20.54 |
| 2012-11-07 07:00:00 | 33.54 |
| 2012-11-07 08:00:00 | 56.16 |
| 2012-11-07 09:00:00 | 54.86 |
| 2012-11-07 10:00:00 | 52.78 |
| 2012-11-07 11:00:00 | 52 |
| 2012-11-07 12:00:00 | 49.92 |
| 2012-11-07 13:00:00 | 51.74 |
| 2012-11-07 14:00:00 | 49.4 |
| 2012-11-07 15:00:00 | 47.58 |
| 2012-11-07 16:00:00 | 38.48 |
| 2012-11-07 17:00:00 | 33.02 |
| 2012-11-07 18:00:00 | 28.34 |
| 2012-11-07 19:00:00 | 31.2 |
| 2012-11-07 20:00:00 | 33.28 |
| 2012-11-07 21:00:00 | 33.8 |
| 2012-11-07 22:00:00 | 21.32 |
| 2012-11-07 23:00:00 | 17.42 |
| 2012-11-08 | 15.6 |
| 2012-11-08 01:00:00 | 15.6 |
| 2012-11-08 02:00:00 | 15.6 |
| 2012-11-08 03:00:00 | 16.12 |
| 2012-11-08 04:00:00 | 16.9 |
| 2012-11-08 05:00:00 | 17.94 |
| 2012-11-08 06:00:00 | 20.54 |
| 2012-11-08 07:00:00 | 31.98 |
| 2012-11-08 08:00:00 | 50.7 |
| 2012-11-08 09:00:00 | 50.7 |
| 2012-11-08 10:00:00 | 46.28 |
| 2012-11-08 11:00:00 | 44.2 |
| 2012-11-08 12:00:00 | 40.82 |
| 2012-11-08 13:00:00 | 42.38 |
| 2012-11-08 14:00:00 | 42.12 |
| 2012-11-08 15:00:00 | 43.16 |
| 2012-11-08 16:00:00 | 37.7 |
| 2012-11-08 17:00:00 | 29.64 |
| 2012-11-08 18:00:00 | 31.2 |
| 2012-11-08 19:00:00 | 29.12 |
| 2012-11-08 20:00:00 | 28.6 |
| 2012-11-08 21:00:00 | 28.08 |
| 2012-11-08 22:00:00 | 21.84 |
| 2012-11-08 23:00:00 | 18.46 |
| 2012-11-09 | 15.6 |
| 2012-11-09 01:00:00 | 15.6 |
| 2012-11-09 02:00:00 | 15.86 |
| 2012-11-09 03:00:00 | 15.86 |
| 2012-11-09 04:00:00 | 15.86 |
| 2012-11-09 05:00:00 | 17.94 |
| 2012-11-09 06:00:00 | 20.54 |
| 2012-11-09 07:00:00 | 32.24 |
| 2012-11-09 08:00:00 | 52.78 |
| 2012-11-09 09:00:00 | 53.56 |
| 2012-11-09 10:00:00 | 51.74 |
| 2012-11-09 11:00:00 | 49.66 |
| 2012-11-09 12:00:00 | 46.8 |
| 2012-11-09 13:00:00 | 48.1 |
| 2012-11-09 14:00:00 | 48.88 |
| 2012-11-09 15:00:00 | 42.9 |
| 2012-11-09 16:00:00 | 31.2 |
| 2012-11-09 17:00:00 | 26.78 |
| 2012-11-09 18:00:00 | 30.42 |
| 2012-11-09 19:00:00 | 33.8 |
| 2012-11-09 20:00:00 | 30.68 |
| 2012-11-09 21:00:00 | 26.52 |
| 2012-11-09 22:00:00 | 21.58 |
| 2012-11-09 23:00:00 | 16.12 |
| 2012-11-10 | 15.6 |
| 2012-11-10 01:00:00 | 15.6 |
| 2012-11-10 02:00:00 | 15.86 |
| 2012-11-10 03:00:00 | 15.86 |
| 2012-11-10 04:00:00 | 15.6 |
| 2012-11-10 05:00:00 | 15.86 |
| 2012-11-10 06:00:00 | 16.64 |
| 2012-11-10 07:00:00 | 17.94 |
| 2012-11-10 08:00:00 | 19.5 |
| 2012-11-10 09:00:00 | 19.5 |
| 2012-11-10 10:00:00 | 19.5 |
| 2012-11-10 11:00:00 | 18.98 |
| 2012-11-10 12:00:00 | 18.72 |
| 2012-11-10 13:00:00 | 18.98 |
| 2012-11-10 14:00:00 | 18.98 |
| 2012-11-10 15:00:00 | 18.98 |
| 2012-11-10 16:00:00 | 18.98 |
| 2012-11-10 17:00:00 | 19.24 |
| 2012-11-10 18:00:00 | 17.94 |
| 2012-11-10 19:00:00 | 17.16 |
| 2012-11-10 20:00:00 | 17.16 |
| 2012-11-10 21:00:00 | 16.64 |
| 2012-11-10 22:00:00 | 15.6 |
| 2012-11-10 23:00:00 | 15.86 |
| 2012-11-11 | 16.12 |
| 2012-11-11 01:00:00 | 15.86 |
| 2012-11-11 02:00:00 | 15.86 |
| 2012-11-11 03:00:00 | 16.38 |
| 2012-11-11 04:00:00 | 16.38 |
| 2012-11-11 05:00:00 | 16.64 |
| 2012-11-11 06:00:00 | 16.38 |
| 2012-11-11 07:00:00 | 17.42 |
| 2012-11-11 08:00:00 | 18.2 |
| 2012-11-11 09:00:00 | 18.2 |
| 2012-11-11 10:00:00 | 18.46 |
| 2012-11-11 11:00:00 | 16.38 |
| 2012-11-11 12:00:00 | 16.38 |
| 2012-11-11 13:00:00 | 16.38 |
| 2012-11-11 14:00:00 | 16.38 |
| 2012-11-11 15:00:00 | 17.42 |
| 2012-11-11 16:00:00 | 18.72 |
| 2012-11-11 17:00:00 | 19.5 |
| 2012-11-11 18:00:00 | 18.46 |
| 2012-11-11 19:00:00 | 16.38 |
| 2012-11-11 20:00:00 | 16.64 |
| 2012-11-11 21:00:00 | 15.86 |
| 2012-11-11 22:00:00 | 15.86 |
| 2012-11-11 23:00:00 | 15.34 |
| 2012-11-12 | 15.34 |
| 2012-11-12 01:00:00 | 15.34 |
| 2012-11-12 02:00:00 | 15.6 |
| 2012-11-12 03:00:00 | 15.6 |
| 2012-11-12 04:00:00 | 15.6 |
| 2012-11-12 05:00:00 | 17.42 |
| 2012-11-12 06:00:00 | 20.02 |
| 2012-11-12 07:00:00 | 30.68 |
| 2012-11-12 08:00:00 | 53.56 |
| 2012-11-12 09:00:00 | 57.72 |
| 2012-11-12 10:00:00 | 56.16 |
| 2012-11-12 11:00:00 | 53.82 |
| 2012-11-12 12:00:00 | 51.22 |
| 2012-11-12 13:00:00 | 53.56 |
| 2012-11-12 14:00:00 | 54.6 |
| 2012-11-12 15:00:00 | 54.08 |
| 2012-11-12 16:00:00 | 42.64 |
| 2012-11-12 17:00:00 | 32.5 |
| 2012-11-12 18:00:00 | 30.68 |
| 2012-11-12 19:00:00 | 30.94 |
| 2012-11-12 20:00:00 | 30.68 |
| 2012-11-12 21:00:00 | 34.58 |
| 2012-11-12 22:00:00 | 24.44 |
| 2012-11-12 23:00:00 | 19.24 |
| 2012-11-13 | 17.16 |
| 2012-11-13 01:00:00 | 15.34 |
| 2012-11-13 02:00:00 | 15.6 |
| 2012-11-13 03:00:00 | 15.86 |
| 2012-11-13 04:00:00 | 15.86 |
| 2012-11-13 05:00:00 | 16.64 |
| 2012-11-13 06:00:00 | 21.06 |
| 2012-11-13 07:00:00 | 32.76 |
| 2012-11-13 08:00:00 | 56.94 |
| 2012-11-13 09:00:00 | 58.76 |
| 2012-11-13 10:00:00 | 53.82 |
| 2012-11-13 11:00:00 | 50.18 |
| 2012-11-13 12:00:00 | 47.06 |
| 2012-11-13 13:00:00 | 44.72 |
| 2012-11-13 14:00:00 | 47.84 |
| 2012-11-13 15:00:00 | 48.62 |
| 2012-11-13 16:00:00 | 43.68 |
| 2012-11-13 17:00:00 | 32.24 |
| 2012-11-13 18:00:00 | 31.2 |
| 2012-11-13 19:00:00 | 33.8 |
| 2012-11-13 20:00:00 | 37.96 |
| 2012-11-13 21:00:00 | 34.84 |
| 2012-11-13 22:00:00 | 21.58 |
| 2012-11-13 23:00:00 | 20.28 |
| 2012-11-14 | 17.16 |
| 2012-11-14 01:00:00 | 16.12 |
| 2012-11-14 02:00:00 | 16.12 |
| 2012-11-14 03:00:00 | 16.38 |
| 2012-11-14 04:00:00 | 16.38 |
| 2012-11-14 05:00:00 | 17.94 |
| 2012-11-14 06:00:00 | 18.98 |
| 2012-11-14 07:00:00 | 30.68 |
| 2012-11-14 08:00:00 | 53.82 |
| 2012-11-14 09:00:00 | 53.04 |
| 2012-11-14 10:00:00 | 49.4 |
| 2012-11-14 11:00:00 | 48.62 |
| 2012-11-14 12:00:00 | 48.62 |
| 2012-11-14 13:00:00 | 44.98 |
| 2012-11-14 14:00:00 | 40.04 |
| 2012-11-14 15:00:00 | 40.3 |
| 2012-11-14 16:00:00 | 36.92 |
| 2012-11-14 17:00:00 | 30.68 |
| 2012-11-14 18:00:00 | 31.2 |
| 2012-11-14 19:00:00 | 30.94 |
| 2012-11-14 20:00:00 | 27.56 |
| 2012-11-14 21:00:00 | 27.82 |
| 2012-11-14 22:00:00 | 22.36 |
| 2012-11-14 23:00:00 | 17.16 |
| 2012-11-15 | 15.6 |
| 2012-11-15 01:00:00 | 15.6 |
| 2012-11-15 02:00:00 | 15.6 |
| 2012-11-15 03:00:00 | 15.86 |
| 2012-11-15 04:00:00 | 15.6 |
| 2012-11-15 05:00:00 | 17.42 |
| 2012-11-15 06:00:00 | 20.54 |
| 2012-11-15 07:00:00 | 31.46 |
| 2012-11-15 08:00:00 | 50.44 |
| 2012-11-15 09:00:00 | 48.88 |
| 2012-11-15 10:00:00 | 47.58 |
| 2012-11-15 11:00:00 | 46.8 |
| 2012-11-15 12:00:00 | 44.46 |
| 2012-11-15 13:00:00 | 43.68 |
| 2012-11-15 14:00:00 | 42.38 |
| 2012-11-15 15:00:00 | 40.3 |
| 2012-11-15 16:00:00 | 34.06 |
| 2012-11-15 17:00:00 | 29.64 |
| 2012-11-15 18:00:00 | 29.12 |
| 2012-11-15 19:00:00 | 30.42 |
| 2012-11-15 20:00:00 | 29.64 |
| 2012-11-15 21:00:00 | 24.44 |
| 2012-11-15 22:00:00 | 21.32 |
| 2012-11-15 23:00:00 | 18.46 |
| 2012-11-16 | 17.16 |
| 2012-11-16 01:00:00 | 16.9 |
| 2012-11-16 02:00:00 | 16.38 |
| 2012-11-16 03:00:00 | 16.38 |
| 2012-11-16 04:00:00 | 16.64 |
| 2012-11-16 05:00:00 | 17.94 |
| 2012-11-16 06:00:00 | 18.98 |
| 2012-11-16 07:00:00 | 30.42 |
| 2012-11-16 08:00:00 | 52.26 |
| 2012-11-16 09:00:00 | 52.26 |
| 2012-11-16 10:00:00 | 48.88 |
| 2012-11-16 11:00:00 | 47.84 |
| 2012-11-16 12:00:00 | 43.94 |
| 2012-11-16 13:00:00 | 42.12 |
| 2012-11-16 14:00:00 | 38.74 |
| 2012-11-16 15:00:00 | 34.58 |
| 2012-11-16 16:00:00 | 29.38 |
| 2012-11-16 17:00:00 | 27.82 |
| 2012-11-16 18:00:00 | 27.56 |
| 2012-11-16 19:00:00 | 27.04 |
| 2012-11-16 20:00:00 | 29.12 |
| 2012-11-16 21:00:00 | 27.56 |
| 2012-11-16 22:00:00 | 25.22 |
| 2012-11-16 23:00:00 | 21.84 |
| 2012-11-17 | 15.86 |
| 2012-11-17 01:00:00 | 15.6 |
| 2012-11-17 02:00:00 | 15.6 |
| 2012-11-17 03:00:00 | 15.6 |
| 2012-11-17 04:00:00 | 15.6 |
| 2012-11-17 05:00:00 | 16.12 |
| 2012-11-17 06:00:00 | 16.12 |
| 2012-11-17 07:00:00 | 16.38 |
| 2012-11-17 08:00:00 | 15.86 |
| 2012-11-17 09:00:00 | 16.12 |
| 2012-11-17 10:00:00 | 16.64 |
| 2012-11-17 11:00:00 | 16.64 |
| 2012-11-17 12:00:00 | 16.64 |
| 2012-11-17 13:00:00 | 16.64 |
| 2012-11-17 14:00:00 | 16.38 |
| 2012-11-17 15:00:00 | 15.6 |
| 2012-11-17 16:00:00 | 16.38 |
| 2012-11-17 17:00:00 | 16.38 |
| 2012-11-17 18:00:00 | 15.86 |
| 2012-11-17 19:00:00 | 16.64 |
| 2012-11-17 20:00:00 | 16.12 |
| 2012-11-17 21:00:00 | 16.12 |
| 2012-11-17 22:00:00 | 15.86 |
| 2012-11-17 23:00:00 | 16.64 |
| 2012-11-18 | 16.64 |
| 2012-11-18 01:00:00 | 17.16 |
| 2012-11-18 02:00:00 | 16.12 |
| 2012-11-18 03:00:00 | 16.38 |
| 2012-11-18 04:00:00 | 16.38 |
| 2012-11-18 05:00:00 | 16.12 |
| 2012-11-18 06:00:00 | 16.64 |
| 2012-11-18 07:00:00 | 17.16 |
| 2012-11-18 08:00:00 | 19.24 |
| 2012-11-18 09:00:00 | 18.98 |
| 2012-11-18 10:00:00 | 18.98 |
| 2012-11-18 11:00:00 | 18.46 |
| 2012-11-18 12:00:00 | 18.2 |
| 2012-11-18 13:00:00 | 18.46 |
| 2012-11-18 14:00:00 | 18.2 |
| 2012-11-18 15:00:00 | 18.46 |
| 2012-11-18 16:00:00 | 18.2 |
| 2012-11-18 17:00:00 | 20.8 |
| 2012-11-18 18:00:00 | 21.84 |
| 2012-11-18 19:00:00 | 21.58 |
| 2012-11-18 20:00:00 | 18.98 |
| 2012-11-18 21:00:00 | 15.86 |
| 2012-11-18 22:00:00 | 15.34 |
| 2012-11-18 23:00:00 | 17.94 |
| 2012-11-19 | 18.72 |
| 2012-11-19 01:00:00 | 19.24 |
| 2012-11-19 02:00:00 | 18.72 |
| 2012-11-19 03:00:00 | 18.72 |
| 2012-11-19 04:00:00 | 19.24 |
| 2012-11-19 05:00:00 | 19.24 |
| 2012-11-19 06:00:00 | 20.54 |
| 2012-11-19 07:00:00 | 31.2 |
| 2012-11-19 08:00:00 | 52 |
| 2012-11-19 09:00:00 | 55.64 |
| 2012-11-19 10:00:00 | 55.9 |
| 2012-11-19 11:00:00 | 51.74 |
| 2012-11-19 12:00:00 | 49.66 |
| 2012-11-19 13:00:00 | 48.62 |
| 2012-11-19 14:00:00 | 44.98 |
| 2012-11-19 15:00:00 | 41.34 |
| 2012-11-19 16:00:00 | 36.92 |
| 2012-11-19 17:00:00 | 33.8 |
| 2012-11-19 18:00:00 | 30.68 |
| 2012-11-19 19:00:00 | 31.98 |
| 2012-11-19 20:00:00 | 30.42 |
| 2012-11-19 21:00:00 | 31.2 |
| 2012-11-19 22:00:00 | 22.1 |
| 2012-11-19 23:00:00 | 17.68 |
| 2012-11-20 | 16.38 |
| 2012-11-20 01:00:00 | 16.12 |
| 2012-11-20 02:00:00 | 16.38 |
| 2012-11-20 03:00:00 | 16.38 |
| 2012-11-20 04:00:00 | 16.64 |
| 2012-11-20 05:00:00 | 17.94 |
| 2012-11-20 06:00:00 | 18.72 |
| 2012-11-20 07:00:00 | 31.72 |
| 2012-11-20 08:00:00 | 52 |
| 2012-11-20 09:00:00 | 52.26 |
| 2012-11-20 10:00:00 | 50.44 |
| 2012-11-20 11:00:00 | 47.06 |
| 2012-11-20 12:00:00 | 44.72 |
| 2012-11-20 13:00:00 | 44.72 |
| 2012-11-20 14:00:00 | 43.16 |
| 2012-11-20 15:00:00 | 40.56 |
| 2012-11-20 16:00:00 | 35.62 |
| 2012-11-20 17:00:00 | 30.68 |
| 2012-11-20 18:00:00 | 30.68 |
| 2012-11-20 19:00:00 | 31.98 |
| 2012-11-20 20:00:00 | 35.1 |
| 2012-11-20 21:00:00 | 34.58 |
| 2012-11-20 22:00:00 | 22.36 |
| 2012-11-20 23:00:00 | 18.2 |
| 2012-11-21 | 15.6 |
| 2012-11-21 01:00:00 | 15.6 |
| 2012-11-21 02:00:00 | 15.86 |
| 2012-11-21 03:00:00 | 15.86 |
| 2012-11-21 04:00:00 | 15.86 |
| 2012-11-21 05:00:00 | 16.64 |
| 2012-11-21 06:00:00 | 21.06 |
| 2012-11-21 07:00:00 | 32.5 |
| 2012-11-21 08:00:00 | 55.64 |
| 2012-11-21 09:00:00 | 55.9 |
| 2012-11-21 10:00:00 | 54.34 |
| 2012-11-21 11:00:00 | 54.34 |
| 2012-11-21 12:00:00 | 53.04 |
| 2012-11-21 13:00:00 | 54.34 |
| 2012-11-21 14:00:00 | 52.52 |
| 2012-11-21 15:00:00 | 50.18 |
| 2012-11-21 16:00:00 | 42.38 |
| 2012-11-21 17:00:00 | 34.84 |
| 2012-11-21 18:00:00 | 31.98 |
| 2012-11-21 19:00:00 | 31.46 |
| 2012-11-21 20:00:00 | 32.76 |
| 2012-11-21 21:00:00 | 36.14 |
| 2012-11-21 22:00:00 | 23.66 |
| 2012-11-21 23:00:00 | 17.68 |
| 2012-11-22 | 16.38 |
| 2012-11-22 01:00:00 | 16.12 |
| 2012-11-22 02:00:00 | 16.38 |
| 2012-11-22 03:00:00 | 16.12 |
| 2012-11-22 04:00:00 | 16.38 |
| 2012-11-22 05:00:00 | 17.68 |
| 2012-11-22 06:00:00 | 19.24 |
| 2012-11-22 07:00:00 | 30.68 |
| 2012-11-22 08:00:00 | 53.3 |
| 2012-11-22 09:00:00 | 59.02 |
| 2012-11-22 10:00:00 | 56.68 |
| 2012-11-22 11:00:00 | 54.08 |
| 2012-11-22 12:00:00 | 49.4 |
| 2012-11-22 13:00:00 | 46.28 |
| 2012-11-22 14:00:00 | 43.68 |
| 2012-11-22 15:00:00 | 41.6 |
| 2012-11-22 16:00:00 | 37.7 |
| 2012-11-22 17:00:00 | 30.16 |
| 2012-11-22 18:00:00 | 29.64 |
| 2012-11-22 19:00:00 | 32.24 |
| 2012-11-22 20:00:00 | 30.68 |
| 2012-11-22 21:00:00 | 26.78 |
| 2012-11-22 22:00:00 | 21.06 |
| 2012-11-22 23:00:00 | 18.98 |
| 2012-11-23 | 16.12 |
| 2012-11-23 01:00:00 | 15.86 |
| 2012-11-23 02:00:00 | 16.12 |
| 2012-11-23 03:00:00 | 16.12 |
| 2012-11-23 04:00:00 | 15.6 |
| 2012-11-23 05:00:00 | 16.64 |
| 2012-11-23 06:00:00 | 21.84 |
| 2012-11-23 07:00:00 | 33.28 |
| 2012-11-23 08:00:00 | 50.96 |
| 2012-11-23 09:00:00 | 54.86 |
| 2012-11-23 10:00:00 | 54.6 |
| 2012-11-23 11:00:00 | 52 |
| 2012-11-23 12:00:00 | 47.84 |
| 2012-11-23 13:00:00 | 47.84 |
| 2012-11-23 14:00:00 | 47.06 |
| 2012-11-23 15:00:00 | 43.42 |
| 2012-11-23 16:00:00 | 30.16 |
| 2012-11-23 17:00:00 | 26 |
| 2012-11-23 18:00:00 | 30.16 |
| 2012-11-23 19:00:00 | 30.16 |
| 2012-11-23 20:00:00 | 30.94 |
| 2012-11-23 21:00:00 | 27.04 |
| 2012-11-23 22:00:00 | 23.4 |
| 2012-11-23 23:00:00 | 20.02 |
| 2012-11-24 | 15.34 |
| 2012-11-24 01:00:00 | 18.46 |
| 2012-11-24 02:00:00 | 18.72 |
| 2012-11-24 03:00:00 | 18.46 |
| 2012-11-24 04:00:00 | 16.12 |
| 2012-11-24 05:00:00 | 15.86 |
| 2012-11-24 06:00:00 | 16.12 |
| 2012-11-24 07:00:00 | 16.38 |
| 2012-11-24 08:00:00 | 17.42 |
| 2012-11-24 09:00:00 | 18.46 |
| 2012-11-24 10:00:00 | 17.68 |
| 2012-11-24 11:00:00 | 18.98 |
| 2012-11-24 12:00:00 | 19.76 |
| 2012-11-24 13:00:00 | 17.16 |
| 2012-11-24 14:00:00 | 15.86 |
| 2012-11-24 15:00:00 | 15.86 |
| 2012-11-24 16:00:00 | 16.12 |
| 2012-11-24 17:00:00 | 16.38 |
| 2012-11-24 18:00:00 | 16.12 |
| 2012-11-24 19:00:00 | 16.38 |
| 2012-11-24 20:00:00 | 16.12 |
| 2012-11-24 21:00:00 | 16.38 |
| 2012-11-24 22:00:00 | 16.12 |
| 2012-11-24 23:00:00 | 15.86 |
| 2012-11-25 | 15.86 |
| 2012-11-25 01:00:00 | 15.86 |
| 2012-11-25 02:00:00 | 15.86 |
| 2012-11-25 03:00:00 | 17.16 |
| 2012-11-25 04:00:00 | 17.68 |
| 2012-11-25 05:00:00 | 18.46 |
| 2012-11-25 06:00:00 | 17.68 |
| 2012-11-25 07:00:00 | 16.12 |
| 2012-11-25 08:00:00 | 16.12 |
| 2012-11-25 09:00:00 | 15.08 |
| 2012-11-25 10:00:00 | 15.6 |
| 2012-11-25 11:00:00 | 15.08 |
| 2012-11-25 12:00:00 | 17.42 |
| 2012-11-25 13:00:00 | 18.2 |
| 2012-11-25 14:00:00 | 18.98 |
| 2012-11-25 15:00:00 | 15.34 |
| 2012-11-25 16:00:00 | 17.68 |
| 2012-11-25 17:00:00 | 16.64 |
| 2012-11-25 18:00:00 | 18.98 |
| 2012-11-25 19:00:00 | 19.5 |
| 2012-11-25 20:00:00 | 19.5 |
| 2012-11-25 21:00:00 | 18.98 |
| 2012-11-25 22:00:00 | 18.72 |
| 2012-11-25 23:00:00 | 18.72 |
| 2012-11-26 | 18.72 |
| 2012-11-26 01:00:00 | 18.98 |
| 2012-11-26 02:00:00 | 18.72 |
| 2012-11-26 03:00:00 | 17.16 |
| 2012-11-26 04:00:00 | 15.86 |
| 2012-11-26 05:00:00 | 16.12 |
| 2012-11-26 06:00:00 | 18.98 |
| 2012-11-26 07:00:00 | 31.46 |
| 2012-11-26 08:00:00 | 52.52 |
| 2012-11-26 09:00:00 | 52.78 |
| 2012-11-26 10:00:00 | 52 |
| 2012-11-26 11:00:00 | 48.62 |
| 2012-11-26 12:00:00 | 45.24 |
| 2012-11-26 13:00:00 | 43.16 |
| 2012-11-26 14:00:00 | 42.12 |
| 2012-11-26 15:00:00 | 40.56 |
| 2012-11-26 16:00:00 | 36.4 |
| 2012-11-26 17:00:00 | 32.24 |
| 2012-11-26 18:00:00 | 32.76 |
| 2012-11-26 19:00:00 | 33.54 |
| 2012-11-26 20:00:00 | 30.42 |
| 2012-11-26 21:00:00 | 31.46 |
| 2012-11-26 22:00:00 | 22.1 |
| 2012-11-26 23:00:00 | 17.68 |
| 2012-11-27 | 16.38 |
| 2012-11-27 01:00:00 | 16.12 |
| 2012-11-27 02:00:00 | 16.38 |
| 2012-11-27 03:00:00 | 16.38 |
| 2012-11-27 04:00:00 | 16.38 |
| 2012-11-27 05:00:00 | 16.9 |
| 2012-11-27 06:00:00 | 17.42 |
| 2012-11-27 07:00:00 | 32.24 |
| 2012-11-27 08:00:00 | 52.78 |
| 2012-11-27 09:00:00 | 52.78 |
| 2012-11-27 10:00:00 | 48.88 |
| 2012-11-27 11:00:00 | 46.54 |
| 2012-11-27 12:00:00 | 47.32 |
| 2012-11-27 13:00:00 | 45.5 |
| 2012-11-27 14:00:00 | 49.4 |
| 2012-11-27 15:00:00 | 46.8 |
| 2012-11-27 16:00:00 | 40.04 |
| 2012-11-27 17:00:00 | 32.76 |
| 2012-11-27 18:00:00 | 32.5 |
| 2012-11-27 19:00:00 | 35.36 |
| 2012-11-27 20:00:00 | 32.24 |
| 2012-11-27 21:00:00 | 35.1 |
| 2012-11-27 22:00:00 | 24.96 |
| 2012-11-27 23:00:00 | 20.02 |
| 2012-11-28 | 15.86 |
| 2012-11-28 01:00:00 | 16.12 |
| 2012-11-28 02:00:00 | 16.38 |
| 2012-11-28 03:00:00 | 16.12 |
| 2012-11-28 04:00:00 | 16.12 |
| 2012-11-28 05:00:00 | 18.2 |
| 2012-11-28 06:00:00 | 20.02 |
| 2012-11-28 07:00:00 | 32.24 |
| 2012-11-28 08:00:00 | 52.78 |
| 2012-11-28 09:00:00 | 54.34 |
| 2012-11-28 10:00:00 | 50.18 |
| 2012-11-28 11:00:00 | 48.88 |
| 2012-11-28 12:00:00 | 47.32 |
| 2012-11-28 13:00:00 | 45.5 |
| 2012-11-28 14:00:00 | 42.64 |
| 2012-11-28 15:00:00 | 40.56 |
| 2012-11-28 16:00:00 | 35.62 |
| 2012-11-28 17:00:00 | 32.5 |
| 2012-11-28 18:00:00 | 31.46 |
| 2012-11-28 19:00:00 | 34.32 |
| 2012-11-28 20:00:00 | 31.72 |
| 2012-11-28 21:00:00 | 29.64 |
| 2012-11-28 22:00:00 | 23.66 |
| 2012-11-28 23:00:00 | 20.54 |
| 2012-11-29 | 16.38 |
| 2012-11-29 01:00:00 | 16.12 |
| 2012-11-29 02:00:00 | 16.38 |
| 2012-11-29 03:00:00 | 16.38 |
| 2012-11-29 04:00:00 | 16.38 |
| 2012-11-29 05:00:00 | 18.46 |
| 2012-11-29 06:00:00 | 19.24 |
| 2012-11-29 07:00:00 | 31.72 |
| 2012-11-29 08:00:00 | 49.4 |
| 2012-11-29 09:00:00 | 55.9 |
| 2012-11-29 10:00:00 | 54.6 |
| 2012-11-29 11:00:00 | 51.74 |
| 2012-11-29 12:00:00 | 47.06 |
| 2012-11-29 13:00:00 | 52.78 |
| 2012-11-29 14:00:00 | 50.96 |
| 2012-11-29 15:00:00 | 49.14 |
| 2012-11-29 16:00:00 | 39.26 |
| 2012-11-29 17:00:00 | 31.46 |
| 2012-11-29 18:00:00 | 32.76 |
| 2012-11-29 19:00:00 | 34.32 |
| 2012-11-29 20:00:00 | 33.54 |
| 2012-11-29 21:00:00 | 35.88 |
| 2012-11-29 22:00:00 | 23.14 |
| 2012-11-29 23:00:00 | 19.5 |
| 2012-11-30 | 19.5 |
| 2012-11-30 01:00:00 | 19.24 |
| 2012-11-30 02:00:00 | 19.24 |
| 2012-11-30 03:00:00 | 19.5 |
| 2012-11-30 04:00:00 | 19.76 |
| 2012-11-30 05:00:00 | 19.76 |
| 2012-11-30 06:00:00 | 20.54 |
| 2012-11-30 07:00:00 | 31.2 |
| 2012-11-30 08:00:00 | 49.66 |
| 2012-11-30 09:00:00 | 55.38 |
| 2012-11-30 10:00:00 | 53.56 |
| 2012-11-30 11:00:00 | 52.78 |
| 2012-11-30 12:00:00 | 51.74 |
| 2012-11-30 13:00:00 | 50.44 |
| 2012-11-30 14:00:00 | 47.32 |
| 2012-11-30 15:00:00 | 42.38 |
| 2012-11-30 16:00:00 | 33.8 |
| 2012-11-30 17:00:00 | 30.16 |
| 2012-11-30 18:00:00 | 29.38 |
| 2012-11-30 19:00:00 | 31.2 |
| 2012-11-30 20:00:00 | 28.86 |
| 2012-11-30 21:00:00 | 26 |
| 2012-11-30 22:00:00 | 21.58 |
| 2012-11-30 23:00:00 | 20.54 |
| 2012-12-01 | 17.16 |
| 2012-12-01 01:00:00 | 16.38 |
| 2012-12-01 02:00:00 | 16.12 |
| 2012-12-01 03:00:00 | 15.34 |
| 2012-12-01 04:00:00 | 15.6 |
| 2012-12-01 05:00:00 | 15.86 |
| 2012-12-01 06:00:00 | 16.9 |
| 2012-12-01 07:00:00 | 19.5 |
| 2012-12-01 08:00:00 | 22.1 |
| 2012-12-01 09:00:00 | 24.7 |
| 2012-12-01 10:00:00 | 23.92 |
| 2012-12-01 11:00:00 | 22.62 |
| 2012-12-01 12:00:00 | 20.54 |
| 2012-12-01 13:00:00 | 19.5 |
| 2012-12-01 14:00:00 | 20.02 |
| 2012-12-01 15:00:00 | 18.98 |
| 2012-12-01 16:00:00 | 16.38 |
| 2012-12-01 17:00:00 | 15.86 |
| 2012-12-01 18:00:00 | 16.64 |
| 2012-12-01 19:00:00 | 17.68 |
| 2012-12-01 20:00:00 | 17.16 |
| 2012-12-01 21:00:00 | 19.24 |
| 2012-12-01 22:00:00 | 18.98 |
| 2012-12-01 23:00:00 | 19.5 |
| 2012-12-02 | 19.24 |
| 2012-12-02 01:00:00 | 19.24 |
| 2012-12-02 02:00:00 | 20.54 |
| 2012-12-02 03:00:00 | 18.72 |
| 2012-12-02 04:00:00 | 16.38 |
| 2012-12-02 05:00:00 | 16.38 |
| 2012-12-02 06:00:00 | 16.12 |
| 2012-12-02 07:00:00 | 16.64 |
| 2012-12-02 08:00:00 | 17.42 |
| 2012-12-02 09:00:00 | 17.42 |
| 2012-12-02 10:00:00 | 17.16 |
| 2012-12-02 11:00:00 | 17.16 |
| 2012-12-02 12:00:00 | 14.82 |
| 2012-12-02 13:00:00 | 15.34 |
| 2012-12-02 14:00:00 | 15.08 |
| 2012-12-02 15:00:00 | 15.86 |
| 2012-12-02 16:00:00 | 17.16 |
| 2012-12-02 17:00:00 | 17.16 |
| 2012-12-02 18:00:00 | 19.24 |
| 2012-12-02 19:00:00 | 18.46 |
| 2012-12-02 20:00:00 | 16.38 |
| 2012-12-02 21:00:00 | 15.86 |
| 2012-12-02 22:00:00 | 15.6 |
| 2012-12-02 23:00:00 | 15.34 |
| 2012-12-03 | 15.6 |
| 2012-12-03 01:00:00 | 16.12 |
| 2012-12-03 02:00:00 | 17.68 |
| 2012-12-03 03:00:00 | 16.9 |
| 2012-12-03 04:00:00 | 17.94 |
| 2012-12-03 05:00:00 | 18.46 |
| 2012-12-03 06:00:00 | 18.98 |
| 2012-12-03 07:00:00 | 31.72 |
| 2012-12-03 08:00:00 | 52.52 |
| 2012-12-03 09:00:00 | 59.28 |
| 2012-12-03 10:00:00 | 58.24 |
| 2012-12-03 11:00:00 | 55.64 |
| 2012-12-03 12:00:00 | 50.96 |
| 2012-12-03 13:00:00 | 51.22 |
| 2012-12-03 14:00:00 | 49.4 |
| 2012-12-03 15:00:00 | 47.58 |
| 2012-12-03 16:00:00 | 39 |
| 2012-12-03 17:00:00 | 32.5 |
| 2012-12-03 18:00:00 | 30.68 |
| 2012-12-03 19:00:00 | 32.5 |
| 2012-12-03 20:00:00 | 33.54 |
| 2012-12-03 21:00:00 | 35.1 |
| 2012-12-03 22:00:00 | 24.96 |
| 2012-12-03 23:00:00 | 20.54 |
| 2012-12-04 | 18.2 |
| 2012-12-04 01:00:00 | 16.9 |
| 2012-12-04 02:00:00 | 17.16 |
| 2012-12-04 03:00:00 | 17.16 |
| 2012-12-04 04:00:00 | 17.68 |
| 2012-12-04 05:00:00 | 19.24 |
| 2012-12-04 06:00:00 | 21.06 |
| 2012-12-04 07:00:00 | 30.68 |
| 2012-12-04 08:00:00 | 48.88 |
| 2012-12-04 09:00:00 | 52.78 |
| 2012-12-04 10:00:00 | 52.26 |
| 2012-12-04 11:00:00 | 53.04 |
| 2012-12-04 12:00:00 | 50.96 |
| 2012-12-04 13:00:00 | 52.52 |
| 2012-12-04 14:00:00 | 50.44 |
| 2012-12-04 15:00:00 | 50.96 |
| 2012-12-04 16:00:00 | 46.02 |
| 2012-12-04 17:00:00 | 34.06 |
| 2012-12-04 18:00:00 | 31.46 |
| 2012-12-04 19:00:00 | 32.5 |
| 2012-12-04 20:00:00 | 31.72 |
| 2012-12-04 21:00:00 | 33.28 |
| 2012-12-04 22:00:00 | 22.1 |
| 2012-12-04 23:00:00 | 18.46 |
| 2012-12-05 | 15.6 |
| 2012-12-05 01:00:00 | 15.86 |
| 2012-12-05 02:00:00 | 16.12 |
| 2012-12-05 03:00:00 | 16.9 |
| 2012-12-05 04:00:00 | 18.2 |
| 2012-12-05 05:00:00 | 18.46 |
| 2012-12-05 06:00:00 | 21.58 |
| 2012-12-05 07:00:00 | 30.94 |
| 2012-12-05 08:00:00 | 55.64 |
| 2012-12-05 09:00:00 | 54.6 |
| 2012-12-05 10:00:00 | 51.74 |
| 2012-12-05 11:00:00 | 47.84 |
| 2012-12-05 12:00:00 | 47.06 |
| 2012-12-05 13:00:00 | 45.24 |
| 2012-12-05 14:00:00 | 45.76 |
| 2012-12-05 15:00:00 | 45.24 |
| 2012-12-05 16:00:00 | 40.04 |
| 2012-12-05 17:00:00 | 33.28 |
| 2012-12-05 18:00:00 | 31.72 |
| 2012-12-05 19:00:00 | 31.98 |
| 2012-12-05 20:00:00 | 30.94 |
| 2012-12-05 21:00:00 | 29.9 |
| 2012-12-05 22:00:00 | 21.32 |
| 2012-12-05 23:00:00 | 18.2 |
| 2012-12-06 | 16.38 |
| 2012-12-06 01:00:00 | 16.38 |
| 2012-12-06 02:00:00 | 16.64 |
| 2012-12-06 03:00:00 | 16.38 |
| 2012-12-06 04:00:00 | 16.38 |
| 2012-12-06 05:00:00 | 17.94 |
| 2012-12-06 06:00:00 | 19.5 |
| 2012-12-06 07:00:00 | 30.94 |
| 2012-12-06 08:00:00 | 52.78 |
| 2012-12-06 09:00:00 | 55.12 |
| 2012-12-06 10:00:00 | 53.3 |
| 2012-12-06 11:00:00 | 51.74 |
| 2012-12-06 12:00:00 | 47.58 |
| 2012-12-06 13:00:00 | 46.28 |
| 2012-12-06 14:00:00 | 44.46 |
| 2012-12-06 15:00:00 | 49.4 |
| 2012-12-06 16:00:00 | 43.94 |
| 2012-12-06 17:00:00 | 31.98 |
| 2012-12-06 18:00:00 | 31.2 |
| 2012-12-06 19:00:00 | 31.72 |
| 2012-12-06 20:00:00 | 29.12 |
| 2012-12-06 21:00:00 | 26.52 |
| 2012-12-06 22:00:00 | 22.36 |
| 2012-12-06 23:00:00 | 18.46 |
| 2012-12-07 | 15.86 |
| 2012-12-07 01:00:00 | 16.12 |
| 2012-12-07 02:00:00 | 15.86 |
| 2012-12-07 03:00:00 | 16.12 |
| 2012-12-07 04:00:00 | 17.94 |
| 2012-12-07 05:00:00 | 19.5 |
| 2012-12-07 06:00:00 | 22.36 |
| 2012-12-07 07:00:00 | 31.98 |
| 2012-12-07 08:00:00 | 53.82 |
| 2012-12-07 09:00:00 | 54.34 |
| 2012-12-07 10:00:00 | 52.26 |
| 2012-12-07 11:00:00 | 50.18 |
| 2012-12-07 12:00:00 | 45.24 |
| 2012-12-07 13:00:00 | 41.08 |
| 2012-12-07 14:00:00 | 39.52 |
| 2012-12-07 15:00:00 | 36.92 |
| 2012-12-07 16:00:00 | 29.64 |
| 2012-12-07 17:00:00 | 26.78 |
| 2012-12-07 18:00:00 | 28.34 |
| 2012-12-07 19:00:00 | 33.8 |
| 2012-12-07 20:00:00 | 27.3 |
| 2012-12-07 21:00:00 | 26.78 |
| 2012-12-07 22:00:00 | 20.8 |
| 2012-12-07 23:00:00 | 19.76 |
| 2012-12-08 | 16.38 |
| 2012-12-08 01:00:00 | 18.72 |
| 2012-12-08 02:00:00 | 17.94 |
| 2012-12-08 03:00:00 | 18.2 |
| 2012-12-08 04:00:00 | 17.94 |
| 2012-12-08 05:00:00 | 18.2 |
| 2012-12-08 06:00:00 | 19.5 |
| 2012-12-08 07:00:00 | 20.02 |
| 2012-12-08 08:00:00 | 18.46 |
| 2012-12-08 09:00:00 | 18.2 |
| 2012-12-08 10:00:00 | 16.9 |
| 2012-12-08 11:00:00 | 17.16 |
| 2012-12-08 12:00:00 | 17.42 |
| 2012-12-08 13:00:00 | 16.12 |
| 2012-12-08 14:00:00 | 16.12 |
| 2012-12-08 15:00:00 | 16.64 |
| 2012-12-08 16:00:00 | 16.9 |
| 2012-12-08 17:00:00 | 16.9 |
| 2012-12-08 18:00:00 | 16.38 |
| 2012-12-08 19:00:00 | 16.12 |
| 2012-12-08 20:00:00 | 16.12 |
| 2012-12-08 21:00:00 | 15.86 |
| 2012-12-08 22:00:00 | 16.12 |
| 2012-12-08 23:00:00 | 15.86 |
| 2012-12-09 | 15.86 |
| 2012-12-09 01:00:00 | 17.42 |
| 2012-12-09 02:00:00 | 20.02 |
| 2012-12-09 03:00:00 | 19.24 |
| 2012-12-09 04:00:00 | 18.98 |
| 2012-12-09 05:00:00 | 18.72 |
| 2012-12-09 06:00:00 | 18.98 |
| 2012-12-09 07:00:00 | 17.16 |
| 2012-12-09 08:00:00 | 17.16 |
| 2012-12-09 09:00:00 | 18.72 |
| 2012-12-09 10:00:00 | 19.5 |
| 2012-12-09 11:00:00 | 18.98 |
| 2012-12-09 12:00:00 | 19.24 |
| 2012-12-09 13:00:00 | 18.46 |
| 2012-12-09 14:00:00 | 18.2 |
| 2012-12-09 15:00:00 | 16.9 |
| 2012-12-09 16:00:00 | 16.38 |
| 2012-12-09 17:00:00 | 16.38 |
| 2012-12-09 18:00:00 | 16.12 |
| 2012-12-09 19:00:00 | 16.64 |
| 2012-12-09 20:00:00 | 16.12 |
| 2012-12-09 21:00:00 | 16.38 |
| 2012-12-09 22:00:00 | 18.46 |
| 2012-12-09 23:00:00 | 20.54 |
| 2012-12-10 | 19.5 |
| 2012-12-10 01:00:00 | 17.94 |
| 2012-12-10 02:00:00 | 17.16 |
| 2012-12-10 03:00:00 | 16.9 |
| 2012-12-10 04:00:00 | 16.9 |
| 2012-12-10 05:00:00 | 17.94 |
| 2012-12-10 06:00:00 | 18.72 |
| 2012-12-10 07:00:00 | 31.98 |
| 2012-12-10 08:00:00 | 54.08 |
| 2012-12-10 09:00:00 | 58.24 |
| 2012-12-10 10:00:00 | 60.84 |
| 2012-12-10 11:00:00 | 54.34 |
| 2012-12-10 12:00:00 | 51.22 |
| 2012-12-10 13:00:00 | 52.78 |
| 2012-12-10 14:00:00 | 51.74 |
| 2012-12-10 15:00:00 | 48.62 |
| 2012-12-10 16:00:00 | 42.38 |
| 2012-12-10 17:00:00 | 36.4 |
| 2012-12-10 18:00:00 | 32.5 |
| 2012-12-10 19:00:00 | 30.94 |
| 2012-12-10 20:00:00 | 32.24 |
| 2012-12-10 21:00:00 | 32.76 |
| 2012-12-10 22:00:00 | 22.62 |
| 2012-12-10 23:00:00 | 19.76 |
| 2012-12-11 | 15.86 |
| 2012-12-11 01:00:00 | 15.6 |
| 2012-12-11 02:00:00 | 15.86 |
| 2012-12-11 03:00:00 | 16.12 |
| 2012-12-11 04:00:00 | 18.72 |
| 2012-12-11 05:00:00 | 19.76 |
| 2012-12-11 06:00:00 | 22.88 |
| 2012-12-11 07:00:00 | 32.76 |
| 2012-12-11 08:00:00 | 55.38 |
| 2012-12-11 09:00:00 | 59.8 |
| 2012-12-11 10:00:00 | 56.68 |
| 2012-12-11 11:00:00 | 56.42 |
| 2012-12-11 12:00:00 | 55.12 |
| 2012-12-11 13:00:00 | 52 |
| 2012-12-11 14:00:00 | 54.08 |
| 2012-12-11 15:00:00 | 52 |
| 2012-12-11 16:00:00 | 43.94 |
| 2012-12-11 17:00:00 | 33.02 |
| 2012-12-11 18:00:00 | 32.24 |
| 2012-12-11 19:00:00 | 33.8 |
| 2012-12-11 20:00:00 | 34.06 |
| 2012-12-11 21:00:00 | 30.42 |
| 2012-12-11 22:00:00 | 21.84 |
| 2012-12-11 23:00:00 | 18.46 |
| 2012-12-12 | 16.64 |
| 2012-12-12 01:00:00 | 17.16 |
| 2012-12-12 02:00:00 | 18.46 |
| 2012-12-12 03:00:00 | 18.98 |
| 2012-12-12 04:00:00 | 18.98 |
| 2012-12-12 05:00:00 | 18.72 |
| 2012-12-12 06:00:00 | 19.24 |
| 2012-12-12 07:00:00 | 32.76 |
| 2012-12-12 08:00:00 | 57.2 |
| 2012-12-12 09:00:00 | 58.5 |
| 2012-12-12 10:00:00 | 56.68 |
| 2012-12-12 11:00:00 | 55.12 |
| 2012-12-12 12:00:00 | 51.74 |
| 2012-12-12 13:00:00 | 52 |
| 2012-12-12 14:00:00 | 52 |
| 2012-12-12 15:00:00 | 51.74 |
| 2012-12-12 16:00:00 | 43.68 |
| 2012-12-12 17:00:00 | 35.1 |
| 2012-12-12 18:00:00 | 33.28 |
| 2012-12-12 19:00:00 | 33.02 |
| 2012-12-12 20:00:00 | 32.24 |
| 2012-12-12 21:00:00 | 32.5 |
| 2012-12-12 22:00:00 | 24.96 |
| 2012-12-12 23:00:00 | 23.66 |
| 2012-12-13 | 19.5 |
| 2012-12-13 01:00:00 | 19.24 |
| 2012-12-13 02:00:00 | 18.46 |
| 2012-12-13 03:00:00 | 18.98 |
| 2012-12-13 04:00:00 | 19.5 |
| 2012-12-13 05:00:00 | 19.5 |
| 2012-12-13 06:00:00 | 20.54 |
| 2012-12-13 07:00:00 | 32.5 |
| 2012-12-13 08:00:00 | 52.26 |
| 2012-12-13 09:00:00 | 57.98 |
| 2012-12-13 10:00:00 | 55.64 |
| 2012-12-13 11:00:00 | 49.66 |
| 2012-12-13 12:00:00 | 43.68 |
| 2012-12-13 13:00:00 | 42.9 |
| 2012-12-13 14:00:00 | 44.98 |
| 2012-12-13 15:00:00 | 44.98 |
| 2012-12-13 16:00:00 | 36.66 |
| 2012-12-13 17:00:00 | 32.24 |
| 2012-12-13 18:00:00 | 33.54 |
| 2012-12-13 19:00:00 | 36.14 |
| 2012-12-13 20:00:00 | 30.68 |
| 2012-12-13 21:00:00 | 30.94 |
| 2012-12-13 22:00:00 | 23.92 |
| 2012-12-13 23:00:00 | 18.98 |
| 2012-12-14 | 16.12 |
| 2012-12-14 01:00:00 | 16.64 |
| 2012-12-14 02:00:00 | 16.38 |
| 2012-12-14 03:00:00 | 16.38 |
| 2012-12-14 04:00:00 | 17.68 |
| 2012-12-14 05:00:00 | 18.98 |
| 2012-12-14 06:00:00 | 22.1 |
| 2012-12-14 07:00:00 | 32.76 |
| 2012-12-14 08:00:00 | 49.66 |
| 2012-12-14 09:00:00 | 57.72 |
| 2012-12-14 10:00:00 | 53.56 |
| 2012-12-14 11:00:00 | 48.36 |
| 2012-12-14 12:00:00 | 43.94 |
| 2012-12-14 13:00:00 | 40.56 |
| 2012-12-14 14:00:00 | 39.78 |
| 2012-12-14 15:00:00 | 35.88 |
| 2012-12-14 16:00:00 | 29.38 |
| 2012-12-14 17:00:00 | 28.08 |
| 2012-12-14 18:00:00 | 33.54 |
| 2012-12-14 19:00:00 | 29.64 |
| 2012-12-14 20:00:00 | 29.64 |
| 2012-12-14 21:00:00 | 26.52 |
| 2012-12-14 22:00:00 | 21.84 |
| 2012-12-14 23:00:00 | 17.16 |
| 2012-12-15 | 18.72 |
| 2012-12-15 01:00:00 | 17.68 |
| 2012-12-15 02:00:00 | 17.94 |
| 2012-12-15 03:00:00 | 17.68 |
| 2012-12-15 04:00:00 | 18.2 |
| 2012-12-15 05:00:00 | 17.42 |
| 2012-12-15 06:00:00 | 17.16 |
| 2012-12-15 07:00:00 | 17.16 |
| 2012-12-15 08:00:00 | 16.12 |
| 2012-12-15 09:00:00 | 16.12 |
| 2012-12-15 10:00:00 | 15.86 |
| 2012-12-15 11:00:00 | 15.6 |
| 2012-12-15 12:00:00 | 15.6 |
| 2012-12-15 13:00:00 | 15.86 |
| 2012-12-15 14:00:00 | 16.38 |
| 2012-12-15 15:00:00 | 15.6 |
| 2012-12-15 16:00:00 | 16.12 |
| 2012-12-15 17:00:00 | 16.64 |
| 2012-12-15 18:00:00 | 16.38 |
| 2012-12-15 19:00:00 | 16.64 |
| 2012-12-15 20:00:00 | 16.64 |
| 2012-12-15 21:00:00 | 16.38 |
| 2012-12-15 22:00:00 | 17.94 |
| 2012-12-15 23:00:00 | 18.72 |
| 2012-12-16 | 18.98 |
| 2012-12-16 01:00:00 | 19.76 |
| 2012-12-16 02:00:00 | 18.46 |
| 2012-12-16 03:00:00 | 18.98 |
| 2012-12-16 04:00:00 | 18.46 |
| 2012-12-16 05:00:00 | 18.72 |
| 2012-12-16 06:00:00 | 18.98 |
| 2012-12-16 07:00:00 | 18.98 |
| 2012-12-16 08:00:00 | 19.24 |
| 2012-12-16 09:00:00 | 18.2 |
| 2012-12-16 10:00:00 | 18.46 |
| 2012-12-16 11:00:00 | 18.46 |
| 2012-12-16 12:00:00 | 18.2 |
| 2012-12-16 13:00:00 | 17.94 |
| 2012-12-16 14:00:00 | 17.94 |
| 2012-12-16 15:00:00 | 18.2 |
| 2012-12-16 16:00:00 | 19.5 |
| 2012-12-16 17:00:00 | 19.5 |
| 2012-12-16 18:00:00 | 19.24 |
| 2012-12-16 19:00:00 | 18.98 |
| 2012-12-16 20:00:00 | 19.24 |
| 2012-12-16 21:00:00 | 18.98 |
| 2012-12-16 22:00:00 | 18.46 |
| 2012-12-16 23:00:00 | 18.46 |
| 2012-12-17 | 18.46 |
| 2012-12-17 01:00:00 | 18.46 |
| 2012-12-17 02:00:00 | 18.72 |
| 2012-12-17 03:00:00 | 18.72 |
| 2012-12-17 04:00:00 | 18.46 |
| 2012-12-17 05:00:00 | 17.42 |
| 2012-12-17 06:00:00 | 21.06 |
| 2012-12-17 07:00:00 | 32.5 |
| 2012-12-17 08:00:00 | 53.3 |
| 2012-12-17 09:00:00 | 58.76 |
| 2012-12-17 10:00:00 | 53.3 |
| 2012-12-17 11:00:00 | 53.3 |
| 2012-12-17 12:00:00 | 50.44 |
| 2012-12-17 13:00:00 | 51.48 |
| 2012-12-17 14:00:00 | 50.96 |
| 2012-12-17 15:00:00 | 50.7 |
| 2012-12-17 16:00:00 | 41.34 |
| 2012-12-17 17:00:00 | 32.76 |
| 2012-12-17 18:00:00 | 31.72 |
| 2012-12-17 19:00:00 | 31.72 |
| 2012-12-17 20:00:00 | 26.52 |
| 2012-12-17 21:00:00 | 24.44 |
| 2012-12-17 22:00:00 | 22.1 |
| 2012-12-17 23:00:00 | 18.98 |
| 2012-12-18 | 16.12 |
| 2012-12-18 01:00:00 | 18.72 |
| 2012-12-18 02:00:00 | 18.72 |
| 2012-12-18 03:00:00 | 18.98 |
| 2012-12-18 04:00:00 | 19.76 |
| 2012-12-18 05:00:00 | 20.28 |
| 2012-12-18 06:00:00 | 22.36 |
| 2012-12-18 07:00:00 | 33.02 |
| 2012-12-18 08:00:00 | 53.56 |
| 2012-12-18 09:00:00 | 53.04 |
| 2012-12-18 10:00:00 | 49.66 |
| 2012-12-18 11:00:00 | 48.36 |
| 2012-12-18 12:00:00 | 45.24 |
| 2012-12-18 13:00:00 | 47.58 |
| 2012-12-18 14:00:00 | 48.88 |
| 2012-12-18 15:00:00 | 49.92 |
| 2012-12-18 16:00:00 | 38.74 |
| 2012-12-18 17:00:00 | 32.76 |
| 2012-12-18 18:00:00 | 31.2 |
| 2012-12-18 19:00:00 | 37.7 |
| 2012-12-18 20:00:00 | 29.64 |
| 2012-12-18 21:00:00 | 23.66 |
| 2012-12-18 22:00:00 | 22.62 |
| 2012-12-18 23:00:00 | 20.28 |
| 2012-12-19 | 17.16 |
| 2012-12-19 01:00:00 | 16.9 |
| 2012-12-19 02:00:00 | 16.9 |
| 2012-12-19 03:00:00 | 16.9 |
| 2012-12-19 04:00:00 | 16.9 |
| 2012-12-19 05:00:00 | 18.2 |
| 2012-12-19 06:00:00 | 19.76 |
| 2012-12-19 07:00:00 | 33.02 |
| 2012-12-19 08:00:00 | 54.6 |
| 2012-12-19 09:00:00 | 57.72 |
| 2012-12-19 10:00:00 | 56.68 |
| 2012-12-19 11:00:00 | 55.9 |
| 2012-12-19 12:00:00 | 52.52 |
| 2012-12-19 13:00:00 | 53.82 |
| 2012-12-19 14:00:00 | 52.26 |
| 2012-12-19 15:00:00 | 51.74 |
| 2012-12-19 16:00:00 | 41.86 |
| 2012-12-19 17:00:00 | 33.8 |
| 2012-12-19 18:00:00 | 31.72 |
| 2012-12-19 19:00:00 | 32.24 |
| 2012-12-19 20:00:00 | 30.68 |
| 2012-12-19 21:00:00 | 24.18 |
| 2012-12-19 22:00:00 | 21.32 |
| 2012-12-19 23:00:00 | 16.64 |
| 2012-12-20 | 16.38 |
| 2012-12-20 01:00:00 | 16.64 |
| 2012-12-20 02:00:00 | 16.38 |
| 2012-12-20 03:00:00 | 18.98 |
| 2012-12-20 04:00:00 | 19.76 |
| 2012-12-20 05:00:00 | 20.8 |
| 2012-12-20 06:00:00 | 23.66 |
| 2012-12-20 07:00:00 | 34.06 |
| 2012-12-20 08:00:00 | 51.74 |
| 2012-12-20 09:00:00 | 56.94 |
| 2012-12-20 10:00:00 | 54.34 |
| 2012-12-20 11:00:00 | 48.62 |
| 2012-12-20 12:00:00 | 42.9 |
| 2012-12-20 13:00:00 | 41.86 |
| 2012-12-20 14:00:00 | 40.04 |
| 2012-12-20 15:00:00 | 37.96 |
| 2012-12-20 16:00:00 | 33.8 |
| 2012-12-20 17:00:00 | 29.64 |
| 2012-12-20 18:00:00 | 28.34 |
| 2012-12-20 19:00:00 | 33.02 |
| 2012-12-20 20:00:00 | 27.3 |
| 2012-12-20 21:00:00 | 26 |
| 2012-12-20 22:00:00 | 21.58 |
| 2012-12-20 23:00:00 | 19.24 |
| 2012-12-21 | 19.24 |
| 2012-12-21 01:00:00 | 19.24 |
| 2012-12-21 02:00:00 | 19.5 |
| 2012-12-21 03:00:00 | 19.5 |
| 2012-12-21 04:00:00 | 19.76 |
| 2012-12-21 05:00:00 | 18.98 |
| 2012-12-21 06:00:00 | 21.58 |
| 2012-12-21 07:00:00 | 31.72 |
| 2012-12-21 08:00:00 | 48.88 |
| 2012-12-21 09:00:00 | 55.12 |
| 2012-12-21 10:00:00 | 53.56 |
| 2012-12-21 11:00:00 | 52 |
| 2012-12-21 12:00:00 | 46.28 |
| 2012-12-21 13:00:00 | 44.46 |
| 2012-12-21 14:00:00 | 41.86 |
| 2012-12-21 15:00:00 | 36.4 |
| 2012-12-21 16:00:00 | 28.08 |
| 2012-12-21 17:00:00 | 27.04 |
| 2012-12-21 18:00:00 | 24.44 |
| 2012-12-21 19:00:00 | 23.66 |
| 2012-12-21 20:00:00 | 23.66 |
| 2012-12-21 21:00:00 | 22.36 |
| 2012-12-21 22:00:00 | 21.58 |
| 2012-12-21 23:00:00 | 21.06 |
| 2012-12-22 | 16.64 |
| 2012-12-22 01:00:00 | 16.12 |
| 2012-12-22 02:00:00 | 16.38 |
| 2012-12-22 03:00:00 | 16.38 |
| 2012-12-22 04:00:00 | 16.12 |
| 2012-12-22 05:00:00 | 16.38 |
| 2012-12-22 06:00:00 | 16.9 |
| 2012-12-22 07:00:00 | 16.64 |
| 2012-12-22 08:00:00 | 17.16 |
| 2012-12-22 09:00:00 | 19.24 |
| 2012-12-22 10:00:00 | 18.46 |
| 2012-12-22 11:00:00 | 18.46 |
| 2012-12-22 12:00:00 | 18.46 |
| 2012-12-22 13:00:00 | 17.42 |
| 2012-12-22 14:00:00 | 17.68 |
| 2012-12-22 15:00:00 | 18.98 |
| 2012-12-22 16:00:00 | 21.84 |
| 2012-12-22 17:00:00 | 19.76 |
| 2012-12-22 18:00:00 | 20.28 |
| 2012-12-22 19:00:00 | 20.8 |
| 2012-12-22 20:00:00 | 20.8 |
| 2012-12-22 21:00:00 | 18.98 |
| 2012-12-22 22:00:00 | 18.72 |
| 2012-12-22 23:00:00 | 18.98 |
| 2012-12-23 | 18.72 |
| 2012-12-23 01:00:00 | 18.98 |
| 2012-12-23 02:00:00 | 18.72 |
| 2012-12-23 03:00:00 | 18.72 |
| 2012-12-23 04:00:00 | 18.2 |
| 2012-12-23 05:00:00 | 18.72 |
| 2012-12-23 06:00:00 | 18.46 |
| 2012-12-23 07:00:00 | 18.98 |
| 2012-12-23 08:00:00 | 17.16 |
| 2012-12-23 09:00:00 | 16.38 |
| 2012-12-23 10:00:00 | 15.6 |
| 2012-12-23 11:00:00 | 15.6 |
| 2012-12-23 12:00:00 | 15.86 |
| 2012-12-23 13:00:00 | 16.12 |
| 2012-12-23 14:00:00 | 16.38 |
| 2012-12-23 15:00:00 | 15.86 |
| 2012-12-23 16:00:00 | 16.64 |
| 2012-12-23 17:00:00 | 16.9 |
| 2012-12-23 18:00:00 | 16.64 |
| 2012-12-23 19:00:00 | 16.9 |
| 2012-12-23 20:00:00 | 16.9 |
| 2012-12-23 21:00:00 | 16.9 |
| 2012-12-23 22:00:00 | 16.64 |
| 2012-12-23 23:00:00 | 16.64 |
| 2012-12-24 | 16.9 |
| 2012-12-24 01:00:00 | 18.72 |
| 2012-12-24 02:00:00 | 19.5 |
| 2012-12-24 03:00:00 | 18.72 |
| 2012-12-24 04:00:00 | 18.98 |
| 2012-12-24 05:00:00 | 19.24 |
| 2012-12-24 06:00:00 | 18.72 |
| 2012-12-24 07:00:00 | 19.24 |
| 2012-12-24 08:00:00 | 18.98 |
| 2012-12-24 09:00:00 | 17.94 |
| 2012-12-24 10:00:00 | 17.42 |
| 2012-12-24 11:00:00 | 17.68 |
| 2012-12-24 12:00:00 | 17.68 |
| 2012-12-24 13:00:00 | 17.68 |
| 2012-12-24 14:00:00 | 17.42 |
| 2012-12-24 15:00:00 | 17.42 |
| 2012-12-24 16:00:00 | 17.94 |
| 2012-12-24 17:00:00 | 18.46 |
| 2012-12-24 18:00:00 | 18.98 |
| 2012-12-24 19:00:00 | 18.2 |
| 2012-12-24 20:00:00 | 18.46 |
| 2012-12-24 21:00:00 | 18.72 |
| 2012-12-24 22:00:00 | 17.94 |
| 2012-12-24 23:00:00 | 18.2 |
| 2012-12-25 | 18.46 |
| 2012-12-25 01:00:00 | 18.98 |
| 2012-12-25 02:00:00 | 18.2 |
| 2012-12-25 03:00:00 | 18.2 |
| 2012-12-25 04:00:00 | 18.46 |
| 2012-12-25 05:00:00 | 18.72 |
| 2012-12-25 06:00:00 | 19.24 |
| 2012-12-25 07:00:00 | 18.2 |
| 2012-12-25 08:00:00 | 16.9 |
| 2012-12-25 09:00:00 | 16.12 |
| 2012-12-25 10:00:00 | 15.6 |
| 2012-12-25 11:00:00 | 15.34 |
| 2012-12-25 12:00:00 | 15.6 |
| 2012-12-25 13:00:00 | 15.34 |
| 2012-12-25 14:00:00 | 15.6 |
| 2012-12-25 15:00:00 | 15.34 |
| 2012-12-25 16:00:00 | 16.12 |
| 2012-12-25 17:00:00 | 16.38 |
| 2012-12-25 18:00:00 | 16.38 |
| 2012-12-25 19:00:00 | 16.64 |
| 2012-12-25 20:00:00 | 17.42 |
| 2012-12-25 21:00:00 | 18.98 |
| 2012-12-25 22:00:00 | 18.98 |
| 2012-12-25 23:00:00 | 18.72 |
| 2012-12-26 | 20.02 |
| 2012-12-26 01:00:00 | 19.5 |
| 2012-12-26 02:00:00 | 19.24 |
| 2012-12-26 03:00:00 | 18.98 |
| 2012-12-26 04:00:00 | 18.72 |
| 2012-12-26 05:00:00 | 18.98 |
| 2012-12-26 06:00:00 | 18.98 |
| 2012-12-26 07:00:00 | 19.24 |
| 2012-12-26 08:00:00 | 18.98 |
| 2012-12-26 09:00:00 | 18.2 |
| 2012-12-26 10:00:00 | 17.42 |
| 2012-12-26 11:00:00 | 17.42 |
| 2012-12-26 12:00:00 | 17.42 |
| 2012-12-26 13:00:00 | 17.42 |
| 2012-12-26 14:00:00 | 17.94 |
| 2012-12-26 15:00:00 | 17.94 |
| 2012-12-26 16:00:00 | 18.2 |
| 2012-12-26 17:00:00 | 18.46 |
| 2012-12-26 18:00:00 | 18.72 |
| 2012-12-26 19:00:00 | 18.46 |
| 2012-12-26 20:00:00 | 18.46 |
| 2012-12-26 21:00:00 | 18.2 |
| 2012-12-26 22:00:00 | 18.2 |
| 2012-12-26 23:00:00 | 18.2 |
| 2012-12-27 | 18.46 |
| 2012-12-27 01:00:00 | 18.72 |
| 2012-12-27 02:00:00 | 18.46 |
| 2012-12-27 03:00:00 | 18.46 |
| 2012-12-27 04:00:00 | 18.2 |
| 2012-12-27 05:00:00 | 18.46 |
| 2012-12-27 06:00:00 | 19.5 |
| 2012-12-27 07:00:00 | 26 |
| 2012-12-27 08:00:00 | 37.96 |
| 2012-12-27 09:00:00 | 38.22 |
| 2012-12-27 10:00:00 | 36.92 |
| 2012-12-27 11:00:00 | 36.66 |
| 2012-12-27 12:00:00 | 34.06 |
| 2012-12-27 13:00:00 | 33.02 |
| 2012-12-27 14:00:00 | 32.76 |
| 2012-12-27 15:00:00 | 31.2 |
| 2012-12-27 16:00:00 | 26 |
| 2012-12-27 17:00:00 | 24.18 |
| 2012-12-27 18:00:00 | 27.04 |
| 2012-12-27 19:00:00 | 27.3 |
| 2012-12-27 20:00:00 | 23.66 |
| 2012-12-27 21:00:00 | 23.66 |
| 2012-12-27 22:00:00 | 20.28 |
| 2012-12-27 23:00:00 | 17.42 |
| 2012-12-28 | 17.16 |
| 2012-12-28 01:00:00 | 16.9 |
| 2012-12-28 02:00:00 | 16.9 |
| 2012-12-28 03:00:00 | 17.16 |
| 2012-12-28 04:00:00 | 17.16 |
| 2012-12-28 05:00:00 | 18.46 |
| 2012-12-28 06:00:00 | 19.24 |
| 2012-12-28 07:00:00 | 27.04 |
| 2012-12-28 08:00:00 | 43.16 |
| 2012-12-28 09:00:00 | 45.5 |
| 2012-12-28 10:00:00 | 43.68 |
| 2012-12-28 11:00:00 | 41.86 |
| 2012-12-28 12:00:00 | 39.78 |
| 2012-12-28 13:00:00 | 36.14 |
| 2012-12-28 14:00:00 | 34.58 |
| 2012-12-28 15:00:00 | 31.46 |
| 2012-12-28 16:00:00 | 27.56 |
| 2012-12-28 17:00:00 | 28.34 |
| 2012-12-28 18:00:00 | 29.12 |
| 2012-12-28 19:00:00 | 26.52 |
| 2012-12-28 20:00:00 | 23.66 |
| 2012-12-28 21:00:00 | 21.32 |
| 2012-12-28 22:00:00 | 18.2 |
| 2012-12-28 23:00:00 | 15.86 |
| 2012-12-29 | 17.94 |
| 2012-12-29 01:00:00 | 18.72 |
| 2012-12-29 02:00:00 | 18.46 |
| 2012-12-29 03:00:00 | 18.2 |
| 2012-12-29 04:00:00 | 18.2 |
| 2012-12-29 05:00:00 | 18.72 |
| 2012-12-29 06:00:00 | 19.24 |
| 2012-12-29 07:00:00 | 18.98 |
| 2012-12-29 08:00:00 | 18.2 |
| 2012-12-29 09:00:00 | 20.28 |
| 2012-12-29 10:00:00 | 21.06 |
| 2012-12-29 11:00:00 | 18.46 |
| 2012-12-29 12:00:00 | 18.2 |
| 2012-12-29 13:00:00 | 18.2 |
| 2012-12-29 14:00:00 | 18.2 |
| 2012-12-29 15:00:00 | 18.72 |
| 2012-12-29 16:00:00 | 18.98 |
| 2012-12-29 17:00:00 | 18.46 |
| 2012-12-29 18:00:00 | 17.16 |
| 2012-12-29 19:00:00 | 16.64 |
| 2012-12-29 20:00:00 | 17.16 |
| 2012-12-29 21:00:00 | 17.42 |
| 2012-12-29 22:00:00 | 16.38 |
| 2012-12-29 23:00:00 | 16.38 |
| 2012-12-30 | 17.94 |
| 2012-12-30 01:00:00 | 19.5 |
| 2012-12-30 02:00:00 | 20.02 |
| 2012-12-30 03:00:00 | 19.24 |
| 2012-12-30 04:00:00 | 19.5 |
| 2012-12-30 05:00:00 | 19.76 |
| 2012-12-30 06:00:00 | 19.24 |
| 2012-12-30 07:00:00 | 19.24 |
| 2012-12-30 08:00:00 | 19.5 |
| 2012-12-30 09:00:00 | 17.42 |
| 2012-12-30 10:00:00 | 17.42 |
| 2012-12-30 11:00:00 | 17.68 |
| 2012-12-30 12:00:00 | 17.42 |
| 2012-12-30 13:00:00 | 16.38 |
| 2012-12-30 14:00:00 | 15.6 |
| 2012-12-30 15:00:00 | 15.86 |
| 2012-12-30 16:00:00 | 16.12 |
| 2012-12-30 17:00:00 | 16.38 |
| 2012-12-30 18:00:00 | 16.64 |
| 2012-12-30 19:00:00 | 16.38 |
| 2012-12-30 20:00:00 | 16.64 |
| 2012-12-30 21:00:00 | 16.64 |
| 2012-12-30 22:00:00 | 18.72 |
| 2012-12-30 23:00:00 | 18.98 |
| 2012-12-31 | 18.98 |
| 2012-12-31 | 19.24 |
| 2012-12-31 | 18.72 |
| 2012-12-31 | 18.72 |
| 2012-12-31 | 18.98 |
| 2012-12-31 | 18.72 |
| 2012-12-31 | 21.84 |
| 2012-12-31 | 29.64 |
| 2012-12-31 | 38.74 |
| 2012-12-31 | 35.88 |
| 2012-12-31 | 32.24 |
| 2012-12-31 | 31.72 |
| 2012-12-31 | 30.68 |
| 2012-12-31 | 28.6 |
| 2012-12-31 | 26.26 |
| 2012-12-31 | 24.96 |
| 2012-12-31 | 27.56 |
| 2012-12-31 | 28.86 |
| 2012-12-31 | 26 |
| 2012-12-31 | 23.66 |
| 2012-12-31 | 20.54 |
| 2012-12-31 | 18.46 |
| 2012-12-31 | 18.46 |
| 2012-12-31 | 18.98 |
| 2013-01-01 | 19.24 |